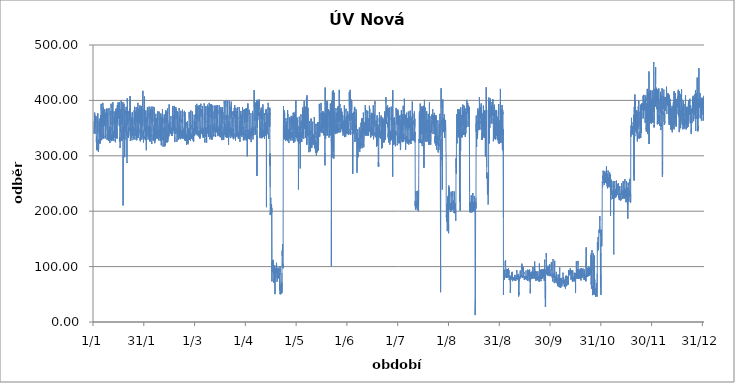
| Category | Series 0 |
|---|---|
| 2012-01-01 01:00:00 | 362.75 |
| 2012-01-01 02:00:00 | 362 |
| 2012-01-01 03:00:00 | 342.5 |
| 2012-01-01 04:00:00 | 340 |
| 2012-01-01 05:00:00 | 340.5 |
| 2012-01-01 06:00:00 | 355.75 |
| 2012-01-01 07:00:00 | 361.25 |
| 2012-01-01 08:00:00 | 362 |
| 2012-01-01 09:00:00 | 364.5 |
| 2012-01-01 10:00:00 | 375 |
| 2012-01-01 11:00:00 | 378 |
| 2012-01-01 12:00:00 | 364.5 |
| 2012-01-01 13:00:00 | 361 |
| 2012-01-01 14:00:00 | 354.25 |
| 2012-01-01 15:00:00 | 352.75 |
| 2012-01-01 16:00:00 | 354 |
| 2012-01-01 17:00:00 | 354.5 |
| 2012-01-01 18:00:00 | 363 |
| 2012-01-01 19:00:00 | 360.25 |
| 2012-01-01 20:00:00 | 368 |
| 2012-01-01 21:00:00 | 372.5 |
| 2012-01-01 22:00:00 | 369.5 |
| 2012-01-01 23:00:00 | 368.75 |
| 2012-01-02 | 368.5 |
| 2012-01-02 01:00:00 | 347.25 |
| 2012-01-02 02:00:00 | 344 |
| 2012-01-02 03:00:00 | 340 |
| 2012-01-02 04:00:00 | 342.25 |
| 2012-01-02 05:00:00 | 345 |
| 2012-01-02 06:00:00 | 359 |
| 2012-01-02 07:00:00 | 361 |
| 2012-01-02 08:00:00 | 371.25 |
| 2012-01-02 09:00:00 | 369 |
| 2012-01-02 10:00:00 | 334.75 |
| 2012-01-02 11:00:00 | 325 |
| 2012-01-02 12:00:00 | 325 |
| 2012-01-02 13:00:00 | 335.5 |
| 2012-01-02 14:00:00 | 318 |
| 2012-01-02 15:00:00 | 310.25 |
| 2012-01-02 16:00:00 | 317.75 |
| 2012-01-02 17:00:00 | 311.25 |
| 2012-01-02 18:00:00 | 315 |
| 2012-01-02 19:00:00 | 312.25 |
| 2012-01-02 20:00:00 | 314.5 |
| 2012-01-02 21:00:00 | 312.5 |
| 2012-01-02 22:00:00 | 314.5 |
| 2012-01-02 23:00:00 | 327.25 |
| 2012-01-03 | 333.5 |
| 2012-01-03 01:00:00 | 365.25 |
| 2012-01-03 02:00:00 | 362.75 |
| 2012-01-03 03:00:00 | 360.75 |
| 2012-01-03 04:00:00 | 343.5 |
| 2012-01-03 05:00:00 | 358.75 |
| 2012-01-03 06:00:00 | 363 |
| 2012-01-03 07:00:00 | 369 |
| 2012-01-03 08:00:00 | 376.75 |
| 2012-01-03 09:00:00 | 351 |
| 2012-01-03 10:00:00 | 314.75 |
| 2012-01-03 11:00:00 | 309.25 |
| 2012-01-03 12:00:00 | 315.5 |
| 2012-01-03 13:00:00 | 329 |
| 2012-01-03 14:00:00 | 322.5 |
| 2012-01-03 15:00:00 | 320.5 |
| 2012-01-03 16:00:00 | 316 |
| 2012-01-03 17:00:00 | 307.25 |
| 2012-01-03 18:00:00 | 311 |
| 2012-01-03 19:00:00 | 312.75 |
| 2012-01-03 20:00:00 | 312 |
| 2012-01-03 21:00:00 | 313 |
| 2012-01-03 22:00:00 | 314 |
| 2012-01-03 23:00:00 | 323.25 |
| 2012-01-04 | 327.25 |
| 2012-01-04 01:00:00 | 361.75 |
| 2012-01-04 02:00:00 | 360.5 |
| 2012-01-04 03:00:00 | 358.75 |
| 2012-01-04 04:00:00 | 343.75 |
| 2012-01-04 05:00:00 | 340.5 |
| 2012-01-04 06:00:00 | 354 |
| 2012-01-04 07:00:00 | 367 |
| 2012-01-04 08:00:00 | 325.75 |
| 2012-01-04 09:00:00 | 335 |
| 2012-01-04 10:00:00 | 340.5 |
| 2012-01-04 11:00:00 | 324.75 |
| 2012-01-04 12:00:00 | 322.25 |
| 2012-01-04 13:00:00 | 324.75 |
| 2012-01-04 14:00:00 | 323.5 |
| 2012-01-04 15:00:00 | 323 |
| 2012-01-04 16:00:00 | 330.75 |
| 2012-01-04 17:00:00 | 331 |
| 2012-01-04 18:00:00 | 322.5 |
| 2012-01-04 19:00:00 | 330.5 |
| 2012-01-04 20:00:00 | 324 |
| 2012-01-04 21:00:00 | 327.25 |
| 2012-01-04 22:00:00 | 332.75 |
| 2012-01-04 23:00:00 | 355 |
| 2012-01-05 | 353.75 |
| 2012-01-05 01:00:00 | 373.5 |
| 2012-01-05 02:00:00 | 373.5 |
| 2012-01-05 03:00:00 | 356.25 |
| 2012-01-05 04:00:00 | 352.25 |
| 2012-01-05 05:00:00 | 364 |
| 2012-01-05 06:00:00 | 371.5 |
| 2012-01-05 07:00:00 | 388.5 |
| 2012-01-05 08:00:00 | 393.75 |
| 2012-01-05 09:00:00 | 380.75 |
| 2012-01-05 10:00:00 | 367.5 |
| 2012-01-05 11:00:00 | 372.5 |
| 2012-01-05 12:00:00 | 373.75 |
| 2012-01-05 13:00:00 | 375 |
| 2012-01-05 14:00:00 | 328.25 |
| 2012-01-05 15:00:00 | 335 |
| 2012-01-05 16:00:00 | 334.25 |
| 2012-01-05 17:00:00 | 335 |
| 2012-01-05 18:00:00 | 333.25 |
| 2012-01-05 19:00:00 | 332.25 |
| 2012-01-05 20:00:00 | 330.25 |
| 2012-01-05 21:00:00 | 330.5 |
| 2012-01-05 22:00:00 | 336.5 |
| 2012-01-05 23:00:00 | 359.5 |
| 2012-01-06 | 376.5 |
| 2012-01-06 01:00:00 | 378.25 |
| 2012-01-06 02:00:00 | 381.5 |
| 2012-01-06 03:00:00 | 356.5 |
| 2012-01-06 04:00:00 | 352 |
| 2012-01-06 05:00:00 | 362 |
| 2012-01-06 06:00:00 | 373.75 |
| 2012-01-06 07:00:00 | 383 |
| 2012-01-06 08:00:00 | 395.5 |
| 2012-01-06 09:00:00 | 390.25 |
| 2012-01-06 10:00:00 | 343.5 |
| 2012-01-06 11:00:00 | 331.25 |
| 2012-01-06 12:00:00 | 342 |
| 2012-01-06 13:00:00 | 369.75 |
| 2012-01-06 14:00:00 | 379.25 |
| 2012-01-06 15:00:00 | 373.5 |
| 2012-01-06 16:00:00 | 379.5 |
| 2012-01-06 17:00:00 | 387.75 |
| 2012-01-06 18:00:00 | 385.25 |
| 2012-01-06 19:00:00 | 359.25 |
| 2012-01-06 20:00:00 | 331.5 |
| 2012-01-06 21:00:00 | 333.5 |
| 2012-01-06 22:00:00 | 339.25 |
| 2012-01-06 23:00:00 | 356.25 |
| 2012-01-07 | 375.75 |
| 2012-01-07 01:00:00 | 378 |
| 2012-01-07 02:00:00 | 376.75 |
| 2012-01-07 03:00:00 | 358.25 |
| 2012-01-07 04:00:00 | 354 |
| 2012-01-07 05:00:00 | 376 |
| 2012-01-07 06:00:00 | 375.75 |
| 2012-01-07 07:00:00 | 378 |
| 2012-01-07 08:00:00 | 374.75 |
| 2012-01-07 09:00:00 | 375.25 |
| 2012-01-07 10:00:00 | 384.5 |
| 2012-01-07 11:00:00 | 381.25 |
| 2012-01-07 12:00:00 | 374 |
| 2012-01-07 13:00:00 | 374 |
| 2012-01-07 14:00:00 | 370.5 |
| 2012-01-07 15:00:00 | 369.5 |
| 2012-01-07 16:00:00 | 377.75 |
| 2012-01-07 17:00:00 | 374.5 |
| 2012-01-07 18:00:00 | 331.25 |
| 2012-01-07 19:00:00 | 336 |
| 2012-01-07 20:00:00 | 333.75 |
| 2012-01-07 21:00:00 | 334 |
| 2012-01-07 22:00:00 | 340.75 |
| 2012-01-07 23:00:00 | 341.75 |
| 2012-01-08 | 363.25 |
| 2012-01-08 01:00:00 | 376 |
| 2012-01-08 02:00:00 | 375.75 |
| 2012-01-08 03:00:00 | 370 |
| 2012-01-08 04:00:00 | 352.25 |
| 2012-01-08 05:00:00 | 370.5 |
| 2012-01-08 06:00:00 | 371.25 |
| 2012-01-08 07:00:00 | 377 |
| 2012-01-08 08:00:00 | 372 |
| 2012-01-08 09:00:00 | 375.5 |
| 2012-01-08 10:00:00 | 382.5 |
| 2012-01-08 11:00:00 | 369 |
| 2012-01-08 12:00:00 | 367.75 |
| 2012-01-08 13:00:00 | 376.5 |
| 2012-01-08 14:00:00 | 373.25 |
| 2012-01-08 15:00:00 | 371 |
| 2012-01-08 16:00:00 | 379.25 |
| 2012-01-08 17:00:00 | 385.5 |
| 2012-01-08 18:00:00 | 375 |
| 2012-01-08 19:00:00 | 384.5 |
| 2012-01-08 20:00:00 | 345.75 |
| 2012-01-08 21:00:00 | 328.75 |
| 2012-01-08 22:00:00 | 340 |
| 2012-01-08 23:00:00 | 348.25 |
| 2012-01-09 | 357.75 |
| 2012-01-09 01:00:00 | 377 |
| 2012-01-09 02:00:00 | 369 |
| 2012-01-09 03:00:00 | 358 |
| 2012-01-09 04:00:00 | 350.25 |
| 2012-01-09 05:00:00 | 366.75 |
| 2012-01-09 06:00:00 | 374 |
| 2012-01-09 07:00:00 | 375.5 |
| 2012-01-09 08:00:00 | 340.75 |
| 2012-01-09 09:00:00 | 334.5 |
| 2012-01-09 10:00:00 | 346.25 |
| 2012-01-09 11:00:00 | 336.75 |
| 2012-01-09 12:00:00 | 331.5 |
| 2012-01-09 13:00:00 | 342.25 |
| 2012-01-09 14:00:00 | 337.25 |
| 2012-01-09 15:00:00 | 329.25 |
| 2012-01-09 16:00:00 | 327.25 |
| 2012-01-09 17:00:00 | 339 |
| 2012-01-09 18:00:00 | 332.75 |
| 2012-01-09 19:00:00 | 334.5 |
| 2012-01-09 20:00:00 | 333.5 |
| 2012-01-09 21:00:00 | 332.5 |
| 2012-01-09 22:00:00 | 346.5 |
| 2012-01-09 23:00:00 | 354.25 |
| 2012-01-10 | 355.25 |
| 2012-01-10 01:00:00 | 386.25 |
| 2012-01-10 02:00:00 | 372.75 |
| 2012-01-10 03:00:00 | 355 |
| 2012-01-10 04:00:00 | 353 |
| 2012-01-10 05:00:00 | 353 |
| 2012-01-10 06:00:00 | 329.25 |
| 2012-01-10 07:00:00 | 343.25 |
| 2012-01-10 08:00:00 | 345.75 |
| 2012-01-10 09:00:00 | 340.5 |
| 2012-01-10 10:00:00 | 353 |
| 2012-01-10 11:00:00 | 348.5 |
| 2012-01-10 12:00:00 | 344.25 |
| 2012-01-10 13:00:00 | 323 |
| 2012-01-10 14:00:00 | 332.25 |
| 2012-01-10 15:00:00 | 336.25 |
| 2012-01-10 16:00:00 | 329 |
| 2012-01-10 17:00:00 | 335 |
| 2012-01-10 18:00:00 | 342.75 |
| 2012-01-10 19:00:00 | 332.75 |
| 2012-01-10 20:00:00 | 336 |
| 2012-01-10 21:00:00 | 332.25 |
| 2012-01-10 22:00:00 | 344.75 |
| 2012-01-10 23:00:00 | 354.5 |
| 2012-01-11 | 363.5 |
| 2012-01-11 01:00:00 | 381 |
| 2012-01-11 02:00:00 | 373.25 |
| 2012-01-11 03:00:00 | 362.5 |
| 2012-01-11 04:00:00 | 355.5 |
| 2012-01-11 05:00:00 | 362.5 |
| 2012-01-11 06:00:00 | 381.25 |
| 2012-01-11 07:00:00 | 394 |
| 2012-01-11 08:00:00 | 385.75 |
| 2012-01-11 09:00:00 | 339 |
| 2012-01-11 10:00:00 | 333 |
| 2012-01-11 11:00:00 | 332.25 |
| 2012-01-11 12:00:00 | 326.5 |
| 2012-01-11 13:00:00 | 337.25 |
| 2012-01-11 14:00:00 | 338.5 |
| 2012-01-11 15:00:00 | 338.75 |
| 2012-01-11 16:00:00 | 329.75 |
| 2012-01-11 17:00:00 | 333 |
| 2012-01-11 18:00:00 | 338 |
| 2012-01-11 19:00:00 | 330 |
| 2012-01-11 20:00:00 | 334.25 |
| 2012-01-11 21:00:00 | 332 |
| 2012-01-11 22:00:00 | 331 |
| 2012-01-11 23:00:00 | 350.75 |
| 2012-01-12 | 345.25 |
| 2012-01-12 01:00:00 | 381.5 |
| 2012-01-12 02:00:00 | 379 |
| 2012-01-12 03:00:00 | 367.25 |
| 2012-01-12 04:00:00 | 356.25 |
| 2012-01-12 05:00:00 | 366 |
| 2012-01-12 06:00:00 | 376 |
| 2012-01-12 07:00:00 | 387 |
| 2012-01-12 08:00:00 | 396.75 |
| 2012-01-12 09:00:00 | 355.25 |
| 2012-01-12 10:00:00 | 331.5 |
| 2012-01-12 11:00:00 | 327 |
| 2012-01-12 12:00:00 | 335 |
| 2012-01-12 13:00:00 | 343 |
| 2012-01-12 14:00:00 | 339.5 |
| 2012-01-12 15:00:00 | 330.5 |
| 2012-01-12 16:00:00 | 344.75 |
| 2012-01-12 17:00:00 | 329.5 |
| 2012-01-12 18:00:00 | 330.5 |
| 2012-01-12 19:00:00 | 331.75 |
| 2012-01-12 20:00:00 | 326.75 |
| 2012-01-12 21:00:00 | 329.25 |
| 2012-01-12 22:00:00 | 332.25 |
| 2012-01-12 23:00:00 | 347.75 |
| 2012-01-13 | 366.75 |
| 2012-01-13 01:00:00 | 380.25 |
| 2012-01-13 02:00:00 | 380.25 |
| 2012-01-13 03:00:00 | 376.75 |
| 2012-01-13 04:00:00 | 357.5 |
| 2012-01-13 05:00:00 | 367.5 |
| 2012-01-13 06:00:00 | 372.25 |
| 2012-01-13 07:00:00 | 361.5 |
| 2012-01-13 08:00:00 | 342 |
| 2012-01-13 09:00:00 | 332.75 |
| 2012-01-13 10:00:00 | 337.5 |
| 2012-01-13 11:00:00 | 340 |
| 2012-01-13 12:00:00 | 334.25 |
| 2012-01-13 13:00:00 | 346 |
| 2012-01-13 14:00:00 | 340 |
| 2012-01-13 15:00:00 | 339 |
| 2012-01-13 16:00:00 | 349 |
| 2012-01-13 17:00:00 | 379.25 |
| 2012-01-13 18:00:00 | 339 |
| 2012-01-13 19:00:00 | 326.5 |
| 2012-01-13 20:00:00 | 324.5 |
| 2012-01-13 21:00:00 | 328.25 |
| 2012-01-13 22:00:00 | 327.75 |
| 2012-01-13 23:00:00 | 345 |
| 2012-01-14 | 362.75 |
| 2012-01-14 01:00:00 | 384.75 |
| 2012-01-14 02:00:00 | 381 |
| 2012-01-14 03:00:00 | 366.5 |
| 2012-01-14 04:00:00 | 356 |
| 2012-01-14 05:00:00 | 363.25 |
| 2012-01-14 06:00:00 | 369.25 |
| 2012-01-14 07:00:00 | 378.75 |
| 2012-01-14 08:00:00 | 379 |
| 2012-01-14 09:00:00 | 373.25 |
| 2012-01-14 10:00:00 | 371.25 |
| 2012-01-14 11:00:00 | 370.25 |
| 2012-01-14 12:00:00 | 362.75 |
| 2012-01-14 13:00:00 | 333.5 |
| 2012-01-14 14:00:00 | 339.5 |
| 2012-01-14 15:00:00 | 376.5 |
| 2012-01-14 16:00:00 | 385.25 |
| 2012-01-14 17:00:00 | 358.25 |
| 2012-01-14 18:00:00 | 332 |
| 2012-01-14 19:00:00 | 332.5 |
| 2012-01-14 20:00:00 | 334 |
| 2012-01-14 21:00:00 | 331.25 |
| 2012-01-14 22:00:00 | 330 |
| 2012-01-14 23:00:00 | 348.25 |
| 2012-01-15 | 391.25 |
| 2012-01-15 01:00:00 | 380.75 |
| 2012-01-15 02:00:00 | 381.75 |
| 2012-01-15 03:00:00 | 366 |
| 2012-01-15 04:00:00 | 357.75 |
| 2012-01-15 05:00:00 | 363 |
| 2012-01-15 06:00:00 | 372 |
| 2012-01-15 07:00:00 | 381.5 |
| 2012-01-15 08:00:00 | 381.5 |
| 2012-01-15 09:00:00 | 372.75 |
| 2012-01-15 10:00:00 | 390.5 |
| 2012-01-15 11:00:00 | 392.25 |
| 2012-01-15 12:00:00 | 396.5 |
| 2012-01-15 13:00:00 | 379.25 |
| 2012-01-15 14:00:00 | 371.25 |
| 2012-01-15 15:00:00 | 366.5 |
| 2012-01-15 16:00:00 | 371 |
| 2012-01-15 17:00:00 | 369 |
| 2012-01-15 18:00:00 | 370 |
| 2012-01-15 19:00:00 | 374 |
| 2012-01-15 20:00:00 | 371.75 |
| 2012-01-15 21:00:00 | 369 |
| 2012-01-15 22:00:00 | 385.5 |
| 2012-01-15 23:00:00 | 395.25 |
| 2012-01-16 | 390.25 |
| 2012-01-16 01:00:00 | 377.25 |
| 2012-01-16 02:00:00 | 370.75 |
| 2012-01-16 03:00:00 | 361.75 |
| 2012-01-16 04:00:00 | 353.75 |
| 2012-01-16 05:00:00 | 365.25 |
| 2012-01-16 06:00:00 | 372.5 |
| 2012-01-16 07:00:00 | 390.75 |
| 2012-01-16 08:00:00 | 396.5 |
| 2012-01-16 09:00:00 | 391 |
| 2012-01-16 10:00:00 | 367.25 |
| 2012-01-16 11:00:00 | 326 |
| 2012-01-16 12:00:00 | 327 |
| 2012-01-16 13:00:00 | 333.5 |
| 2012-01-16 14:00:00 | 324.25 |
| 2012-01-16 15:00:00 | 320 |
| 2012-01-16 16:00:00 | 314.25 |
| 2012-01-16 17:00:00 | 319.25 |
| 2012-01-16 18:00:00 | 318.75 |
| 2012-01-16 19:00:00 | 324.75 |
| 2012-01-16 20:00:00 | 346.25 |
| 2012-01-16 21:00:00 | 345 |
| 2012-01-16 22:00:00 | 354.25 |
| 2012-01-16 23:00:00 | 343.25 |
| 2012-01-17 | 351.5 |
| 2012-01-17 01:00:00 | 381.5 |
| 2012-01-17 02:00:00 | 384.25 |
| 2012-01-17 03:00:00 | 371 |
| 2012-01-17 04:00:00 | 356.25 |
| 2012-01-17 05:00:00 | 376 |
| 2012-01-17 06:00:00 | 377.75 |
| 2012-01-17 07:00:00 | 391.5 |
| 2012-01-17 08:00:00 | 400.75 |
| 2012-01-17 09:00:00 | 381.5 |
| 2012-01-17 10:00:00 | 337.75 |
| 2012-01-17 11:00:00 | 329.5 |
| 2012-01-17 12:00:00 | 326.75 |
| 2012-01-17 13:00:00 | 337 |
| 2012-01-17 14:00:00 | 330 |
| 2012-01-17 15:00:00 | 338.25 |
| 2012-01-17 16:00:00 | 345.5 |
| 2012-01-17 17:00:00 | 327.5 |
| 2012-01-17 18:00:00 | 336 |
| 2012-01-17 19:00:00 | 328.25 |
| 2012-01-17 20:00:00 | 328.75 |
| 2012-01-17 21:00:00 | 330.5 |
| 2012-01-17 22:00:00 | 335 |
| 2012-01-17 23:00:00 | 355 |
| 2012-01-18 | 357.75 |
| 2012-01-18 01:00:00 | 384 |
| 2012-01-18 02:00:00 | 375.75 |
| 2012-01-18 03:00:00 | 362.25 |
| 2012-01-18 04:00:00 | 357 |
| 2012-01-18 05:00:00 | 378.5 |
| 2012-01-18 06:00:00 | 380.75 |
| 2012-01-18 07:00:00 | 384.25 |
| 2012-01-18 08:00:00 | 397 |
| 2012-01-18 09:00:00 | 342.75 |
| 2012-01-18 10:00:00 | 268 |
| 2012-01-18 11:00:00 | 210.25 |
| 2012-01-18 12:00:00 | 300.5 |
| 2012-01-18 13:00:00 | 352.75 |
| 2012-01-18 14:00:00 | 338.75 |
| 2012-01-18 15:00:00 | 336.25 |
| 2012-01-18 16:00:00 | 337 |
| 2012-01-18 17:00:00 | 348.75 |
| 2012-01-18 18:00:00 | 350.5 |
| 2012-01-18 19:00:00 | 343.5 |
| 2012-01-18 20:00:00 | 337 |
| 2012-01-18 21:00:00 | 330.75 |
| 2012-01-18 22:00:00 | 336.75 |
| 2012-01-18 23:00:00 | 359.75 |
| 2012-01-19 | 394 |
| 2012-01-19 01:00:00 | 385.5 |
| 2012-01-19 02:00:00 | 374.5 |
| 2012-01-19 03:00:00 | 360.5 |
| 2012-01-19 04:00:00 | 355 |
| 2012-01-19 05:00:00 | 351.75 |
| 2012-01-19 06:00:00 | 382.25 |
| 2012-01-19 07:00:00 | 384.25 |
| 2012-01-19 08:00:00 | 353.5 |
| 2012-01-19 09:00:00 | 343 |
| 2012-01-19 10:00:00 | 297.5 |
| 2012-01-19 11:00:00 | 340.75 |
| 2012-01-19 12:00:00 | 329.25 |
| 2012-01-19 13:00:00 | 334.25 |
| 2012-01-19 14:00:00 | 354.75 |
| 2012-01-19 15:00:00 | 353.75 |
| 2012-01-19 16:00:00 | 357.25 |
| 2012-01-19 17:00:00 | 358.5 |
| 2012-01-19 18:00:00 | 353.5 |
| 2012-01-19 19:00:00 | 342.25 |
| 2012-01-19 20:00:00 | 343.25 |
| 2012-01-19 21:00:00 | 341.75 |
| 2012-01-19 22:00:00 | 343.75 |
| 2012-01-19 23:00:00 | 342.5 |
| 2012-01-20 | 359.25 |
| 2012-01-20 01:00:00 | 376 |
| 2012-01-20 02:00:00 | 381.75 |
| 2012-01-20 03:00:00 | 380.25 |
| 2012-01-20 04:00:00 | 375.5 |
| 2012-01-20 05:00:00 | 379.25 |
| 2012-01-20 06:00:00 | 383.75 |
| 2012-01-20 07:00:00 | 388.25 |
| 2012-01-20 08:00:00 | 389 |
| 2012-01-20 09:00:00 | 349 |
| 2012-01-20 10:00:00 | 336.25 |
| 2012-01-20 11:00:00 | 335.5 |
| 2012-01-20 12:00:00 | 338 |
| 2012-01-20 13:00:00 | 349.75 |
| 2012-01-20 14:00:00 | 380.25 |
| 2012-01-20 15:00:00 | 368.75 |
| 2012-01-20 16:00:00 | 339 |
| 2012-01-20 17:00:00 | 341.5 |
| 2012-01-20 18:00:00 | 298.5 |
| 2012-01-20 19:00:00 | 287 |
| 2012-01-20 20:00:00 | 289.5 |
| 2012-01-20 21:00:00 | 289.75 |
| 2012-01-20 22:00:00 | 340 |
| 2012-01-20 23:00:00 | 404 |
| 2012-01-21 | 396.5 |
| 2012-01-21 01:00:00 | 392.25 |
| 2012-01-21 02:00:00 | 381.25 |
| 2012-01-21 03:00:00 | 375.25 |
| 2012-01-21 04:00:00 | 356 |
| 2012-01-21 05:00:00 | 361 |
| 2012-01-21 06:00:00 | 378 |
| 2012-01-21 07:00:00 | 381 |
| 2012-01-21 08:00:00 | 380.25 |
| 2012-01-21 09:00:00 | 376.25 |
| 2012-01-21 10:00:00 | 380.5 |
| 2012-01-21 11:00:00 | 358.5 |
| 2012-01-21 12:00:00 | 332 |
| 2012-01-21 13:00:00 | 344 |
| 2012-01-21 14:00:00 | 336.5 |
| 2012-01-21 15:00:00 | 333.75 |
| 2012-01-21 16:00:00 | 338.5 |
| 2012-01-21 17:00:00 | 347.75 |
| 2012-01-21 18:00:00 | 339.75 |
| 2012-01-21 19:00:00 | 339.75 |
| 2012-01-21 20:00:00 | 336.5 |
| 2012-01-21 21:00:00 | 336.75 |
| 2012-01-21 22:00:00 | 337.5 |
| 2012-01-21 23:00:00 | 351 |
| 2012-01-22 | 344 |
| 2012-01-22 01:00:00 | 375.25 |
| 2012-01-22 02:00:00 | 381 |
| 2012-01-22 03:00:00 | 379.5 |
| 2012-01-22 04:00:00 | 375.5 |
| 2012-01-22 05:00:00 | 365.5 |
| 2012-01-22 06:00:00 | 367.75 |
| 2012-01-22 07:00:00 | 375 |
| 2012-01-22 08:00:00 | 374 |
| 2012-01-22 09:00:00 | 385 |
| 2012-01-22 10:00:00 | 375 |
| 2012-01-22 11:00:00 | 363.5 |
| 2012-01-22 12:00:00 | 362.75 |
| 2012-01-22 13:00:00 | 374 |
| 2012-01-22 14:00:00 | 366.75 |
| 2012-01-22 15:00:00 | 363.75 |
| 2012-01-22 16:00:00 | 407.5 |
| 2012-01-22 17:00:00 | 350.75 |
| 2012-01-22 18:00:00 | 332 |
| 2012-01-22 19:00:00 | 326.75 |
| 2012-01-22 20:00:00 | 329 |
| 2012-01-22 21:00:00 | 330.5 |
| 2012-01-22 22:00:00 | 331.75 |
| 2012-01-22 23:00:00 | 355.75 |
| 2012-01-23 | 347 |
| 2012-01-23 01:00:00 | 377.75 |
| 2012-01-23 02:00:00 | 377.75 |
| 2012-01-23 03:00:00 | 359.25 |
| 2012-01-23 04:00:00 | 354.25 |
| 2012-01-23 05:00:00 | 355.75 |
| 2012-01-23 06:00:00 | 368.75 |
| 2012-01-23 07:00:00 | 332.25 |
| 2012-01-23 08:00:00 | 341.25 |
| 2012-01-23 09:00:00 | 339 |
| 2012-01-23 10:00:00 | 337 |
| 2012-01-23 11:00:00 | 338.75 |
| 2012-01-23 12:00:00 | 340 |
| 2012-01-23 13:00:00 | 350.25 |
| 2012-01-23 14:00:00 | 346.75 |
| 2012-01-23 15:00:00 | 343 |
| 2012-01-23 16:00:00 | 346.5 |
| 2012-01-23 17:00:00 | 336 |
| 2012-01-23 18:00:00 | 337.25 |
| 2012-01-23 19:00:00 | 328 |
| 2012-01-23 20:00:00 | 329.5 |
| 2012-01-23 21:00:00 | 330.5 |
| 2012-01-23 22:00:00 | 334.75 |
| 2012-01-23 23:00:00 | 348.75 |
| 2012-01-24 | 360.75 |
| 2012-01-24 01:00:00 | 378.5 |
| 2012-01-24 02:00:00 | 378.25 |
| 2012-01-24 03:00:00 | 371 |
| 2012-01-24 04:00:00 | 352.75 |
| 2012-01-24 05:00:00 | 355.5 |
| 2012-01-24 06:00:00 | 368.5 |
| 2012-01-24 07:00:00 | 347.25 |
| 2012-01-24 08:00:00 | 342.5 |
| 2012-01-24 09:00:00 | 353.75 |
| 2012-01-24 10:00:00 | 344.5 |
| 2012-01-24 11:00:00 | 346.75 |
| 2012-01-24 12:00:00 | 336.75 |
| 2012-01-24 13:00:00 | 348.75 |
| 2012-01-24 14:00:00 | 344.25 |
| 2012-01-24 15:00:00 | 335.75 |
| 2012-01-24 16:00:00 | 346.25 |
| 2012-01-24 17:00:00 | 338 |
| 2012-01-24 18:00:00 | 329.75 |
| 2012-01-24 19:00:00 | 331.75 |
| 2012-01-24 20:00:00 | 334 |
| 2012-01-24 21:00:00 | 332 |
| 2012-01-24 22:00:00 | 333 |
| 2012-01-24 23:00:00 | 349.5 |
| 2012-01-25 | 365.5 |
| 2012-01-25 01:00:00 | 381.75 |
| 2012-01-25 02:00:00 | 379.5 |
| 2012-01-25 03:00:00 | 376 |
| 2012-01-25 04:00:00 | 357.25 |
| 2012-01-25 05:00:00 | 364.25 |
| 2012-01-25 06:00:00 | 373.75 |
| 2012-01-25 07:00:00 | 381.75 |
| 2012-01-25 08:00:00 | 388.5 |
| 2012-01-25 09:00:00 | 363.75 |
| 2012-01-25 10:00:00 | 353.25 |
| 2012-01-25 11:00:00 | 342.25 |
| 2012-01-25 12:00:00 | 336.5 |
| 2012-01-25 13:00:00 | 334 |
| 2012-01-25 14:00:00 | 333.25 |
| 2012-01-25 15:00:00 | 329.25 |
| 2012-01-25 16:00:00 | 331.5 |
| 2012-01-25 17:00:00 | 335.25 |
| 2012-01-25 18:00:00 | 349.75 |
| 2012-01-25 19:00:00 | 335.75 |
| 2012-01-25 20:00:00 | 338 |
| 2012-01-25 21:00:00 | 341 |
| 2012-01-25 22:00:00 | 349.25 |
| 2012-01-25 23:00:00 | 358.25 |
| 2012-01-26 | 346 |
| 2012-01-26 01:00:00 | 379.5 |
| 2012-01-26 02:00:00 | 379.5 |
| 2012-01-26 03:00:00 | 362.75 |
| 2012-01-26 04:00:00 | 360.5 |
| 2012-01-26 05:00:00 | 363.75 |
| 2012-01-26 06:00:00 | 382 |
| 2012-01-26 07:00:00 | 388 |
| 2012-01-26 08:00:00 | 389.25 |
| 2012-01-26 09:00:00 | 360.25 |
| 2012-01-26 10:00:00 | 343 |
| 2012-01-26 11:00:00 | 337.75 |
| 2012-01-26 12:00:00 | 340 |
| 2012-01-26 13:00:00 | 343.75 |
| 2012-01-26 14:00:00 | 330.75 |
| 2012-01-26 15:00:00 | 329 |
| 2012-01-26 16:00:00 | 328 |
| 2012-01-26 17:00:00 | 334 |
| 2012-01-26 18:00:00 | 332.75 |
| 2012-01-26 19:00:00 | 344.75 |
| 2012-01-26 20:00:00 | 347.75 |
| 2012-01-26 21:00:00 | 341 |
| 2012-01-26 22:00:00 | 332.75 |
| 2012-01-26 23:00:00 | 351 |
| 2012-01-27 | 361.5 |
| 2012-01-27 01:00:00 | 384.5 |
| 2012-01-27 02:00:00 | 383.75 |
| 2012-01-27 03:00:00 | 374.25 |
| 2012-01-27 04:00:00 | 358.75 |
| 2012-01-27 05:00:00 | 385.25 |
| 2012-01-27 06:00:00 | 387.75 |
| 2012-01-27 07:00:00 | 388.5 |
| 2012-01-27 08:00:00 | 395.5 |
| 2012-01-27 09:00:00 | 371.25 |
| 2012-01-27 10:00:00 | 348.25 |
| 2012-01-27 11:00:00 | 340.25 |
| 2012-01-27 12:00:00 | 341 |
| 2012-01-27 13:00:00 | 353 |
| 2012-01-27 14:00:00 | 381.75 |
| 2012-01-27 15:00:00 | 384 |
| 2012-01-27 16:00:00 | 339.75 |
| 2012-01-27 17:00:00 | 332.75 |
| 2012-01-27 18:00:00 | 343.5 |
| 2012-01-27 19:00:00 | 339 |
| 2012-01-27 20:00:00 | 336.5 |
| 2012-01-27 21:00:00 | 347 |
| 2012-01-27 22:00:00 | 342 |
| 2012-01-27 23:00:00 | 350.25 |
| 2012-01-28 | 373.75 |
| 2012-01-28 01:00:00 | 365.5 |
| 2012-01-28 02:00:00 | 364.5 |
| 2012-01-28 03:00:00 | 363.75 |
| 2012-01-28 04:00:00 | 358.5 |
| 2012-01-28 05:00:00 | 358.5 |
| 2012-01-28 06:00:00 | 372.25 |
| 2012-01-28 07:00:00 | 379 |
| 2012-01-28 08:00:00 | 387.25 |
| 2012-01-28 09:00:00 | 379.5 |
| 2012-01-28 10:00:00 | 369.5 |
| 2012-01-28 11:00:00 | 367.25 |
| 2012-01-28 12:00:00 | 361.75 |
| 2012-01-28 13:00:00 | 375 |
| 2012-01-28 14:00:00 | 391 |
| 2012-01-28 15:00:00 | 358.5 |
| 2012-01-28 16:00:00 | 328.75 |
| 2012-01-28 17:00:00 | 333 |
| 2012-01-28 18:00:00 | 333.75 |
| 2012-01-28 19:00:00 | 326.25 |
| 2012-01-28 20:00:00 | 326.75 |
| 2012-01-28 21:00:00 | 329.25 |
| 2012-01-28 22:00:00 | 331.25 |
| 2012-01-28 23:00:00 | 382 |
| 2012-01-29 | 369.5 |
| 2012-01-29 01:00:00 | 364.5 |
| 2012-01-29 02:00:00 | 363.25 |
| 2012-01-29 03:00:00 | 360.25 |
| 2012-01-29 04:00:00 | 356.5 |
| 2012-01-29 05:00:00 | 352.5 |
| 2012-01-29 06:00:00 | 371 |
| 2012-01-29 07:00:00 | 379.75 |
| 2012-01-29 08:00:00 | 390 |
| 2012-01-29 09:00:00 | 383.75 |
| 2012-01-29 10:00:00 | 372 |
| 2012-01-29 11:00:00 | 375.5 |
| 2012-01-29 12:00:00 | 367.5 |
| 2012-01-29 13:00:00 | 386 |
| 2012-01-29 14:00:00 | 387 |
| 2012-01-29 15:00:00 | 331.25 |
| 2012-01-29 16:00:00 | 329.25 |
| 2012-01-29 17:00:00 | 330 |
| 2012-01-29 18:00:00 | 328.25 |
| 2012-01-29 19:00:00 | 330.75 |
| 2012-01-29 20:00:00 | 342.75 |
| 2012-01-29 21:00:00 | 347.75 |
| 2012-01-29 22:00:00 | 347.5 |
| 2012-01-29 23:00:00 | 353.75 |
| 2012-01-30 | 376.5 |
| 2012-01-30 01:00:00 | 361.5 |
| 2012-01-30 02:00:00 | 363 |
| 2012-01-30 03:00:00 | 359.25 |
| 2012-01-30 04:00:00 | 354 |
| 2012-01-30 05:00:00 | 368.25 |
| 2012-01-30 06:00:00 | 375.25 |
| 2012-01-30 07:00:00 | 385.75 |
| 2012-01-30 08:00:00 | 417.25 |
| 2012-01-30 09:00:00 | 362 |
| 2012-01-30 10:00:00 | 343.25 |
| 2012-01-30 11:00:00 | 337.75 |
| 2012-01-30 12:00:00 | 332.25 |
| 2012-01-30 13:00:00 | 345.75 |
| 2012-01-30 14:00:00 | 339.25 |
| 2012-01-30 15:00:00 | 338 |
| 2012-01-30 16:00:00 | 340.25 |
| 2012-01-30 17:00:00 | 324 |
| 2012-01-30 18:00:00 | 330.25 |
| 2012-01-30 19:00:00 | 331.75 |
| 2012-01-30 20:00:00 | 333.5 |
| 2012-01-30 21:00:00 | 330.5 |
| 2012-01-30 22:00:00 | 332.25 |
| 2012-01-30 23:00:00 | 345.25 |
| 2012-01-31 | 358.75 |
| 2012-01-31 01:00:00 | 384.75 |
| 2012-01-31 02:00:00 | 383.25 |
| 2012-01-31 03:00:00 | 378.5 |
| 2012-01-31 04:00:00 | 360.75 |
| 2012-01-31 05:00:00 | 354.75 |
| 2012-01-31 06:00:00 | 379 |
| 2012-01-31 07:00:00 | 407 |
| 2012-01-31 08:00:00 | 400 |
| 2012-01-31 09:00:00 | 345.75 |
| 2012-01-31 10:00:00 | 346.75 |
| 2012-01-31 11:00:00 | 344.75 |
| 2012-01-31 12:00:00 | 344.5 |
| 2012-01-31 13:00:00 | 355.5 |
| 2012-01-31 14:00:00 | 343.5 |
| 2012-01-31 15:00:00 | 345 |
| 2012-01-31 16:00:00 | 343 |
| 2012-01-31 17:00:00 | 329.75 |
| 2012-01-31 18:00:00 | 336 |
| 2012-01-31 19:00:00 | 331 |
| 2012-01-31 20:00:00 | 330 |
| 2012-01-31 21:00:00 | 328.25 |
| 2012-01-31 22:00:00 | 330.5 |
| 2012-01-31 23:00:00 | 349.75 |
| 2012-02-01 | 346.75 |
| 2012-02-01 01:00:00 | 381.75 |
| 2012-02-01 02:00:00 | 383.25 |
| 2012-02-01 03:00:00 | 371.25 |
| 2012-02-01 04:00:00 | 360 |
| 2012-02-01 05:00:00 | 357.5 |
| 2012-02-01 06:00:00 | 369.5 |
| 2012-02-01 07:00:00 | 363 |
| 2012-02-01 08:00:00 | 351 |
| 2012-02-01 09:00:00 | 310 |
| 2012-02-01 10:00:00 | 349.5 |
| 2012-02-01 11:00:00 | 355.75 |
| 2012-02-01 12:00:00 | 353 |
| 2012-02-01 13:00:00 | 369.5 |
| 2012-02-01 14:00:00 | 346.5 |
| 2012-02-01 15:00:00 | 352.75 |
| 2012-02-01 16:00:00 | 349.5 |
| 2012-02-01 17:00:00 | 345 |
| 2012-02-01 18:00:00 | 347.25 |
| 2012-02-01 19:00:00 | 340.75 |
| 2012-02-01 20:00:00 | 334.5 |
| 2012-02-01 21:00:00 | 333.5 |
| 2012-02-01 22:00:00 | 336.5 |
| 2012-02-01 23:00:00 | 366.25 |
| 2012-02-02 | 359.25 |
| 2012-02-02 01:00:00 | 387.5 |
| 2012-02-02 02:00:00 | 383.5 |
| 2012-02-02 03:00:00 | 368 |
| 2012-02-02 04:00:00 | 362.25 |
| 2012-02-02 05:00:00 | 375.5 |
| 2012-02-02 06:00:00 | 377 |
| 2012-02-02 07:00:00 | 383.75 |
| 2012-02-02 08:00:00 | 366.75 |
| 2012-02-02 09:00:00 | 365.75 |
| 2012-02-02 10:00:00 | 343 |
| 2012-02-02 11:00:00 | 329.25 |
| 2012-02-02 12:00:00 | 334 |
| 2012-02-02 13:00:00 | 338.5 |
| 2012-02-02 14:00:00 | 337.25 |
| 2012-02-02 15:00:00 | 341.75 |
| 2012-02-02 16:00:00 | 354.75 |
| 2012-02-02 17:00:00 | 350.75 |
| 2012-02-02 18:00:00 | 344.25 |
| 2012-02-02 19:00:00 | 337.75 |
| 2012-02-02 20:00:00 | 336.5 |
| 2012-02-02 21:00:00 | 333.5 |
| 2012-02-02 22:00:00 | 342.5 |
| 2012-02-02 23:00:00 | 364 |
| 2012-02-03 | 367.25 |
| 2012-02-03 01:00:00 | 388.75 |
| 2012-02-03 02:00:00 | 390.25 |
| 2012-02-03 03:00:00 | 368.5 |
| 2012-02-03 04:00:00 | 367.25 |
| 2012-02-03 05:00:00 | 371.75 |
| 2012-02-03 06:00:00 | 378.5 |
| 2012-02-03 07:00:00 | 366.25 |
| 2012-02-03 08:00:00 | 349.25 |
| 2012-02-03 09:00:00 | 351.75 |
| 2012-02-03 10:00:00 | 351.25 |
| 2012-02-03 11:00:00 | 347.25 |
| 2012-02-03 12:00:00 | 329.75 |
| 2012-02-03 13:00:00 | 352.25 |
| 2012-02-03 14:00:00 | 325.75 |
| 2012-02-03 15:00:00 | 335.25 |
| 2012-02-03 16:00:00 | 343 |
| 2012-02-03 17:00:00 | 338.5 |
| 2012-02-03 18:00:00 | 341.75 |
| 2012-02-03 19:00:00 | 343.75 |
| 2012-02-03 20:00:00 | 342 |
| 2012-02-03 21:00:00 | 330.25 |
| 2012-02-03 22:00:00 | 329.5 |
| 2012-02-03 23:00:00 | 353.75 |
| 2012-02-04 | 352.5 |
| 2012-02-04 01:00:00 | 383.5 |
| 2012-02-04 02:00:00 | 383.75 |
| 2012-02-04 03:00:00 | 373.75 |
| 2012-02-04 04:00:00 | 364 |
| 2012-02-04 05:00:00 | 378.75 |
| 2012-02-04 06:00:00 | 384.75 |
| 2012-02-04 07:00:00 | 388.75 |
| 2012-02-04 08:00:00 | 387 |
| 2012-02-04 09:00:00 | 357.5 |
| 2012-02-04 10:00:00 | 344.75 |
| 2012-02-04 11:00:00 | 340.5 |
| 2012-02-04 12:00:00 | 341.5 |
| 2012-02-04 13:00:00 | 332.5 |
| 2012-02-04 14:00:00 | 323.5 |
| 2012-02-04 15:00:00 | 321.25 |
| 2012-02-04 16:00:00 | 320.25 |
| 2012-02-04 17:00:00 | 325.25 |
| 2012-02-04 18:00:00 | 327.75 |
| 2012-02-04 19:00:00 | 333 |
| 2012-02-04 20:00:00 | 335 |
| 2012-02-04 21:00:00 | 342.5 |
| 2012-02-04 22:00:00 | 351 |
| 2012-02-04 23:00:00 | 352.75 |
| 2012-02-05 | 357.25 |
| 2012-02-05 01:00:00 | 384.5 |
| 2012-02-05 02:00:00 | 369.75 |
| 2012-02-05 03:00:00 | 366.25 |
| 2012-02-05 04:00:00 | 361.25 |
| 2012-02-05 05:00:00 | 379.75 |
| 2012-02-05 06:00:00 | 381 |
| 2012-02-05 07:00:00 | 388.75 |
| 2012-02-05 08:00:00 | 386.25 |
| 2012-02-05 09:00:00 | 343 |
| 2012-02-05 10:00:00 | 344 |
| 2012-02-05 11:00:00 | 338.5 |
| 2012-02-05 12:00:00 | 328.75 |
| 2012-02-05 13:00:00 | 338.5 |
| 2012-02-05 14:00:00 | 327.75 |
| 2012-02-05 15:00:00 | 332 |
| 2012-02-05 16:00:00 | 326.75 |
| 2012-02-05 17:00:00 | 329.75 |
| 2012-02-05 18:00:00 | 331.75 |
| 2012-02-05 19:00:00 | 336.75 |
| 2012-02-05 20:00:00 | 354.25 |
| 2012-02-05 21:00:00 | 337.5 |
| 2012-02-05 22:00:00 | 348.25 |
| 2012-02-05 23:00:00 | 354.5 |
| 2012-02-06 | 360.25 |
| 2012-02-06 01:00:00 | 388 |
| 2012-02-06 02:00:00 | 376.5 |
| 2012-02-06 03:00:00 | 368.25 |
| 2012-02-06 04:00:00 | 361.5 |
| 2012-02-06 05:00:00 | 378 |
| 2012-02-06 06:00:00 | 378.25 |
| 2012-02-06 07:00:00 | 373.5 |
| 2012-02-06 08:00:00 | 337.25 |
| 2012-02-06 09:00:00 | 340.5 |
| 2012-02-06 10:00:00 | 328.5 |
| 2012-02-06 11:00:00 | 322.75 |
| 2012-02-06 12:00:00 | 335.75 |
| 2012-02-06 13:00:00 | 351.25 |
| 2012-02-06 14:00:00 | 344.5 |
| 2012-02-06 15:00:00 | 339.25 |
| 2012-02-06 16:00:00 | 341 |
| 2012-02-06 17:00:00 | 342.75 |
| 2012-02-06 18:00:00 | 340.25 |
| 2012-02-06 19:00:00 | 329.75 |
| 2012-02-06 20:00:00 | 331.75 |
| 2012-02-06 21:00:00 | 328 |
| 2012-02-06 22:00:00 | 329.75 |
| 2012-02-06 23:00:00 | 332.5 |
| 2012-02-07 | 340.5 |
| 2012-02-07 01:00:00 | 373 |
| 2012-02-07 02:00:00 | 375.75 |
| 2012-02-07 03:00:00 | 372.75 |
| 2012-02-07 04:00:00 | 368.5 |
| 2012-02-07 05:00:00 | 352.75 |
| 2012-02-07 06:00:00 | 368.25 |
| 2012-02-07 07:00:00 | 331.75 |
| 2012-02-07 08:00:00 | 344.5 |
| 2012-02-07 09:00:00 | 335 |
| 2012-02-07 10:00:00 | 334.25 |
| 2012-02-07 11:00:00 | 335 |
| 2012-02-07 12:00:00 | 340 |
| 2012-02-07 13:00:00 | 350.5 |
| 2012-02-07 14:00:00 | 345 |
| 2012-02-07 15:00:00 | 341.25 |
| 2012-02-07 16:00:00 | 334.75 |
| 2012-02-07 17:00:00 | 338.5 |
| 2012-02-07 18:00:00 | 344 |
| 2012-02-07 19:00:00 | 334.5 |
| 2012-02-07 20:00:00 | 330.5 |
| 2012-02-07 21:00:00 | 330.5 |
| 2012-02-07 22:00:00 | 331.5 |
| 2012-02-07 23:00:00 | 338 |
| 2012-02-08 | 336.25 |
| 2012-02-08 01:00:00 | 368.25 |
| 2012-02-08 02:00:00 | 371 |
| 2012-02-08 03:00:00 | 369.75 |
| 2012-02-08 04:00:00 | 364 |
| 2012-02-08 05:00:00 | 380.25 |
| 2012-02-08 06:00:00 | 342 |
| 2012-02-08 07:00:00 | 335.5 |
| 2012-02-08 08:00:00 | 335 |
| 2012-02-08 09:00:00 | 342.25 |
| 2012-02-08 10:00:00 | 343.5 |
| 2012-02-08 11:00:00 | 337.75 |
| 2012-02-08 12:00:00 | 336.75 |
| 2012-02-08 13:00:00 | 345.75 |
| 2012-02-08 14:00:00 | 337 |
| 2012-02-08 15:00:00 | 333.5 |
| 2012-02-08 16:00:00 | 336.75 |
| 2012-02-08 17:00:00 | 328 |
| 2012-02-08 18:00:00 | 330.5 |
| 2012-02-08 19:00:00 | 332.25 |
| 2012-02-08 20:00:00 | 329.75 |
| 2012-02-08 21:00:00 | 333.75 |
| 2012-02-08 22:00:00 | 331.75 |
| 2012-02-08 23:00:00 | 356 |
| 2012-02-09 | 354.25 |
| 2012-02-09 01:00:00 | 379.75 |
| 2012-02-09 02:00:00 | 378.25 |
| 2012-02-09 03:00:00 | 363.5 |
| 2012-02-09 04:00:00 | 355.75 |
| 2012-02-09 05:00:00 | 353.5 |
| 2012-02-09 06:00:00 | 365.25 |
| 2012-02-09 07:00:00 | 341 |
| 2012-02-09 08:00:00 | 337.75 |
| 2012-02-09 09:00:00 | 335 |
| 2012-02-09 10:00:00 | 344.25 |
| 2012-02-09 11:00:00 | 334.5 |
| 2012-02-09 12:00:00 | 346.75 |
| 2012-02-09 13:00:00 | 350.25 |
| 2012-02-09 14:00:00 | 340 |
| 2012-02-09 15:00:00 | 334.5 |
| 2012-02-09 16:00:00 | 342.5 |
| 2012-02-09 17:00:00 | 327.25 |
| 2012-02-09 18:00:00 | 328.25 |
| 2012-02-09 19:00:00 | 327.5 |
| 2012-02-09 20:00:00 | 328.25 |
| 2012-02-09 21:00:00 | 327.75 |
| 2012-02-09 22:00:00 | 325.5 |
| 2012-02-09 23:00:00 | 352 |
| 2012-02-10 | 346.75 |
| 2012-02-10 01:00:00 | 376.25 |
| 2012-02-10 02:00:00 | 376.75 |
| 2012-02-10 03:00:00 | 363.75 |
| 2012-02-10 04:00:00 | 353.25 |
| 2012-02-10 05:00:00 | 349.25 |
| 2012-02-10 06:00:00 | 360.25 |
| 2012-02-10 07:00:00 | 326.5 |
| 2012-02-10 08:00:00 | 329.5 |
| 2012-02-10 09:00:00 | 319 |
| 2012-02-10 10:00:00 | 328 |
| 2012-02-10 11:00:00 | 334.25 |
| 2012-02-10 12:00:00 | 339.25 |
| 2012-02-10 13:00:00 | 358.75 |
| 2012-02-10 14:00:00 | 370 |
| 2012-02-10 15:00:00 | 364.5 |
| 2012-02-10 16:00:00 | 337.75 |
| 2012-02-10 17:00:00 | 329.75 |
| 2012-02-10 18:00:00 | 330.75 |
| 2012-02-10 19:00:00 | 332 |
| 2012-02-10 20:00:00 | 331.75 |
| 2012-02-10 21:00:00 | 328.75 |
| 2012-02-10 22:00:00 | 334 |
| 2012-02-10 23:00:00 | 347.25 |
| 2012-02-11 | 364.25 |
| 2012-02-11 01:00:00 | 384 |
| 2012-02-11 02:00:00 | 381 |
| 2012-02-11 03:00:00 | 378.5 |
| 2012-02-11 04:00:00 | 358.5 |
| 2012-02-11 05:00:00 | 365.5 |
| 2012-02-11 06:00:00 | 366.5 |
| 2012-02-11 07:00:00 | 368.25 |
| 2012-02-11 08:00:00 | 341 |
| 2012-02-11 09:00:00 | 320 |
| 2012-02-11 10:00:00 | 316.5 |
| 2012-02-11 11:00:00 | 317.5 |
| 2012-02-11 12:00:00 | 323.25 |
| 2012-02-11 13:00:00 | 336.25 |
| 2012-02-11 14:00:00 | 344.75 |
| 2012-02-11 15:00:00 | 350 |
| 2012-02-11 16:00:00 | 348.25 |
| 2012-02-11 17:00:00 | 341.75 |
| 2012-02-11 18:00:00 | 327.75 |
| 2012-02-11 19:00:00 | 326 |
| 2012-02-11 20:00:00 | 326.75 |
| 2012-02-11 21:00:00 | 325.75 |
| 2012-02-11 22:00:00 | 330 |
| 2012-02-11 23:00:00 | 328.75 |
| 2012-02-12 | 360.5 |
| 2012-02-12 01:00:00 | 366.75 |
| 2012-02-12 02:00:00 | 372.5 |
| 2012-02-12 03:00:00 | 374.75 |
| 2012-02-12 04:00:00 | 359.25 |
| 2012-02-12 05:00:00 | 363.75 |
| 2012-02-12 06:00:00 | 370.75 |
| 2012-02-12 07:00:00 | 369 |
| 2012-02-12 08:00:00 | 366 |
| 2012-02-12 09:00:00 | 335.75 |
| 2012-02-12 10:00:00 | 316.75 |
| 2012-02-12 11:00:00 | 318.5 |
| 2012-02-12 12:00:00 | 321 |
| 2012-02-12 13:00:00 | 338.5 |
| 2012-02-12 14:00:00 | 350 |
| 2012-02-12 15:00:00 | 352.75 |
| 2012-02-12 16:00:00 | 347 |
| 2012-02-12 17:00:00 | 323.75 |
| 2012-02-12 18:00:00 | 318.75 |
| 2012-02-12 19:00:00 | 326 |
| 2012-02-12 20:00:00 | 326.25 |
| 2012-02-12 21:00:00 | 329 |
| 2012-02-12 22:00:00 | 332 |
| 2012-02-12 23:00:00 | 346.25 |
| 2012-02-13 | 359.5 |
| 2012-02-13 01:00:00 | 382.25 |
| 2012-02-13 02:00:00 | 381 |
| 2012-02-13 03:00:00 | 373.5 |
| 2012-02-13 04:00:00 | 358.75 |
| 2012-02-13 05:00:00 | 365.75 |
| 2012-02-13 06:00:00 | 361 |
| 2012-02-13 07:00:00 | 379.75 |
| 2012-02-13 08:00:00 | 340 |
| 2012-02-13 09:00:00 | 344.5 |
| 2012-02-13 10:00:00 | 341.5 |
| 2012-02-13 11:00:00 | 330.25 |
| 2012-02-13 12:00:00 | 328.75 |
| 2012-02-13 13:00:00 | 335.75 |
| 2012-02-13 14:00:00 | 333.75 |
| 2012-02-13 15:00:00 | 324 |
| 2012-02-13 16:00:00 | 342.25 |
| 2012-02-13 17:00:00 | 331.5 |
| 2012-02-13 18:00:00 | 334.25 |
| 2012-02-13 19:00:00 | 330.75 |
| 2012-02-13 20:00:00 | 324.25 |
| 2012-02-13 21:00:00 | 329.75 |
| 2012-02-13 22:00:00 | 330.5 |
| 2012-02-13 23:00:00 | 340.75 |
| 2012-02-14 | 357.75 |
| 2012-02-14 01:00:00 | 385.25 |
| 2012-02-14 02:00:00 | 380.25 |
| 2012-02-14 03:00:00 | 377.25 |
| 2012-02-14 04:00:00 | 361 |
| 2012-02-14 05:00:00 | 354.75 |
| 2012-02-14 06:00:00 | 325.5 |
| 2012-02-14 07:00:00 | 332.75 |
| 2012-02-14 08:00:00 | 331 |
| 2012-02-14 09:00:00 | 339.5 |
| 2012-02-14 10:00:00 | 338.25 |
| 2012-02-14 11:00:00 | 331.75 |
| 2012-02-14 12:00:00 | 330.25 |
| 2012-02-14 13:00:00 | 330.25 |
| 2012-02-14 14:00:00 | 333.5 |
| 2012-02-14 15:00:00 | 337.75 |
| 2012-02-14 16:00:00 | 357.75 |
| 2012-02-14 17:00:00 | 357 |
| 2012-02-14 18:00:00 | 354.25 |
| 2012-02-14 19:00:00 | 342 |
| 2012-02-14 20:00:00 | 335 |
| 2012-02-14 21:00:00 | 340.5 |
| 2012-02-14 22:00:00 | 337 |
| 2012-02-14 23:00:00 | 363.75 |
| 2012-02-15 | 376.75 |
| 2012-02-15 01:00:00 | 392.75 |
| 2012-02-15 02:00:00 | 391 |
| 2012-02-15 03:00:00 | 375.25 |
| 2012-02-15 04:00:00 | 367.75 |
| 2012-02-15 05:00:00 | 359.5 |
| 2012-02-15 06:00:00 | 344 |
| 2012-02-15 07:00:00 | 343.5 |
| 2012-02-15 08:00:00 | 344.5 |
| 2012-02-15 09:00:00 | 344.5 |
| 2012-02-15 10:00:00 | 347 |
| 2012-02-15 11:00:00 | 341.25 |
| 2012-02-15 12:00:00 | 342 |
| 2012-02-15 13:00:00 | 348.5 |
| 2012-02-15 14:00:00 | 353 |
| 2012-02-15 15:00:00 | 346.5 |
| 2012-02-15 16:00:00 | 346.25 |
| 2012-02-15 17:00:00 | 340.75 |
| 2012-02-15 18:00:00 | 345.5 |
| 2012-02-15 19:00:00 | 344.5 |
| 2012-02-15 20:00:00 | 345.25 |
| 2012-02-15 21:00:00 | 346 |
| 2012-02-15 22:00:00 | 346.75 |
| 2012-02-15 23:00:00 | 351 |
| 2012-02-16 | 347 |
| 2012-02-16 01:00:00 | 361.75 |
| 2012-02-16 02:00:00 | 371.5 |
| 2012-02-16 03:00:00 | 366.5 |
| 2012-02-16 04:00:00 | 363.75 |
| 2012-02-16 05:00:00 | 343.25 |
| 2012-02-16 06:00:00 | 339.25 |
| 2012-02-16 07:00:00 | 343.25 |
| 2012-02-16 08:00:00 | 345 |
| 2012-02-16 09:00:00 | 347.5 |
| 2012-02-16 10:00:00 | 346.25 |
| 2012-02-16 11:00:00 | 336.75 |
| 2012-02-16 12:00:00 | 343.75 |
| 2012-02-16 13:00:00 | 349.75 |
| 2012-02-16 14:00:00 | 342.25 |
| 2012-02-16 15:00:00 | 344 |
| 2012-02-16 16:00:00 | 349 |
| 2012-02-16 17:00:00 | 342 |
| 2012-02-16 18:00:00 | 347.25 |
| 2012-02-16 19:00:00 | 348 |
| 2012-02-16 20:00:00 | 347.75 |
| 2012-02-16 21:00:00 | 342.5 |
| 2012-02-16 22:00:00 | 351 |
| 2012-02-16 23:00:00 | 344.75 |
| 2012-02-17 | 336.25 |
| 2012-02-17 01:00:00 | 384 |
| 2012-02-17 02:00:00 | 389.5 |
| 2012-02-17 03:00:00 | 389.25 |
| 2012-02-17 04:00:00 | 382.5 |
| 2012-02-17 05:00:00 | 350.75 |
| 2012-02-17 06:00:00 | 340.25 |
| 2012-02-17 07:00:00 | 346.25 |
| 2012-02-17 08:00:00 | 351.25 |
| 2012-02-17 09:00:00 | 351.5 |
| 2012-02-17 10:00:00 | 358 |
| 2012-02-17 11:00:00 | 350 |
| 2012-02-17 12:00:00 | 351 |
| 2012-02-17 13:00:00 | 358.25 |
| 2012-02-17 14:00:00 | 373.5 |
| 2012-02-17 15:00:00 | 375 |
| 2012-02-17 16:00:00 | 349 |
| 2012-02-17 17:00:00 | 345.75 |
| 2012-02-17 18:00:00 | 344.25 |
| 2012-02-17 19:00:00 | 348.5 |
| 2012-02-17 20:00:00 | 346 |
| 2012-02-17 21:00:00 | 347.5 |
| 2012-02-17 22:00:00 | 345.5 |
| 2012-02-17 23:00:00 | 368.25 |
| 2012-02-18 | 359.5 |
| 2012-02-18 01:00:00 | 390 |
| 2012-02-18 02:00:00 | 388.25 |
| 2012-02-18 03:00:00 | 372.75 |
| 2012-02-18 04:00:00 | 363.5 |
| 2012-02-18 05:00:00 | 365 |
| 2012-02-18 06:00:00 | 378.75 |
| 2012-02-18 07:00:00 | 380.25 |
| 2012-02-18 08:00:00 | 379.5 |
| 2012-02-18 09:00:00 | 340.75 |
| 2012-02-18 10:00:00 | 338.5 |
| 2012-02-18 11:00:00 | 324.75 |
| 2012-02-18 12:00:00 | 334.75 |
| 2012-02-18 13:00:00 | 346.75 |
| 2012-02-18 14:00:00 | 348 |
| 2012-02-18 15:00:00 | 348.75 |
| 2012-02-18 16:00:00 | 351.25 |
| 2012-02-18 17:00:00 | 347.5 |
| 2012-02-18 18:00:00 | 339.25 |
| 2012-02-18 19:00:00 | 339.5 |
| 2012-02-18 20:00:00 | 342.5 |
| 2012-02-18 21:00:00 | 341.75 |
| 2012-02-18 22:00:00 | 350.25 |
| 2012-02-18 23:00:00 | 367.5 |
| 2012-02-19 | 374 |
| 2012-02-19 01:00:00 | 384 |
| 2012-02-19 02:00:00 | 388 |
| 2012-02-19 03:00:00 | 372.5 |
| 2012-02-19 04:00:00 | 366.25 |
| 2012-02-19 05:00:00 | 374.25 |
| 2012-02-19 06:00:00 | 374.75 |
| 2012-02-19 07:00:00 | 383.25 |
| 2012-02-19 08:00:00 | 381 |
| 2012-02-19 09:00:00 | 354.25 |
| 2012-02-19 10:00:00 | 350.5 |
| 2012-02-19 11:00:00 | 340.25 |
| 2012-02-19 12:00:00 | 341 |
| 2012-02-19 13:00:00 | 339 |
| 2012-02-19 14:00:00 | 339.25 |
| 2012-02-19 15:00:00 | 336.75 |
| 2012-02-19 16:00:00 | 331.25 |
| 2012-02-19 17:00:00 | 325.25 |
| 2012-02-19 18:00:00 | 329.5 |
| 2012-02-19 19:00:00 | 330.25 |
| 2012-02-19 20:00:00 | 333.75 |
| 2012-02-19 21:00:00 | 334 |
| 2012-02-19 22:00:00 | 340.5 |
| 2012-02-19 23:00:00 | 353.75 |
| 2012-02-20 | 355.25 |
| 2012-02-20 01:00:00 | 380.5 |
| 2012-02-20 02:00:00 | 371 |
| 2012-02-20 03:00:00 | 362 |
| 2012-02-20 04:00:00 | 353.25 |
| 2012-02-20 05:00:00 | 355.5 |
| 2012-02-20 06:00:00 | 379 |
| 2012-02-20 07:00:00 | 337.75 |
| 2012-02-20 08:00:00 | 335 |
| 2012-02-20 09:00:00 | 337.75 |
| 2012-02-20 10:00:00 | 352.75 |
| 2012-02-20 11:00:00 | 354.75 |
| 2012-02-20 12:00:00 | 329.25 |
| 2012-02-20 13:00:00 | 341.75 |
| 2012-02-20 14:00:00 | 340.25 |
| 2012-02-20 15:00:00 | 333.25 |
| 2012-02-20 16:00:00 | 345.5 |
| 2012-02-20 17:00:00 | 329.75 |
| 2012-02-20 18:00:00 | 330 |
| 2012-02-20 19:00:00 | 335.25 |
| 2012-02-20 20:00:00 | 343.5 |
| 2012-02-20 21:00:00 | 341 |
| 2012-02-20 22:00:00 | 332.25 |
| 2012-02-20 23:00:00 | 347 |
| 2012-02-21 | 372.5 |
| 2012-02-21 01:00:00 | 386.25 |
| 2012-02-21 02:00:00 | 382 |
| 2012-02-21 03:00:00 | 362.75 |
| 2012-02-21 04:00:00 | 354.75 |
| 2012-02-21 05:00:00 | 371.5 |
| 2012-02-21 06:00:00 | 365.25 |
| 2012-02-21 07:00:00 | 340 |
| 2012-02-21 08:00:00 | 339.5 |
| 2012-02-21 09:00:00 | 353.5 |
| 2012-02-21 10:00:00 | 344.25 |
| 2012-02-21 11:00:00 | 331.5 |
| 2012-02-21 12:00:00 | 330.75 |
| 2012-02-21 13:00:00 | 346.5 |
| 2012-02-21 14:00:00 | 343 |
| 2012-02-21 15:00:00 | 338 |
| 2012-02-21 16:00:00 | 340.75 |
| 2012-02-21 17:00:00 | 349.25 |
| 2012-02-21 18:00:00 | 341.25 |
| 2012-02-21 19:00:00 | 336.5 |
| 2012-02-21 20:00:00 | 330 |
| 2012-02-21 21:00:00 | 333.25 |
| 2012-02-21 22:00:00 | 331.75 |
| 2012-02-21 23:00:00 | 346.25 |
| 2012-02-22 | 366.5 |
| 2012-02-22 01:00:00 | 381.25 |
| 2012-02-22 02:00:00 | 380 |
| 2012-02-22 03:00:00 | 360.5 |
| 2012-02-22 04:00:00 | 361.75 |
| 2012-02-22 05:00:00 | 365.25 |
| 2012-02-22 06:00:00 | 361.75 |
| 2012-02-22 07:00:00 | 337.5 |
| 2012-02-22 08:00:00 | 341.5 |
| 2012-02-22 09:00:00 | 339.25 |
| 2012-02-22 10:00:00 | 341.25 |
| 2012-02-22 11:00:00 | 339.5 |
| 2012-02-22 12:00:00 | 337.25 |
| 2012-02-22 13:00:00 | 343.25 |
| 2012-02-22 14:00:00 | 338.5 |
| 2012-02-22 15:00:00 | 336 |
| 2012-02-22 16:00:00 | 331.5 |
| 2012-02-22 17:00:00 | 345.5 |
| 2012-02-22 18:00:00 | 344.25 |
| 2012-02-22 19:00:00 | 346 |
| 2012-02-22 20:00:00 | 336.75 |
| 2012-02-22 21:00:00 | 334.25 |
| 2012-02-22 22:00:00 | 337.75 |
| 2012-02-22 23:00:00 | 342.25 |
| 2012-02-23 | 356.75 |
| 2012-02-23 01:00:00 | 383.25 |
| 2012-02-23 02:00:00 | 385 |
| 2012-02-23 03:00:00 | 383.75 |
| 2012-02-23 04:00:00 | 359.75 |
| 2012-02-23 05:00:00 | 344.5 |
| 2012-02-23 06:00:00 | 330.75 |
| 2012-02-23 07:00:00 | 336.25 |
| 2012-02-23 08:00:00 | 334.5 |
| 2012-02-23 09:00:00 | 335 |
| 2012-02-23 10:00:00 | 340.75 |
| 2012-02-23 11:00:00 | 333.5 |
| 2012-02-23 12:00:00 | 331.5 |
| 2012-02-23 13:00:00 | 340 |
| 2012-02-23 14:00:00 | 339.25 |
| 2012-02-23 15:00:00 | 337.75 |
| 2012-02-23 16:00:00 | 345.5 |
| 2012-02-23 17:00:00 | 348.5 |
| 2012-02-23 18:00:00 | 341.75 |
| 2012-02-23 19:00:00 | 335.5 |
| 2012-02-23 20:00:00 | 336.75 |
| 2012-02-23 21:00:00 | 333.25 |
| 2012-02-23 22:00:00 | 331.75 |
| 2012-02-23 23:00:00 | 334.75 |
| 2012-02-24 | 351.75 |
| 2012-02-24 01:00:00 | 365.5 |
| 2012-02-24 02:00:00 | 379.25 |
| 2012-02-24 03:00:00 | 377 |
| 2012-02-24 04:00:00 | 370.25 |
| 2012-02-24 05:00:00 | 381 |
| 2012-02-24 06:00:00 | 331.25 |
| 2012-02-24 07:00:00 | 331.25 |
| 2012-02-24 08:00:00 | 337.75 |
| 2012-02-24 09:00:00 | 329.25 |
| 2012-02-24 10:00:00 | 333.5 |
| 2012-02-24 11:00:00 | 338.5 |
| 2012-02-24 12:00:00 | 329 |
| 2012-02-24 13:00:00 | 349 |
| 2012-02-24 14:00:00 | 378.5 |
| 2012-02-24 15:00:00 | 378.25 |
| 2012-02-24 16:00:00 | 327 |
| 2012-02-24 17:00:00 | 339.25 |
| 2012-02-24 18:00:00 | 338 |
| 2012-02-24 19:00:00 | 337 |
| 2012-02-24 20:00:00 | 334.75 |
| 2012-02-24 21:00:00 | 329.75 |
| 2012-02-24 22:00:00 | 338.25 |
| 2012-02-24 23:00:00 | 334.75 |
| 2012-02-25 | 344.75 |
| 2012-02-25 01:00:00 | 360.25 |
| 2012-02-25 02:00:00 | 355 |
| 2012-02-25 03:00:00 | 360.75 |
| 2012-02-25 04:00:00 | 350 |
| 2012-02-25 05:00:00 | 349.25 |
| 2012-02-25 06:00:00 | 332.5 |
| 2012-02-25 07:00:00 | 326.5 |
| 2012-02-25 08:00:00 | 329.25 |
| 2012-02-25 09:00:00 | 335.25 |
| 2012-02-25 10:00:00 | 327.25 |
| 2012-02-25 11:00:00 | 319.5 |
| 2012-02-25 12:00:00 | 321.25 |
| 2012-02-25 13:00:00 | 335.25 |
| 2012-02-25 14:00:00 | 327.75 |
| 2012-02-25 15:00:00 | 329 |
| 2012-02-25 16:00:00 | 338.5 |
| 2012-02-25 17:00:00 | 330 |
| 2012-02-25 18:00:00 | 334.5 |
| 2012-02-25 19:00:00 | 336.5 |
| 2012-02-25 20:00:00 | 326.75 |
| 2012-02-25 21:00:00 | 322.75 |
| 2012-02-25 22:00:00 | 329 |
| 2012-02-25 23:00:00 | 330.25 |
| 2012-02-26 | 339.25 |
| 2012-02-26 01:00:00 | 362.25 |
| 2012-02-26 02:00:00 | 358.25 |
| 2012-02-26 03:00:00 | 359 |
| 2012-02-26 04:00:00 | 350.5 |
| 2012-02-26 05:00:00 | 349.25 |
| 2012-02-26 06:00:00 | 323.75 |
| 2012-02-26 07:00:00 | 322.5 |
| 2012-02-26 08:00:00 | 320.75 |
| 2012-02-26 09:00:00 | 326.5 |
| 2012-02-26 10:00:00 | 332.75 |
| 2012-02-26 11:00:00 | 331 |
| 2012-02-26 12:00:00 | 330.75 |
| 2012-02-26 13:00:00 | 337 |
| 2012-02-26 14:00:00 | 329.5 |
| 2012-02-26 15:00:00 | 324.5 |
| 2012-02-26 16:00:00 | 328.5 |
| 2012-02-26 17:00:00 | 329 |
| 2012-02-26 18:00:00 | 332.75 |
| 2012-02-26 19:00:00 | 349.5 |
| 2012-02-26 20:00:00 | 328.5 |
| 2012-02-26 21:00:00 | 327 |
| 2012-02-26 22:00:00 | 336.75 |
| 2012-02-26 23:00:00 | 346 |
| 2012-02-27 | 361.25 |
| 2012-02-27 01:00:00 | 379.25 |
| 2012-02-27 02:00:00 | 368 |
| 2012-02-27 03:00:00 | 367 |
| 2012-02-27 04:00:00 | 352.5 |
| 2012-02-27 05:00:00 | 344 |
| 2012-02-27 06:00:00 | 333.25 |
| 2012-02-27 07:00:00 | 329 |
| 2012-02-27 08:00:00 | 331.5 |
| 2012-02-27 09:00:00 | 334 |
| 2012-02-27 10:00:00 | 337 |
| 2012-02-27 11:00:00 | 336.75 |
| 2012-02-27 12:00:00 | 335 |
| 2012-02-27 13:00:00 | 342 |
| 2012-02-27 14:00:00 | 341.5 |
| 2012-02-27 15:00:00 | 335.5 |
| 2012-02-27 16:00:00 | 348 |
| 2012-02-27 17:00:00 | 329 |
| 2012-02-27 18:00:00 | 328 |
| 2012-02-27 19:00:00 | 331 |
| 2012-02-27 20:00:00 | 327.5 |
| 2012-02-27 21:00:00 | 334.75 |
| 2012-02-27 22:00:00 | 333 |
| 2012-02-27 23:00:00 | 355.25 |
| 2012-02-28 | 348 |
| 2012-02-28 01:00:00 | 381.5 |
| 2012-02-28 02:00:00 | 379 |
| 2012-02-28 03:00:00 | 360 |
| 2012-02-28 04:00:00 | 355.25 |
| 2012-02-28 05:00:00 | 354 |
| 2012-02-28 06:00:00 | 341.25 |
| 2012-02-28 07:00:00 | 331 |
| 2012-02-28 08:00:00 | 332 |
| 2012-02-28 09:00:00 | 336.75 |
| 2012-02-28 10:00:00 | 338.5 |
| 2012-02-28 11:00:00 | 332.25 |
| 2012-02-28 12:00:00 | 332.25 |
| 2012-02-28 13:00:00 | 337.75 |
| 2012-02-28 14:00:00 | 339.75 |
| 2012-02-28 15:00:00 | 338 |
| 2012-02-28 16:00:00 | 334.25 |
| 2012-02-28 17:00:00 | 334.25 |
| 2012-02-28 18:00:00 | 330.5 |
| 2012-02-28 19:00:00 | 334.25 |
| 2012-02-28 20:00:00 | 336 |
| 2012-02-28 21:00:00 | 339.25 |
| 2012-02-28 22:00:00 | 338.25 |
| 2012-02-28 23:00:00 | 358 |
| 2012-02-29 | 350 |
| 2012-02-29 01:00:00 | 379.5 |
| 2012-02-29 02:00:00 | 379.25 |
| 2012-02-29 03:00:00 | 360.25 |
| 2012-02-29 04:00:00 | 358.5 |
| 2012-02-29 05:00:00 | 363.25 |
| 2012-02-29 06:00:00 | 339.25 |
| 2012-02-29 07:00:00 | 334.75 |
| 2012-02-29 08:00:00 | 329.5 |
| 2012-02-29 09:00:00 | 327.5 |
| 2012-02-29 10:00:00 | 339.75 |
| 2012-02-29 11:00:00 | 336.5 |
| 2012-02-29 12:00:00 | 330.75 |
| 2012-02-29 13:00:00 | 339.75 |
| 2012-02-29 14:00:00 | 340.75 |
| 2012-02-29 15:00:00 | 349.5 |
| 2012-02-29 16:00:00 | 337.25 |
| 2012-02-29 17:00:00 | 325.5 |
| 2012-02-29 18:00:00 | 323.75 |
| 2012-02-29 19:00:00 | 329.25 |
| 2012-02-29 20:00:00 | 329.25 |
| 2012-02-29 21:00:00 | 332.25 |
| 2012-02-29 22:00:00 | 332.5 |
| 2012-02-29 23:00:00 | 353.25 |
| 2012-03-01 | 364.5 |
| 2012-03-01 01:00:00 | 374 |
| 2012-03-01 02:00:00 | 372 |
| 2012-03-01 03:00:00 | 354.75 |
| 2012-03-01 04:00:00 | 349.5 |
| 2012-03-01 05:00:00 | 360.75 |
| 2012-03-01 06:00:00 | 351.75 |
| 2012-03-01 07:00:00 | 335.75 |
| 2012-03-01 08:00:00 | 349 |
| 2012-03-01 09:00:00 | 351 |
| 2012-03-01 10:00:00 | 357.25 |
| 2012-03-01 11:00:00 | 362 |
| 2012-03-01 12:00:00 | 356.25 |
| 2012-03-01 13:00:00 | 361.25 |
| 2012-03-01 14:00:00 | 348.75 |
| 2012-03-01 15:00:00 | 348 |
| 2012-03-01 16:00:00 | 350.75 |
| 2012-03-01 17:00:00 | 345.5 |
| 2012-03-01 18:00:00 | 339 |
| 2012-03-01 19:00:00 | 339.5 |
| 2012-03-01 20:00:00 | 341.75 |
| 2012-03-01 21:00:00 | 341.5 |
| 2012-03-01 22:00:00 | 345.75 |
| 2012-03-01 23:00:00 | 368.5 |
| 2012-03-02 | 373.75 |
| 2012-03-02 01:00:00 | 391.25 |
| 2012-03-02 02:00:00 | 389 |
| 2012-03-02 03:00:00 | 372.25 |
| 2012-03-02 04:00:00 | 365.5 |
| 2012-03-02 05:00:00 | 375.75 |
| 2012-03-02 06:00:00 | 353.75 |
| 2012-03-02 07:00:00 | 345.75 |
| 2012-03-02 08:00:00 | 347.75 |
| 2012-03-02 09:00:00 | 341.5 |
| 2012-03-02 10:00:00 | 347.75 |
| 2012-03-02 11:00:00 | 341.75 |
| 2012-03-02 12:00:00 | 348.75 |
| 2012-03-02 13:00:00 | 349.5 |
| 2012-03-02 14:00:00 | 393.75 |
| 2012-03-02 15:00:00 | 369.5 |
| 2012-03-02 16:00:00 | 342.5 |
| 2012-03-02 17:00:00 | 345.5 |
| 2012-03-02 18:00:00 | 353.75 |
| 2012-03-02 19:00:00 | 337.25 |
| 2012-03-02 20:00:00 | 342.5 |
| 2012-03-02 21:00:00 | 359.25 |
| 2012-03-02 22:00:00 | 365 |
| 2012-03-02 23:00:00 | 373 |
| 2012-03-03 | 366.5 |
| 2012-03-03 01:00:00 | 380.25 |
| 2012-03-03 02:00:00 | 374 |
| 2012-03-03 03:00:00 | 374.25 |
| 2012-03-03 04:00:00 | 368.75 |
| 2012-03-03 05:00:00 | 386.5 |
| 2012-03-03 06:00:00 | 390 |
| 2012-03-03 07:00:00 | 389.25 |
| 2012-03-03 08:00:00 | 390.75 |
| 2012-03-03 09:00:00 | 384.25 |
| 2012-03-03 10:00:00 | 347.5 |
| 2012-03-03 11:00:00 | 342.25 |
| 2012-03-03 12:00:00 | 336.75 |
| 2012-03-03 13:00:00 | 344.5 |
| 2012-03-03 14:00:00 | 336 |
| 2012-03-03 15:00:00 | 340 |
| 2012-03-03 16:00:00 | 337.25 |
| 2012-03-03 17:00:00 | 334.5 |
| 2012-03-03 18:00:00 | 336.75 |
| 2012-03-03 19:00:00 | 341.25 |
| 2012-03-03 20:00:00 | 343.25 |
| 2012-03-03 21:00:00 | 344 |
| 2012-03-03 22:00:00 | 346.5 |
| 2012-03-03 23:00:00 | 369 |
| 2012-03-04 | 362.25 |
| 2012-03-04 01:00:00 | 391.25 |
| 2012-03-04 02:00:00 | 388.5 |
| 2012-03-04 03:00:00 | 370.75 |
| 2012-03-04 04:00:00 | 366 |
| 2012-03-04 05:00:00 | 372.5 |
| 2012-03-04 06:00:00 | 386.75 |
| 2012-03-04 07:00:00 | 384.5 |
| 2012-03-04 08:00:00 | 366.5 |
| 2012-03-04 09:00:00 | 338.5 |
| 2012-03-04 10:00:00 | 344.75 |
| 2012-03-04 11:00:00 | 346.5 |
| 2012-03-04 12:00:00 | 331 |
| 2012-03-04 13:00:00 | 343 |
| 2012-03-04 14:00:00 | 334.25 |
| 2012-03-04 15:00:00 | 339.25 |
| 2012-03-04 16:00:00 | 333.75 |
| 2012-03-04 17:00:00 | 334.5 |
| 2012-03-04 18:00:00 | 338.25 |
| 2012-03-04 19:00:00 | 341.25 |
| 2012-03-04 20:00:00 | 351.25 |
| 2012-03-04 21:00:00 | 341.75 |
| 2012-03-04 22:00:00 | 350 |
| 2012-03-04 23:00:00 | 362.75 |
| 2012-03-05 | 366 |
| 2012-03-05 01:00:00 | 394 |
| 2012-03-05 02:00:00 | 386.75 |
| 2012-03-05 03:00:00 | 371 |
| 2012-03-05 04:00:00 | 371 |
| 2012-03-05 05:00:00 | 384.5 |
| 2012-03-05 06:00:00 | 378.25 |
| 2012-03-05 07:00:00 | 343 |
| 2012-03-05 08:00:00 | 342.75 |
| 2012-03-05 09:00:00 | 340.5 |
| 2012-03-05 10:00:00 | 341.75 |
| 2012-03-05 11:00:00 | 340.75 |
| 2012-03-05 12:00:00 | 341 |
| 2012-03-05 13:00:00 | 348.75 |
| 2012-03-05 14:00:00 | 340 |
| 2012-03-05 15:00:00 | 340.25 |
| 2012-03-05 16:00:00 | 339.25 |
| 2012-03-05 17:00:00 | 347.5 |
| 2012-03-05 18:00:00 | 339.25 |
| 2012-03-05 19:00:00 | 338 |
| 2012-03-05 20:00:00 | 340.5 |
| 2012-03-05 21:00:00 | 344 |
| 2012-03-05 22:00:00 | 340 |
| 2012-03-05 23:00:00 | 345.75 |
| 2012-03-06 | 356.5 |
| 2012-03-06 01:00:00 | 385.25 |
| 2012-03-06 02:00:00 | 390 |
| 2012-03-06 03:00:00 | 386.5 |
| 2012-03-06 04:00:00 | 384.25 |
| 2012-03-06 05:00:00 | 375.25 |
| 2012-03-06 06:00:00 | 376.75 |
| 2012-03-06 07:00:00 | 355.75 |
| 2012-03-06 08:00:00 | 335 |
| 2012-03-06 09:00:00 | 342.5 |
| 2012-03-06 10:00:00 | 337.5 |
| 2012-03-06 11:00:00 | 332.25 |
| 2012-03-06 12:00:00 | 331.5 |
| 2012-03-06 13:00:00 | 344.25 |
| 2012-03-06 14:00:00 | 341.75 |
| 2012-03-06 15:00:00 | 340 |
| 2012-03-06 16:00:00 | 346 |
| 2012-03-06 17:00:00 | 339.5 |
| 2012-03-06 18:00:00 | 349 |
| 2012-03-06 19:00:00 | 349.25 |
| 2012-03-06 20:00:00 | 344.25 |
| 2012-03-06 21:00:00 | 338.5 |
| 2012-03-06 22:00:00 | 345 |
| 2012-03-06 23:00:00 | 356.5 |
| 2012-03-07 | 357.5 |
| 2012-03-07 01:00:00 | 394.5 |
| 2012-03-07 02:00:00 | 391.25 |
| 2012-03-07 03:00:00 | 369 |
| 2012-03-07 04:00:00 | 364.75 |
| 2012-03-07 05:00:00 | 376.75 |
| 2012-03-07 06:00:00 | 352.25 |
| 2012-03-07 07:00:00 | 340 |
| 2012-03-07 08:00:00 | 336.25 |
| 2012-03-07 09:00:00 | 339.25 |
| 2012-03-07 10:00:00 | 336.25 |
| 2012-03-07 11:00:00 | 324 |
| 2012-03-07 12:00:00 | 330.5 |
| 2012-03-07 13:00:00 | 340.75 |
| 2012-03-07 14:00:00 | 339 |
| 2012-03-07 15:00:00 | 334.25 |
| 2012-03-07 16:00:00 | 342.75 |
| 2012-03-07 17:00:00 | 351 |
| 2012-03-07 18:00:00 | 335.5 |
| 2012-03-07 19:00:00 | 340.25 |
| 2012-03-07 20:00:00 | 342 |
| 2012-03-07 21:00:00 | 342.75 |
| 2012-03-07 22:00:00 | 343.5 |
| 2012-03-07 23:00:00 | 362.5 |
| 2012-03-08 | 360 |
| 2012-03-08 01:00:00 | 389.5 |
| 2012-03-08 02:00:00 | 390.25 |
| 2012-03-08 03:00:00 | 373.5 |
| 2012-03-08 04:00:00 | 366.75 |
| 2012-03-08 05:00:00 | 367.25 |
| 2012-03-08 06:00:00 | 352.5 |
| 2012-03-08 07:00:00 | 337.75 |
| 2012-03-08 08:00:00 | 343 |
| 2012-03-08 09:00:00 | 345.75 |
| 2012-03-08 10:00:00 | 344.75 |
| 2012-03-08 11:00:00 | 326.25 |
| 2012-03-08 12:00:00 | 323.75 |
| 2012-03-08 13:00:00 | 348 |
| 2012-03-08 14:00:00 | 349 |
| 2012-03-08 15:00:00 | 348.5 |
| 2012-03-08 16:00:00 | 347.75 |
| 2012-03-08 17:00:00 | 348.75 |
| 2012-03-08 18:00:00 | 346.75 |
| 2012-03-08 19:00:00 | 351.25 |
| 2012-03-08 20:00:00 | 344.75 |
| 2012-03-08 21:00:00 | 340.75 |
| 2012-03-08 22:00:00 | 340.5 |
| 2012-03-08 23:00:00 | 358.25 |
| 2012-03-09 | 359.75 |
| 2012-03-09 01:00:00 | 392.25 |
| 2012-03-09 02:00:00 | 393.75 |
| 2012-03-09 03:00:00 | 384 |
| 2012-03-09 04:00:00 | 371.25 |
| 2012-03-09 05:00:00 | 367.5 |
| 2012-03-09 06:00:00 | 353.75 |
| 2012-03-09 07:00:00 | 346.5 |
| 2012-03-09 08:00:00 | 340.25 |
| 2012-03-09 09:00:00 | 344.75 |
| 2012-03-09 10:00:00 | 354.75 |
| 2012-03-09 11:00:00 | 361.25 |
| 2012-03-09 12:00:00 | 341.5 |
| 2012-03-09 13:00:00 | 355.25 |
| 2012-03-09 14:00:00 | 334.5 |
| 2012-03-09 15:00:00 | 388.25 |
| 2012-03-09 16:00:00 | 371 |
| 2012-03-09 17:00:00 | 347 |
| 2012-03-09 18:00:00 | 346.75 |
| 2012-03-09 19:00:00 | 347.25 |
| 2012-03-09 20:00:00 | 341.5 |
| 2012-03-09 21:00:00 | 346.75 |
| 2012-03-09 22:00:00 | 343 |
| 2012-03-09 23:00:00 | 370 |
| 2012-03-10 | 375.5 |
| 2012-03-10 01:00:00 | 395.5 |
| 2012-03-10 02:00:00 | 394.75 |
| 2012-03-10 03:00:00 | 380.25 |
| 2012-03-10 04:00:00 | 370.25 |
| 2012-03-10 05:00:00 | 377 |
| 2012-03-10 06:00:00 | 383.75 |
| 2012-03-10 07:00:00 | 388.5 |
| 2012-03-10 08:00:00 | 383 |
| 2012-03-10 09:00:00 | 379.5 |
| 2012-03-10 10:00:00 | 377.25 |
| 2012-03-10 11:00:00 | 356.5 |
| 2012-03-10 12:00:00 | 329.75 |
| 2012-03-10 13:00:00 | 348.25 |
| 2012-03-10 14:00:00 | 355 |
| 2012-03-10 15:00:00 | 351.75 |
| 2012-03-10 16:00:00 | 345.75 |
| 2012-03-10 17:00:00 | 340.5 |
| 2012-03-10 18:00:00 | 334.5 |
| 2012-03-10 19:00:00 | 337 |
| 2012-03-10 20:00:00 | 338.75 |
| 2012-03-10 21:00:00 | 342.5 |
| 2012-03-10 22:00:00 | 358.25 |
| 2012-03-10 23:00:00 | 364.5 |
| 2012-03-11 | 379.25 |
| 2012-03-11 01:00:00 | 393.5 |
| 2012-03-11 02:00:00 | 379.5 |
| 2012-03-11 03:00:00 | 376.25 |
| 2012-03-11 04:00:00 | 368.25 |
| 2012-03-11 05:00:00 | 375.75 |
| 2012-03-11 06:00:00 | 380.75 |
| 2012-03-11 07:00:00 | 379.25 |
| 2012-03-11 08:00:00 | 377.5 |
| 2012-03-11 09:00:00 | 376.5 |
| 2012-03-11 10:00:00 | 393.5 |
| 2012-03-11 11:00:00 | 388.25 |
| 2012-03-11 12:00:00 | 330.5 |
| 2012-03-11 13:00:00 | 340.5 |
| 2012-03-11 14:00:00 | 338 |
| 2012-03-11 15:00:00 | 331.75 |
| 2012-03-11 16:00:00 | 332.75 |
| 2012-03-11 17:00:00 | 333 |
| 2012-03-11 18:00:00 | 329 |
| 2012-03-11 19:00:00 | 333.5 |
| 2012-03-11 20:00:00 | 331.5 |
| 2012-03-11 21:00:00 | 337 |
| 2012-03-11 22:00:00 | 354 |
| 2012-03-11 23:00:00 | 361.25 |
| 2012-03-12 | 371.75 |
| 2012-03-12 01:00:00 | 391 |
| 2012-03-12 02:00:00 | 375.75 |
| 2012-03-12 03:00:00 | 373.25 |
| 2012-03-12 04:00:00 | 367.75 |
| 2012-03-12 05:00:00 | 376 |
| 2012-03-12 06:00:00 | 380.5 |
| 2012-03-12 07:00:00 | 344.25 |
| 2012-03-12 08:00:00 | 344.25 |
| 2012-03-12 09:00:00 | 347.25 |
| 2012-03-12 10:00:00 | 344.75 |
| 2012-03-12 11:00:00 | 340.75 |
| 2012-03-12 12:00:00 | 341.25 |
| 2012-03-12 13:00:00 | 350.25 |
| 2012-03-12 14:00:00 | 345 |
| 2012-03-12 15:00:00 | 347.5 |
| 2012-03-12 16:00:00 | 356.25 |
| 2012-03-12 17:00:00 | 350.25 |
| 2012-03-12 18:00:00 | 335.5 |
| 2012-03-12 19:00:00 | 338.5 |
| 2012-03-12 20:00:00 | 335.25 |
| 2012-03-12 21:00:00 | 337.5 |
| 2012-03-12 22:00:00 | 338.25 |
| 2012-03-12 23:00:00 | 358.5 |
| 2012-03-13 | 362.25 |
| 2012-03-13 01:00:00 | 390.5 |
| 2012-03-13 02:00:00 | 387 |
| 2012-03-13 03:00:00 | 380.5 |
| 2012-03-13 04:00:00 | 363.5 |
| 2012-03-13 05:00:00 | 383.75 |
| 2012-03-13 06:00:00 | 350.25 |
| 2012-03-13 07:00:00 | 348.5 |
| 2012-03-13 08:00:00 | 359.25 |
| 2012-03-13 09:00:00 | 346.25 |
| 2012-03-13 10:00:00 | 350 |
| 2012-03-13 11:00:00 | 346.75 |
| 2012-03-13 12:00:00 | 345.75 |
| 2012-03-13 13:00:00 | 347.5 |
| 2012-03-13 14:00:00 | 342.25 |
| 2012-03-13 15:00:00 | 351.25 |
| 2012-03-13 16:00:00 | 342.25 |
| 2012-03-13 17:00:00 | 341.25 |
| 2012-03-13 18:00:00 | 338.5 |
| 2012-03-13 19:00:00 | 336 |
| 2012-03-13 20:00:00 | 336.75 |
| 2012-03-13 21:00:00 | 334 |
| 2012-03-13 22:00:00 | 340.5 |
| 2012-03-13 23:00:00 | 355.5 |
| 2012-03-14 | 356.75 |
| 2012-03-14 01:00:00 | 390.5 |
| 2012-03-14 02:00:00 | 389 |
| 2012-03-14 03:00:00 | 377 |
| 2012-03-14 04:00:00 | 366.25 |
| 2012-03-14 05:00:00 | 388.25 |
| 2012-03-14 06:00:00 | 390.75 |
| 2012-03-14 07:00:00 | 370 |
| 2012-03-14 08:00:00 | 351 |
| 2012-03-14 09:00:00 | 351.5 |
| 2012-03-14 10:00:00 | 342.75 |
| 2012-03-14 11:00:00 | 341.75 |
| 2012-03-14 12:00:00 | 346.25 |
| 2012-03-14 13:00:00 | 360 |
| 2012-03-14 14:00:00 | 388.5 |
| 2012-03-14 15:00:00 | 375.5 |
| 2012-03-14 16:00:00 | 348.25 |
| 2012-03-14 17:00:00 | 343.75 |
| 2012-03-14 18:00:00 | 343.25 |
| 2012-03-14 19:00:00 | 344.75 |
| 2012-03-14 20:00:00 | 344.75 |
| 2012-03-14 21:00:00 | 341.25 |
| 2012-03-14 22:00:00 | 342 |
| 2012-03-14 23:00:00 | 341.25 |
| 2012-03-15 | 358.75 |
| 2012-03-15 01:00:00 | 391.25 |
| 2012-03-15 02:00:00 | 387.75 |
| 2012-03-15 03:00:00 | 387.25 |
| 2012-03-15 04:00:00 | 375.25 |
| 2012-03-15 05:00:00 | 383 |
| 2012-03-15 06:00:00 | 374.25 |
| 2012-03-15 07:00:00 | 335.5 |
| 2012-03-15 08:00:00 | 345 |
| 2012-03-15 09:00:00 | 343.25 |
| 2012-03-15 10:00:00 | 342 |
| 2012-03-15 11:00:00 | 338 |
| 2012-03-15 12:00:00 | 344 |
| 2012-03-15 13:00:00 | 352.25 |
| 2012-03-15 14:00:00 | 348 |
| 2012-03-15 15:00:00 | 351 |
| 2012-03-15 16:00:00 | 351.25 |
| 2012-03-15 17:00:00 | 343 |
| 2012-03-15 18:00:00 | 340 |
| 2012-03-15 19:00:00 | 346 |
| 2012-03-15 20:00:00 | 341 |
| 2012-03-15 21:00:00 | 338.5 |
| 2012-03-15 22:00:00 | 343.25 |
| 2012-03-15 23:00:00 | 358.5 |
| 2012-03-16 | 364 |
| 2012-03-16 01:00:00 | 389.25 |
| 2012-03-16 02:00:00 | 391.25 |
| 2012-03-16 03:00:00 | 381 |
| 2012-03-16 04:00:00 | 372.25 |
| 2012-03-16 05:00:00 | 344.25 |
| 2012-03-16 06:00:00 | 340 |
| 2012-03-16 07:00:00 | 335 |
| 2012-03-16 08:00:00 | 341.75 |
| 2012-03-16 09:00:00 | 336.25 |
| 2012-03-16 10:00:00 | 337 |
| 2012-03-16 11:00:00 | 346 |
| 2012-03-16 12:00:00 | 343.25 |
| 2012-03-16 13:00:00 | 357.75 |
| 2012-03-16 14:00:00 | 350.25 |
| 2012-03-16 15:00:00 | 346.5 |
| 2012-03-16 16:00:00 | 357.5 |
| 2012-03-16 17:00:00 | 335.5 |
| 2012-03-16 18:00:00 | 333.5 |
| 2012-03-16 19:00:00 | 336.75 |
| 2012-03-16 20:00:00 | 337.5 |
| 2012-03-16 21:00:00 | 343.5 |
| 2012-03-16 22:00:00 | 338.75 |
| 2012-03-16 23:00:00 | 354.25 |
| 2012-03-17 | 349.75 |
| 2012-03-17 01:00:00 | 388 |
| 2012-03-17 02:00:00 | 387 |
| 2012-03-17 03:00:00 | 374.75 |
| 2012-03-17 04:00:00 | 371.25 |
| 2012-03-17 05:00:00 | 368 |
| 2012-03-17 06:00:00 | 376.75 |
| 2012-03-17 07:00:00 | 380.25 |
| 2012-03-17 08:00:00 | 382.75 |
| 2012-03-17 09:00:00 | 359 |
| 2012-03-17 10:00:00 | 339.25 |
| 2012-03-17 11:00:00 | 333.25 |
| 2012-03-17 12:00:00 | 331 |
| 2012-03-17 13:00:00 | 342.25 |
| 2012-03-17 14:00:00 | 343 |
| 2012-03-17 15:00:00 | 342.25 |
| 2012-03-17 16:00:00 | 330.75 |
| 2012-03-17 17:00:00 | 328.25 |
| 2012-03-17 18:00:00 | 335.25 |
| 2012-03-17 19:00:00 | 341.5 |
| 2012-03-17 20:00:00 | 338.25 |
| 2012-03-17 21:00:00 | 340.5 |
| 2012-03-17 22:00:00 | 341.5 |
| 2012-03-17 23:00:00 | 356.75 |
| 2012-03-18 | 372 |
| 2012-03-18 01:00:00 | 388 |
| 2012-03-18 02:00:00 | 384.5 |
| 2012-03-18 03:00:00 | 372.25 |
| 2012-03-18 04:00:00 | 365.75 |
| 2012-03-18 05:00:00 | 371.25 |
| 2012-03-18 06:00:00 | 379.25 |
| 2012-03-18 07:00:00 | 379 |
| 2012-03-18 08:00:00 | 379.25 |
| 2012-03-18 09:00:00 | 357.75 |
| 2012-03-18 10:00:00 | 340 |
| 2012-03-18 11:00:00 | 340 |
| 2012-03-18 12:00:00 | 335.5 |
| 2012-03-18 13:00:00 | 343.25 |
| 2012-03-18 14:00:00 | 337 |
| 2012-03-18 15:00:00 | 347.75 |
| 2012-03-18 16:00:00 | 331.5 |
| 2012-03-18 17:00:00 | 328.5 |
| 2012-03-18 18:00:00 | 329.5 |
| 2012-03-18 19:00:00 | 339.75 |
| 2012-03-18 20:00:00 | 340.75 |
| 2012-03-18 21:00:00 | 337.25 |
| 2012-03-18 22:00:00 | 337.5 |
| 2012-03-18 23:00:00 | 353 |
| 2012-03-19 | 361.75 |
| 2012-03-19 01:00:00 | 398.75 |
| 2012-03-19 02:00:00 | 394 |
| 2012-03-19 03:00:00 | 375 |
| 2012-03-19 04:00:00 | 363.75 |
| 2012-03-19 05:00:00 | 363.25 |
| 2012-03-19 06:00:00 | 362.75 |
| 2012-03-19 07:00:00 | 340.25 |
| 2012-03-19 08:00:00 | 344 |
| 2012-03-19 09:00:00 | 345.75 |
| 2012-03-19 10:00:00 | 342.5 |
| 2012-03-19 11:00:00 | 339.75 |
| 2012-03-19 12:00:00 | 348.5 |
| 2012-03-19 13:00:00 | 357.5 |
| 2012-03-19 14:00:00 | 343.5 |
| 2012-03-19 15:00:00 | 338.25 |
| 2012-03-19 16:00:00 | 351.75 |
| 2012-03-19 17:00:00 | 340 |
| 2012-03-19 18:00:00 | 333.75 |
| 2012-03-19 19:00:00 | 338.5 |
| 2012-03-19 20:00:00 | 344 |
| 2012-03-19 21:00:00 | 336.25 |
| 2012-03-19 22:00:00 | 336 |
| 2012-03-19 23:00:00 | 352.25 |
| 2012-03-20 | 372.25 |
| 2012-03-20 01:00:00 | 400.75 |
| 2012-03-20 02:00:00 | 387.5 |
| 2012-03-20 03:00:00 | 377.25 |
| 2012-03-20 04:00:00 | 365.5 |
| 2012-03-20 05:00:00 | 373.5 |
| 2012-03-20 06:00:00 | 347.5 |
| 2012-03-20 07:00:00 | 336.25 |
| 2012-03-20 08:00:00 | 339.75 |
| 2012-03-20 09:00:00 | 338 |
| 2012-03-20 10:00:00 | 351 |
| 2012-03-20 11:00:00 | 334 |
| 2012-03-20 12:00:00 | 332.75 |
| 2012-03-20 13:00:00 | 341.25 |
| 2012-03-20 14:00:00 | 333.5 |
| 2012-03-20 15:00:00 | 334.75 |
| 2012-03-20 16:00:00 | 341.75 |
| 2012-03-20 17:00:00 | 332.75 |
| 2012-03-20 18:00:00 | 332 |
| 2012-03-20 19:00:00 | 336 |
| 2012-03-20 20:00:00 | 339.5 |
| 2012-03-20 21:00:00 | 340.25 |
| 2012-03-20 22:00:00 | 337.25 |
| 2012-03-20 23:00:00 | 353.75 |
| 2012-03-21 | 377.5 |
| 2012-03-21 01:00:00 | 399.5 |
| 2012-03-21 02:00:00 | 387.5 |
| 2012-03-21 03:00:00 | 377.25 |
| 2012-03-21 04:00:00 | 363 |
| 2012-03-21 05:00:00 | 372.5 |
| 2012-03-21 06:00:00 | 370.25 |
| 2012-03-21 07:00:00 | 339.5 |
| 2012-03-21 08:00:00 | 340.25 |
| 2012-03-21 09:00:00 | 347.5 |
| 2012-03-21 10:00:00 | 348.75 |
| 2012-03-21 11:00:00 | 339.5 |
| 2012-03-21 12:00:00 | 338 |
| 2012-03-21 13:00:00 | 348 |
| 2012-03-21 14:00:00 | 325.75 |
| 2012-03-21 15:00:00 | 319.75 |
| 2012-03-21 16:00:00 | 331.5 |
| 2012-03-21 17:00:00 | 339.75 |
| 2012-03-21 18:00:00 | 347 |
| 2012-03-21 19:00:00 | 355.25 |
| 2012-03-21 20:00:00 | 362.75 |
| 2012-03-21 21:00:00 | 343.5 |
| 2012-03-21 22:00:00 | 336.75 |
| 2012-03-21 23:00:00 | 354.75 |
| 2012-03-22 | 382 |
| 2012-03-22 01:00:00 | 399.5 |
| 2012-03-22 02:00:00 | 394.75 |
| 2012-03-22 03:00:00 | 380 |
| 2012-03-22 04:00:00 | 366 |
| 2012-03-22 05:00:00 | 379.75 |
| 2012-03-22 06:00:00 | 394.25 |
| 2012-03-22 07:00:00 | 388.25 |
| 2012-03-22 08:00:00 | 348.75 |
| 2012-03-22 09:00:00 | 341.25 |
| 2012-03-22 10:00:00 | 345.5 |
| 2012-03-22 11:00:00 | 343.5 |
| 2012-03-22 12:00:00 | 344.5 |
| 2012-03-22 13:00:00 | 352.75 |
| 2012-03-22 14:00:00 | 340.5 |
| 2012-03-22 15:00:00 | 336 |
| 2012-03-22 16:00:00 | 333.5 |
| 2012-03-22 17:00:00 | 338.25 |
| 2012-03-22 18:00:00 | 332 |
| 2012-03-22 19:00:00 | 345.75 |
| 2012-03-22 20:00:00 | 335.75 |
| 2012-03-22 21:00:00 | 334 |
| 2012-03-22 22:00:00 | 343.25 |
| 2012-03-22 23:00:00 | 364 |
| 2012-03-23 | 365 |
| 2012-03-23 01:00:00 | 388.75 |
| 2012-03-23 02:00:00 | 388.5 |
| 2012-03-23 03:00:00 | 372 |
| 2012-03-23 04:00:00 | 368.75 |
| 2012-03-23 05:00:00 | 393.25 |
| 2012-03-23 06:00:00 | 397.75 |
| 2012-03-23 07:00:00 | 392.5 |
| 2012-03-23 08:00:00 | 353.5 |
| 2012-03-23 09:00:00 | 338 |
| 2012-03-23 10:00:00 | 339.5 |
| 2012-03-23 11:00:00 | 341 |
| 2012-03-23 12:00:00 | 338.5 |
| 2012-03-23 13:00:00 | 349.75 |
| 2012-03-23 14:00:00 | 338.5 |
| 2012-03-23 15:00:00 | 344.5 |
| 2012-03-23 16:00:00 | 343.5 |
| 2012-03-23 17:00:00 | 335.5 |
| 2012-03-23 18:00:00 | 333 |
| 2012-03-23 19:00:00 | 341.5 |
| 2012-03-23 20:00:00 | 336.75 |
| 2012-03-23 21:00:00 | 337.75 |
| 2012-03-23 22:00:00 | 344.75 |
| 2012-03-23 23:00:00 | 342.25 |
| 2012-03-24 | 350.75 |
| 2012-03-24 01:00:00 | 370.25 |
| 2012-03-24 02:00:00 | 371.25 |
| 2012-03-24 03:00:00 | 367.25 |
| 2012-03-24 04:00:00 | 362 |
| 2012-03-24 05:00:00 | 364.25 |
| 2012-03-24 06:00:00 | 376 |
| 2012-03-24 07:00:00 | 375.75 |
| 2012-03-24 08:00:00 | 380.25 |
| 2012-03-24 09:00:00 | 372.5 |
| 2012-03-24 10:00:00 | 379.75 |
| 2012-03-24 11:00:00 | 377.5 |
| 2012-03-24 12:00:00 | 330 |
| 2012-03-24 13:00:00 | 347.75 |
| 2012-03-24 14:00:00 | 341 |
| 2012-03-24 15:00:00 | 334.25 |
| 2012-03-24 16:00:00 | 332 |
| 2012-03-24 17:00:00 | 335.75 |
| 2012-03-24 18:00:00 | 335.25 |
| 2012-03-24 19:00:00 | 340.25 |
| 2012-03-24 20:00:00 | 336.5 |
| 2012-03-24 21:00:00 | 333.75 |
| 2012-03-24 22:00:00 | 337.25 |
| 2012-03-24 23:00:00 | 336.5 |
| 2012-03-25 | 364 |
| 2012-03-25 01:00:00 | 386.25 |
| 2012-03-25 03:00:00 | 385.25 |
| 2012-03-25 04:00:00 | 387.25 |
| 2012-03-25 05:00:00 | 369.5 |
| 2012-03-25 06:00:00 | 387 |
| 2012-03-25 07:00:00 | 386 |
| 2012-03-25 08:00:00 | 386 |
| 2012-03-25 09:00:00 | 391.5 |
| 2012-03-25 10:00:00 | 380.5 |
| 2012-03-25 11:00:00 | 382 |
| 2012-03-25 12:00:00 | 381.75 |
| 2012-03-25 13:00:00 | 371.5 |
| 2012-03-25 14:00:00 | 343.5 |
| 2012-03-25 15:00:00 | 341.5 |
| 2012-03-25 16:00:00 | 336 |
| 2012-03-25 17:00:00 | 330.25 |
| 2012-03-25 18:00:00 | 335 |
| 2012-03-25 19:00:00 | 339 |
| 2012-03-25 20:00:00 | 327.75 |
| 2012-03-25 21:00:00 | 330 |
| 2012-03-25 22:00:00 | 336 |
| 2012-03-25 23:00:00 | 353.75 |
| 2012-03-26 | 351.5 |
| 2012-03-26 01:00:00 | 377.75 |
| 2012-03-26 02:00:00 | 386.5 |
| 2012-03-26 03:00:00 | 373.25 |
| 2012-03-26 04:00:00 | 368 |
| 2012-03-26 05:00:00 | 376 |
| 2012-03-26 06:00:00 | 380.5 |
| 2012-03-26 07:00:00 | 381.5 |
| 2012-03-26 08:00:00 | 344.75 |
| 2012-03-26 09:00:00 | 342.5 |
| 2012-03-26 10:00:00 | 341 |
| 2012-03-26 11:00:00 | 334.75 |
| 2012-03-26 12:00:00 | 336 |
| 2012-03-26 13:00:00 | 337.75 |
| 2012-03-26 14:00:00 | 340.25 |
| 2012-03-26 15:00:00 | 344.5 |
| 2012-03-26 16:00:00 | 337.75 |
| 2012-03-26 17:00:00 | 348 |
| 2012-03-26 18:00:00 | 337.75 |
| 2012-03-26 19:00:00 | 337.5 |
| 2012-03-26 20:00:00 | 338.25 |
| 2012-03-26 21:00:00 | 338.25 |
| 2012-03-26 22:00:00 | 335.5 |
| 2012-03-26 23:00:00 | 351.5 |
| 2012-03-27 | 364.25 |
| 2012-03-27 01:00:00 | 383.25 |
| 2012-03-27 02:00:00 | 387.5 |
| 2012-03-27 03:00:00 | 389.25 |
| 2012-03-27 04:00:00 | 367 |
| 2012-03-27 05:00:00 | 369 |
| 2012-03-27 06:00:00 | 370.25 |
| 2012-03-27 07:00:00 | 338.25 |
| 2012-03-27 08:00:00 | 334.5 |
| 2012-03-27 09:00:00 | 336.5 |
| 2012-03-27 10:00:00 | 343.25 |
| 2012-03-27 11:00:00 | 339 |
| 2012-03-27 12:00:00 | 331.25 |
| 2012-03-27 13:00:00 | 340 |
| 2012-03-27 14:00:00 | 342.5 |
| 2012-03-27 15:00:00 | 343 |
| 2012-03-27 16:00:00 | 339.75 |
| 2012-03-27 17:00:00 | 335.75 |
| 2012-03-27 18:00:00 | 331.25 |
| 2012-03-27 19:00:00 | 332.75 |
| 2012-03-27 20:00:00 | 331.75 |
| 2012-03-27 21:00:00 | 335 |
| 2012-03-27 22:00:00 | 337.5 |
| 2012-03-27 23:00:00 | 352 |
| 2012-03-28 | 363.75 |
| 2012-03-28 01:00:00 | 387.75 |
| 2012-03-28 02:00:00 | 384.75 |
| 2012-03-28 03:00:00 | 378.75 |
| 2012-03-28 04:00:00 | 366 |
| 2012-03-28 05:00:00 | 367.5 |
| 2012-03-28 06:00:00 | 363.5 |
| 2012-03-28 07:00:00 | 334 |
| 2012-03-28 08:00:00 | 339 |
| 2012-03-28 09:00:00 | 352.25 |
| 2012-03-28 10:00:00 | 351.5 |
| 2012-03-28 11:00:00 | 336.75 |
| 2012-03-28 12:00:00 | 325.25 |
| 2012-03-28 13:00:00 | 333.75 |
| 2012-03-28 14:00:00 | 344 |
| 2012-03-28 15:00:00 | 363.75 |
| 2012-03-28 16:00:00 | 349.25 |
| 2012-03-28 17:00:00 | 342.25 |
| 2012-03-28 18:00:00 | 341.25 |
| 2012-03-28 19:00:00 | 348 |
| 2012-03-28 20:00:00 | 340.75 |
| 2012-03-28 21:00:00 | 337.25 |
| 2012-03-28 22:00:00 | 340.5 |
| 2012-03-28 23:00:00 | 366.25 |
| 2012-03-29 | 377.25 |
| 2012-03-29 01:00:00 | 381 |
| 2012-03-29 02:00:00 | 379.5 |
| 2012-03-29 03:00:00 | 361.75 |
| 2012-03-29 04:00:00 | 363.5 |
| 2012-03-29 05:00:00 | 371.75 |
| 2012-03-29 06:00:00 | 374.25 |
| 2012-03-29 07:00:00 | 342.25 |
| 2012-03-29 08:00:00 | 336.25 |
| 2012-03-29 09:00:00 | 362.25 |
| 2012-03-29 10:00:00 | 352.25 |
| 2012-03-29 11:00:00 | 339.5 |
| 2012-03-29 12:00:00 | 336.25 |
| 2012-03-29 13:00:00 | 342 |
| 2012-03-29 14:00:00 | 336 |
| 2012-03-29 15:00:00 | 334 |
| 2012-03-29 16:00:00 | 345.5 |
| 2012-03-29 17:00:00 | 344.25 |
| 2012-03-29 18:00:00 | 338.25 |
| 2012-03-29 19:00:00 | 339.75 |
| 2012-03-29 20:00:00 | 338 |
| 2012-03-29 21:00:00 | 342.25 |
| 2012-03-29 22:00:00 | 345 |
| 2012-03-29 23:00:00 | 366.5 |
| 2012-03-30 | 378 |
| 2012-03-30 01:00:00 | 387.5 |
| 2012-03-30 02:00:00 | 383 |
| 2012-03-30 03:00:00 | 364.75 |
| 2012-03-30 04:00:00 | 364.5 |
| 2012-03-30 05:00:00 | 382.5 |
| 2012-03-30 06:00:00 | 380.75 |
| 2012-03-30 07:00:00 | 347.5 |
| 2012-03-30 08:00:00 | 348.75 |
| 2012-03-30 09:00:00 | 352.25 |
| 2012-03-30 10:00:00 | 349.5 |
| 2012-03-30 11:00:00 | 337.5 |
| 2012-03-30 12:00:00 | 330.5 |
| 2012-03-30 13:00:00 | 329.5 |
| 2012-03-30 14:00:00 | 328 |
| 2012-03-30 15:00:00 | 327 |
| 2012-03-30 16:00:00 | 343 |
| 2012-03-30 17:00:00 | 345.5 |
| 2012-03-30 18:00:00 | 332.25 |
| 2012-03-30 19:00:00 | 344.25 |
| 2012-03-30 20:00:00 | 338.5 |
| 2012-03-30 21:00:00 | 340 |
| 2012-03-30 22:00:00 | 352.75 |
| 2012-03-30 23:00:00 | 352.5 |
| 2012-03-31 | 363 |
| 2012-03-31 01:00:00 | 383.5 |
| 2012-03-31 02:00:00 | 369.5 |
| 2012-03-31 03:00:00 | 361.75 |
| 2012-03-31 04:00:00 | 359.25 |
| 2012-03-31 05:00:00 | 384 |
| 2012-03-31 06:00:00 | 384.75 |
| 2012-03-31 07:00:00 | 381.5 |
| 2012-03-31 08:00:00 | 382.25 |
| 2012-03-31 09:00:00 | 377.25 |
| 2012-03-31 10:00:00 | 352 |
| 2012-03-31 11:00:00 | 335.75 |
| 2012-03-31 12:00:00 | 328 |
| 2012-03-31 13:00:00 | 334.75 |
| 2012-03-31 14:00:00 | 333 |
| 2012-03-31 15:00:00 | 340.5 |
| 2012-03-31 16:00:00 | 336.25 |
| 2012-03-31 17:00:00 | 335.75 |
| 2012-03-31 18:00:00 | 334.25 |
| 2012-03-31 19:00:00 | 331.25 |
| 2012-03-31 20:00:00 | 347 |
| 2012-03-31 21:00:00 | 349.75 |
| 2012-03-31 22:00:00 | 355.25 |
| 2012-03-31 23:00:00 | 354.75 |
| 2012-04-01 | 361.75 |
| 2012-04-01 01:00:00 | 384.75 |
| 2012-04-01 02:00:00 | 368.75 |
| 2012-04-01 03:00:00 | 362.25 |
| 2012-04-01 04:00:00 | 360 |
| 2012-04-01 05:00:00 | 374.75 |
| 2012-04-01 06:00:00 | 386 |
| 2012-04-01 07:00:00 | 382.75 |
| 2012-04-01 08:00:00 | 384 |
| 2012-04-01 09:00:00 | 381.75 |
| 2012-04-01 10:00:00 | 342 |
| 2012-04-01 11:00:00 | 327.75 |
| 2012-04-01 12:00:00 | 329 |
| 2012-04-01 13:00:00 | 332.25 |
| 2012-04-01 14:00:00 | 331.5 |
| 2012-04-01 15:00:00 | 334.5 |
| 2012-04-01 16:00:00 | 330.5 |
| 2012-04-01 17:00:00 | 340.75 |
| 2012-04-01 18:00:00 | 333 |
| 2012-04-01 19:00:00 | 340 |
| 2012-04-01 20:00:00 | 332.5 |
| 2012-04-01 21:00:00 | 299 |
| 2012-04-01 22:00:00 | 347.5 |
| 2012-04-01 23:00:00 | 358.25 |
| 2012-04-02 | 360.25 |
| 2012-04-02 01:00:00 | 386.5 |
| 2012-04-02 02:00:00 | 362.25 |
| 2012-04-02 03:00:00 | 361 |
| 2012-04-02 04:00:00 | 362.25 |
| 2012-04-02 05:00:00 | 391.25 |
| 2012-04-02 06:00:00 | 394.5 |
| 2012-04-02 07:00:00 | 373.5 |
| 2012-04-02 08:00:00 | 346.25 |
| 2012-04-02 09:00:00 | 339.75 |
| 2012-04-02 10:00:00 | 346.75 |
| 2012-04-02 11:00:00 | 340.75 |
| 2012-04-02 12:00:00 | 334.5 |
| 2012-04-02 13:00:00 | 338.25 |
| 2012-04-02 14:00:00 | 336.75 |
| 2012-04-02 15:00:00 | 332.25 |
| 2012-04-02 16:00:00 | 331.75 |
| 2012-04-02 17:00:00 | 338.5 |
| 2012-04-02 18:00:00 | 333.5 |
| 2012-04-02 19:00:00 | 331.5 |
| 2012-04-02 20:00:00 | 333.75 |
| 2012-04-02 21:00:00 | 333 |
| 2012-04-02 22:00:00 | 330.75 |
| 2012-04-02 23:00:00 | 341 |
| 2012-04-03 | 365.5 |
| 2012-04-03 01:00:00 | 383 |
| 2012-04-03 02:00:00 | 375.25 |
| 2012-04-03 03:00:00 | 364.75 |
| 2012-04-03 04:00:00 | 356.25 |
| 2012-04-03 05:00:00 | 337.5 |
| 2012-04-03 06:00:00 | 334 |
| 2012-04-03 07:00:00 | 334.25 |
| 2012-04-03 08:00:00 | 334.25 |
| 2012-04-03 09:00:00 | 333 |
| 2012-04-03 10:00:00 | 329.5 |
| 2012-04-03 11:00:00 | 335.5 |
| 2012-04-03 12:00:00 | 344 |
| 2012-04-03 13:00:00 | 335.25 |
| 2012-04-03 14:00:00 | 332.75 |
| 2012-04-03 15:00:00 | 334.25 |
| 2012-04-03 16:00:00 | 335.25 |
| 2012-04-03 17:00:00 | 336 |
| 2012-04-03 18:00:00 | 341 |
| 2012-04-03 19:00:00 | 335.75 |
| 2012-04-03 20:00:00 | 334.75 |
| 2012-04-03 21:00:00 | 342.25 |
| 2012-04-03 22:00:00 | 338.75 |
| 2012-04-03 23:00:00 | 347.75 |
| 2012-04-04 | 351.25 |
| 2012-04-04 01:00:00 | 377 |
| 2012-04-04 02:00:00 | 374.75 |
| 2012-04-04 03:00:00 | 372.75 |
| 2012-04-04 04:00:00 | 372.75 |
| 2012-04-04 05:00:00 | 324.75 |
| 2012-04-04 06:00:00 | 324 |
| 2012-04-04 07:00:00 | 333.25 |
| 2012-04-04 08:00:00 | 334.5 |
| 2012-04-04 09:00:00 | 345.5 |
| 2012-04-04 10:00:00 | 349.25 |
| 2012-04-04 11:00:00 | 339.25 |
| 2012-04-04 12:00:00 | 345.75 |
| 2012-04-04 13:00:00 | 345.75 |
| 2012-04-04 14:00:00 | 338.25 |
| 2012-04-04 15:00:00 | 342.25 |
| 2012-04-04 16:00:00 | 350.75 |
| 2012-04-04 17:00:00 | 341.25 |
| 2012-04-04 18:00:00 | 338.5 |
| 2012-04-04 19:00:00 | 337 |
| 2012-04-04 20:00:00 | 336.25 |
| 2012-04-04 21:00:00 | 340.5 |
| 2012-04-04 22:00:00 | 338.25 |
| 2012-04-04 23:00:00 | 355 |
| 2012-04-05 | 364.5 |
| 2012-04-05 01:00:00 | 374.5 |
| 2012-04-05 02:00:00 | 381 |
| 2012-04-05 03:00:00 | 371.25 |
| 2012-04-05 04:00:00 | 365 |
| 2012-04-05 05:00:00 | 364.5 |
| 2012-04-05 06:00:00 | 360.25 |
| 2012-04-05 07:00:00 | 334.25 |
| 2012-04-05 08:00:00 | 329.75 |
| 2012-04-05 09:00:00 | 338.75 |
| 2012-04-05 10:00:00 | 349 |
| 2012-04-05 11:00:00 | 346.25 |
| 2012-04-05 12:00:00 | 343 |
| 2012-04-05 13:00:00 | 347.25 |
| 2012-04-05 14:00:00 | 345 |
| 2012-04-05 15:00:00 | 340.5 |
| 2012-04-05 16:00:00 | 341 |
| 2012-04-05 17:00:00 | 337.25 |
| 2012-04-05 18:00:00 | 340.25 |
| 2012-04-05 19:00:00 | 346.5 |
| 2012-04-05 20:00:00 | 348.5 |
| 2012-04-05 21:00:00 | 344.5 |
| 2012-04-05 22:00:00 | 376.5 |
| 2012-04-05 23:00:00 | 406.75 |
| 2012-04-06 | 418.75 |
| 2012-04-06 01:00:00 | 388.25 |
| 2012-04-06 02:00:00 | 386 |
| 2012-04-06 03:00:00 | 370.5 |
| 2012-04-06 04:00:00 | 364 |
| 2012-04-06 05:00:00 | 364.5 |
| 2012-04-06 06:00:00 | 373.75 |
| 2012-04-06 07:00:00 | 391 |
| 2012-04-06 08:00:00 | 395.5 |
| 2012-04-06 09:00:00 | 387 |
| 2012-04-06 10:00:00 | 388.75 |
| 2012-04-06 11:00:00 | 378.5 |
| 2012-04-06 12:00:00 | 374.75 |
| 2012-04-06 13:00:00 | 355.75 |
| 2012-04-06 14:00:00 | 337.75 |
| 2012-04-06 15:00:00 | 353.25 |
| 2012-04-06 16:00:00 | 353.5 |
| 2012-04-06 17:00:00 | 353.5 |
| 2012-04-06 18:00:00 | 351.25 |
| 2012-04-06 19:00:00 | 339.5 |
| 2012-04-06 20:00:00 | 338 |
| 2012-04-06 21:00:00 | 339.75 |
| 2012-04-06 22:00:00 | 344.5 |
| 2012-04-06 23:00:00 | 360 |
| 2012-04-07 | 383.5 |
| 2012-04-07 01:00:00 | 396.5 |
| 2012-04-07 02:00:00 | 385.75 |
| 2012-04-07 03:00:00 | 365.75 |
| 2012-04-07 04:00:00 | 362.25 |
| 2012-04-07 05:00:00 | 372.5 |
| 2012-04-07 06:00:00 | 387.5 |
| 2012-04-07 07:00:00 | 380.5 |
| 2012-04-07 08:00:00 | 379 |
| 2012-04-07 09:00:00 | 380.25 |
| 2012-04-07 10:00:00 | 378.5 |
| 2012-04-07 11:00:00 | 399.75 |
| 2012-04-07 12:00:00 | 391.5 |
| 2012-04-07 13:00:00 | 368.75 |
| 2012-04-07 14:00:00 | 336.75 |
| 2012-04-07 15:00:00 | 333.25 |
| 2012-04-07 16:00:00 | 335.25 |
| 2012-04-07 17:00:00 | 263.75 |
| 2012-04-07 18:00:00 | 346.5 |
| 2012-04-07 19:00:00 | 386 |
| 2012-04-07 20:00:00 | 401 |
| 2012-04-07 21:00:00 | 357.75 |
| 2012-04-07 22:00:00 | 350.75 |
| 2012-04-07 23:00:00 | 361.25 |
| 2012-04-08 | 397.25 |
| 2012-04-08 01:00:00 | 384.25 |
| 2012-04-08 02:00:00 | 381.25 |
| 2012-04-08 03:00:00 | 364 |
| 2012-04-08 04:00:00 | 365 |
| 2012-04-08 05:00:00 | 373.75 |
| 2012-04-08 06:00:00 | 382.5 |
| 2012-04-08 07:00:00 | 383.75 |
| 2012-04-08 08:00:00 | 384.75 |
| 2012-04-08 09:00:00 | 388.25 |
| 2012-04-08 10:00:00 | 396.5 |
| 2012-04-08 11:00:00 | 386.75 |
| 2012-04-08 12:00:00 | 380.75 |
| 2012-04-08 13:00:00 | 388.5 |
| 2012-04-08 14:00:00 | 391.25 |
| 2012-04-08 15:00:00 | 382.25 |
| 2012-04-08 16:00:00 | 372.25 |
| 2012-04-08 17:00:00 | 384.25 |
| 2012-04-08 18:00:00 | 384.75 |
| 2012-04-08 19:00:00 | 384 |
| 2012-04-08 20:00:00 | 388.25 |
| 2012-04-08 21:00:00 | 386 |
| 2012-04-08 22:00:00 | 399.25 |
| 2012-04-08 23:00:00 | 401.75 |
| 2012-04-09 | 401.5 |
| 2012-04-09 01:00:00 | 382 |
| 2012-04-09 02:00:00 | 371.25 |
| 2012-04-09 03:00:00 | 364.75 |
| 2012-04-09 04:00:00 | 363.25 |
| 2012-04-09 05:00:00 | 373.75 |
| 2012-04-09 06:00:00 | 378.5 |
| 2012-04-09 07:00:00 | 378 |
| 2012-04-09 08:00:00 | 346.25 |
| 2012-04-09 09:00:00 | 338 |
| 2012-04-09 10:00:00 | 342.25 |
| 2012-04-09 11:00:00 | 334.75 |
| 2012-04-09 12:00:00 | 331.75 |
| 2012-04-09 13:00:00 | 337 |
| 2012-04-09 14:00:00 | 335.25 |
| 2012-04-09 15:00:00 | 335 |
| 2012-04-09 16:00:00 | 344.5 |
| 2012-04-09 17:00:00 | 337.25 |
| 2012-04-09 18:00:00 | 335.5 |
| 2012-04-09 19:00:00 | 337 |
| 2012-04-09 20:00:00 | 338.75 |
| 2012-04-09 21:00:00 | 346.75 |
| 2012-04-09 22:00:00 | 339.75 |
| 2012-04-09 23:00:00 | 362.75 |
| 2012-04-10 | 365 |
| 2012-04-10 01:00:00 | 383 |
| 2012-04-10 02:00:00 | 381.75 |
| 2012-04-10 03:00:00 | 368.25 |
| 2012-04-10 04:00:00 | 366.25 |
| 2012-04-10 05:00:00 | 383.5 |
| 2012-04-10 06:00:00 | 387 |
| 2012-04-10 07:00:00 | 385.25 |
| 2012-04-10 08:00:00 | 364.5 |
| 2012-04-10 09:00:00 | 340.5 |
| 2012-04-10 10:00:00 | 345.75 |
| 2012-04-10 11:00:00 | 344.25 |
| 2012-04-10 12:00:00 | 332.75 |
| 2012-04-10 13:00:00 | 339.5 |
| 2012-04-10 14:00:00 | 331.75 |
| 2012-04-10 15:00:00 | 333.25 |
| 2012-04-10 16:00:00 | 341.25 |
| 2012-04-10 17:00:00 | 348 |
| 2012-04-10 18:00:00 | 333 |
| 2012-04-10 19:00:00 | 335.25 |
| 2012-04-10 20:00:00 | 332.75 |
| 2012-04-10 21:00:00 | 336.25 |
| 2012-04-10 22:00:00 | 350.5 |
| 2012-04-10 23:00:00 | 363.25 |
| 2012-04-11 | 353.75 |
| 2012-04-11 01:00:00 | 380.75 |
| 2012-04-11 02:00:00 | 380.75 |
| 2012-04-11 03:00:00 | 368.5 |
| 2012-04-11 04:00:00 | 364.25 |
| 2012-04-11 05:00:00 | 383.5 |
| 2012-04-11 06:00:00 | 392.75 |
| 2012-04-11 07:00:00 | 338 |
| 2012-04-11 08:00:00 | 338.25 |
| 2012-04-11 09:00:00 | 341.75 |
| 2012-04-11 10:00:00 | 346.5 |
| 2012-04-11 11:00:00 | 338.25 |
| 2012-04-11 12:00:00 | 340.25 |
| 2012-04-11 13:00:00 | 342.5 |
| 2012-04-11 14:00:00 | 334.25 |
| 2012-04-11 15:00:00 | 342.25 |
| 2012-04-11 16:00:00 | 342.25 |
| 2012-04-11 17:00:00 | 342.75 |
| 2012-04-11 18:00:00 | 343.25 |
| 2012-04-11 19:00:00 | 334.75 |
| 2012-04-11 20:00:00 | 338.75 |
| 2012-04-11 21:00:00 | 339.75 |
| 2012-04-11 22:00:00 | 344.75 |
| 2012-04-11 23:00:00 | 339.5 |
| 2012-04-12 | 358.5 |
| 2012-04-12 01:00:00 | 377 |
| 2012-04-12 02:00:00 | 376.75 |
| 2012-04-12 03:00:00 | 378.75 |
| 2012-04-12 04:00:00 | 373 |
| 2012-04-12 05:00:00 | 331 |
| 2012-04-12 06:00:00 | 340 |
| 2012-04-12 07:00:00 | 337 |
| 2012-04-12 08:00:00 | 342.5 |
| 2012-04-12 09:00:00 | 347 |
| 2012-04-12 10:00:00 | 339 |
| 2012-04-12 11:00:00 | 347.5 |
| 2012-04-12 12:00:00 | 343.5 |
| 2012-04-12 13:00:00 | 345.5 |
| 2012-04-12 14:00:00 | 346.75 |
| 2012-04-12 15:00:00 | 361 |
| 2012-04-12 16:00:00 | 345 |
| 2012-04-12 17:00:00 | 336 |
| 2012-04-12 18:00:00 | 336.75 |
| 2012-04-12 19:00:00 | 347.5 |
| 2012-04-12 20:00:00 | 343.25 |
| 2012-04-12 21:00:00 | 346.25 |
| 2012-04-12 22:00:00 | 346.5 |
| 2012-04-12 23:00:00 | 354 |
| 2012-04-13 | 375 |
| 2012-04-13 01:00:00 | 383.75 |
| 2012-04-13 02:00:00 | 382.75 |
| 2012-04-13 03:00:00 | 373.75 |
| 2012-04-13 04:00:00 | 373 |
| 2012-04-13 05:00:00 | 375.25 |
| 2012-04-13 06:00:00 | 381.25 |
| 2012-04-13 07:00:00 | 376 |
| 2012-04-13 08:00:00 | 375.75 |
| 2012-04-13 09:00:00 | 207.25 |
| 2012-04-13 10:00:00 | 362.25 |
| 2012-04-13 11:00:00 | 383.25 |
| 2012-04-13 12:00:00 | 383 |
| 2012-04-13 13:00:00 | 359.75 |
| 2012-04-13 14:00:00 | 338.25 |
| 2012-04-13 15:00:00 | 344.5 |
| 2012-04-13 16:00:00 | 353.25 |
| 2012-04-13 17:00:00 | 341 |
| 2012-04-13 18:00:00 | 342.25 |
| 2012-04-13 19:00:00 | 341 |
| 2012-04-13 20:00:00 | 340 |
| 2012-04-13 21:00:00 | 342.75 |
| 2012-04-13 22:00:00 | 345.25 |
| 2012-04-13 23:00:00 | 365.5 |
| 2012-04-14 | 365.25 |
| 2012-04-14 01:00:00 | 376 |
| 2012-04-14 02:00:00 | 373.75 |
| 2012-04-14 03:00:00 | 355 |
| 2012-04-14 04:00:00 | 358.5 |
| 2012-04-14 05:00:00 | 362.25 |
| 2012-04-14 06:00:00 | 380.5 |
| 2012-04-14 07:00:00 | 385.5 |
| 2012-04-14 08:00:00 | 383 |
| 2012-04-14 09:00:00 | 388 |
| 2012-04-14 10:00:00 | 395.5 |
| 2012-04-14 11:00:00 | 391.5 |
| 2012-04-14 12:00:00 | 346.5 |
| 2012-04-14 13:00:00 | 337.5 |
| 2012-04-14 14:00:00 | 340.25 |
| 2012-04-14 15:00:00 | 336.25 |
| 2012-04-14 16:00:00 | 337 |
| 2012-04-14 17:00:00 | 337.5 |
| 2012-04-14 18:00:00 | 335 |
| 2012-04-14 19:00:00 | 330.5 |
| 2012-04-14 20:00:00 | 337 |
| 2012-04-14 21:00:00 | 344.25 |
| 2012-04-14 22:00:00 | 342.5 |
| 2012-04-14 23:00:00 | 366.5 |
| 2012-04-15 | 379 |
| 2012-04-15 01:00:00 | 377.5 |
| 2012-04-15 02:00:00 | 377 |
| 2012-04-15 03:00:00 | 361.25 |
| 2012-04-15 04:00:00 | 366.5 |
| 2012-04-15 05:00:00 | 377.75 |
| 2012-04-15 06:00:00 | 374.25 |
| 2012-04-15 07:00:00 | 377.75 |
| 2012-04-15 08:00:00 | 352.75 |
| 2012-04-15 09:00:00 | 386.75 |
| 2012-04-15 10:00:00 | 371.75 |
| 2012-04-15 11:00:00 | 315 |
| 2012-04-15 12:00:00 | 282.25 |
| 2012-04-15 13:00:00 | 304 |
| 2012-04-15 14:00:00 | 243 |
| 2012-04-15 15:00:00 | 193 |
| 2012-04-15 16:00:00 | 197.75 |
| 2012-04-15 17:00:00 | 197.5 |
| 2012-04-15 18:00:00 | 199.25 |
| 2012-04-15 19:00:00 | 199 |
| 2012-04-15 20:00:00 | 200.5 |
| 2012-04-15 21:00:00 | 207.25 |
| 2012-04-15 22:00:00 | 213.5 |
| 2012-04-15 23:00:00 | 224.25 |
| 2012-04-16 | 221.75 |
| 2012-04-16 01:00:00 | 217.5 |
| 2012-04-16 02:00:00 | 219 |
| 2012-04-16 03:00:00 | 199.5 |
| 2012-04-16 04:00:00 | 201 |
| 2012-04-16 05:00:00 | 207.25 |
| 2012-04-16 06:00:00 | 197.75 |
| 2012-04-16 07:00:00 | 195.75 |
| 2012-04-16 08:00:00 | 196.25 |
| 2012-04-16 09:00:00 | 196.25 |
| 2012-04-16 10:00:00 | 212.5 |
| 2012-04-16 11:00:00 | 203.5 |
| 2012-04-16 12:00:00 | 196.25 |
| 2012-04-16 13:00:00 | 206 |
| 2012-04-16 14:00:00 | 204.75 |
| 2012-04-16 15:00:00 | 90.5 |
| 2012-04-16 16:00:00 | 73.25 |
| 2012-04-16 17:00:00 | 107.5 |
| 2012-04-16 18:00:00 | 104.75 |
| 2012-04-16 19:00:00 | 104 |
| 2012-04-16 20:00:00 | 103.75 |
| 2012-04-16 21:00:00 | 106.25 |
| 2012-04-16 22:00:00 | 107.75 |
| 2012-04-16 23:00:00 | 110 |
| 2012-04-17 | 110.5 |
| 2012-04-17 01:00:00 | 111.25 |
| 2012-04-17 02:00:00 | 111 |
| 2012-04-17 03:00:00 | 111.75 |
| 2012-04-17 04:00:00 | 112.25 |
| 2012-04-17 05:00:00 | 109.25 |
| 2012-04-17 06:00:00 | 97.75 |
| 2012-04-17 07:00:00 | 90.25 |
| 2012-04-17 08:00:00 | 94.5 |
| 2012-04-17 09:00:00 | 105.5 |
| 2012-04-17 10:00:00 | 109.75 |
| 2012-04-17 11:00:00 | 104.75 |
| 2012-04-17 12:00:00 | 111.5 |
| 2012-04-17 13:00:00 | 113 |
| 2012-04-17 14:00:00 | 102.75 |
| 2012-04-17 15:00:00 | 90.5 |
| 2012-04-17 16:00:00 | 91.75 |
| 2012-04-17 17:00:00 | 90.25 |
| 2012-04-17 18:00:00 | 87.75 |
| 2012-04-17 19:00:00 | 90 |
| 2012-04-17 20:00:00 | 71 |
| 2012-04-17 21:00:00 | 74 |
| 2012-04-17 22:00:00 | 73.5 |
| 2012-04-17 23:00:00 | 74 |
| 2012-04-18 | 78 |
| 2012-04-18 01:00:00 | 74.5 |
| 2012-04-18 02:00:00 | 75.5 |
| 2012-04-18 03:00:00 | 75.25 |
| 2012-04-18 04:00:00 | 75.5 |
| 2012-04-18 05:00:00 | 75.75 |
| 2012-04-18 06:00:00 | 78.5 |
| 2012-04-18 07:00:00 | 76.25 |
| 2012-04-18 08:00:00 | 87 |
| 2012-04-18 09:00:00 | 102.25 |
| 2012-04-18 10:00:00 | 93.25 |
| 2012-04-18 11:00:00 | 85.5 |
| 2012-04-18 12:00:00 | 50.25 |
| 2012-04-18 13:00:00 | 96.75 |
| 2012-04-18 14:00:00 | 91.5 |
| 2012-04-18 15:00:00 | 85.75 |
| 2012-04-18 16:00:00 | 83 |
| 2012-04-18 17:00:00 | 87.5 |
| 2012-04-18 18:00:00 | 80.25 |
| 2012-04-18 19:00:00 | 81.5 |
| 2012-04-18 20:00:00 | 82.25 |
| 2012-04-18 21:00:00 | 86 |
| 2012-04-18 22:00:00 | 89.75 |
| 2012-04-18 23:00:00 | 87 |
| 2012-04-19 | 89 |
| 2012-04-19 01:00:00 | 91.25 |
| 2012-04-19 02:00:00 | 89.5 |
| 2012-04-19 03:00:00 | 90.25 |
| 2012-04-19 04:00:00 | 90 |
| 2012-04-19 05:00:00 | 93.75 |
| 2012-04-19 06:00:00 | 89 |
| 2012-04-19 07:00:00 | 87.5 |
| 2012-04-19 08:00:00 | 95.25 |
| 2012-04-19 09:00:00 | 107 |
| 2012-04-19 10:00:00 | 105.75 |
| 2012-04-19 11:00:00 | 101 |
| 2012-04-19 12:00:00 | 100.75 |
| 2012-04-19 13:00:00 | 92.5 |
| 2012-04-19 14:00:00 | 98.25 |
| 2012-04-19 15:00:00 | 79.25 |
| 2012-04-19 16:00:00 | 74.75 |
| 2012-04-19 17:00:00 | 75.5 |
| 2012-04-19 18:00:00 | 72.5 |
| 2012-04-19 19:00:00 | 72.5 |
| 2012-04-19 20:00:00 | 78.75 |
| 2012-04-19 21:00:00 | 78.25 |
| 2012-04-19 22:00:00 | 79.5 |
| 2012-04-19 23:00:00 | 83.25 |
| 2012-04-20 | 83.75 |
| 2012-04-20 01:00:00 | 87.75 |
| 2012-04-20 02:00:00 | 94.75 |
| 2012-04-20 03:00:00 | 94 |
| 2012-04-20 04:00:00 | 95.5 |
| 2012-04-20 05:00:00 | 80 |
| 2012-04-20 06:00:00 | 82 |
| 2012-04-20 07:00:00 | 78.75 |
| 2012-04-20 08:00:00 | 87.25 |
| 2012-04-20 09:00:00 | 95.5 |
| 2012-04-20 10:00:00 | 98 |
| 2012-04-20 11:00:00 | 91 |
| 2012-04-20 12:00:00 | 92.5 |
| 2012-04-20 13:00:00 | 82.75 |
| 2012-04-20 14:00:00 | 80.5 |
| 2012-04-20 15:00:00 | 84 |
| 2012-04-20 16:00:00 | 80.75 |
| 2012-04-20 17:00:00 | 80.25 |
| 2012-04-20 18:00:00 | 85.75 |
| 2012-04-20 19:00:00 | 79 |
| 2012-04-20 20:00:00 | 81.75 |
| 2012-04-20 21:00:00 | 83.5 |
| 2012-04-20 22:00:00 | 84.25 |
| 2012-04-20 23:00:00 | 88.5 |
| 2012-04-21 | 84.25 |
| 2012-04-21 01:00:00 | 84.5 |
| 2012-04-21 02:00:00 | 84.5 |
| 2012-04-21 03:00:00 | 84 |
| 2012-04-21 04:00:00 | 87 |
| 2012-04-21 05:00:00 | 86.25 |
| 2012-04-21 06:00:00 | 85.25 |
| 2012-04-21 07:00:00 | 57 |
| 2012-04-21 08:00:00 | 75.5 |
| 2012-04-21 09:00:00 | 93 |
| 2012-04-21 10:00:00 | 91 |
| 2012-04-21 11:00:00 | 96.5 |
| 2012-04-21 12:00:00 | 100.25 |
| 2012-04-21 13:00:00 | 84.5 |
| 2012-04-21 14:00:00 | 51 |
| 2012-04-21 15:00:00 | 55.25 |
| 2012-04-21 16:00:00 | 50 |
| 2012-04-21 17:00:00 | 49.5 |
| 2012-04-21 18:00:00 | 49.75 |
| 2012-04-21 19:00:00 | 51.75 |
| 2012-04-21 20:00:00 | 54.25 |
| 2012-04-21 21:00:00 | 61 |
| 2012-04-21 22:00:00 | 66.25 |
| 2012-04-21 23:00:00 | 56.5 |
| 2012-04-22 | 55.75 |
| 2012-04-22 01:00:00 | 56 |
| 2012-04-22 02:00:00 | 58 |
| 2012-04-22 03:00:00 | 57.75 |
| 2012-04-22 04:00:00 | 56.25 |
| 2012-04-22 05:00:00 | 60 |
| 2012-04-22 06:00:00 | 69.5 |
| 2012-04-22 07:00:00 | 70.25 |
| 2012-04-22 08:00:00 | 53.5 |
| 2012-04-22 09:00:00 | 63.5 |
| 2012-04-22 10:00:00 | 65.5 |
| 2012-04-22 11:00:00 | 54.75 |
| 2012-04-22 12:00:00 | 51.25 |
| 2012-04-22 13:00:00 | 71 |
| 2012-04-22 14:00:00 | 63.75 |
| 2012-04-22 15:00:00 | 53.5 |
| 2012-04-22 16:00:00 | 88.5 |
| 2012-04-22 17:00:00 | 113.75 |
| 2012-04-22 18:00:00 | 113.75 |
| 2012-04-22 19:00:00 | 118 |
| 2012-04-22 20:00:00 | 128.75 |
| 2012-04-22 21:00:00 | 119 |
| 2012-04-22 22:00:00 | 118.75 |
| 2012-04-22 23:00:00 | 131.5 |
| 2012-04-23 | 137.5 |
| 2012-04-23 01:00:00 | 140.75 |
| 2012-04-23 02:00:00 | 118.75 |
| 2012-04-23 03:00:00 | 110.5 |
| 2012-04-23 04:00:00 | 100 |
| 2012-04-23 05:00:00 | 105 |
| 2012-04-23 06:00:00 | 98.75 |
| 2012-04-23 07:00:00 | 96.75 |
| 2012-04-23 08:00:00 | 100.25 |
| 2012-04-23 09:00:00 | 155.5 |
| 2012-04-23 10:00:00 | 316.75 |
| 2012-04-23 11:00:00 | 327.75 |
| 2012-04-23 12:00:00 | 327.5 |
| 2012-04-23 13:00:00 | 370.75 |
| 2012-04-23 14:00:00 | 389.5 |
| 2012-04-23 15:00:00 | 370.75 |
| 2012-04-23 16:00:00 | 336 |
| 2012-04-23 17:00:00 | 343 |
| 2012-04-23 18:00:00 | 333.75 |
| 2012-04-23 19:00:00 | 340 |
| 2012-04-23 20:00:00 | 329.5 |
| 2012-04-23 21:00:00 | 331.25 |
| 2012-04-23 22:00:00 | 330.75 |
| 2012-04-23 23:00:00 | 345.75 |
| 2012-04-24 | 348 |
| 2012-04-24 01:00:00 | 379.75 |
| 2012-04-24 02:00:00 | 381.75 |
| 2012-04-24 03:00:00 | 366.5 |
| 2012-04-24 04:00:00 | 361.25 |
| 2012-04-24 05:00:00 | 372.5 |
| 2012-04-24 06:00:00 | 377.5 |
| 2012-04-24 07:00:00 | 357.75 |
| 2012-04-24 08:00:00 | 330.5 |
| 2012-04-24 09:00:00 | 346.5 |
| 2012-04-24 10:00:00 | 354.25 |
| 2012-04-24 11:00:00 | 334.25 |
| 2012-04-24 12:00:00 | 337.75 |
| 2012-04-24 13:00:00 | 347.5 |
| 2012-04-24 14:00:00 | 340.75 |
| 2012-04-24 15:00:00 | 334 |
| 2012-04-24 16:00:00 | 340 |
| 2012-04-24 17:00:00 | 331.75 |
| 2012-04-24 18:00:00 | 326.75 |
| 2012-04-24 19:00:00 | 325 |
| 2012-04-24 20:00:00 | 327 |
| 2012-04-24 21:00:00 | 333.5 |
| 2012-04-24 22:00:00 | 339.75 |
| 2012-04-24 23:00:00 | 353 |
| 2012-04-25 | 359.25 |
| 2012-04-25 01:00:00 | 367.75 |
| 2012-04-25 02:00:00 | 364.25 |
| 2012-04-25 03:00:00 | 348.25 |
| 2012-04-25 04:00:00 | 345.75 |
| 2012-04-25 05:00:00 | 349.75 |
| 2012-04-25 06:00:00 | 361.5 |
| 2012-04-25 07:00:00 | 342.75 |
| 2012-04-25 08:00:00 | 338.25 |
| 2012-04-25 09:00:00 | 335.5 |
| 2012-04-25 10:00:00 | 351.25 |
| 2012-04-25 11:00:00 | 339.75 |
| 2012-04-25 12:00:00 | 338.25 |
| 2012-04-25 13:00:00 | 345.25 |
| 2012-04-25 14:00:00 | 328.75 |
| 2012-04-25 15:00:00 | 331.25 |
| 2012-04-25 16:00:00 | 335.75 |
| 2012-04-25 17:00:00 | 331.25 |
| 2012-04-25 18:00:00 | 329.25 |
| 2012-04-25 19:00:00 | 331 |
| 2012-04-25 20:00:00 | 330.25 |
| 2012-04-25 21:00:00 | 335.75 |
| 2012-04-25 22:00:00 | 326.5 |
| 2012-04-25 23:00:00 | 342 |
| 2012-04-26 | 351.5 |
| 2012-04-26 01:00:00 | 382.5 |
| 2012-04-26 02:00:00 | 369.75 |
| 2012-04-26 03:00:00 | 375.25 |
| 2012-04-26 04:00:00 | 368.5 |
| 2012-04-26 05:00:00 | 364.75 |
| 2012-04-26 06:00:00 | 352.25 |
| 2012-04-26 07:00:00 | 327.75 |
| 2012-04-26 08:00:00 | 330.5 |
| 2012-04-26 09:00:00 | 348.25 |
| 2012-04-26 10:00:00 | 345.75 |
| 2012-04-26 11:00:00 | 334 |
| 2012-04-26 12:00:00 | 331.75 |
| 2012-04-26 13:00:00 | 334.25 |
| 2012-04-26 14:00:00 | 332.25 |
| 2012-04-26 15:00:00 | 331.75 |
| 2012-04-26 16:00:00 | 344.75 |
| 2012-04-26 17:00:00 | 333.25 |
| 2012-04-26 18:00:00 | 323 |
| 2012-04-26 19:00:00 | 322 |
| 2012-04-26 20:00:00 | 322.25 |
| 2012-04-26 21:00:00 | 327.25 |
| 2012-04-26 22:00:00 | 339 |
| 2012-04-26 23:00:00 | 355 |
| 2012-04-27 | 369.75 |
| 2012-04-27 01:00:00 | 371.5 |
| 2012-04-27 02:00:00 | 369.25 |
| 2012-04-27 03:00:00 | 354.75 |
| 2012-04-27 04:00:00 | 350.25 |
| 2012-04-27 05:00:00 | 365.25 |
| 2012-04-27 06:00:00 | 355.75 |
| 2012-04-27 07:00:00 | 330.5 |
| 2012-04-27 08:00:00 | 340 |
| 2012-04-27 09:00:00 | 349.5 |
| 2012-04-27 10:00:00 | 351.25 |
| 2012-04-27 11:00:00 | 340 |
| 2012-04-27 12:00:00 | 338.5 |
| 2012-04-27 13:00:00 | 338 |
| 2012-04-27 14:00:00 | 335 |
| 2012-04-27 15:00:00 | 331 |
| 2012-04-27 16:00:00 | 331.75 |
| 2012-04-27 17:00:00 | 341.5 |
| 2012-04-27 18:00:00 | 336 |
| 2012-04-27 19:00:00 | 330.5 |
| 2012-04-27 20:00:00 | 327.75 |
| 2012-04-27 21:00:00 | 332.5 |
| 2012-04-27 22:00:00 | 333.75 |
| 2012-04-27 23:00:00 | 348 |
| 2012-04-28 | 362.75 |
| 2012-04-28 01:00:00 | 368.5 |
| 2012-04-28 02:00:00 | 367.25 |
| 2012-04-28 03:00:00 | 357.5 |
| 2012-04-28 04:00:00 | 347 |
| 2012-04-28 05:00:00 | 372 |
| 2012-04-28 06:00:00 | 369 |
| 2012-04-28 07:00:00 | 369.25 |
| 2012-04-28 08:00:00 | 368.25 |
| 2012-04-28 09:00:00 | 368.25 |
| 2012-04-28 10:00:00 | 359.75 |
| 2012-04-28 11:00:00 | 347.25 |
| 2012-04-28 12:00:00 | 349.25 |
| 2012-04-28 13:00:00 | 345.75 |
| 2012-04-28 14:00:00 | 336.25 |
| 2012-04-28 15:00:00 | 333.5 |
| 2012-04-28 16:00:00 | 343 |
| 2012-04-28 17:00:00 | 329.75 |
| 2012-04-28 18:00:00 | 327.5 |
| 2012-04-28 19:00:00 | 330 |
| 2012-04-28 20:00:00 | 335 |
| 2012-04-28 21:00:00 | 341.25 |
| 2012-04-28 22:00:00 | 353.75 |
| 2012-04-28 23:00:00 | 362.5 |
| 2012-04-29 | 370.75 |
| 2012-04-29 01:00:00 | 371.75 |
| 2012-04-29 02:00:00 | 354.75 |
| 2012-04-29 03:00:00 | 352.75 |
| 2012-04-29 04:00:00 | 354.75 |
| 2012-04-29 05:00:00 | 361.5 |
| 2012-04-29 06:00:00 | 359.75 |
| 2012-04-29 07:00:00 | 352.75 |
| 2012-04-29 08:00:00 | 367.25 |
| 2012-04-29 09:00:00 | 367 |
| 2012-04-29 10:00:00 | 378 |
| 2012-04-29 11:00:00 | 376.75 |
| 2012-04-29 12:00:00 | 365.5 |
| 2012-04-29 13:00:00 | 370 |
| 2012-04-29 14:00:00 | 350.5 |
| 2012-04-29 15:00:00 | 333.25 |
| 2012-04-29 16:00:00 | 337.5 |
| 2012-04-29 17:00:00 | 323.25 |
| 2012-04-29 18:00:00 | 325.75 |
| 2012-04-29 19:00:00 | 327.5 |
| 2012-04-29 20:00:00 | 333 |
| 2012-04-29 21:00:00 | 364.75 |
| 2012-04-29 22:00:00 | 359 |
| 2012-04-29 23:00:00 | 348.25 |
| 2012-04-30 | 364.25 |
| 2012-04-30 01:00:00 | 363.5 |
| 2012-04-30 02:00:00 | 352.75 |
| 2012-04-30 03:00:00 | 351.5 |
| 2012-04-30 04:00:00 | 350.5 |
| 2012-04-30 05:00:00 | 365 |
| 2012-04-30 06:00:00 | 376 |
| 2012-04-30 07:00:00 | 370 |
| 2012-04-30 08:00:00 | 364 |
| 2012-04-30 09:00:00 | 329 |
| 2012-04-30 10:00:00 | 325.75 |
| 2012-04-30 11:00:00 | 331.75 |
| 2012-04-30 12:00:00 | 339.5 |
| 2012-04-30 13:00:00 | 348.5 |
| 2012-04-30 14:00:00 | 379.5 |
| 2012-04-30 15:00:00 | 373 |
| 2012-04-30 16:00:00 | 349.5 |
| 2012-04-30 17:00:00 | 337.75 |
| 2012-04-30 18:00:00 | 350.5 |
| 2012-04-30 19:00:00 | 339.25 |
| 2012-04-30 20:00:00 | 339.25 |
| 2012-04-30 21:00:00 | 333.5 |
| 2012-04-30 22:00:00 | 337.75 |
| 2012-04-30 23:00:00 | 348.25 |
| 2012-05-01 | 400.75 |
| 2012-05-01 01:00:00 | 369.25 |
| 2012-05-01 02:00:00 | 364 |
| 2012-05-01 03:00:00 | 362.5 |
| 2012-05-01 04:00:00 | 352.75 |
| 2012-05-01 05:00:00 | 353 |
| 2012-05-01 06:00:00 | 369 |
| 2012-05-01 07:00:00 | 366 |
| 2012-05-01 08:00:00 | 367.25 |
| 2012-05-01 09:00:00 | 335.5 |
| 2012-05-01 10:00:00 | 344.75 |
| 2012-05-01 11:00:00 | 340.25 |
| 2012-05-01 12:00:00 | 336.5 |
| 2012-05-01 13:00:00 | 340 |
| 2012-05-01 14:00:00 | 332 |
| 2012-05-01 15:00:00 | 349.25 |
| 2012-05-01 16:00:00 | 367 |
| 2012-05-01 17:00:00 | 368 |
| 2012-05-01 18:00:00 | 369 |
| 2012-05-01 19:00:00 | 343 |
| 2012-05-01 20:00:00 | 327.75 |
| 2012-05-01 21:00:00 | 332 |
| 2012-05-01 22:00:00 | 336.25 |
| 2012-05-01 23:00:00 | 360.5 |
| 2012-05-02 | 359 |
| 2012-05-02 01:00:00 | 365 |
| 2012-05-02 02:00:00 | 362.5 |
| 2012-05-02 03:00:00 | 345.25 |
| 2012-05-02 04:00:00 | 344 |
| 2012-05-02 05:00:00 | 353.75 |
| 2012-05-02 06:00:00 | 342.5 |
| 2012-05-02 07:00:00 | 325.75 |
| 2012-05-02 08:00:00 | 330.25 |
| 2012-05-02 09:00:00 | 342 |
| 2012-05-02 10:00:00 | 338.25 |
| 2012-05-02 11:00:00 | 321 |
| 2012-05-02 12:00:00 | 288.75 |
| 2012-05-02 13:00:00 | 239.25 |
| 2012-05-02 14:00:00 | 258.75 |
| 2012-05-02 15:00:00 | 319.25 |
| 2012-05-02 16:00:00 | 340 |
| 2012-05-02 17:00:00 | 343 |
| 2012-05-02 18:00:00 | 336.25 |
| 2012-05-02 19:00:00 | 331.5 |
| 2012-05-02 20:00:00 | 329.25 |
| 2012-05-02 21:00:00 | 331.75 |
| 2012-05-02 22:00:00 | 334 |
| 2012-05-02 23:00:00 | 347.25 |
| 2012-05-03 | 356.75 |
| 2012-05-03 01:00:00 | 370.5 |
| 2012-05-03 02:00:00 | 365.75 |
| 2012-05-03 03:00:00 | 353.5 |
| 2012-05-03 04:00:00 | 345.25 |
| 2012-05-03 05:00:00 | 351.25 |
| 2012-05-03 06:00:00 | 346.75 |
| 2012-05-03 07:00:00 | 326.75 |
| 2012-05-03 08:00:00 | 322.5 |
| 2012-05-03 09:00:00 | 321.25 |
| 2012-05-03 10:00:00 | 342 |
| 2012-05-03 11:00:00 | 343.25 |
| 2012-05-03 12:00:00 | 339.5 |
| 2012-05-03 13:00:00 | 342.25 |
| 2012-05-03 14:00:00 | 333.25 |
| 2012-05-03 15:00:00 | 277.25 |
| 2012-05-03 16:00:00 | 342.5 |
| 2012-05-03 17:00:00 | 343.25 |
| 2012-05-03 18:00:00 | 337.5 |
| 2012-05-03 19:00:00 | 339.25 |
| 2012-05-03 20:00:00 | 349.75 |
| 2012-05-03 21:00:00 | 347.25 |
| 2012-05-03 22:00:00 | 348 |
| 2012-05-03 23:00:00 | 356.75 |
| 2012-05-04 | 361 |
| 2012-05-04 01:00:00 | 374.75 |
| 2012-05-04 02:00:00 | 370.25 |
| 2012-05-04 03:00:00 | 355.25 |
| 2012-05-04 04:00:00 | 350 |
| 2012-05-04 05:00:00 | 363.25 |
| 2012-05-04 06:00:00 | 358.25 |
| 2012-05-04 07:00:00 | 328.75 |
| 2012-05-04 08:00:00 | 337 |
| 2012-05-04 09:00:00 | 333.75 |
| 2012-05-04 10:00:00 | 338.25 |
| 2012-05-04 11:00:00 | 336.5 |
| 2012-05-04 12:00:00 | 325 |
| 2012-05-04 13:00:00 | 337.75 |
| 2012-05-04 14:00:00 | 332 |
| 2012-05-04 15:00:00 | 335.75 |
| 2012-05-04 16:00:00 | 343.5 |
| 2012-05-04 17:00:00 | 338.5 |
| 2012-05-04 18:00:00 | 332.5 |
| 2012-05-04 19:00:00 | 337 |
| 2012-05-04 20:00:00 | 344.25 |
| 2012-05-04 21:00:00 | 341.5 |
| 2012-05-04 22:00:00 | 343 |
| 2012-05-04 23:00:00 | 349.5 |
| 2012-05-05 | 372.75 |
| 2012-05-05 01:00:00 | 387.25 |
| 2012-05-05 02:00:00 | 373.5 |
| 2012-05-05 03:00:00 | 358.25 |
| 2012-05-05 04:00:00 | 351 |
| 2012-05-05 05:00:00 | 362.25 |
| 2012-05-05 06:00:00 | 366.75 |
| 2012-05-05 07:00:00 | 366.5 |
| 2012-05-05 08:00:00 | 367.5 |
| 2012-05-05 09:00:00 | 365.25 |
| 2012-05-05 10:00:00 | 369.5 |
| 2012-05-05 11:00:00 | 338.75 |
| 2012-05-05 12:00:00 | 336.25 |
| 2012-05-05 13:00:00 | 349.5 |
| 2012-05-05 14:00:00 | 383 |
| 2012-05-05 15:00:00 | 381 |
| 2012-05-05 16:00:00 | 330.5 |
| 2012-05-05 17:00:00 | 332.75 |
| 2012-05-05 18:00:00 | 358.25 |
| 2012-05-05 19:00:00 | 371.5 |
| 2012-05-05 20:00:00 | 367 |
| 2012-05-05 21:00:00 | 378.5 |
| 2012-05-05 22:00:00 | 376 |
| 2012-05-05 23:00:00 | 391.25 |
| 2012-05-06 | 399.25 |
| 2012-05-06 01:00:00 | 367 |
| 2012-05-06 02:00:00 | 366.75 |
| 2012-05-06 03:00:00 | 356 |
| 2012-05-06 04:00:00 | 348.5 |
| 2012-05-06 05:00:00 | 363 |
| 2012-05-06 06:00:00 | 370.25 |
| 2012-05-06 07:00:00 | 374.5 |
| 2012-05-06 08:00:00 | 366.5 |
| 2012-05-06 09:00:00 | 371.25 |
| 2012-05-06 10:00:00 | 388.75 |
| 2012-05-06 11:00:00 | 390.5 |
| 2012-05-06 12:00:00 | 386.5 |
| 2012-05-06 13:00:00 | 369.75 |
| 2012-05-06 14:00:00 | 368.75 |
| 2012-05-06 15:00:00 | 352.5 |
| 2012-05-06 16:00:00 | 357.5 |
| 2012-05-06 17:00:00 | 332.25 |
| 2012-05-06 18:00:00 | 364 |
| 2012-05-06 19:00:00 | 368.75 |
| 2012-05-06 20:00:00 | 337.75 |
| 2012-05-06 21:00:00 | 346 |
| 2012-05-06 22:00:00 | 347.75 |
| 2012-05-06 23:00:00 | 349 |
| 2012-05-07 | 388.25 |
| 2012-05-07 01:00:00 | 357 |
| 2012-05-07 02:00:00 | 353 |
| 2012-05-07 03:00:00 | 350.5 |
| 2012-05-07 04:00:00 | 349.5 |
| 2012-05-07 05:00:00 | 363.5 |
| 2012-05-07 06:00:00 | 357.5 |
| 2012-05-07 07:00:00 | 349.25 |
| 2012-05-07 08:00:00 | 403.25 |
| 2012-05-07 09:00:00 | 362.5 |
| 2012-05-07 10:00:00 | 352.5 |
| 2012-05-07 11:00:00 | 342.5 |
| 2012-05-07 12:00:00 | 349.5 |
| 2012-05-07 13:00:00 | 352.5 |
| 2012-05-07 14:00:00 | 320 |
| 2012-05-07 15:00:00 | 372.25 |
| 2012-05-07 16:00:00 | 409.25 |
| 2012-05-07 17:00:00 | 380.25 |
| 2012-05-07 18:00:00 | 336 |
| 2012-05-07 19:00:00 | 334.75 |
| 2012-05-07 20:00:00 | 336.5 |
| 2012-05-07 21:00:00 | 341 |
| 2012-05-07 22:00:00 | 348.75 |
| 2012-05-07 23:00:00 | 365.25 |
| 2012-05-08 | 366 |
| 2012-05-08 01:00:00 | 378 |
| 2012-05-08 02:00:00 | 376.25 |
| 2012-05-08 03:00:00 | 363.75 |
| 2012-05-08 04:00:00 | 358.5 |
| 2012-05-08 05:00:00 | 386.75 |
| 2012-05-08 06:00:00 | 379.5 |
| 2012-05-08 07:00:00 | 376.5 |
| 2012-05-08 08:00:00 | 376.75 |
| 2012-05-08 09:00:00 | 377.25 |
| 2012-05-08 10:00:00 | 368.75 |
| 2012-05-08 11:00:00 | 347.5 |
| 2012-05-08 12:00:00 | 338 |
| 2012-05-08 13:00:00 | 343.75 |
| 2012-05-08 14:00:00 | 338 |
| 2012-05-08 15:00:00 | 341.75 |
| 2012-05-08 16:00:00 | 341.5 |
| 2012-05-08 17:00:00 | 333 |
| 2012-05-08 18:00:00 | 334 |
| 2012-05-08 19:00:00 | 331.25 |
| 2012-05-08 20:00:00 | 306.5 |
| 2012-05-08 21:00:00 | 306 |
| 2012-05-08 22:00:00 | 317 |
| 2012-05-08 23:00:00 | 354 |
| 2012-05-09 | 347.25 |
| 2012-05-09 01:00:00 | 361.75 |
| 2012-05-09 02:00:00 | 359.25 |
| 2012-05-09 03:00:00 | 342 |
| 2012-05-09 04:00:00 | 341.25 |
| 2012-05-09 05:00:00 | 356 |
| 2012-05-09 06:00:00 | 362.5 |
| 2012-05-09 07:00:00 | 335.75 |
| 2012-05-09 08:00:00 | 318.25 |
| 2012-05-09 09:00:00 | 322.75 |
| 2012-05-09 10:00:00 | 333.75 |
| 2012-05-09 11:00:00 | 318.5 |
| 2012-05-09 12:00:00 | 313 |
| 2012-05-09 13:00:00 | 315.5 |
| 2012-05-09 14:00:00 | 315.5 |
| 2012-05-09 15:00:00 | 310.75 |
| 2012-05-09 16:00:00 | 308 |
| 2012-05-09 17:00:00 | 318.75 |
| 2012-05-09 18:00:00 | 310.75 |
| 2012-05-09 19:00:00 | 317.5 |
| 2012-05-09 20:00:00 | 323.25 |
| 2012-05-09 21:00:00 | 345.5 |
| 2012-05-09 22:00:00 | 340.25 |
| 2012-05-09 23:00:00 | 340.75 |
| 2012-05-10 | 344.25 |
| 2012-05-10 01:00:00 | 366.25 |
| 2012-05-10 02:00:00 | 366 |
| 2012-05-10 03:00:00 | 363.5 |
| 2012-05-10 04:00:00 | 367 |
| 2012-05-10 05:00:00 | 320.5 |
| 2012-05-10 06:00:00 | 317 |
| 2012-05-10 07:00:00 | 314 |
| 2012-05-10 08:00:00 | 325.25 |
| 2012-05-10 09:00:00 | 337.5 |
| 2012-05-10 10:00:00 | 338.75 |
| 2012-05-10 11:00:00 | 333.5 |
| 2012-05-10 12:00:00 | 333 |
| 2012-05-10 13:00:00 | 321.5 |
| 2012-05-10 14:00:00 | 314.75 |
| 2012-05-10 15:00:00 | 330.5 |
| 2012-05-10 16:00:00 | 336 |
| 2012-05-10 17:00:00 | 333.25 |
| 2012-05-10 18:00:00 | 330 |
| 2012-05-10 19:00:00 | 324.75 |
| 2012-05-10 20:00:00 | 322.5 |
| 2012-05-10 21:00:00 | 322.5 |
| 2012-05-10 22:00:00 | 326.75 |
| 2012-05-10 23:00:00 | 327.5 |
| 2012-05-11 | 357 |
| 2012-05-11 01:00:00 | 361.5 |
| 2012-05-11 02:00:00 | 359.75 |
| 2012-05-11 03:00:00 | 357.5 |
| 2012-05-11 04:00:00 | 345.25 |
| 2012-05-11 05:00:00 | 322.5 |
| 2012-05-11 06:00:00 | 319.25 |
| 2012-05-11 07:00:00 | 322.5 |
| 2012-05-11 08:00:00 | 322.75 |
| 2012-05-11 09:00:00 | 333.5 |
| 2012-05-11 10:00:00 | 332.5 |
| 2012-05-11 11:00:00 | 324.75 |
| 2012-05-11 12:00:00 | 324.5 |
| 2012-05-11 13:00:00 | 328.5 |
| 2012-05-11 14:00:00 | 322.5 |
| 2012-05-11 15:00:00 | 327.25 |
| 2012-05-11 16:00:00 | 338.5 |
| 2012-05-11 17:00:00 | 322.5 |
| 2012-05-11 18:00:00 | 323.75 |
| 2012-05-11 19:00:00 | 322.25 |
| 2012-05-11 20:00:00 | 325.25 |
| 2012-05-11 21:00:00 | 324.75 |
| 2012-05-11 22:00:00 | 324 |
| 2012-05-11 23:00:00 | 337.5 |
| 2012-05-12 | 342.75 |
| 2012-05-12 01:00:00 | 370 |
| 2012-05-12 02:00:00 | 357.25 |
| 2012-05-12 03:00:00 | 348.25 |
| 2012-05-12 04:00:00 | 338.25 |
| 2012-05-12 05:00:00 | 349.25 |
| 2012-05-12 06:00:00 | 354.75 |
| 2012-05-12 07:00:00 | 320.25 |
| 2012-05-12 08:00:00 | 313.25 |
| 2012-05-12 09:00:00 | 325.75 |
| 2012-05-12 10:00:00 | 324.25 |
| 2012-05-12 11:00:00 | 318.75 |
| 2012-05-12 12:00:00 | 328.25 |
| 2012-05-12 13:00:00 | 325 |
| 2012-05-12 14:00:00 | 323.5 |
| 2012-05-12 15:00:00 | 321.25 |
| 2012-05-12 16:00:00 | 314 |
| 2012-05-12 17:00:00 | 309.5 |
| 2012-05-12 18:00:00 | 305.75 |
| 2012-05-12 19:00:00 | 306.75 |
| 2012-05-12 20:00:00 | 310.25 |
| 2012-05-12 21:00:00 | 311.25 |
| 2012-05-12 22:00:00 | 316.5 |
| 2012-05-12 23:00:00 | 335.25 |
| 2012-05-13 | 333 |
| 2012-05-13 01:00:00 | 357.75 |
| 2012-05-13 02:00:00 | 353.5 |
| 2012-05-13 03:00:00 | 339.75 |
| 2012-05-13 04:00:00 | 342 |
| 2012-05-13 05:00:00 | 339.75 |
| 2012-05-13 06:00:00 | 320 |
| 2012-05-13 07:00:00 | 300 |
| 2012-05-13 08:00:00 | 311.25 |
| 2012-05-13 09:00:00 | 311.25 |
| 2012-05-13 10:00:00 | 315.25 |
| 2012-05-13 11:00:00 | 304.75 |
| 2012-05-13 12:00:00 | 312.75 |
| 2012-05-13 13:00:00 | 315.5 |
| 2012-05-13 14:00:00 | 324 |
| 2012-05-13 15:00:00 | 322.5 |
| 2012-05-13 16:00:00 | 320.5 |
| 2012-05-13 17:00:00 | 317.25 |
| 2012-05-13 18:00:00 | 311.75 |
| 2012-05-13 19:00:00 | 307.25 |
| 2012-05-13 20:00:00 | 305.75 |
| 2012-05-13 21:00:00 | 313.25 |
| 2012-05-13 22:00:00 | 324 |
| 2012-05-13 23:00:00 | 328.25 |
| 2012-05-14 | 324.5 |
| 2012-05-14 01:00:00 | 356.75 |
| 2012-05-14 02:00:00 | 360.5 |
| 2012-05-14 03:00:00 | 339.5 |
| 2012-05-14 04:00:00 | 339.75 |
| 2012-05-14 05:00:00 | 344.75 |
| 2012-05-14 06:00:00 | 312.5 |
| 2012-05-14 07:00:00 | 309.25 |
| 2012-05-14 08:00:00 | 317.75 |
| 2012-05-14 09:00:00 | 310.5 |
| 2012-05-14 10:00:00 | 320.25 |
| 2012-05-14 11:00:00 | 325.25 |
| 2012-05-14 12:00:00 | 323.25 |
| 2012-05-14 13:00:00 | 327.25 |
| 2012-05-14 14:00:00 | 319 |
| 2012-05-14 15:00:00 | 355.5 |
| 2012-05-14 16:00:00 | 361 |
| 2012-05-14 17:00:00 | 345.5 |
| 2012-05-14 18:00:00 | 343.25 |
| 2012-05-14 19:00:00 | 343 |
| 2012-05-14 20:00:00 | 334.25 |
| 2012-05-14 21:00:00 | 340.75 |
| 2012-05-14 22:00:00 | 339 |
| 2012-05-14 23:00:00 | 354 |
| 2012-05-15 | 375 |
| 2012-05-15 01:00:00 | 393.75 |
| 2012-05-15 02:00:00 | 381.25 |
| 2012-05-15 03:00:00 | 372 |
| 2012-05-15 04:00:00 | 362 |
| 2012-05-15 05:00:00 | 378 |
| 2012-05-15 06:00:00 | 367 |
| 2012-05-15 07:00:00 | 334.75 |
| 2012-05-15 08:00:00 | 333.25 |
| 2012-05-15 09:00:00 | 347.75 |
| 2012-05-15 10:00:00 | 361 |
| 2012-05-15 11:00:00 | 356 |
| 2012-05-15 12:00:00 | 348.5 |
| 2012-05-15 13:00:00 | 350.75 |
| 2012-05-15 14:00:00 | 343 |
| 2012-05-15 15:00:00 | 344.25 |
| 2012-05-15 16:00:00 | 348.25 |
| 2012-05-15 17:00:00 | 350 |
| 2012-05-15 18:00:00 | 348.25 |
| 2012-05-15 19:00:00 | 350.75 |
| 2012-05-15 20:00:00 | 350.75 |
| 2012-05-15 21:00:00 | 344 |
| 2012-05-15 22:00:00 | 349 |
| 2012-05-15 23:00:00 | 363.5 |
| 2012-05-16 | 379.75 |
| 2012-05-16 01:00:00 | 395.5 |
| 2012-05-16 02:00:00 | 381.5 |
| 2012-05-16 03:00:00 | 362 |
| 2012-05-16 04:00:00 | 361.5 |
| 2012-05-16 05:00:00 | 377.5 |
| 2012-05-16 06:00:00 | 366.5 |
| 2012-05-16 07:00:00 | 342.25 |
| 2012-05-16 08:00:00 | 343.5 |
| 2012-05-16 09:00:00 | 352 |
| 2012-05-16 10:00:00 | 347.75 |
| 2012-05-16 11:00:00 | 343.75 |
| 2012-05-16 12:00:00 | 346.25 |
| 2012-05-16 13:00:00 | 358.5 |
| 2012-05-16 14:00:00 | 354 |
| 2012-05-16 15:00:00 | 361.75 |
| 2012-05-16 16:00:00 | 368.25 |
| 2012-05-16 17:00:00 | 350.25 |
| 2012-05-16 18:00:00 | 344.25 |
| 2012-05-16 19:00:00 | 341 |
| 2012-05-16 20:00:00 | 344.25 |
| 2012-05-16 21:00:00 | 342.5 |
| 2012-05-16 22:00:00 | 349 |
| 2012-05-16 23:00:00 | 374.75 |
| 2012-05-17 | 361.25 |
| 2012-05-17 01:00:00 | 377.75 |
| 2012-05-17 02:00:00 | 380.75 |
| 2012-05-17 03:00:00 | 364.25 |
| 2012-05-17 04:00:00 | 364.25 |
| 2012-05-17 05:00:00 | 378 |
| 2012-05-17 06:00:00 | 368.25 |
| 2012-05-17 07:00:00 | 359.75 |
| 2012-05-17 08:00:00 | 379.75 |
| 2012-05-17 09:00:00 | 350 |
| 2012-05-17 10:00:00 | 359 |
| 2012-05-17 11:00:00 | 357.25 |
| 2012-05-17 12:00:00 | 353.75 |
| 2012-05-17 13:00:00 | 353.5 |
| 2012-05-17 14:00:00 | 348.5 |
| 2012-05-17 15:00:00 | 349.25 |
| 2012-05-17 16:00:00 | 341 |
| 2012-05-17 17:00:00 | 343.5 |
| 2012-05-17 18:00:00 | 337 |
| 2012-05-17 19:00:00 | 345.75 |
| 2012-05-17 20:00:00 | 345 |
| 2012-05-17 21:00:00 | 338.5 |
| 2012-05-17 22:00:00 | 347 |
| 2012-05-17 23:00:00 | 359.25 |
| 2012-05-18 | 377.5 |
| 2012-05-18 01:00:00 | 374.25 |
| 2012-05-18 02:00:00 | 368.25 |
| 2012-05-18 03:00:00 | 351.25 |
| 2012-05-18 04:00:00 | 350.75 |
| 2012-05-18 05:00:00 | 372 |
| 2012-05-18 06:00:00 | 359 |
| 2012-05-18 07:00:00 | 328 |
| 2012-05-18 08:00:00 | 327.75 |
| 2012-05-18 09:00:00 | 286 |
| 2012-05-18 10:00:00 | 282.75 |
| 2012-05-18 11:00:00 | 305 |
| 2012-05-18 12:00:00 | 399.75 |
| 2012-05-18 13:00:00 | 423.25 |
| 2012-05-18 14:00:00 | 370.25 |
| 2012-05-18 15:00:00 | 355 |
| 2012-05-18 16:00:00 | 349.25 |
| 2012-05-18 17:00:00 | 349.75 |
| 2012-05-18 18:00:00 | 352.5 |
| 2012-05-18 19:00:00 | 331 |
| 2012-05-18 20:00:00 | 358.5 |
| 2012-05-18 21:00:00 | 370.5 |
| 2012-05-18 22:00:00 | 346.75 |
| 2012-05-18 23:00:00 | 367 |
| 2012-05-19 | 384 |
| 2012-05-19 01:00:00 | 355.25 |
| 2012-05-19 02:00:00 | 354.5 |
| 2012-05-19 03:00:00 | 352.25 |
| 2012-05-19 04:00:00 | 351.5 |
| 2012-05-19 05:00:00 | 373 |
| 2012-05-19 06:00:00 | 375 |
| 2012-05-19 07:00:00 | 377.75 |
| 2012-05-19 08:00:00 | 382.25 |
| 2012-05-19 09:00:00 | 391 |
| 2012-05-19 10:00:00 | 398.25 |
| 2012-05-19 11:00:00 | 389.25 |
| 2012-05-19 12:00:00 | 390.5 |
| 2012-05-19 13:00:00 | 383.25 |
| 2012-05-19 14:00:00 | 356.75 |
| 2012-05-19 15:00:00 | 336.25 |
| 2012-05-19 16:00:00 | 375.75 |
| 2012-05-19 17:00:00 | 364.5 |
| 2012-05-19 18:00:00 | 341.75 |
| 2012-05-19 19:00:00 | 339.5 |
| 2012-05-19 20:00:00 | 337.25 |
| 2012-05-19 21:00:00 | 346.5 |
| 2012-05-19 22:00:00 | 355.75 |
| 2012-05-19 23:00:00 | 398.25 |
| 2012-05-20 | 391.75 |
| 2012-05-20 01:00:00 | 374.5 |
| 2012-05-20 02:00:00 | 367.5 |
| 2012-05-20 03:00:00 | 352.5 |
| 2012-05-20 04:00:00 | 354.75 |
| 2012-05-20 05:00:00 | 365.75 |
| 2012-05-20 06:00:00 | 375.75 |
| 2012-05-20 07:00:00 | 377.25 |
| 2012-05-20 08:00:00 | 378 |
| 2012-05-20 09:00:00 | 373.25 |
| 2012-05-20 10:00:00 | 375.5 |
| 2012-05-20 11:00:00 | 384 |
| 2012-05-20 12:00:00 | 382.75 |
| 2012-05-20 13:00:00 | 384.5 |
| 2012-05-20 14:00:00 | 380.75 |
| 2012-05-20 15:00:00 | 382.75 |
| 2012-05-20 16:00:00 | 379.25 |
| 2012-05-20 17:00:00 | 360.75 |
| 2012-05-20 18:00:00 | 347.5 |
| 2012-05-20 19:00:00 | 340.25 |
| 2012-05-20 20:00:00 | 332.75 |
| 2012-05-20 21:00:00 | 334.25 |
| 2012-05-20 22:00:00 | 353.75 |
| 2012-05-20 23:00:00 | 357.75 |
| 2012-05-21 | 367.5 |
| 2012-05-21 01:00:00 | 372.5 |
| 2012-05-21 02:00:00 | 354.25 |
| 2012-05-21 03:00:00 | 354.25 |
| 2012-05-21 04:00:00 | 354.5 |
| 2012-05-21 05:00:00 | 380.75 |
| 2012-05-21 06:00:00 | 353.25 |
| 2012-05-21 07:00:00 | 336 |
| 2012-05-21 08:00:00 | 346 |
| 2012-05-21 09:00:00 | 349.25 |
| 2012-05-21 10:00:00 | 343 |
| 2012-05-21 11:00:00 | 341 |
| 2012-05-21 12:00:00 | 342.25 |
| 2012-05-21 13:00:00 | 358.75 |
| 2012-05-21 14:00:00 | 375 |
| 2012-05-21 15:00:00 | 388.75 |
| 2012-05-21 16:00:00 | 394.25 |
| 2012-05-21 17:00:00 | 339.5 |
| 2012-05-21 18:00:00 | 337.5 |
| 2012-05-21 19:00:00 | 340.25 |
| 2012-05-21 20:00:00 | 338.25 |
| 2012-05-21 21:00:00 | 337.5 |
| 2012-05-21 22:00:00 | 341.25 |
| 2012-05-21 23:00:00 | 367.25 |
| 2012-05-22 | 358 |
| 2012-05-22 01:00:00 | 371.5 |
| 2012-05-22 02:00:00 | 371.5 |
| 2012-05-22 03:00:00 | 354 |
| 2012-05-22 04:00:00 | 357.25 |
| 2012-05-22 05:00:00 | 324.25 |
| 2012-05-22 06:00:00 | 100.75 |
| 2012-05-22 07:00:00 | 184.25 |
| 2012-05-22 08:00:00 | 400 |
| 2012-05-22 09:00:00 | 361.75 |
| 2012-05-22 10:00:00 | 299 |
| 2012-05-22 11:00:00 | 295.5 |
| 2012-05-22 12:00:00 | 325.75 |
| 2012-05-22 13:00:00 | 352.75 |
| 2012-05-22 14:00:00 | 353.5 |
| 2012-05-22 15:00:00 | 309 |
| 2012-05-22 16:00:00 | 297.25 |
| 2012-05-22 17:00:00 | 304 |
| 2012-05-22 18:00:00 | 342.75 |
| 2012-05-22 19:00:00 | 315 |
| 2012-05-22 20:00:00 | 395.5 |
| 2012-05-22 21:00:00 | 416 |
| 2012-05-22 22:00:00 | 351.75 |
| 2012-05-22 23:00:00 | 365.25 |
| 2012-05-23 | 367 |
| 2012-05-23 01:00:00 | 375.5 |
| 2012-05-23 02:00:00 | 376 |
| 2012-05-23 03:00:00 | 358.75 |
| 2012-05-23 04:00:00 | 355.25 |
| 2012-05-23 05:00:00 | 368 |
| 2012-05-23 06:00:00 | 360.5 |
| 2012-05-23 07:00:00 | 336.5 |
| 2012-05-23 08:00:00 | 342.5 |
| 2012-05-23 09:00:00 | 387.75 |
| 2012-05-23 10:00:00 | 418.5 |
| 2012-05-23 11:00:00 | 361.75 |
| 2012-05-23 12:00:00 | 339.75 |
| 2012-05-23 13:00:00 | 334.25 |
| 2012-05-23 14:00:00 | 306.5 |
| 2012-05-23 15:00:00 | 359 |
| 2012-05-23 16:00:00 | 354.25 |
| 2012-05-23 17:00:00 | 336.75 |
| 2012-05-23 18:00:00 | 295 |
| 2012-05-23 19:00:00 | 303.25 |
| 2012-05-23 20:00:00 | 336.75 |
| 2012-05-23 21:00:00 | 414 |
| 2012-05-23 22:00:00 | 360.75 |
| 2012-05-23 23:00:00 | 379.25 |
| 2012-05-24 | 381.5 |
| 2012-05-24 01:00:00 | 382.5 |
| 2012-05-24 02:00:00 | 379.5 |
| 2012-05-24 03:00:00 | 363.25 |
| 2012-05-24 04:00:00 | 360 |
| 2012-05-24 05:00:00 | 370.5 |
| 2012-05-24 06:00:00 | 360.25 |
| 2012-05-24 07:00:00 | 342.5 |
| 2012-05-24 08:00:00 | 344.25 |
| 2012-05-24 09:00:00 | 354 |
| 2012-05-24 10:00:00 | 365.25 |
| 2012-05-24 11:00:00 | 364.25 |
| 2012-05-24 12:00:00 | 345.25 |
| 2012-05-24 13:00:00 | 350.75 |
| 2012-05-24 14:00:00 | 340.5 |
| 2012-05-24 15:00:00 | 349.75 |
| 2012-05-24 16:00:00 | 351 |
| 2012-05-24 17:00:00 | 351.25 |
| 2012-05-24 18:00:00 | 349.25 |
| 2012-05-24 19:00:00 | 349 |
| 2012-05-24 20:00:00 | 339.25 |
| 2012-05-24 21:00:00 | 344.25 |
| 2012-05-24 22:00:00 | 346.25 |
| 2012-05-24 23:00:00 | 375 |
| 2012-05-25 | 386 |
| 2012-05-25 01:00:00 | 382 |
| 2012-05-25 02:00:00 | 381.75 |
| 2012-05-25 03:00:00 | 365.25 |
| 2012-05-25 04:00:00 | 360.5 |
| 2012-05-25 05:00:00 | 377.5 |
| 2012-05-25 06:00:00 | 369 |
| 2012-05-25 07:00:00 | 342.25 |
| 2012-05-25 08:00:00 | 345 |
| 2012-05-25 09:00:00 | 346.25 |
| 2012-05-25 10:00:00 | 357.25 |
| 2012-05-25 11:00:00 | 349 |
| 2012-05-25 12:00:00 | 345 |
| 2012-05-25 13:00:00 | 348.5 |
| 2012-05-25 14:00:00 | 346.5 |
| 2012-05-25 15:00:00 | 348.5 |
| 2012-05-25 16:00:00 | 357 |
| 2012-05-25 17:00:00 | 343.25 |
| 2012-05-25 18:00:00 | 340.5 |
| 2012-05-25 19:00:00 | 341.25 |
| 2012-05-25 20:00:00 | 344.25 |
| 2012-05-25 21:00:00 | 347.75 |
| 2012-05-25 22:00:00 | 352.75 |
| 2012-05-25 23:00:00 | 373.25 |
| 2012-05-26 | 367 |
| 2012-05-26 01:00:00 | 381.25 |
| 2012-05-26 02:00:00 | 380 |
| 2012-05-26 03:00:00 | 365.5 |
| 2012-05-26 04:00:00 | 360.5 |
| 2012-05-26 05:00:00 | 380 |
| 2012-05-26 06:00:00 | 389.75 |
| 2012-05-26 07:00:00 | 382.75 |
| 2012-05-26 08:00:00 | 386.5 |
| 2012-05-26 09:00:00 | 361.25 |
| 2012-05-26 10:00:00 | 345.5 |
| 2012-05-26 11:00:00 | 351.75 |
| 2012-05-26 12:00:00 | 346 |
| 2012-05-26 13:00:00 | 350 |
| 2012-05-26 14:00:00 | 343.5 |
| 2012-05-26 15:00:00 | 345 |
| 2012-05-26 16:00:00 | 349.25 |
| 2012-05-26 17:00:00 | 347.5 |
| 2012-05-26 18:00:00 | 344.5 |
| 2012-05-26 19:00:00 | 341.75 |
| 2012-05-26 20:00:00 | 343 |
| 2012-05-26 21:00:00 | 364 |
| 2012-05-26 22:00:00 | 377.5 |
| 2012-05-26 23:00:00 | 419 |
| 2012-05-27 | 420.25 |
| 2012-05-27 01:00:00 | 376.5 |
| 2012-05-27 02:00:00 | 365.75 |
| 2012-05-27 03:00:00 | 369.25 |
| 2012-05-27 04:00:00 | 362 |
| 2012-05-27 05:00:00 | 368.25 |
| 2012-05-27 06:00:00 | 377.5 |
| 2012-05-27 07:00:00 | 379 |
| 2012-05-27 08:00:00 | 379.5 |
| 2012-05-27 09:00:00 | 393.5 |
| 2012-05-27 10:00:00 | 389.5 |
| 2012-05-27 11:00:00 | 383 |
| 2012-05-27 12:00:00 | 370 |
| 2012-05-27 13:00:00 | 346.5 |
| 2012-05-27 14:00:00 | 342.5 |
| 2012-05-27 15:00:00 | 342.25 |
| 2012-05-27 16:00:00 | 357.25 |
| 2012-05-27 17:00:00 | 344 |
| 2012-05-27 18:00:00 | 345 |
| 2012-05-27 19:00:00 | 345.75 |
| 2012-05-27 20:00:00 | 347.5 |
| 2012-05-27 21:00:00 | 372.25 |
| 2012-05-27 22:00:00 | 378 |
| 2012-05-27 23:00:00 | 366.25 |
| 2012-05-28 | 382 |
| 2012-05-28 01:00:00 | 384 |
| 2012-05-28 02:00:00 | 366.75 |
| 2012-05-28 03:00:00 | 368.75 |
| 2012-05-28 04:00:00 | 364.5 |
| 2012-05-28 05:00:00 | 381.5 |
| 2012-05-28 06:00:00 | 385.5 |
| 2012-05-28 07:00:00 | 384.25 |
| 2012-05-28 08:00:00 | 370.25 |
| 2012-05-28 09:00:00 | 353.75 |
| 2012-05-28 10:00:00 | 349 |
| 2012-05-28 11:00:00 | 350 |
| 2012-05-28 12:00:00 | 360.5 |
| 2012-05-28 13:00:00 | 358 |
| 2012-05-28 14:00:00 | 364.75 |
| 2012-05-28 15:00:00 | 379.5 |
| 2012-05-28 16:00:00 | 348.5 |
| 2012-05-28 17:00:00 | 354 |
| 2012-05-28 18:00:00 | 348.25 |
| 2012-05-28 19:00:00 | 347.75 |
| 2012-05-28 20:00:00 | 343.5 |
| 2012-05-28 21:00:00 | 349 |
| 2012-05-28 22:00:00 | 356.5 |
| 2012-05-28 23:00:00 | 365 |
| 2012-05-29 | 358.5 |
| 2012-05-29 01:00:00 | 373.25 |
| 2012-05-29 02:00:00 | 375 |
| 2012-05-29 03:00:00 | 357.75 |
| 2012-05-29 04:00:00 | 363.75 |
| 2012-05-29 05:00:00 | 345.5 |
| 2012-05-29 06:00:00 | 336.5 |
| 2012-05-29 07:00:00 | 339.25 |
| 2012-05-29 08:00:00 | 347.75 |
| 2012-05-29 09:00:00 | 341.5 |
| 2012-05-29 10:00:00 | 345.5 |
| 2012-05-29 11:00:00 | 347.25 |
| 2012-05-29 12:00:00 | 352.75 |
| 2012-05-29 13:00:00 | 358 |
| 2012-05-29 14:00:00 | 350 |
| 2012-05-29 15:00:00 | 351 |
| 2012-05-29 16:00:00 | 347.75 |
| 2012-05-29 17:00:00 | 351.25 |
| 2012-05-29 18:00:00 | 349.5 |
| 2012-05-29 19:00:00 | 341.75 |
| 2012-05-29 20:00:00 | 339.5 |
| 2012-05-29 21:00:00 | 342.25 |
| 2012-05-29 22:00:00 | 347.25 |
| 2012-05-29 23:00:00 | 367.5 |
| 2012-05-30 | 380.75 |
| 2012-05-30 01:00:00 | 391 |
| 2012-05-30 02:00:00 | 379 |
| 2012-05-30 03:00:00 | 361.75 |
| 2012-05-30 04:00:00 | 358.25 |
| 2012-05-30 05:00:00 | 333.75 |
| 2012-05-30 06:00:00 | 333 |
| 2012-05-30 07:00:00 | 341 |
| 2012-05-30 08:00:00 | 349.75 |
| 2012-05-30 09:00:00 | 353 |
| 2012-05-30 10:00:00 | 357.5 |
| 2012-05-30 11:00:00 | 364.75 |
| 2012-05-30 12:00:00 | 356 |
| 2012-05-30 13:00:00 | 364.25 |
| 2012-05-30 14:00:00 | 339.75 |
| 2012-05-30 15:00:00 | 342.75 |
| 2012-05-30 16:00:00 | 352.5 |
| 2012-05-30 17:00:00 | 347.5 |
| 2012-05-30 18:00:00 | 343.5 |
| 2012-05-30 19:00:00 | 343.25 |
| 2012-05-30 20:00:00 | 334.5 |
| 2012-05-30 21:00:00 | 341.5 |
| 2012-05-30 22:00:00 | 342 |
| 2012-05-30 23:00:00 | 360.25 |
| 2012-05-31 | 365 |
| 2012-05-31 01:00:00 | 385 |
| 2012-05-31 02:00:00 | 379.5 |
| 2012-05-31 03:00:00 | 370 |
| 2012-05-31 04:00:00 | 359.5 |
| 2012-05-31 05:00:00 | 371.75 |
| 2012-05-31 06:00:00 | 351.75 |
| 2012-05-31 07:00:00 | 341 |
| 2012-05-31 08:00:00 | 346.25 |
| 2012-05-31 09:00:00 | 342.5 |
| 2012-05-31 10:00:00 | 353.25 |
| 2012-05-31 11:00:00 | 347.5 |
| 2012-05-31 12:00:00 | 343.25 |
| 2012-05-31 13:00:00 | 348.5 |
| 2012-05-31 14:00:00 | 355.25 |
| 2012-05-31 15:00:00 | 355.75 |
| 2012-05-31 16:00:00 | 357.5 |
| 2012-05-31 17:00:00 | 346 |
| 2012-05-31 18:00:00 | 339 |
| 2012-05-31 19:00:00 | 341.75 |
| 2012-05-31 20:00:00 | 339.75 |
| 2012-05-31 21:00:00 | 343.75 |
| 2012-05-31 22:00:00 | 343.75 |
| 2012-05-31 23:00:00 | 362.5 |
| 2012-06-01 | 370 |
| 2012-06-01 01:00:00 | 380 |
| 2012-06-01 02:00:00 | 379.5 |
| 2012-06-01 03:00:00 | 369 |
| 2012-06-01 04:00:00 | 359.5 |
| 2012-06-01 05:00:00 | 374 |
| 2012-06-01 06:00:00 | 366.75 |
| 2012-06-01 07:00:00 | 344.5 |
| 2012-06-01 08:00:00 | 352 |
| 2012-06-01 09:00:00 | 357.5 |
| 2012-06-01 10:00:00 | 355 |
| 2012-06-01 11:00:00 | 359.75 |
| 2012-06-01 12:00:00 | 353 |
| 2012-06-01 13:00:00 | 348.5 |
| 2012-06-01 14:00:00 | 341 |
| 2012-06-01 15:00:00 | 337.5 |
| 2012-06-01 16:00:00 | 344.75 |
| 2012-06-01 17:00:00 | 348.5 |
| 2012-06-01 18:00:00 | 339.75 |
| 2012-06-01 19:00:00 | 342.75 |
| 2012-06-01 20:00:00 | 347.25 |
| 2012-06-01 21:00:00 | 351 |
| 2012-06-01 22:00:00 | 351.75 |
| 2012-06-01 23:00:00 | 363.5 |
| 2012-06-02 | 415.25 |
| 2012-06-02 01:00:00 | 391.75 |
| 2012-06-02 02:00:00 | 383 |
| 2012-06-02 03:00:00 | 377.75 |
| 2012-06-02 04:00:00 | 363.5 |
| 2012-06-02 05:00:00 | 373.75 |
| 2012-06-02 06:00:00 | 381.75 |
| 2012-06-02 07:00:00 | 383 |
| 2012-06-02 08:00:00 | 382.25 |
| 2012-06-02 09:00:00 | 382 |
| 2012-06-02 10:00:00 | 383.25 |
| 2012-06-02 11:00:00 | 396 |
| 2012-06-02 12:00:00 | 419 |
| 2012-06-02 13:00:00 | 390.5 |
| 2012-06-02 14:00:00 | 379.25 |
| 2012-06-02 15:00:00 | 345 |
| 2012-06-02 16:00:00 | 340.75 |
| 2012-06-02 17:00:00 | 339.25 |
| 2012-06-02 18:00:00 | 337.5 |
| 2012-06-02 19:00:00 | 342.75 |
| 2012-06-02 20:00:00 | 339 |
| 2012-06-02 21:00:00 | 340.25 |
| 2012-06-02 22:00:00 | 348.75 |
| 2012-06-02 23:00:00 | 385.25 |
| 2012-06-03 | 402 |
| 2012-06-03 01:00:00 | 388 |
| 2012-06-03 02:00:00 | 378.75 |
| 2012-06-03 03:00:00 | 363.75 |
| 2012-06-03 04:00:00 | 363.75 |
| 2012-06-03 05:00:00 | 377.5 |
| 2012-06-03 06:00:00 | 380 |
| 2012-06-03 07:00:00 | 378.75 |
| 2012-06-03 08:00:00 | 380.25 |
| 2012-06-03 09:00:00 | 382 |
| 2012-06-03 10:00:00 | 399.75 |
| 2012-06-03 11:00:00 | 398 |
| 2012-06-03 12:00:00 | 385.5 |
| 2012-06-03 13:00:00 | 372.5 |
| 2012-06-03 14:00:00 | 347.5 |
| 2012-06-03 15:00:00 | 348.25 |
| 2012-06-03 16:00:00 | 350.25 |
| 2012-06-03 17:00:00 | 361 |
| 2012-06-03 18:00:00 | 351.25 |
| 2012-06-03 19:00:00 | 348.25 |
| 2012-06-03 20:00:00 | 343.25 |
| 2012-06-03 21:00:00 | 341 |
| 2012-06-03 22:00:00 | 346.25 |
| 2012-06-03 23:00:00 | 362 |
| 2012-06-04 | 376.5 |
| 2012-06-04 01:00:00 | 267.5 |
| 2012-06-04 02:00:00 | 344.25 |
| 2012-06-04 03:00:00 | 366.5 |
| 2012-06-04 04:00:00 | 364.25 |
| 2012-06-04 05:00:00 | 377 |
| 2012-06-04 06:00:00 | 359.25 |
| 2012-06-04 07:00:00 | 339.25 |
| 2012-06-04 08:00:00 | 342.5 |
| 2012-06-04 09:00:00 | 349.25 |
| 2012-06-04 10:00:00 | 356 |
| 2012-06-04 11:00:00 | 357 |
| 2012-06-04 12:00:00 | 351.25 |
| 2012-06-04 13:00:00 | 355 |
| 2012-06-04 14:00:00 | 363.5 |
| 2012-06-04 15:00:00 | 379.25 |
| 2012-06-04 16:00:00 | 380 |
| 2012-06-04 17:00:00 | 342.25 |
| 2012-06-04 18:00:00 | 343.75 |
| 2012-06-04 19:00:00 | 346 |
| 2012-06-04 20:00:00 | 347.5 |
| 2012-06-04 21:00:00 | 370.5 |
| 2012-06-04 22:00:00 | 347.75 |
| 2012-06-04 23:00:00 | 372.75 |
| 2012-06-05 | 382 |
| 2012-06-05 01:00:00 | 386 |
| 2012-06-05 02:00:00 | 381.75 |
| 2012-06-05 03:00:00 | 366 |
| 2012-06-05 04:00:00 | 361.5 |
| 2012-06-05 05:00:00 | 388.25 |
| 2012-06-05 06:00:00 | 383.75 |
| 2012-06-05 07:00:00 | 363.75 |
| 2012-06-05 08:00:00 | 346.25 |
| 2012-06-05 09:00:00 | 352.75 |
| 2012-06-05 10:00:00 | 325.25 |
| 2012-06-05 11:00:00 | 345.5 |
| 2012-06-05 12:00:00 | 342 |
| 2012-06-05 13:00:00 | 347.25 |
| 2012-06-05 14:00:00 | 345.25 |
| 2012-06-05 15:00:00 | 354.25 |
| 2012-06-05 16:00:00 | 357.25 |
| 2012-06-05 17:00:00 | 343.25 |
| 2012-06-05 18:00:00 | 341.75 |
| 2012-06-05 19:00:00 | 343.75 |
| 2012-06-05 20:00:00 | 344.25 |
| 2012-06-05 21:00:00 | 349.75 |
| 2012-06-05 22:00:00 | 345.25 |
| 2012-06-05 23:00:00 | 367.5 |
| 2012-06-06 | 369 |
| 2012-06-06 01:00:00 | 383.75 |
| 2012-06-06 02:00:00 | 381.25 |
| 2012-06-06 03:00:00 | 365.25 |
| 2012-06-06 04:00:00 | 364.5 |
| 2012-06-06 05:00:00 | 378.25 |
| 2012-06-06 06:00:00 | 372.5 |
| 2012-06-06 07:00:00 | 373.75 |
| 2012-06-06 08:00:00 | 344.25 |
| 2012-06-06 09:00:00 | 328.75 |
| 2012-06-06 10:00:00 | 335.75 |
| 2012-06-06 11:00:00 | 331.5 |
| 2012-06-06 12:00:00 | 341 |
| 2012-06-06 13:00:00 | 334.75 |
| 2012-06-06 14:00:00 | 331 |
| 2012-06-06 15:00:00 | 269.5 |
| 2012-06-06 16:00:00 | 338 |
| 2012-06-06 17:00:00 | 326.75 |
| 2012-06-06 18:00:00 | 319.5 |
| 2012-06-06 19:00:00 | 315.25 |
| 2012-06-06 20:00:00 | 311.5 |
| 2012-06-06 21:00:00 | 309.75 |
| 2012-06-06 22:00:00 | 317.5 |
| 2012-06-06 23:00:00 | 340.5 |
| 2012-06-07 | 335.25 |
| 2012-06-07 01:00:00 | 347.5 |
| 2012-06-07 02:00:00 | 344.75 |
| 2012-06-07 03:00:00 | 327.25 |
| 2012-06-07 04:00:00 | 333 |
| 2012-06-07 05:00:00 | 330.75 |
| 2012-06-07 06:00:00 | 297.25 |
| 2012-06-07 07:00:00 | 303.25 |
| 2012-06-07 08:00:00 | 315.75 |
| 2012-06-07 09:00:00 | 320.25 |
| 2012-06-07 10:00:00 | 330.25 |
| 2012-06-07 11:00:00 | 325 |
| 2012-06-07 12:00:00 | 324.5 |
| 2012-06-07 13:00:00 | 329.5 |
| 2012-06-07 14:00:00 | 329 |
| 2012-06-07 15:00:00 | 331.75 |
| 2012-06-07 16:00:00 | 327.25 |
| 2012-06-07 17:00:00 | 319.75 |
| 2012-06-07 18:00:00 | 320 |
| 2012-06-07 19:00:00 | 316 |
| 2012-06-07 20:00:00 | 317 |
| 2012-06-07 21:00:00 | 312.75 |
| 2012-06-07 22:00:00 | 322 |
| 2012-06-07 23:00:00 | 345.75 |
| 2012-06-08 | 351 |
| 2012-06-08 01:00:00 | 351.75 |
| 2012-06-08 02:00:00 | 347.25 |
| 2012-06-08 03:00:00 | 331.25 |
| 2012-06-08 04:00:00 | 330.5 |
| 2012-06-08 05:00:00 | 317.25 |
| 2012-06-08 06:00:00 | 307 |
| 2012-06-08 07:00:00 | 309.5 |
| 2012-06-08 08:00:00 | 314.25 |
| 2012-06-08 09:00:00 | 326 |
| 2012-06-08 10:00:00 | 324.75 |
| 2012-06-08 11:00:00 | 325 |
| 2012-06-08 12:00:00 | 323.75 |
| 2012-06-08 13:00:00 | 332.25 |
| 2012-06-08 14:00:00 | 334 |
| 2012-06-08 15:00:00 | 336.75 |
| 2012-06-08 16:00:00 | 341.75 |
| 2012-06-08 17:00:00 | 322.75 |
| 2012-06-08 18:00:00 | 313 |
| 2012-06-08 19:00:00 | 313.75 |
| 2012-06-08 20:00:00 | 317.25 |
| 2012-06-08 21:00:00 | 315 |
| 2012-06-08 22:00:00 | 330.25 |
| 2012-06-08 23:00:00 | 343.5 |
| 2012-06-09 | 339.75 |
| 2012-06-09 01:00:00 | 359.5 |
| 2012-06-09 02:00:00 | 357 |
| 2012-06-09 03:00:00 | 338.25 |
| 2012-06-09 04:00:00 | 337.25 |
| 2012-06-09 05:00:00 | 353.75 |
| 2012-06-09 06:00:00 | 358.25 |
| 2012-06-09 07:00:00 | 357 |
| 2012-06-09 08:00:00 | 367.25 |
| 2012-06-09 09:00:00 | 331 |
| 2012-06-09 10:00:00 | 327.75 |
| 2012-06-09 11:00:00 | 317.75 |
| 2012-06-09 12:00:00 | 318.75 |
| 2012-06-09 13:00:00 | 322.75 |
| 2012-06-09 14:00:00 | 319.5 |
| 2012-06-09 15:00:00 | 323 |
| 2012-06-09 16:00:00 | 320.75 |
| 2012-06-09 17:00:00 | 313.75 |
| 2012-06-09 18:00:00 | 316 |
| 2012-06-09 19:00:00 | 316.25 |
| 2012-06-09 20:00:00 | 316.25 |
| 2012-06-09 21:00:00 | 323 |
| 2012-06-09 22:00:00 | 321.25 |
| 2012-06-09 23:00:00 | 350.5 |
| 2012-06-10 | 368.25 |
| 2012-06-10 01:00:00 | 361.25 |
| 2012-06-10 02:00:00 | 360.25 |
| 2012-06-10 03:00:00 | 348.75 |
| 2012-06-10 04:00:00 | 343.75 |
| 2012-06-10 05:00:00 | 342.75 |
| 2012-06-10 06:00:00 | 348.5 |
| 2012-06-10 07:00:00 | 355.25 |
| 2012-06-10 08:00:00 | 355.75 |
| 2012-06-10 09:00:00 | 366.25 |
| 2012-06-10 10:00:00 | 378 |
| 2012-06-10 11:00:00 | 374.5 |
| 2012-06-10 12:00:00 | 365.25 |
| 2012-06-10 13:00:00 | 325 |
| 2012-06-10 14:00:00 | 321 |
| 2012-06-10 15:00:00 | 315.25 |
| 2012-06-10 16:00:00 | 313.5 |
| 2012-06-10 17:00:00 | 315.5 |
| 2012-06-10 18:00:00 | 321.5 |
| 2012-06-10 19:00:00 | 323.5 |
| 2012-06-10 20:00:00 | 323 |
| 2012-06-10 21:00:00 | 325 |
| 2012-06-10 22:00:00 | 329.25 |
| 2012-06-10 23:00:00 | 346.75 |
| 2012-06-11 | 340.25 |
| 2012-06-11 01:00:00 | 360 |
| 2012-06-11 02:00:00 | 357.5 |
| 2012-06-11 03:00:00 | 342 |
| 2012-06-11 04:00:00 | 344.25 |
| 2012-06-11 05:00:00 | 351.25 |
| 2012-06-11 06:00:00 | 354.75 |
| 2012-06-11 07:00:00 | 359.75 |
| 2012-06-11 08:00:00 | 345.5 |
| 2012-06-11 09:00:00 | 339 |
| 2012-06-11 10:00:00 | 337.25 |
| 2012-06-11 11:00:00 | 336.75 |
| 2012-06-11 12:00:00 | 343.25 |
| 2012-06-11 13:00:00 | 359 |
| 2012-06-11 14:00:00 | 391.25 |
| 2012-06-11 15:00:00 | 373 |
| 2012-06-11 16:00:00 | 352.75 |
| 2012-06-11 17:00:00 | 349 |
| 2012-06-11 18:00:00 | 344.75 |
| 2012-06-11 19:00:00 | 344 |
| 2012-06-11 20:00:00 | 342.75 |
| 2012-06-11 21:00:00 | 336 |
| 2012-06-11 22:00:00 | 346.25 |
| 2012-06-11 23:00:00 | 356.25 |
| 2012-06-12 | 362.5 |
| 2012-06-12 01:00:00 | 382.75 |
| 2012-06-12 02:00:00 | 377 |
| 2012-06-12 03:00:00 | 361.5 |
| 2012-06-12 04:00:00 | 362.75 |
| 2012-06-12 05:00:00 | 368 |
| 2012-06-12 06:00:00 | 362.25 |
| 2012-06-12 07:00:00 | 338.25 |
| 2012-06-12 08:00:00 | 346.25 |
| 2012-06-12 09:00:00 | 340.75 |
| 2012-06-12 10:00:00 | 352.5 |
| 2012-06-12 11:00:00 | 368.5 |
| 2012-06-12 12:00:00 | 354 |
| 2012-06-12 13:00:00 | 351.75 |
| 2012-06-12 14:00:00 | 349.25 |
| 2012-06-12 15:00:00 | 353.5 |
| 2012-06-12 16:00:00 | 347 |
| 2012-06-12 17:00:00 | 336 |
| 2012-06-12 18:00:00 | 335.25 |
| 2012-06-12 19:00:00 | 335 |
| 2012-06-12 20:00:00 | 336.25 |
| 2012-06-12 21:00:00 | 338.75 |
| 2012-06-12 22:00:00 | 344.25 |
| 2012-06-12 23:00:00 | 360.5 |
| 2012-06-13 | 381.25 |
| 2012-06-13 01:00:00 | 383 |
| 2012-06-13 02:00:00 | 375.75 |
| 2012-06-13 03:00:00 | 360.5 |
| 2012-06-13 04:00:00 | 358 |
| 2012-06-13 05:00:00 | 368 |
| 2012-06-13 06:00:00 | 360 |
| 2012-06-13 07:00:00 | 343 |
| 2012-06-13 08:00:00 | 353 |
| 2012-06-13 09:00:00 | 358.5 |
| 2012-06-13 10:00:00 | 360 |
| 2012-06-13 11:00:00 | 355 |
| 2012-06-13 12:00:00 | 340.5 |
| 2012-06-13 13:00:00 | 336.25 |
| 2012-06-13 14:00:00 | 335.25 |
| 2012-06-13 15:00:00 | 342.75 |
| 2012-06-13 16:00:00 | 342.5 |
| 2012-06-13 17:00:00 | 345 |
| 2012-06-13 18:00:00 | 346.25 |
| 2012-06-13 19:00:00 | 352 |
| 2012-06-13 20:00:00 | 347.5 |
| 2012-06-13 21:00:00 | 343.75 |
| 2012-06-13 22:00:00 | 344.25 |
| 2012-06-13 23:00:00 | 350 |
| 2012-06-14 | 366 |
| 2012-06-14 01:00:00 | 390.25 |
| 2012-06-14 02:00:00 | 383.75 |
| 2012-06-14 03:00:00 | 381.5 |
| 2012-06-14 04:00:00 | 377.25 |
| 2012-06-14 05:00:00 | 385 |
| 2012-06-14 06:00:00 | 353.5 |
| 2012-06-14 07:00:00 | 345.25 |
| 2012-06-14 08:00:00 | 349.5 |
| 2012-06-14 09:00:00 | 349.75 |
| 2012-06-14 10:00:00 | 353.75 |
| 2012-06-14 11:00:00 | 346 |
| 2012-06-14 12:00:00 | 346.25 |
| 2012-06-14 13:00:00 | 351.5 |
| 2012-06-14 14:00:00 | 344.5 |
| 2012-06-14 15:00:00 | 347.25 |
| 2012-06-14 16:00:00 | 344.75 |
| 2012-06-14 17:00:00 | 340.75 |
| 2012-06-14 18:00:00 | 333.25 |
| 2012-06-14 19:00:00 | 342.25 |
| 2012-06-14 20:00:00 | 336.25 |
| 2012-06-14 21:00:00 | 333.75 |
| 2012-06-14 22:00:00 | 337 |
| 2012-06-14 23:00:00 | 360 |
| 2012-06-15 | 368.25 |
| 2012-06-15 01:00:00 | 374 |
| 2012-06-15 02:00:00 | 370.25 |
| 2012-06-15 03:00:00 | 354.5 |
| 2012-06-15 04:00:00 | 353.5 |
| 2012-06-15 05:00:00 | 377.5 |
| 2012-06-15 06:00:00 | 338 |
| 2012-06-15 07:00:00 | 339 |
| 2012-06-15 08:00:00 | 340.25 |
| 2012-06-15 09:00:00 | 344.25 |
| 2012-06-15 10:00:00 | 350.75 |
| 2012-06-15 11:00:00 | 345.5 |
| 2012-06-15 12:00:00 | 339.25 |
| 2012-06-15 13:00:00 | 345.5 |
| 2012-06-15 14:00:00 | 345.25 |
| 2012-06-15 15:00:00 | 351 |
| 2012-06-15 16:00:00 | 348 |
| 2012-06-15 17:00:00 | 340.75 |
| 2012-06-15 18:00:00 | 337.25 |
| 2012-06-15 19:00:00 | 337.5 |
| 2012-06-15 20:00:00 | 339.75 |
| 2012-06-15 21:00:00 | 337 |
| 2012-06-15 22:00:00 | 340 |
| 2012-06-15 23:00:00 | 364.5 |
| 2012-06-16 | 377 |
| 2012-06-16 01:00:00 | 375.5 |
| 2012-06-16 02:00:00 | 373.75 |
| 2012-06-16 03:00:00 | 357.75 |
| 2012-06-16 04:00:00 | 359.75 |
| 2012-06-16 05:00:00 | 359 |
| 2012-06-16 06:00:00 | 367.5 |
| 2012-06-16 07:00:00 | 375.75 |
| 2012-06-16 08:00:00 | 384.25 |
| 2012-06-16 09:00:00 | 391 |
| 2012-06-16 10:00:00 | 391.75 |
| 2012-06-16 11:00:00 | 371.25 |
| 2012-06-16 12:00:00 | 329.75 |
| 2012-06-16 13:00:00 | 335.25 |
| 2012-06-16 14:00:00 | 335.75 |
| 2012-06-16 15:00:00 | 339 |
| 2012-06-16 16:00:00 | 336.75 |
| 2012-06-16 17:00:00 | 335 |
| 2012-06-16 18:00:00 | 339.75 |
| 2012-06-16 19:00:00 | 340.75 |
| 2012-06-16 20:00:00 | 337 |
| 2012-06-16 21:00:00 | 336.5 |
| 2012-06-16 22:00:00 | 343 |
| 2012-06-16 23:00:00 | 358.25 |
| 2012-06-17 | 375.5 |
| 2012-06-17 01:00:00 | 376.75 |
| 2012-06-17 02:00:00 | 368.5 |
| 2012-06-17 03:00:00 | 353.25 |
| 2012-06-17 04:00:00 | 359.5 |
| 2012-06-17 05:00:00 | 359.75 |
| 2012-06-17 06:00:00 | 371.5 |
| 2012-06-17 07:00:00 | 382 |
| 2012-06-17 08:00:00 | 385.75 |
| 2012-06-17 09:00:00 | 398.5 |
| 2012-06-17 10:00:00 | 393.25 |
| 2012-06-17 11:00:00 | 386.75 |
| 2012-06-17 12:00:00 | 368.25 |
| 2012-06-17 13:00:00 | 336.75 |
| 2012-06-17 14:00:00 | 333.5 |
| 2012-06-17 15:00:00 | 333.75 |
| 2012-06-17 16:00:00 | 335.5 |
| 2012-06-17 17:00:00 | 335 |
| 2012-06-17 18:00:00 | 336.25 |
| 2012-06-17 19:00:00 | 336.5 |
| 2012-06-17 20:00:00 | 338.75 |
| 2012-06-17 21:00:00 | 334.75 |
| 2012-06-17 22:00:00 | 343.25 |
| 2012-06-17 23:00:00 | 343.25 |
| 2012-06-18 | 355.75 |
| 2012-06-18 01:00:00 | 363.75 |
| 2012-06-18 02:00:00 | 362.5 |
| 2012-06-18 03:00:00 | 352.5 |
| 2012-06-18 04:00:00 | 345.75 |
| 2012-06-18 05:00:00 | 342.75 |
| 2012-06-18 06:00:00 | 329 |
| 2012-06-18 07:00:00 | 316.5 |
| 2012-06-18 08:00:00 | 327 |
| 2012-06-18 09:00:00 | 339.5 |
| 2012-06-18 10:00:00 | 349 |
| 2012-06-18 11:00:00 | 342.75 |
| 2012-06-18 12:00:00 | 321.25 |
| 2012-06-18 13:00:00 | 330.25 |
| 2012-06-18 14:00:00 | 370.25 |
| 2012-06-18 15:00:00 | 373 |
| 2012-06-18 16:00:00 | 343.25 |
| 2012-06-18 17:00:00 | 327.75 |
| 2012-06-18 18:00:00 | 318.5 |
| 2012-06-18 19:00:00 | 320 |
| 2012-06-18 20:00:00 | 319.25 |
| 2012-06-18 21:00:00 | 323.75 |
| 2012-06-18 22:00:00 | 328.25 |
| 2012-06-18 23:00:00 | 344.25 |
| 2012-06-19 | 352.75 |
| 2012-06-19 01:00:00 | 340.25 |
| 2012-06-19 02:00:00 | 357 |
| 2012-06-19 03:00:00 | 349.25 |
| 2012-06-19 04:00:00 | 346 |
| 2012-06-19 05:00:00 | 351.5 |
| 2012-06-19 06:00:00 | 327.25 |
| 2012-06-19 07:00:00 | 319.25 |
| 2012-06-19 08:00:00 | 301 |
| 2012-06-19 09:00:00 | 281 |
| 2012-06-19 10:00:00 | 288.5 |
| 2012-06-19 11:00:00 | 289.5 |
| 2012-06-19 12:00:00 | 280.5 |
| 2012-06-19 13:00:00 | 286 |
| 2012-06-19 14:00:00 | 280.5 |
| 2012-06-19 15:00:00 | 286 |
| 2012-06-19 16:00:00 | 318 |
| 2012-06-19 17:00:00 | 343 |
| 2012-06-19 18:00:00 | 341.25 |
| 2012-06-19 19:00:00 | 340.25 |
| 2012-06-19 20:00:00 | 338.5 |
| 2012-06-19 21:00:00 | 333 |
| 2012-06-19 22:00:00 | 336.25 |
| 2012-06-19 23:00:00 | 368.25 |
| 2012-06-20 | 358.75 |
| 2012-06-20 01:00:00 | 379 |
| 2012-06-20 02:00:00 | 376.75 |
| 2012-06-20 03:00:00 | 358.75 |
| 2012-06-20 04:00:00 | 358.75 |
| 2012-06-20 05:00:00 | 366.75 |
| 2012-06-20 06:00:00 | 338.5 |
| 2012-06-20 07:00:00 | 333.75 |
| 2012-06-20 08:00:00 | 335.25 |
| 2012-06-20 09:00:00 | 341.75 |
| 2012-06-20 10:00:00 | 341.25 |
| 2012-06-20 11:00:00 | 345.25 |
| 2012-06-20 12:00:00 | 343.25 |
| 2012-06-20 13:00:00 | 342 |
| 2012-06-20 14:00:00 | 338 |
| 2012-06-20 15:00:00 | 337 |
| 2012-06-20 16:00:00 | 334 |
| 2012-06-20 17:00:00 | 339.5 |
| 2012-06-20 18:00:00 | 331.25 |
| 2012-06-20 19:00:00 | 332.5 |
| 2012-06-20 20:00:00 | 332.75 |
| 2012-06-20 21:00:00 | 334 |
| 2012-06-20 22:00:00 | 343 |
| 2012-06-20 23:00:00 | 365.75 |
| 2012-06-21 | 366.25 |
| 2012-06-21 01:00:00 | 372.75 |
| 2012-06-21 02:00:00 | 366.75 |
| 2012-06-21 03:00:00 | 352.75 |
| 2012-06-21 04:00:00 | 352.25 |
| 2012-06-21 05:00:00 | 369.5 |
| 2012-06-21 06:00:00 | 355.5 |
| 2012-06-21 07:00:00 | 337.75 |
| 2012-06-21 08:00:00 | 313.25 |
| 2012-06-21 09:00:00 | 349.5 |
| 2012-06-21 10:00:00 | 343.75 |
| 2012-06-21 11:00:00 | 338.5 |
| 2012-06-21 12:00:00 | 330 |
| 2012-06-21 13:00:00 | 325 |
| 2012-06-21 14:00:00 | 319.5 |
| 2012-06-21 15:00:00 | 316.25 |
| 2012-06-21 16:00:00 | 325 |
| 2012-06-21 17:00:00 | 314.5 |
| 2012-06-21 18:00:00 | 319.25 |
| 2012-06-21 19:00:00 | 324 |
| 2012-06-21 20:00:00 | 321 |
| 2012-06-21 21:00:00 | 327.5 |
| 2012-06-21 22:00:00 | 337.25 |
| 2012-06-21 23:00:00 | 347 |
| 2012-06-22 | 366 |
| 2012-06-22 01:00:00 | 369 |
| 2012-06-22 02:00:00 | 352.5 |
| 2012-06-22 03:00:00 | 338.5 |
| 2012-06-22 04:00:00 | 339.75 |
| 2012-06-22 05:00:00 | 366.25 |
| 2012-06-22 06:00:00 | 349.5 |
| 2012-06-22 07:00:00 | 330.75 |
| 2012-06-22 08:00:00 | 335.25 |
| 2012-06-22 09:00:00 | 337.25 |
| 2012-06-22 10:00:00 | 343.25 |
| 2012-06-22 11:00:00 | 347 |
| 2012-06-22 12:00:00 | 339.5 |
| 2012-06-22 13:00:00 | 340.5 |
| 2012-06-22 14:00:00 | 333.75 |
| 2012-06-22 15:00:00 | 335 |
| 2012-06-22 16:00:00 | 340.75 |
| 2012-06-22 17:00:00 | 323.75 |
| 2012-06-22 18:00:00 | 329.5 |
| 2012-06-22 19:00:00 | 334.5 |
| 2012-06-22 20:00:00 | 325.75 |
| 2012-06-22 21:00:00 | 338 |
| 2012-06-22 22:00:00 | 345.75 |
| 2012-06-22 23:00:00 | 351.75 |
| 2012-06-23 | 364.75 |
| 2012-06-23 01:00:00 | 367.25 |
| 2012-06-23 02:00:00 | 357.75 |
| 2012-06-23 03:00:00 | 356.25 |
| 2012-06-23 04:00:00 | 354.75 |
| 2012-06-23 05:00:00 | 377.5 |
| 2012-06-23 06:00:00 | 380.25 |
| 2012-06-23 07:00:00 | 343.5 |
| 2012-06-23 08:00:00 | 376 |
| 2012-06-23 09:00:00 | 376 |
| 2012-06-23 10:00:00 | 337.75 |
| 2012-06-23 11:00:00 | 342.75 |
| 2012-06-23 12:00:00 | 341.75 |
| 2012-06-23 13:00:00 | 334.75 |
| 2012-06-23 14:00:00 | 334 |
| 2012-06-23 15:00:00 | 329.25 |
| 2012-06-23 16:00:00 | 327.75 |
| 2012-06-23 17:00:00 | 331.5 |
| 2012-06-23 18:00:00 | 331 |
| 2012-06-23 19:00:00 | 330 |
| 2012-06-23 20:00:00 | 331.5 |
| 2012-06-23 21:00:00 | 361.75 |
| 2012-06-23 22:00:00 | 405.75 |
| 2012-06-23 23:00:00 | 395.25 |
| 2012-06-24 | 391.75 |
| 2012-06-24 01:00:00 | 367.5 |
| 2012-06-24 02:00:00 | 362.75 |
| 2012-06-24 03:00:00 | 363 |
| 2012-06-24 04:00:00 | 358 |
| 2012-06-24 05:00:00 | 367.25 |
| 2012-06-24 06:00:00 | 373.25 |
| 2012-06-24 07:00:00 | 375.25 |
| 2012-06-24 08:00:00 | 377.25 |
| 2012-06-24 09:00:00 | 384.75 |
| 2012-06-24 10:00:00 | 388.5 |
| 2012-06-24 11:00:00 | 377.75 |
| 2012-06-24 12:00:00 | 376 |
| 2012-06-24 13:00:00 | 386 |
| 2012-06-24 14:00:00 | 381.5 |
| 2012-06-24 15:00:00 | 380.25 |
| 2012-06-24 16:00:00 | 386.5 |
| 2012-06-24 17:00:00 | 374 |
| 2012-06-24 18:00:00 | 371.25 |
| 2012-06-24 19:00:00 | 374.25 |
| 2012-06-24 20:00:00 | 375.5 |
| 2012-06-24 21:00:00 | 387.5 |
| 2012-06-24 22:00:00 | 391 |
| 2012-06-24 23:00:00 | 386 |
| 2012-06-25 | 385.25 |
| 2012-06-25 01:00:00 | 365.5 |
| 2012-06-25 02:00:00 | 356.5 |
| 2012-06-25 03:00:00 | 359.5 |
| 2012-06-25 04:00:00 | 353.5 |
| 2012-06-25 05:00:00 | 351.25 |
| 2012-06-25 06:00:00 | 361 |
| 2012-06-25 07:00:00 | 333.5 |
| 2012-06-25 08:00:00 | 340.5 |
| 2012-06-25 09:00:00 | 337.75 |
| 2012-06-25 10:00:00 | 330.25 |
| 2012-06-25 11:00:00 | 334.25 |
| 2012-06-25 12:00:00 | 348.5 |
| 2012-06-25 13:00:00 | 350.25 |
| 2012-06-25 14:00:00 | 380.5 |
| 2012-06-25 15:00:00 | 386.25 |
| 2012-06-25 16:00:00 | 346.75 |
| 2012-06-25 17:00:00 | 327.25 |
| 2012-06-25 18:00:00 | 329.5 |
| 2012-06-25 19:00:00 | 324 |
| 2012-06-25 20:00:00 | 326 |
| 2012-06-25 21:00:00 | 324.25 |
| 2012-06-25 22:00:00 | 332.25 |
| 2012-06-25 23:00:00 | 348.25 |
| 2012-06-26 | 367.5 |
| 2012-06-26 01:00:00 | 387.25 |
| 2012-06-26 02:00:00 | 371.75 |
| 2012-06-26 03:00:00 | 353 |
| 2012-06-26 04:00:00 | 352 |
| 2012-06-26 05:00:00 | 332.75 |
| 2012-06-26 06:00:00 | 320.25 |
| 2012-06-26 07:00:00 | 328.75 |
| 2012-06-26 08:00:00 | 338.75 |
| 2012-06-26 09:00:00 | 345.25 |
| 2012-06-26 10:00:00 | 337 |
| 2012-06-26 11:00:00 | 344.75 |
| 2012-06-26 12:00:00 | 345 |
| 2012-06-26 13:00:00 | 336 |
| 2012-06-26 14:00:00 | 338 |
| 2012-06-26 15:00:00 | 340.25 |
| 2012-06-26 16:00:00 | 339 |
| 2012-06-26 17:00:00 | 335.25 |
| 2012-06-26 18:00:00 | 340.25 |
| 2012-06-26 19:00:00 | 327.5 |
| 2012-06-26 20:00:00 | 326 |
| 2012-06-26 21:00:00 | 328.5 |
| 2012-06-26 22:00:00 | 336.5 |
| 2012-06-26 23:00:00 | 349.5 |
| 2012-06-27 | 357.75 |
| 2012-06-27 01:00:00 | 386.75 |
| 2012-06-27 02:00:00 | 388.75 |
| 2012-06-27 03:00:00 | 365.25 |
| 2012-06-27 04:00:00 | 369 |
| 2012-06-27 05:00:00 | 353.5 |
| 2012-06-27 06:00:00 | 329.75 |
| 2012-06-27 07:00:00 | 334.75 |
| 2012-06-27 08:00:00 | 336 |
| 2012-06-27 09:00:00 | 342.25 |
| 2012-06-27 10:00:00 | 344.5 |
| 2012-06-27 11:00:00 | 340.5 |
| 2012-06-27 12:00:00 | 329 |
| 2012-06-27 13:00:00 | 338.5 |
| 2012-06-27 14:00:00 | 330 |
| 2012-06-27 15:00:00 | 332.75 |
| 2012-06-27 16:00:00 | 344.5 |
| 2012-06-27 17:00:00 | 332.5 |
| 2012-06-27 18:00:00 | 328.25 |
| 2012-06-27 19:00:00 | 329.75 |
| 2012-06-27 20:00:00 | 330.75 |
| 2012-06-27 21:00:00 | 333.25 |
| 2012-06-27 22:00:00 | 334 |
| 2012-06-27 23:00:00 | 262.5 |
| 2012-06-28 | 418.25 |
| 2012-06-28 01:00:00 | 395.75 |
| 2012-06-28 02:00:00 | 379.5 |
| 2012-06-28 03:00:00 | 359 |
| 2012-06-28 04:00:00 | 354.25 |
| 2012-06-28 05:00:00 | 367.75 |
| 2012-06-28 06:00:00 | 359.25 |
| 2012-06-28 07:00:00 | 333.25 |
| 2012-06-28 08:00:00 | 337 |
| 2012-06-28 09:00:00 | 334.25 |
| 2012-06-28 10:00:00 | 351.5 |
| 2012-06-28 11:00:00 | 347 |
| 2012-06-28 12:00:00 | 341 |
| 2012-06-28 13:00:00 | 334 |
| 2012-06-28 14:00:00 | 324 |
| 2012-06-28 15:00:00 | 319.75 |
| 2012-06-28 16:00:00 | 327.5 |
| 2012-06-28 17:00:00 | 333.25 |
| 2012-06-28 18:00:00 | 327.75 |
| 2012-06-28 19:00:00 | 331.5 |
| 2012-06-28 20:00:00 | 326.75 |
| 2012-06-28 21:00:00 | 321.25 |
| 2012-06-28 22:00:00 | 329.75 |
| 2012-06-28 23:00:00 | 346.25 |
| 2012-06-29 | 352.25 |
| 2012-06-29 01:00:00 | 369.5 |
| 2012-06-29 02:00:00 | 367.5 |
| 2012-06-29 03:00:00 | 352.25 |
| 2012-06-29 04:00:00 | 348.25 |
| 2012-06-29 05:00:00 | 358.5 |
| 2012-06-29 06:00:00 | 352.75 |
| 2012-06-29 07:00:00 | 331.25 |
| 2012-06-29 08:00:00 | 337.75 |
| 2012-06-29 09:00:00 | 338 |
| 2012-06-29 10:00:00 | 340 |
| 2012-06-29 11:00:00 | 346.25 |
| 2012-06-29 12:00:00 | 335.25 |
| 2012-06-29 13:00:00 | 328.75 |
| 2012-06-29 14:00:00 | 317.25 |
| 2012-06-29 15:00:00 | 317.5 |
| 2012-06-29 16:00:00 | 317.5 |
| 2012-06-29 17:00:00 | 325.75 |
| 2012-06-29 18:00:00 | 326 |
| 2012-06-29 19:00:00 | 335 |
| 2012-06-29 20:00:00 | 344 |
| 2012-06-29 21:00:00 | 336.75 |
| 2012-06-29 22:00:00 | 344.75 |
| 2012-06-29 23:00:00 | 352 |
| 2012-06-30 | 362.75 |
| 2012-06-30 01:00:00 | 386.5 |
| 2012-06-30 02:00:00 | 374.25 |
| 2012-06-30 03:00:00 | 357.25 |
| 2012-06-30 04:00:00 | 357.75 |
| 2012-06-30 05:00:00 | 363.5 |
| 2012-06-30 06:00:00 | 370 |
| 2012-06-30 07:00:00 | 375 |
| 2012-06-30 08:00:00 | 373.5 |
| 2012-06-30 09:00:00 | 376.5 |
| 2012-06-30 10:00:00 | 372 |
| 2012-06-30 11:00:00 | 368 |
| 2012-06-30 12:00:00 | 367.5 |
| 2012-06-30 13:00:00 | 373.5 |
| 2012-06-30 14:00:00 | 381.25 |
| 2012-06-30 15:00:00 | 371.5 |
| 2012-06-30 16:00:00 | 329 |
| 2012-06-30 17:00:00 | 319 |
| 2012-06-30 18:00:00 | 321.5 |
| 2012-06-30 19:00:00 | 322 |
| 2012-06-30 20:00:00 | 322.25 |
| 2012-06-30 21:00:00 | 321.75 |
| 2012-06-30 22:00:00 | 341.25 |
| 2012-06-30 23:00:00 | 344.25 |
| 2012-07-01 | 365 |
| 2012-07-01 01:00:00 | 383.75 |
| 2012-07-01 02:00:00 | 362.75 |
| 2012-07-01 03:00:00 | 356.5 |
| 2012-07-01 04:00:00 | 358.5 |
| 2012-07-01 05:00:00 | 363 |
| 2012-07-01 06:00:00 | 372 |
| 2012-07-01 07:00:00 | 368.75 |
| 2012-07-01 08:00:00 | 364.5 |
| 2012-07-01 09:00:00 | 367.5 |
| 2012-07-01 10:00:00 | 378 |
| 2012-07-01 11:00:00 | 380.5 |
| 2012-07-01 12:00:00 | 368.5 |
| 2012-07-01 13:00:00 | 327 |
| 2012-07-01 14:00:00 | 323.25 |
| 2012-07-01 15:00:00 | 324.25 |
| 2012-07-01 16:00:00 | 327 |
| 2012-07-01 17:00:00 | 329.75 |
| 2012-07-01 18:00:00 | 324.75 |
| 2012-07-01 19:00:00 | 335.5 |
| 2012-07-01 20:00:00 | 322.5 |
| 2012-07-01 21:00:00 | 320.75 |
| 2012-07-01 22:00:00 | 328.5 |
| 2012-07-01 23:00:00 | 344.5 |
| 2012-07-02 | 355.75 |
| 2012-07-02 01:00:00 | 372.5 |
| 2012-07-02 02:00:00 | 369.25 |
| 2012-07-02 03:00:00 | 357.25 |
| 2012-07-02 04:00:00 | 354.75 |
| 2012-07-02 05:00:00 | 365.75 |
| 2012-07-02 06:00:00 | 353.5 |
| 2012-07-02 07:00:00 | 329.25 |
| 2012-07-02 08:00:00 | 339.75 |
| 2012-07-02 09:00:00 | 343 |
| 2012-07-02 10:00:00 | 330.5 |
| 2012-07-02 11:00:00 | 327.75 |
| 2012-07-02 12:00:00 | 327.25 |
| 2012-07-02 13:00:00 | 327 |
| 2012-07-02 14:00:00 | 315 |
| 2012-07-02 15:00:00 | 310.25 |
| 2012-07-02 16:00:00 | 315 |
| 2012-07-02 17:00:00 | 312.75 |
| 2012-07-02 18:00:00 | 324.5 |
| 2012-07-02 19:00:00 | 329.75 |
| 2012-07-02 20:00:00 | 329.75 |
| 2012-07-02 21:00:00 | 361.75 |
| 2012-07-02 22:00:00 | 342.5 |
| 2012-07-02 23:00:00 | 357.75 |
| 2012-07-03 | 350.25 |
| 2012-07-03 01:00:00 | 374 |
| 2012-07-03 02:00:00 | 369.5 |
| 2012-07-03 03:00:00 | 355.25 |
| 2012-07-03 04:00:00 | 355 |
| 2012-07-03 05:00:00 | 382.25 |
| 2012-07-03 06:00:00 | 332.75 |
| 2012-07-03 07:00:00 | 332.25 |
| 2012-07-03 08:00:00 | 334 |
| 2012-07-03 09:00:00 | 339.25 |
| 2012-07-03 10:00:00 | 336.5 |
| 2012-07-03 11:00:00 | 339.75 |
| 2012-07-03 12:00:00 | 342.75 |
| 2012-07-03 13:00:00 | 330.25 |
| 2012-07-03 14:00:00 | 326 |
| 2012-07-03 15:00:00 | 325 |
| 2012-07-03 16:00:00 | 335.25 |
| 2012-07-03 17:00:00 | 326.75 |
| 2012-07-03 18:00:00 | 324.5 |
| 2012-07-03 19:00:00 | 330.5 |
| 2012-07-03 20:00:00 | 331 |
| 2012-07-03 21:00:00 | 370 |
| 2012-07-03 22:00:00 | 354.25 |
| 2012-07-03 23:00:00 | 356 |
| 2012-07-04 | 346 |
| 2012-07-04 01:00:00 | 375.25 |
| 2012-07-04 02:00:00 | 374.25 |
| 2012-07-04 03:00:00 | 356.75 |
| 2012-07-04 04:00:00 | 361.25 |
| 2012-07-04 05:00:00 | 379.5 |
| 2012-07-04 06:00:00 | 380.25 |
| 2012-07-04 07:00:00 | 390.25 |
| 2012-07-04 08:00:00 | 378.75 |
| 2012-07-04 09:00:00 | 327.5 |
| 2012-07-04 10:00:00 | 326.75 |
| 2012-07-04 11:00:00 | 325.75 |
| 2012-07-04 12:00:00 | 328.25 |
| 2012-07-04 13:00:00 | 325.5 |
| 2012-07-04 14:00:00 | 324.25 |
| 2012-07-04 15:00:00 | 333.5 |
| 2012-07-04 16:00:00 | 339 |
| 2012-07-04 17:00:00 | 329.5 |
| 2012-07-04 18:00:00 | 329 |
| 2012-07-04 19:00:00 | 332 |
| 2012-07-04 20:00:00 | 334.25 |
| 2012-07-04 21:00:00 | 334.25 |
| 2012-07-04 22:00:00 | 341 |
| 2012-07-04 23:00:00 | 403 |
| 2012-07-05 | 397.5 |
| 2012-07-05 01:00:00 | 373.25 |
| 2012-07-05 02:00:00 | 372.25 |
| 2012-07-05 03:00:00 | 354 |
| 2012-07-05 04:00:00 | 355 |
| 2012-07-05 05:00:00 | 354.5 |
| 2012-07-05 06:00:00 | 364.5 |
| 2012-07-05 07:00:00 | 365 |
| 2012-07-05 08:00:00 | 364.75 |
| 2012-07-05 09:00:00 | 362.25 |
| 2012-07-05 10:00:00 | 373.25 |
| 2012-07-05 11:00:00 | 364.75 |
| 2012-07-05 12:00:00 | 373 |
| 2012-07-05 13:00:00 | 346.25 |
| 2012-07-05 14:00:00 | 326 |
| 2012-07-05 15:00:00 | 332.75 |
| 2012-07-05 16:00:00 | 329.75 |
| 2012-07-05 17:00:00 | 310.75 |
| 2012-07-05 18:00:00 | 325 |
| 2012-07-05 19:00:00 | 325.5 |
| 2012-07-05 20:00:00 | 328 |
| 2012-07-05 21:00:00 | 325.5 |
| 2012-07-05 22:00:00 | 330.5 |
| 2012-07-05 23:00:00 | 346.75 |
| 2012-07-06 | 374.75 |
| 2012-07-06 01:00:00 | 371.25 |
| 2012-07-06 02:00:00 | 369.25 |
| 2012-07-06 03:00:00 | 371 |
| 2012-07-06 04:00:00 | 351 |
| 2012-07-06 05:00:00 | 355.25 |
| 2012-07-06 06:00:00 | 364.25 |
| 2012-07-06 07:00:00 | 374 |
| 2012-07-06 08:00:00 | 377.75 |
| 2012-07-06 09:00:00 | 374.25 |
| 2012-07-06 10:00:00 | 363.25 |
| 2012-07-06 11:00:00 | 342 |
| 2012-07-06 12:00:00 | 331.25 |
| 2012-07-06 13:00:00 | 335.25 |
| 2012-07-06 14:00:00 | 334.25 |
| 2012-07-06 15:00:00 | 325.5 |
| 2012-07-06 16:00:00 | 329.75 |
| 2012-07-06 17:00:00 | 322.25 |
| 2012-07-06 18:00:00 | 322.25 |
| 2012-07-06 19:00:00 | 322.75 |
| 2012-07-06 20:00:00 | 323.25 |
| 2012-07-06 21:00:00 | 328 |
| 2012-07-06 22:00:00 | 335 |
| 2012-07-06 23:00:00 | 359.5 |
| 2012-07-07 | 346.5 |
| 2012-07-07 01:00:00 | 368 |
| 2012-07-07 02:00:00 | 366 |
| 2012-07-07 03:00:00 | 350.25 |
| 2012-07-07 04:00:00 | 348.5 |
| 2012-07-07 05:00:00 | 362.25 |
| 2012-07-07 06:00:00 | 363 |
| 2012-07-07 07:00:00 | 360.75 |
| 2012-07-07 08:00:00 | 372.5 |
| 2012-07-07 09:00:00 | 379.75 |
| 2012-07-07 10:00:00 | 379.25 |
| 2012-07-07 11:00:00 | 372.75 |
| 2012-07-07 12:00:00 | 366 |
| 2012-07-07 13:00:00 | 369.75 |
| 2012-07-07 14:00:00 | 365 |
| 2012-07-07 15:00:00 | 320.25 |
| 2012-07-07 16:00:00 | 325.25 |
| 2012-07-07 17:00:00 | 329 |
| 2012-07-07 18:00:00 | 328.75 |
| 2012-07-07 19:00:00 | 327.75 |
| 2012-07-07 20:00:00 | 324.25 |
| 2012-07-07 21:00:00 | 330.5 |
| 2012-07-07 22:00:00 | 343.5 |
| 2012-07-07 23:00:00 | 356.25 |
| 2012-07-08 | 350.5 |
| 2012-07-08 01:00:00 | 370.75 |
| 2012-07-08 02:00:00 | 359.5 |
| 2012-07-08 03:00:00 | 350.75 |
| 2012-07-08 04:00:00 | 352.25 |
| 2012-07-08 05:00:00 | 357.75 |
| 2012-07-08 06:00:00 | 364.75 |
| 2012-07-08 07:00:00 | 371 |
| 2012-07-08 08:00:00 | 373.75 |
| 2012-07-08 09:00:00 | 374.5 |
| 2012-07-08 10:00:00 | 381.5 |
| 2012-07-08 11:00:00 | 382.75 |
| 2012-07-08 12:00:00 | 368.25 |
| 2012-07-08 13:00:00 | 371 |
| 2012-07-08 14:00:00 | 364.5 |
| 2012-07-08 15:00:00 | 364.5 |
| 2012-07-08 16:00:00 | 360.75 |
| 2012-07-08 17:00:00 | 341 |
| 2012-07-08 18:00:00 | 325 |
| 2012-07-08 19:00:00 | 321.5 |
| 2012-07-08 20:00:00 | 323.75 |
| 2012-07-08 21:00:00 | 321.75 |
| 2012-07-08 22:00:00 | 332.25 |
| 2012-07-08 23:00:00 | 355.25 |
| 2012-07-09 | 344.25 |
| 2012-07-09 01:00:00 | 369.25 |
| 2012-07-09 02:00:00 | 365.75 |
| 2012-07-09 03:00:00 | 354.5 |
| 2012-07-09 04:00:00 | 348.25 |
| 2012-07-09 05:00:00 | 357 |
| 2012-07-09 06:00:00 | 337.5 |
| 2012-07-09 07:00:00 | 326.25 |
| 2012-07-09 08:00:00 | 327 |
| 2012-07-09 09:00:00 | 326.5 |
| 2012-07-09 10:00:00 | 325.5 |
| 2012-07-09 11:00:00 | 331 |
| 2012-07-09 12:00:00 | 342 |
| 2012-07-09 13:00:00 | 336 |
| 2012-07-09 14:00:00 | 328.25 |
| 2012-07-09 15:00:00 | 370.75 |
| 2012-07-09 16:00:00 | 375.25 |
| 2012-07-09 17:00:00 | 383.75 |
| 2012-07-09 18:00:00 | 398 |
| 2012-07-09 19:00:00 | 346 |
| 2012-07-09 20:00:00 | 329.25 |
| 2012-07-09 21:00:00 | 330 |
| 2012-07-09 22:00:00 | 340 |
| 2012-07-09 23:00:00 | 350.5 |
| 2012-07-10 | 364.75 |
| 2012-07-10 01:00:00 | 376.25 |
| 2012-07-10 02:00:00 | 375 |
| 2012-07-10 03:00:00 | 368 |
| 2012-07-10 04:00:00 | 357 |
| 2012-07-10 05:00:00 | 363.5 |
| 2012-07-10 06:00:00 | 355.25 |
| 2012-07-10 07:00:00 | 327.75 |
| 2012-07-10 08:00:00 | 330.25 |
| 2012-07-10 09:00:00 | 330.25 |
| 2012-07-10 10:00:00 | 336 |
| 2012-07-10 11:00:00 | 331 |
| 2012-07-10 12:00:00 | 336 |
| 2012-07-10 13:00:00 | 337 |
| 2012-07-10 14:00:00 | 328 |
| 2012-07-10 15:00:00 | 334.75 |
| 2012-07-10 16:00:00 | 338.5 |
| 2012-07-10 17:00:00 | 330.75 |
| 2012-07-10 18:00:00 | 331.5 |
| 2012-07-10 19:00:00 | 332.5 |
| 2012-07-10 20:00:00 | 337 |
| 2012-07-10 21:00:00 | 343 |
| 2012-07-10 22:00:00 | 333.75 |
| 2012-07-10 23:00:00 | 351 |
| 2012-07-11 | 380 |
| 2012-07-11 01:00:00 | 381.5 |
| 2012-07-11 02:00:00 | 371.5 |
| 2012-07-11 03:00:00 | 353.25 |
| 2012-07-11 04:00:00 | 354.5 |
| 2012-07-11 05:00:00 | 366.75 |
| 2012-07-11 06:00:00 | 349.75 |
| 2012-07-11 07:00:00 | 324.5 |
| 2012-07-11 08:00:00 | 329.75 |
| 2012-07-11 09:00:00 | 343.25 |
| 2012-07-11 10:00:00 | 336.5 |
| 2012-07-11 11:00:00 | 284.75 |
| 2012-07-11 12:00:00 | 209.25 |
| 2012-07-11 13:00:00 | 218.5 |
| 2012-07-11 14:00:00 | 205.5 |
| 2012-07-11 15:00:00 | 205 |
| 2012-07-11 16:00:00 | 202.75 |
| 2012-07-11 17:00:00 | 209.25 |
| 2012-07-11 18:00:00 | 211.25 |
| 2012-07-11 19:00:00 | 206.75 |
| 2012-07-11 20:00:00 | 205 |
| 2012-07-11 21:00:00 | 207.75 |
| 2012-07-11 22:00:00 | 211.25 |
| 2012-07-11 23:00:00 | 227.75 |
| 2012-07-12 | 236.25 |
| 2012-07-12 01:00:00 | 226 |
| 2012-07-12 02:00:00 | 225.75 |
| 2012-07-12 03:00:00 | 214.75 |
| 2012-07-12 04:00:00 | 211.5 |
| 2012-07-12 05:00:00 | 210.5 |
| 2012-07-12 06:00:00 | 210.75 |
| 2012-07-12 07:00:00 | 205.75 |
| 2012-07-12 08:00:00 | 206 |
| 2012-07-12 09:00:00 | 218.5 |
| 2012-07-12 10:00:00 | 218 |
| 2012-07-12 11:00:00 | 208 |
| 2012-07-12 12:00:00 | 204.75 |
| 2012-07-12 13:00:00 | 206 |
| 2012-07-12 14:00:00 | 205 |
| 2012-07-12 15:00:00 | 203.5 |
| 2012-07-12 16:00:00 | 205 |
| 2012-07-12 17:00:00 | 204.75 |
| 2012-07-12 18:00:00 | 201.75 |
| 2012-07-12 19:00:00 | 205.5 |
| 2012-07-12 20:00:00 | 205 |
| 2012-07-12 21:00:00 | 218.25 |
| 2012-07-12 22:00:00 | 214 |
| 2012-07-12 23:00:00 | 227 |
| 2012-07-13 | 236.75 |
| 2012-07-13 01:00:00 | 227.5 |
| 2012-07-13 02:00:00 | 226.25 |
| 2012-07-13 03:00:00 | 211.25 |
| 2012-07-13 04:00:00 | 212.25 |
| 2012-07-13 05:00:00 | 209.75 |
| 2012-07-13 06:00:00 | 208.25 |
| 2012-07-13 07:00:00 | 208 |
| 2012-07-13 08:00:00 | 207.75 |
| 2012-07-13 09:00:00 | 211 |
| 2012-07-13 10:00:00 | 207.5 |
| 2012-07-13 11:00:00 | 199.75 |
| 2012-07-13 12:00:00 | 200 |
| 2012-07-13 13:00:00 | 238 |
| 2012-07-13 14:00:00 | 264.5 |
| 2012-07-13 15:00:00 | 293.25 |
| 2012-07-13 16:00:00 | 326.25 |
| 2012-07-13 17:00:00 | 330 |
| 2012-07-13 18:00:00 | 329.75 |
| 2012-07-13 19:00:00 | 328 |
| 2012-07-13 20:00:00 | 328 |
| 2012-07-13 21:00:00 | 329.5 |
| 2012-07-13 22:00:00 | 323 |
| 2012-07-13 23:00:00 | 374.5 |
| 2012-07-14 | 380 |
| 2012-07-14 01:00:00 | 354 |
| 2012-07-14 02:00:00 | 349 |
| 2012-07-14 03:00:00 | 344.25 |
| 2012-07-14 04:00:00 | 341.75 |
| 2012-07-14 05:00:00 | 354.25 |
| 2012-07-14 06:00:00 | 364.5 |
| 2012-07-14 07:00:00 | 360.75 |
| 2012-07-14 08:00:00 | 360.25 |
| 2012-07-14 09:00:00 | 369 |
| 2012-07-14 10:00:00 | 369.5 |
| 2012-07-14 11:00:00 | 373.75 |
| 2012-07-14 12:00:00 | 394.25 |
| 2012-07-14 13:00:00 | 355.75 |
| 2012-07-14 14:00:00 | 337.5 |
| 2012-07-14 15:00:00 | 353.5 |
| 2012-07-14 16:00:00 | 323.75 |
| 2012-07-14 17:00:00 | 324.75 |
| 2012-07-14 18:00:00 | 325.5 |
| 2012-07-14 19:00:00 | 359 |
| 2012-07-14 20:00:00 | 370 |
| 2012-07-14 21:00:00 | 366 |
| 2012-07-14 22:00:00 | 373.5 |
| 2012-07-14 23:00:00 | 377.25 |
| 2012-07-15 | 360.75 |
| 2012-07-15 01:00:00 | 341 |
| 2012-07-15 02:00:00 | 338.75 |
| 2012-07-15 03:00:00 | 339 |
| 2012-07-15 04:00:00 | 346 |
| 2012-07-15 05:00:00 | 355.25 |
| 2012-07-15 06:00:00 | 359.75 |
| 2012-07-15 07:00:00 | 361.25 |
| 2012-07-15 08:00:00 | 363.25 |
| 2012-07-15 09:00:00 | 381 |
| 2012-07-15 10:00:00 | 389.25 |
| 2012-07-15 11:00:00 | 372 |
| 2012-07-15 12:00:00 | 322 |
| 2012-07-15 13:00:00 | 329 |
| 2012-07-15 14:00:00 | 322.25 |
| 2012-07-15 15:00:00 | 321.25 |
| 2012-07-15 16:00:00 | 317.5 |
| 2012-07-15 17:00:00 | 319.5 |
| 2012-07-15 18:00:00 | 322.75 |
| 2012-07-15 19:00:00 | 388.25 |
| 2012-07-15 20:00:00 | 386.25 |
| 2012-07-15 21:00:00 | 363.5 |
| 2012-07-15 22:00:00 | 370.5 |
| 2012-07-15 23:00:00 | 369.75 |
| 2012-07-16 | 360 |
| 2012-07-16 01:00:00 | 342.25 |
| 2012-07-16 02:00:00 | 340 |
| 2012-07-16 03:00:00 | 341.5 |
| 2012-07-16 04:00:00 | 342 |
| 2012-07-16 05:00:00 | 353.75 |
| 2012-07-16 06:00:00 | 365.75 |
| 2012-07-16 07:00:00 | 372.75 |
| 2012-07-16 08:00:00 | 380 |
| 2012-07-16 09:00:00 | 390.25 |
| 2012-07-16 10:00:00 | 375.25 |
| 2012-07-16 11:00:00 | 333.75 |
| 2012-07-16 12:00:00 | 330 |
| 2012-07-16 13:00:00 | 334.5 |
| 2012-07-16 14:00:00 | 358.25 |
| 2012-07-16 15:00:00 | 362.75 |
| 2012-07-16 16:00:00 | 375.5 |
| 2012-07-16 17:00:00 | 278.5 |
| 2012-07-16 18:00:00 | 384.5 |
| 2012-07-16 19:00:00 | 389 |
| 2012-07-16 20:00:00 | 353.5 |
| 2012-07-16 21:00:00 | 333.75 |
| 2012-07-16 22:00:00 | 331.75 |
| 2012-07-16 23:00:00 | 353.5 |
| 2012-07-17 | 401 |
| 2012-07-17 01:00:00 | 369.75 |
| 2012-07-17 02:00:00 | 364 |
| 2012-07-17 03:00:00 | 351 |
| 2012-07-17 04:00:00 | 341.25 |
| 2012-07-17 05:00:00 | 361 |
| 2012-07-17 06:00:00 | 366.5 |
| 2012-07-17 07:00:00 | 372.25 |
| 2012-07-17 08:00:00 | 377.75 |
| 2012-07-17 09:00:00 | 380.75 |
| 2012-07-17 10:00:00 | 387.25 |
| 2012-07-17 11:00:00 | 343.75 |
| 2012-07-17 12:00:00 | 341.5 |
| 2012-07-17 13:00:00 | 341.75 |
| 2012-07-17 14:00:00 | 339.75 |
| 2012-07-17 15:00:00 | 341 |
| 2012-07-17 16:00:00 | 342.25 |
| 2012-07-17 17:00:00 | 325.75 |
| 2012-07-17 18:00:00 | 325 |
| 2012-07-17 19:00:00 | 328 |
| 2012-07-17 20:00:00 | 329 |
| 2012-07-17 21:00:00 | 332 |
| 2012-07-17 22:00:00 | 335.25 |
| 2012-07-17 23:00:00 | 354.75 |
| 2012-07-18 | 352.25 |
| 2012-07-18 01:00:00 | 362.25 |
| 2012-07-18 02:00:00 | 363.5 |
| 2012-07-18 03:00:00 | 341.25 |
| 2012-07-18 04:00:00 | 338.5 |
| 2012-07-18 05:00:00 | 358 |
| 2012-07-18 06:00:00 | 360.75 |
| 2012-07-18 07:00:00 | 367 |
| 2012-07-18 08:00:00 | 380.5 |
| 2012-07-18 09:00:00 | 358.25 |
| 2012-07-18 10:00:00 | 336.25 |
| 2012-07-18 11:00:00 | 329 |
| 2012-07-18 12:00:00 | 325.25 |
| 2012-07-18 13:00:00 | 329.25 |
| 2012-07-18 14:00:00 | 328.25 |
| 2012-07-18 15:00:00 | 333.5 |
| 2012-07-18 16:00:00 | 339 |
| 2012-07-18 17:00:00 | 334.25 |
| 2012-07-18 18:00:00 | 329.75 |
| 2012-07-18 19:00:00 | 335 |
| 2012-07-18 20:00:00 | 333.75 |
| 2012-07-18 21:00:00 | 326.75 |
| 2012-07-18 22:00:00 | 331 |
| 2012-07-18 23:00:00 | 357.75 |
| 2012-07-19 | 365 |
| 2012-07-19 01:00:00 | 366.25 |
| 2012-07-19 02:00:00 | 362 |
| 2012-07-19 03:00:00 | 345.5 |
| 2012-07-19 04:00:00 | 340.75 |
| 2012-07-19 05:00:00 | 355.25 |
| 2012-07-19 06:00:00 | 370.5 |
| 2012-07-19 07:00:00 | 375.75 |
| 2012-07-19 08:00:00 | 356.5 |
| 2012-07-19 09:00:00 | 345.75 |
| 2012-07-19 10:00:00 | 335.75 |
| 2012-07-19 11:00:00 | 326 |
| 2012-07-19 12:00:00 | 327.5 |
| 2012-07-19 13:00:00 | 328.75 |
| 2012-07-19 14:00:00 | 319.5 |
| 2012-07-19 15:00:00 | 326.75 |
| 2012-07-19 16:00:00 | 328.75 |
| 2012-07-19 17:00:00 | 320.5 |
| 2012-07-19 18:00:00 | 319.5 |
| 2012-07-19 19:00:00 | 324.25 |
| 2012-07-19 20:00:00 | 322 |
| 2012-07-19 21:00:00 | 323.75 |
| 2012-07-19 22:00:00 | 325.5 |
| 2012-07-19 23:00:00 | 376.75 |
| 2012-07-20 | 396.25 |
| 2012-07-20 01:00:00 | 363.5 |
| 2012-07-20 02:00:00 | 359.25 |
| 2012-07-20 03:00:00 | 342.75 |
| 2012-07-20 04:00:00 | 341.75 |
| 2012-07-20 05:00:00 | 355 |
| 2012-07-20 06:00:00 | 362.5 |
| 2012-07-20 07:00:00 | 371.75 |
| 2012-07-20 08:00:00 | 336.25 |
| 2012-07-20 09:00:00 | 331.5 |
| 2012-07-20 10:00:00 | 329.25 |
| 2012-07-20 11:00:00 | 324.25 |
| 2012-07-20 12:00:00 | 328.25 |
| 2012-07-20 13:00:00 | 341 |
| 2012-07-20 14:00:00 | 326.75 |
| 2012-07-20 15:00:00 | 333.5 |
| 2012-07-20 16:00:00 | 343.25 |
| 2012-07-20 17:00:00 | 323.75 |
| 2012-07-20 18:00:00 | 320 |
| 2012-07-20 19:00:00 | 322.75 |
| 2012-07-20 20:00:00 | 322.5 |
| 2012-07-20 21:00:00 | 324 |
| 2012-07-20 22:00:00 | 330 |
| 2012-07-20 23:00:00 | 352.5 |
| 2012-07-21 | 353.25 |
| 2012-07-21 01:00:00 | 363.75 |
| 2012-07-21 02:00:00 | 361 |
| 2012-07-21 03:00:00 | 343.75 |
| 2012-07-21 04:00:00 | 341.25 |
| 2012-07-21 05:00:00 | 358.25 |
| 2012-07-21 06:00:00 | 355.5 |
| 2012-07-21 07:00:00 | 355.25 |
| 2012-07-21 08:00:00 | 358 |
| 2012-07-21 09:00:00 | 364 |
| 2012-07-21 10:00:00 | 374.75 |
| 2012-07-21 11:00:00 | 376.25 |
| 2012-07-21 12:00:00 | 366.25 |
| 2012-07-21 13:00:00 | 370.5 |
| 2012-07-21 14:00:00 | 368.75 |
| 2012-07-21 15:00:00 | 367.25 |
| 2012-07-21 16:00:00 | 365 |
| 2012-07-21 17:00:00 | 358.25 |
| 2012-07-21 18:00:00 | 359.75 |
| 2012-07-21 19:00:00 | 358 |
| 2012-07-21 20:00:00 | 369.75 |
| 2012-07-21 21:00:00 | 376.25 |
| 2012-07-21 22:00:00 | 378 |
| 2012-07-21 23:00:00 | 384.25 |
| 2012-07-22 | 380.25 |
| 2012-07-22 01:00:00 | 344 |
| 2012-07-22 02:00:00 | 343.25 |
| 2012-07-22 03:00:00 | 342.25 |
| 2012-07-22 04:00:00 | 339.25 |
| 2012-07-22 05:00:00 | 361 |
| 2012-07-22 06:00:00 | 359 |
| 2012-07-22 07:00:00 | 357 |
| 2012-07-22 08:00:00 | 361 |
| 2012-07-22 09:00:00 | 365 |
| 2012-07-22 10:00:00 | 369.75 |
| 2012-07-22 11:00:00 | 369.25 |
| 2012-07-22 12:00:00 | 373.75 |
| 2012-07-22 13:00:00 | 372.25 |
| 2012-07-22 14:00:00 | 368 |
| 2012-07-22 15:00:00 | 362.5 |
| 2012-07-22 16:00:00 | 359.75 |
| 2012-07-22 17:00:00 | 356.25 |
| 2012-07-22 18:00:00 | 353 |
| 2012-07-22 19:00:00 | 366.25 |
| 2012-07-22 20:00:00 | 356.5 |
| 2012-07-22 21:00:00 | 355 |
| 2012-07-22 22:00:00 | 377.5 |
| 2012-07-22 23:00:00 | 377.75 |
| 2012-07-23 | 379.25 |
| 2012-07-23 01:00:00 | 362 |
| 2012-07-23 02:00:00 | 345.75 |
| 2012-07-23 03:00:00 | 343.5 |
| 2012-07-23 04:00:00 | 339 |
| 2012-07-23 05:00:00 | 362 |
| 2012-07-23 06:00:00 | 358.75 |
| 2012-07-23 07:00:00 | 364.5 |
| 2012-07-23 08:00:00 | 347.5 |
| 2012-07-23 09:00:00 | 322.5 |
| 2012-07-23 10:00:00 | 335.5 |
| 2012-07-23 11:00:00 | 330 |
| 2012-07-23 12:00:00 | 323.5 |
| 2012-07-23 13:00:00 | 332 |
| 2012-07-23 14:00:00 | 360.25 |
| 2012-07-23 15:00:00 | 360.5 |
| 2012-07-23 16:00:00 | 362.75 |
| 2012-07-23 17:00:00 | 373.25 |
| 2012-07-23 18:00:00 | 361.25 |
| 2012-07-23 19:00:00 | 324.25 |
| 2012-07-23 20:00:00 | 320.25 |
| 2012-07-23 21:00:00 | 318 |
| 2012-07-23 22:00:00 | 329 |
| 2012-07-23 23:00:00 | 344.75 |
| 2012-07-24 | 370.75 |
| 2012-07-24 01:00:00 | 372.75 |
| 2012-07-24 02:00:00 | 357.5 |
| 2012-07-24 03:00:00 | 338.5 |
| 2012-07-24 04:00:00 | 336.75 |
| 2012-07-24 05:00:00 | 351.75 |
| 2012-07-24 06:00:00 | 344.25 |
| 2012-07-24 07:00:00 | 311 |
| 2012-07-24 08:00:00 | 317 |
| 2012-07-24 09:00:00 | 326.75 |
| 2012-07-24 10:00:00 | 325 |
| 2012-07-24 11:00:00 | 326.5 |
| 2012-07-24 12:00:00 | 329 |
| 2012-07-24 13:00:00 | 333 |
| 2012-07-24 14:00:00 | 327.5 |
| 2012-07-24 15:00:00 | 334.75 |
| 2012-07-24 16:00:00 | 332.5 |
| 2012-07-24 17:00:00 | 337.5 |
| 2012-07-24 18:00:00 | 335.25 |
| 2012-07-24 19:00:00 | 326.25 |
| 2012-07-24 20:00:00 | 324.25 |
| 2012-07-24 21:00:00 | 320.25 |
| 2012-07-24 22:00:00 | 327 |
| 2012-07-24 23:00:00 | 348.75 |
| 2012-07-25 | 347 |
| 2012-07-25 01:00:00 | 364 |
| 2012-07-25 02:00:00 | 359.5 |
| 2012-07-25 03:00:00 | 343.5 |
| 2012-07-25 04:00:00 | 342 |
| 2012-07-25 05:00:00 | 345.25 |
| 2012-07-25 06:00:00 | 306 |
| 2012-07-25 07:00:00 | 316 |
| 2012-07-25 08:00:00 | 321.5 |
| 2012-07-25 09:00:00 | 325.25 |
| 2012-07-25 10:00:00 | 314.5 |
| 2012-07-25 11:00:00 | 315.5 |
| 2012-07-25 12:00:00 | 314.25 |
| 2012-07-25 13:00:00 | 320.5 |
| 2012-07-25 14:00:00 | 310.75 |
| 2012-07-25 15:00:00 | 314.25 |
| 2012-07-25 16:00:00 | 316.25 |
| 2012-07-25 17:00:00 | 335 |
| 2012-07-25 18:00:00 | 327.25 |
| 2012-07-25 19:00:00 | 330.75 |
| 2012-07-25 20:00:00 | 329.5 |
| 2012-07-25 21:00:00 | 358 |
| 2012-07-25 22:00:00 | 333.25 |
| 2012-07-25 23:00:00 | 345.5 |
| 2012-07-26 | 346 |
| 2012-07-26 01:00:00 | 358.25 |
| 2012-07-26 02:00:00 | 357.5 |
| 2012-07-26 03:00:00 | 341.25 |
| 2012-07-26 04:00:00 | 337 |
| 2012-07-26 05:00:00 | 353.75 |
| 2012-07-26 06:00:00 | 361.5 |
| 2012-07-26 07:00:00 | 375.75 |
| 2012-07-26 08:00:00 | 335.5 |
| 2012-07-26 09:00:00 | 317 |
| 2012-07-26 10:00:00 | 323.25 |
| 2012-07-26 11:00:00 | 325.25 |
| 2012-07-26 12:00:00 | 325.25 |
| 2012-07-26 13:00:00 | 328.5 |
| 2012-07-26 14:00:00 | 327.75 |
| 2012-07-26 15:00:00 | 142 |
| 2012-07-26 16:00:00 | 53.75 |
| 2012-07-26 17:00:00 | 100.25 |
| 2012-07-26 18:00:00 | 140.25 |
| 2012-07-26 19:00:00 | 332 |
| 2012-07-26 20:00:00 | 377.5 |
| 2012-07-26 21:00:00 | 388.75 |
| 2012-07-26 22:00:00 | 405 |
| 2012-07-26 23:00:00 | 417.75 |
| 2012-07-27 | 422 |
| 2012-07-27 01:00:00 | 386 |
| 2012-07-27 02:00:00 | 371.25 |
| 2012-07-27 03:00:00 | 355.75 |
| 2012-07-27 04:00:00 | 352.75 |
| 2012-07-27 05:00:00 | 356 |
| 2012-07-27 06:00:00 | 364 |
| 2012-07-27 07:00:00 | 350.75 |
| 2012-07-27 08:00:00 | 333 |
| 2012-07-27 09:00:00 | 320 |
| 2012-07-27 10:00:00 | 305.5 |
| 2012-07-27 11:00:00 | 303.25 |
| 2012-07-27 12:00:00 | 292 |
| 2012-07-27 13:00:00 | 297.75 |
| 2012-07-27 14:00:00 | 330.25 |
| 2012-07-27 15:00:00 | 330.5 |
| 2012-07-27 16:00:00 | 328 |
| 2012-07-27 17:00:00 | 239 |
| 2012-07-27 18:00:00 | 292 |
| 2012-07-27 19:00:00 | 281.75 |
| 2012-07-27 20:00:00 | 301.75 |
| 2012-07-27 21:00:00 | 373 |
| 2012-07-27 22:00:00 | 385.75 |
| 2012-07-27 23:00:00 | 393 |
| 2012-07-28 | 401.75 |
| 2012-07-28 01:00:00 | 358 |
| 2012-07-28 02:00:00 | 359.25 |
| 2012-07-28 03:00:00 | 348 |
| 2012-07-28 04:00:00 | 345.5 |
| 2012-07-28 05:00:00 | 348.75 |
| 2012-07-28 06:00:00 | 350.25 |
| 2012-07-28 07:00:00 | 345.25 |
| 2012-07-28 08:00:00 | 347.25 |
| 2012-07-28 09:00:00 | 342.75 |
| 2012-07-28 10:00:00 | 342.5 |
| 2012-07-28 11:00:00 | 355.25 |
| 2012-07-28 12:00:00 | 367.75 |
| 2012-07-28 13:00:00 | 365.25 |
| 2012-07-28 14:00:00 | 357.5 |
| 2012-07-28 15:00:00 | 356.75 |
| 2012-07-28 16:00:00 | 364 |
| 2012-07-28 17:00:00 | 362 |
| 2012-07-28 18:00:00 | 351.5 |
| 2012-07-28 19:00:00 | 348.25 |
| 2012-07-28 20:00:00 | 351.5 |
| 2012-07-28 21:00:00 | 358.25 |
| 2012-07-28 22:00:00 | 374.75 |
| 2012-07-28 23:00:00 | 369.75 |
| 2012-07-29 | 366.5 |
| 2012-07-29 01:00:00 | 350 |
| 2012-07-29 02:00:00 | 336.5 |
| 2012-07-29 03:00:00 | 332.25 |
| 2012-07-29 04:00:00 | 333.25 |
| 2012-07-29 05:00:00 | 347 |
| 2012-07-29 06:00:00 | 349 |
| 2012-07-29 07:00:00 | 349.5 |
| 2012-07-29 08:00:00 | 347.5 |
| 2012-07-29 09:00:00 | 358 |
| 2012-07-29 10:00:00 | 354.5 |
| 2012-07-29 11:00:00 | 361 |
| 2012-07-29 12:00:00 | 345.5 |
| 2012-07-29 13:00:00 | 352 |
| 2012-07-29 14:00:00 | 360.25 |
| 2012-07-29 15:00:00 | 364.75 |
| 2012-07-29 16:00:00 | 362 |
| 2012-07-29 17:00:00 | 355.25 |
| 2012-07-29 18:00:00 | 357 |
| 2012-07-29 19:00:00 | 355.5 |
| 2012-07-29 20:00:00 | 347 |
| 2012-07-29 21:00:00 | 310.75 |
| 2012-07-29 22:00:00 | 310.25 |
| 2012-07-29 23:00:00 | 305.5 |
| 2012-07-30 | 292 |
| 2012-07-30 01:00:00 | 216.5 |
| 2012-07-30 02:00:00 | 207 |
| 2012-07-30 03:00:00 | 189.5 |
| 2012-07-30 04:00:00 | 192.5 |
| 2012-07-30 05:00:00 | 188.75 |
| 2012-07-30 06:00:00 | 185 |
| 2012-07-30 07:00:00 | 181.5 |
| 2012-07-30 08:00:00 | 189 |
| 2012-07-30 09:00:00 | 195 |
| 2012-07-30 10:00:00 | 213.25 |
| 2012-07-30 11:00:00 | 195.75 |
| 2012-07-30 12:00:00 | 200.25 |
| 2012-07-30 13:00:00 | 198.25 |
| 2012-07-30 14:00:00 | 196 |
| 2012-07-30 15:00:00 | 184.5 |
| 2012-07-30 16:00:00 | 181.5 |
| 2012-07-30 17:00:00 | 164 |
| 2012-07-30 18:00:00 | 184.75 |
| 2012-07-30 19:00:00 | 216.5 |
| 2012-07-30 20:00:00 | 217 |
| 2012-07-30 21:00:00 | 224 |
| 2012-07-30 22:00:00 | 184.75 |
| 2012-07-30 23:00:00 | 179 |
| 2012-07-31 | 180 |
| 2012-07-31 01:00:00 | 179 |
| 2012-07-31 02:00:00 | 179.75 |
| 2012-07-31 03:00:00 | 197.5 |
| 2012-07-31 04:00:00 | 227.75 |
| 2012-07-31 05:00:00 | 224.75 |
| 2012-07-31 06:00:00 | 223.5 |
| 2012-07-31 07:00:00 | 222.25 |
| 2012-07-31 08:00:00 | 226 |
| 2012-07-31 09:00:00 | 225 |
| 2012-07-31 10:00:00 | 164 |
| 2012-07-31 11:00:00 | 160.25 |
| 2012-07-31 12:00:00 | 159.5 |
| 2012-07-31 13:00:00 | 175.25 |
| 2012-07-31 14:00:00 | 246.25 |
| 2012-07-31 15:00:00 | 205.5 |
| 2012-07-31 16:00:00 | 217.75 |
| 2012-07-31 17:00:00 | 213.25 |
| 2012-07-31 18:00:00 | 203.75 |
| 2012-07-31 19:00:00 | 203.25 |
| 2012-07-31 20:00:00 | 202.75 |
| 2012-07-31 21:00:00 | 206 |
| 2012-07-31 22:00:00 | 212 |
| 2012-07-31 23:00:00 | 236.75 |
| 2012-08-01 | 242.25 |
| 2012-08-01 01:00:00 | 228.75 |
| 2012-08-01 02:00:00 | 230 |
| 2012-08-01 03:00:00 | 213.75 |
| 2012-08-01 04:00:00 | 214 |
| 2012-08-01 05:00:00 | 214.25 |
| 2012-08-01 06:00:00 | 214 |
| 2012-08-01 07:00:00 | 209.25 |
| 2012-08-01 08:00:00 | 210.5 |
| 2012-08-01 09:00:00 | 206.75 |
| 2012-08-01 10:00:00 | 209.25 |
| 2012-08-01 11:00:00 | 201.75 |
| 2012-08-01 12:00:00 | 210.75 |
| 2012-08-01 13:00:00 | 208.75 |
| 2012-08-01 14:00:00 | 206 |
| 2012-08-01 15:00:00 | 202 |
| 2012-08-01 16:00:00 | 214 |
| 2012-08-01 17:00:00 | 204.5 |
| 2012-08-01 18:00:00 | 199.25 |
| 2012-08-01 19:00:00 | 200.5 |
| 2012-08-01 20:00:00 | 202.25 |
| 2012-08-01 21:00:00 | 201.75 |
| 2012-08-01 22:00:00 | 211 |
| 2012-08-01 23:00:00 | 226 |
| 2012-08-02 | 235.25 |
| 2012-08-02 01:00:00 | 225 |
| 2012-08-02 02:00:00 | 225.5 |
| 2012-08-02 03:00:00 | 213 |
| 2012-08-02 04:00:00 | 210 |
| 2012-08-02 05:00:00 | 213.25 |
| 2012-08-02 06:00:00 | 205 |
| 2012-08-02 07:00:00 | 200.75 |
| 2012-08-02 08:00:00 | 206.75 |
| 2012-08-02 09:00:00 | 206.75 |
| 2012-08-02 10:00:00 | 217.25 |
| 2012-08-02 11:00:00 | 207.75 |
| 2012-08-02 12:00:00 | 207 |
| 2012-08-02 13:00:00 | 211 |
| 2012-08-02 14:00:00 | 205.25 |
| 2012-08-02 15:00:00 | 207.25 |
| 2012-08-02 16:00:00 | 209 |
| 2012-08-02 17:00:00 | 202.25 |
| 2012-08-02 18:00:00 | 201 |
| 2012-08-02 19:00:00 | 202 |
| 2012-08-02 20:00:00 | 205.5 |
| 2012-08-02 21:00:00 | 204 |
| 2012-08-02 22:00:00 | 208.5 |
| 2012-08-02 23:00:00 | 228 |
| 2012-08-03 | 236.25 |
| 2012-08-03 01:00:00 | 226.5 |
| 2012-08-03 02:00:00 | 227 |
| 2012-08-03 03:00:00 | 212.25 |
| 2012-08-03 04:00:00 | 211.25 |
| 2012-08-03 05:00:00 | 215.25 |
| 2012-08-03 06:00:00 | 206.25 |
| 2012-08-03 07:00:00 | 203.75 |
| 2012-08-03 08:00:00 | 206.75 |
| 2012-08-03 09:00:00 | 215 |
| 2012-08-03 10:00:00 | 219.25 |
| 2012-08-03 11:00:00 | 207 |
| 2012-08-03 12:00:00 | 204.5 |
| 2012-08-03 13:00:00 | 209 |
| 2012-08-03 14:00:00 | 206.5 |
| 2012-08-03 15:00:00 | 205.75 |
| 2012-08-03 16:00:00 | 209.75 |
| 2012-08-03 17:00:00 | 196.75 |
| 2012-08-03 18:00:00 | 201.5 |
| 2012-08-03 19:00:00 | 204 |
| 2012-08-03 20:00:00 | 204 |
| 2012-08-03 21:00:00 | 205.25 |
| 2012-08-03 22:00:00 | 210.25 |
| 2012-08-03 23:00:00 | 218.5 |
| 2012-08-04 | 235.25 |
| 2012-08-04 01:00:00 | 224.75 |
| 2012-08-04 02:00:00 | 224.5 |
| 2012-08-04 03:00:00 | 219 |
| 2012-08-04 04:00:00 | 209 |
| 2012-08-04 05:00:00 | 212.5 |
| 2012-08-04 06:00:00 | 205.5 |
| 2012-08-04 07:00:00 | 203.25 |
| 2012-08-04 08:00:00 | 196 |
| 2012-08-04 09:00:00 | 199 |
| 2012-08-04 10:00:00 | 203.5 |
| 2012-08-04 11:00:00 | 214 |
| 2012-08-04 12:00:00 | 209.25 |
| 2012-08-04 13:00:00 | 200.25 |
| 2012-08-04 14:00:00 | 201 |
| 2012-08-04 15:00:00 | 204.75 |
| 2012-08-04 16:00:00 | 205.25 |
| 2012-08-04 17:00:00 | 196.75 |
| 2012-08-04 18:00:00 | 182.75 |
| 2012-08-04 19:00:00 | 185.25 |
| 2012-08-04 20:00:00 | 196.5 |
| 2012-08-04 21:00:00 | 228 |
| 2012-08-04 22:00:00 | 290.25 |
| 2012-08-04 23:00:00 | 295.75 |
| 2012-08-05 | 294.75 |
| 2012-08-05 01:00:00 | 278.5 |
| 2012-08-05 02:00:00 | 267.75 |
| 2012-08-05 03:00:00 | 291 |
| 2012-08-05 04:00:00 | 326.5 |
| 2012-08-05 05:00:00 | 341.25 |
| 2012-08-05 06:00:00 | 342.25 |
| 2012-08-05 07:00:00 | 341.5 |
| 2012-08-05 08:00:00 | 343.5 |
| 2012-08-05 09:00:00 | 362.5 |
| 2012-08-05 10:00:00 | 375.25 |
| 2012-08-05 11:00:00 | 339.75 |
| 2012-08-05 12:00:00 | 332.75 |
| 2012-08-05 13:00:00 | 332.5 |
| 2012-08-05 14:00:00 | 326.5 |
| 2012-08-05 15:00:00 | 322.5 |
| 2012-08-05 16:00:00 | 327.25 |
| 2012-08-05 17:00:00 | 331 |
| 2012-08-05 18:00:00 | 346.5 |
| 2012-08-05 19:00:00 | 375.75 |
| 2012-08-05 20:00:00 | 378 |
| 2012-08-05 21:00:00 | 384 |
| 2012-08-05 22:00:00 | 377 |
| 2012-08-05 23:00:00 | 378.75 |
| 2012-08-06 | 379.5 |
| 2012-08-06 01:00:00 | 358.25 |
| 2012-08-06 02:00:00 | 359 |
| 2012-08-06 03:00:00 | 353.75 |
| 2012-08-06 04:00:00 | 352.75 |
| 2012-08-06 05:00:00 | 368.75 |
| 2012-08-06 06:00:00 | 380.25 |
| 2012-08-06 07:00:00 | 371 |
| 2012-08-06 08:00:00 | 334.5 |
| 2012-08-06 09:00:00 | 335.75 |
| 2012-08-06 10:00:00 | 343.5 |
| 2012-08-06 11:00:00 | 339 |
| 2012-08-06 12:00:00 | 339.25 |
| 2012-08-06 13:00:00 | 344.75 |
| 2012-08-06 14:00:00 | 381 |
| 2012-08-06 15:00:00 | 373 |
| 2012-08-06 16:00:00 | 384 |
| 2012-08-06 17:00:00 | 380.25 |
| 2012-08-06 18:00:00 | 380.25 |
| 2012-08-06 19:00:00 | 332.5 |
| 2012-08-06 20:00:00 | 333 |
| 2012-08-06 21:00:00 | 336 |
| 2012-08-06 22:00:00 | 345.75 |
| 2012-08-06 23:00:00 | 356.5 |
| 2012-08-07 | 216.5 |
| 2012-08-07 01:00:00 | 371.75 |
| 2012-08-07 02:00:00 | 378.5 |
| 2012-08-07 03:00:00 | 357.75 |
| 2012-08-07 04:00:00 | 357.75 |
| 2012-08-07 05:00:00 | 378.5 |
| 2012-08-07 06:00:00 | 378 |
| 2012-08-07 07:00:00 | 377.25 |
| 2012-08-07 08:00:00 | 310 |
| 2012-08-07 09:00:00 | 200.75 |
| 2012-08-07 10:00:00 | 202.25 |
| 2012-08-07 11:00:00 | 230.75 |
| 2012-08-07 12:00:00 | 340.25 |
| 2012-08-07 13:00:00 | 345.25 |
| 2012-08-07 14:00:00 | 349.75 |
| 2012-08-07 15:00:00 | 338.5 |
| 2012-08-07 16:00:00 | 309 |
| 2012-08-07 17:00:00 | 387.25 |
| 2012-08-07 18:00:00 | 388.75 |
| 2012-08-07 19:00:00 | 336.25 |
| 2012-08-07 20:00:00 | 336 |
| 2012-08-07 21:00:00 | 340.25 |
| 2012-08-07 22:00:00 | 343 |
| 2012-08-07 23:00:00 | 353.75 |
| 2012-08-08 | 356.5 |
| 2012-08-08 01:00:00 | 373.5 |
| 2012-08-08 02:00:00 | 373 |
| 2012-08-08 03:00:00 | 356.5 |
| 2012-08-08 04:00:00 | 349.75 |
| 2012-08-08 05:00:00 | 361.25 |
| 2012-08-08 06:00:00 | 373 |
| 2012-08-08 07:00:00 | 374 |
| 2012-08-08 08:00:00 | 354 |
| 2012-08-08 09:00:00 | 334 |
| 2012-08-08 10:00:00 | 341.25 |
| 2012-08-08 11:00:00 | 336.25 |
| 2012-08-08 12:00:00 | 333 |
| 2012-08-08 13:00:00 | 341.25 |
| 2012-08-08 14:00:00 | 338.5 |
| 2012-08-08 15:00:00 | 342.25 |
| 2012-08-08 16:00:00 | 338.75 |
| 2012-08-08 17:00:00 | 343.75 |
| 2012-08-08 18:00:00 | 336 |
| 2012-08-08 19:00:00 | 348.25 |
| 2012-08-08 20:00:00 | 341.5 |
| 2012-08-08 21:00:00 | 344 |
| 2012-08-08 22:00:00 | 376 |
| 2012-08-08 23:00:00 | 365 |
| 2012-08-09 | 392.25 |
| 2012-08-09 01:00:00 | 378 |
| 2012-08-09 02:00:00 | 376.5 |
| 2012-08-09 03:00:00 | 358.75 |
| 2012-08-09 04:00:00 | 355.25 |
| 2012-08-09 05:00:00 | 377.75 |
| 2012-08-09 06:00:00 | 377.75 |
| 2012-08-09 07:00:00 | 380.75 |
| 2012-08-09 08:00:00 | 371.75 |
| 2012-08-09 09:00:00 | 338.25 |
| 2012-08-09 10:00:00 | 342.25 |
| 2012-08-09 11:00:00 | 339 |
| 2012-08-09 12:00:00 | 340.25 |
| 2012-08-09 13:00:00 | 344.5 |
| 2012-08-09 14:00:00 | 340 |
| 2012-08-09 15:00:00 | 342.5 |
| 2012-08-09 16:00:00 | 339.5 |
| 2012-08-09 17:00:00 | 342.5 |
| 2012-08-09 18:00:00 | 337.75 |
| 2012-08-09 19:00:00 | 351.75 |
| 2012-08-09 20:00:00 | 390.25 |
| 2012-08-09 21:00:00 | 386 |
| 2012-08-09 22:00:00 | 347.5 |
| 2012-08-09 23:00:00 | 360 |
| 2012-08-10 | 381.75 |
| 2012-08-10 01:00:00 | 379.5 |
| 2012-08-10 02:00:00 | 374.75 |
| 2012-08-10 03:00:00 | 357.75 |
| 2012-08-10 04:00:00 | 356.5 |
| 2012-08-10 05:00:00 | 375.5 |
| 2012-08-10 06:00:00 | 372.75 |
| 2012-08-10 07:00:00 | 379.5 |
| 2012-08-10 08:00:00 | 385.5 |
| 2012-08-10 09:00:00 | 386.5 |
| 2012-08-10 10:00:00 | 350 |
| 2012-08-10 11:00:00 | 334.25 |
| 2012-08-10 12:00:00 | 332.75 |
| 2012-08-10 13:00:00 | 342.25 |
| 2012-08-10 14:00:00 | 343.5 |
| 2012-08-10 15:00:00 | 342.75 |
| 2012-08-10 16:00:00 | 354.5 |
| 2012-08-10 17:00:00 | 343.5 |
| 2012-08-10 18:00:00 | 339.75 |
| 2012-08-10 19:00:00 | 338 |
| 2012-08-10 20:00:00 | 340.25 |
| 2012-08-10 21:00:00 | 345.75 |
| 2012-08-10 22:00:00 | 346.25 |
| 2012-08-10 23:00:00 | 358.25 |
| 2012-08-11 | 379.5 |
| 2012-08-11 01:00:00 | 375.25 |
| 2012-08-11 02:00:00 | 372 |
| 2012-08-11 03:00:00 | 356.5 |
| 2012-08-11 04:00:00 | 351.5 |
| 2012-08-11 05:00:00 | 357.5 |
| 2012-08-11 06:00:00 | 370.75 |
| 2012-08-11 07:00:00 | 369.5 |
| 2012-08-11 08:00:00 | 371.5 |
| 2012-08-11 09:00:00 | 387.5 |
| 2012-08-11 10:00:00 | 401 |
| 2012-08-11 11:00:00 | 391.25 |
| 2012-08-11 12:00:00 | 385.5 |
| 2012-08-11 13:00:00 | 381.5 |
| 2012-08-11 14:00:00 | 388.75 |
| 2012-08-11 15:00:00 | 384.5 |
| 2012-08-11 16:00:00 | 381 |
| 2012-08-11 17:00:00 | 380.75 |
| 2012-08-11 18:00:00 | 377 |
| 2012-08-11 19:00:00 | 383 |
| 2012-08-11 20:00:00 | 378 |
| 2012-08-11 21:00:00 | 383.5 |
| 2012-08-11 22:00:00 | 395.25 |
| 2012-08-11 23:00:00 | 396.5 |
| 2012-08-12 | 393 |
| 2012-08-12 01:00:00 | 367.25 |
| 2012-08-12 02:00:00 | 355.25 |
| 2012-08-12 03:00:00 | 352.25 |
| 2012-08-12 04:00:00 | 350.5 |
| 2012-08-12 05:00:00 | 363.75 |
| 2012-08-12 06:00:00 | 370.75 |
| 2012-08-12 07:00:00 | 371.5 |
| 2012-08-12 08:00:00 | 370.5 |
| 2012-08-12 09:00:00 | 371 |
| 2012-08-12 10:00:00 | 384 |
| 2012-08-12 11:00:00 | 390.75 |
| 2012-08-12 12:00:00 | 380.25 |
| 2012-08-12 13:00:00 | 376.25 |
| 2012-08-12 14:00:00 | 372.75 |
| 2012-08-12 15:00:00 | 375 |
| 2012-08-12 16:00:00 | 370.5 |
| 2012-08-12 17:00:00 | 370.5 |
| 2012-08-12 18:00:00 | 371.75 |
| 2012-08-12 19:00:00 | 380.5 |
| 2012-08-12 20:00:00 | 365.5 |
| 2012-08-12 21:00:00 | 381.5 |
| 2012-08-12 22:00:00 | 387.5 |
| 2012-08-12 23:00:00 | 386.25 |
| 2012-08-13 | 388.25 |
| 2012-08-13 01:00:00 | 234 |
| 2012-08-13 02:00:00 | 199.5 |
| 2012-08-13 03:00:00 | 199.75 |
| 2012-08-13 04:00:00 | 201.5 |
| 2012-08-13 05:00:00 | 202.5 |
| 2012-08-13 06:00:00 | 204.25 |
| 2012-08-13 07:00:00 | 198.25 |
| 2012-08-13 08:00:00 | 201 |
| 2012-08-13 09:00:00 | 216.75 |
| 2012-08-13 10:00:00 | 206.5 |
| 2012-08-13 11:00:00 | 206 |
| 2012-08-13 12:00:00 | 206.75 |
| 2012-08-13 13:00:00 | 211.25 |
| 2012-08-13 14:00:00 | 210 |
| 2012-08-13 15:00:00 | 214.75 |
| 2012-08-13 16:00:00 | 206.5 |
| 2012-08-13 17:00:00 | 197.75 |
| 2012-08-13 18:00:00 | 199.5 |
| 2012-08-13 19:00:00 | 202 |
| 2012-08-13 20:00:00 | 201.25 |
| 2012-08-13 21:00:00 | 207.25 |
| 2012-08-13 22:00:00 | 206 |
| 2012-08-13 23:00:00 | 220.5 |
| 2012-08-14 | 220.25 |
| 2012-08-14 01:00:00 | 220.25 |
| 2012-08-14 02:00:00 | 228.75 |
| 2012-08-14 03:00:00 | 212 |
| 2012-08-14 04:00:00 | 203.5 |
| 2012-08-14 05:00:00 | 202.25 |
| 2012-08-14 06:00:00 | 201.5 |
| 2012-08-14 07:00:00 | 198 |
| 2012-08-14 08:00:00 | 202.25 |
| 2012-08-14 09:00:00 | 206.75 |
| 2012-08-14 10:00:00 | 210.75 |
| 2012-08-14 11:00:00 | 219.25 |
| 2012-08-14 12:00:00 | 207.5 |
| 2012-08-14 13:00:00 | 203.5 |
| 2012-08-14 14:00:00 | 207.25 |
| 2012-08-14 15:00:00 | 203.25 |
| 2012-08-14 16:00:00 | 211.5 |
| 2012-08-14 17:00:00 | 206.75 |
| 2012-08-14 18:00:00 | 198.25 |
| 2012-08-14 19:00:00 | 199 |
| 2012-08-14 20:00:00 | 202 |
| 2012-08-14 21:00:00 | 209.25 |
| 2012-08-14 22:00:00 | 206.5 |
| 2012-08-14 23:00:00 | 226.75 |
| 2012-08-15 | 232.75 |
| 2012-08-15 01:00:00 | 222.5 |
| 2012-08-15 02:00:00 | 222.25 |
| 2012-08-15 03:00:00 | 208 |
| 2012-08-15 04:00:00 | 206.75 |
| 2012-08-15 05:00:00 | 208.25 |
| 2012-08-15 06:00:00 | 206 |
| 2012-08-15 07:00:00 | 200.75 |
| 2012-08-15 08:00:00 | 205.75 |
| 2012-08-15 09:00:00 | 208.5 |
| 2012-08-15 10:00:00 | 216.75 |
| 2012-08-15 11:00:00 | 203.5 |
| 2012-08-15 12:00:00 | 200.75 |
| 2012-08-15 13:00:00 | 203.25 |
| 2012-08-15 14:00:00 | 203.25 |
| 2012-08-15 15:00:00 | 201.25 |
| 2012-08-15 16:00:00 | 213.25 |
| 2012-08-15 17:00:00 | 201.75 |
| 2012-08-15 18:00:00 | 198.75 |
| 2012-08-15 19:00:00 | 199 |
| 2012-08-15 20:00:00 | 197 |
| 2012-08-15 21:00:00 | 205.5 |
| 2012-08-15 22:00:00 | 209.75 |
| 2012-08-15 23:00:00 | 227 |
| 2012-08-16 | 228.75 |
| 2012-08-16 01:00:00 | 221.25 |
| 2012-08-16 02:00:00 | 221.25 |
| 2012-08-16 03:00:00 | 207.25 |
| 2012-08-16 04:00:00 | 208.5 |
| 2012-08-16 05:00:00 | 204.5 |
| 2012-08-16 06:00:00 | 202.25 |
| 2012-08-16 07:00:00 | 182.25 |
| 2012-08-16 08:00:00 | 72.25 |
| 2012-08-16 09:00:00 | 12.5 |
| 2012-08-16 10:00:00 | 12.25 |
| 2012-08-16 11:00:00 | 12 |
| 2012-08-16 12:00:00 | 12.25 |
| 2012-08-16 13:00:00 | 44 |
| 2012-08-16 14:00:00 | 111 |
| 2012-08-16 15:00:00 | 167.75 |
| 2012-08-16 16:00:00 | 213.25 |
| 2012-08-16 17:00:00 | 216.75 |
| 2012-08-16 18:00:00 | 215.5 |
| 2012-08-16 19:00:00 | 217 |
| 2012-08-16 20:00:00 | 204.75 |
| 2012-08-16 21:00:00 | 224.25 |
| 2012-08-16 22:00:00 | 273.75 |
| 2012-08-16 23:00:00 | 357.75 |
| 2012-08-17 | 354.25 |
| 2012-08-17 01:00:00 | 342.75 |
| 2012-08-17 02:00:00 | 372.5 |
| 2012-08-17 03:00:00 | 355 |
| 2012-08-17 04:00:00 | 355.25 |
| 2012-08-17 05:00:00 | 323.25 |
| 2012-08-17 06:00:00 | 316.25 |
| 2012-08-17 07:00:00 | 319.75 |
| 2012-08-17 08:00:00 | 318.75 |
| 2012-08-17 09:00:00 | 334 |
| 2012-08-17 10:00:00 | 344 |
| 2012-08-17 11:00:00 | 334 |
| 2012-08-17 12:00:00 | 332.5 |
| 2012-08-17 13:00:00 | 335.5 |
| 2012-08-17 14:00:00 | 333.5 |
| 2012-08-17 15:00:00 | 338.75 |
| 2012-08-17 16:00:00 | 348 |
| 2012-08-17 17:00:00 | 331 |
| 2012-08-17 18:00:00 | 330.5 |
| 2012-08-17 19:00:00 | 330 |
| 2012-08-17 20:00:00 | 330.75 |
| 2012-08-17 21:00:00 | 341 |
| 2012-08-17 22:00:00 | 354 |
| 2012-08-17 23:00:00 | 354.5 |
| 2012-08-18 | 385.5 |
| 2012-08-18 01:00:00 | 370.25 |
| 2012-08-18 02:00:00 | 357.75 |
| 2012-08-18 03:00:00 | 352.25 |
| 2012-08-18 04:00:00 | 346 |
| 2012-08-18 05:00:00 | 362.5 |
| 2012-08-18 06:00:00 | 357.75 |
| 2012-08-18 07:00:00 | 357.25 |
| 2012-08-18 08:00:00 | 366.5 |
| 2012-08-18 09:00:00 | 370.75 |
| 2012-08-18 10:00:00 | 367.25 |
| 2012-08-18 11:00:00 | 376.75 |
| 2012-08-18 12:00:00 | 381.25 |
| 2012-08-18 13:00:00 | 380.5 |
| 2012-08-18 14:00:00 | 373.25 |
| 2012-08-18 15:00:00 | 372.5 |
| 2012-08-18 16:00:00 | 370.25 |
| 2012-08-18 17:00:00 | 369 |
| 2012-08-18 18:00:00 | 371.75 |
| 2012-08-18 19:00:00 | 371 |
| 2012-08-18 20:00:00 | 371 |
| 2012-08-18 21:00:00 | 382.25 |
| 2012-08-18 22:00:00 | 405.75 |
| 2012-08-18 23:00:00 | 401.75 |
| 2012-08-19 | 393.5 |
| 2012-08-19 01:00:00 | 364.5 |
| 2012-08-19 02:00:00 | 351 |
| 2012-08-19 03:00:00 | 352.25 |
| 2012-08-19 04:00:00 | 347 |
| 2012-08-19 05:00:00 | 363 |
| 2012-08-19 06:00:00 | 363.25 |
| 2012-08-19 07:00:00 | 358.25 |
| 2012-08-19 08:00:00 | 360.75 |
| 2012-08-19 09:00:00 | 371.25 |
| 2012-08-19 10:00:00 | 377.75 |
| 2012-08-19 11:00:00 | 371 |
| 2012-08-19 12:00:00 | 371.5 |
| 2012-08-19 13:00:00 | 376.75 |
| 2012-08-19 14:00:00 | 373 |
| 2012-08-19 15:00:00 | 380.75 |
| 2012-08-19 16:00:00 | 388.25 |
| 2012-08-19 17:00:00 | 374.5 |
| 2012-08-19 18:00:00 | 367.25 |
| 2012-08-19 19:00:00 | 376.75 |
| 2012-08-19 20:00:00 | 371.75 |
| 2012-08-19 21:00:00 | 383.5 |
| 2012-08-19 22:00:00 | 389.25 |
| 2012-08-19 23:00:00 | 388.75 |
| 2012-08-20 | 394.5 |
| 2012-08-20 01:00:00 | 362.25 |
| 2012-08-20 02:00:00 | 347.75 |
| 2012-08-20 03:00:00 | 346.75 |
| 2012-08-20 04:00:00 | 346 |
| 2012-08-20 05:00:00 | 366 |
| 2012-08-20 06:00:00 | 378 |
| 2012-08-20 07:00:00 | 368 |
| 2012-08-20 08:00:00 | 358.5 |
| 2012-08-20 09:00:00 | 328.5 |
| 2012-08-20 10:00:00 | 327.5 |
| 2012-08-20 11:00:00 | 330 |
| 2012-08-20 12:00:00 | 341 |
| 2012-08-20 13:00:00 | 347.25 |
| 2012-08-20 14:00:00 | 361.5 |
| 2012-08-20 15:00:00 | 366.25 |
| 2012-08-20 16:00:00 | 358.5 |
| 2012-08-20 17:00:00 | 329.5 |
| 2012-08-20 18:00:00 | 336.25 |
| 2012-08-20 19:00:00 | 340.5 |
| 2012-08-20 20:00:00 | 335.5 |
| 2012-08-20 21:00:00 | 338.25 |
| 2012-08-20 22:00:00 | 339 |
| 2012-08-20 23:00:00 | 356 |
| 2012-08-21 | 369.75 |
| 2012-08-21 01:00:00 | 376.5 |
| 2012-08-21 02:00:00 | 363.75 |
| 2012-08-21 03:00:00 | 346.25 |
| 2012-08-21 04:00:00 | 345.5 |
| 2012-08-21 05:00:00 | 358.25 |
| 2012-08-21 06:00:00 | 368.25 |
| 2012-08-21 07:00:00 | 364 |
| 2012-08-21 08:00:00 | 390.5 |
| 2012-08-21 09:00:00 | 343.25 |
| 2012-08-21 10:00:00 | 349 |
| 2012-08-21 11:00:00 | 348.75 |
| 2012-08-21 12:00:00 | 335.75 |
| 2012-08-21 13:00:00 | 335.75 |
| 2012-08-21 14:00:00 | 339.5 |
| 2012-08-21 15:00:00 | 335.75 |
| 2012-08-21 16:00:00 | 338.25 |
| 2012-08-21 17:00:00 | 333.5 |
| 2012-08-21 18:00:00 | 335 |
| 2012-08-21 19:00:00 | 336.5 |
| 2012-08-21 20:00:00 | 332.75 |
| 2012-08-21 21:00:00 | 336.25 |
| 2012-08-21 22:00:00 | 337.25 |
| 2012-08-21 23:00:00 | 350 |
| 2012-08-22 | 368 |
| 2012-08-22 01:00:00 | 381.5 |
| 2012-08-22 02:00:00 | 364.25 |
| 2012-08-22 03:00:00 | 346.25 |
| 2012-08-22 04:00:00 | 348.25 |
| 2012-08-22 05:00:00 | 364 |
| 2012-08-22 06:00:00 | 366 |
| 2012-08-22 07:00:00 | 376.5 |
| 2012-08-22 08:00:00 | 381.75 |
| 2012-08-22 09:00:00 | 338.5 |
| 2012-08-22 10:00:00 | 342.25 |
| 2012-08-22 11:00:00 | 337.25 |
| 2012-08-22 12:00:00 | 298.75 |
| 2012-08-22 13:00:00 | 339.5 |
| 2012-08-22 14:00:00 | 361.5 |
| 2012-08-22 15:00:00 | 341.5 |
| 2012-08-22 16:00:00 | 349.75 |
| 2012-08-22 17:00:00 | 336.75 |
| 2012-08-22 18:00:00 | 337.25 |
| 2012-08-22 19:00:00 | 338.25 |
| 2012-08-22 20:00:00 | 344.75 |
| 2012-08-22 21:00:00 | 346.5 |
| 2012-08-22 22:00:00 | 351 |
| 2012-08-22 23:00:00 | 385.5 |
| 2012-08-23 | 423.75 |
| 2012-08-23 01:00:00 | 373.75 |
| 2012-08-23 02:00:00 | 368.5 |
| 2012-08-23 03:00:00 | 353 |
| 2012-08-23 04:00:00 | 353 |
| 2012-08-23 05:00:00 | 370.25 |
| 2012-08-23 06:00:00 | 375 |
| 2012-08-23 07:00:00 | 382.75 |
| 2012-08-23 08:00:00 | 279 |
| 2012-08-23 09:00:00 | 260.75 |
| 2012-08-23 10:00:00 | 269.75 |
| 2012-08-23 11:00:00 | 259.25 |
| 2012-08-23 12:00:00 | 261.75 |
| 2012-08-23 13:00:00 | 259.75 |
| 2012-08-23 14:00:00 | 263.75 |
| 2012-08-23 15:00:00 | 261.75 |
| 2012-08-23 16:00:00 | 251 |
| 2012-08-23 17:00:00 | 251.75 |
| 2012-08-23 18:00:00 | 230.5 |
| 2012-08-23 19:00:00 | 228.75 |
| 2012-08-23 20:00:00 | 230.25 |
| 2012-08-23 21:00:00 | 238.5 |
| 2012-08-23 22:00:00 | 237.75 |
| 2012-08-23 23:00:00 | 257.25 |
| 2012-08-24 | 257.25 |
| 2012-08-24 01:00:00 | 229.25 |
| 2012-08-24 02:00:00 | 227.25 |
| 2012-08-24 03:00:00 | 212.25 |
| 2012-08-24 04:00:00 | 210.75 |
| 2012-08-24 05:00:00 | 214.25 |
| 2012-08-24 06:00:00 | 230.75 |
| 2012-08-24 07:00:00 | 234.25 |
| 2012-08-24 08:00:00 | 242.5 |
| 2012-08-24 09:00:00 | 234.5 |
| 2012-08-24 10:00:00 | 272 |
| 2012-08-24 11:00:00 | 336 |
| 2012-08-24 12:00:00 | 322.25 |
| 2012-08-24 13:00:00 | 376.5 |
| 2012-08-24 14:00:00 | 405.25 |
| 2012-08-24 15:00:00 | 322.5 |
| 2012-08-24 16:00:00 | 339 |
| 2012-08-24 17:00:00 | 373 |
| 2012-08-24 18:00:00 | 399.25 |
| 2012-08-24 19:00:00 | 340.75 |
| 2012-08-24 20:00:00 | 331.75 |
| 2012-08-24 21:00:00 | 335.25 |
| 2012-08-24 22:00:00 | 342.75 |
| 2012-08-24 23:00:00 | 343.25 |
| 2012-08-25 | 384 |
| 2012-08-25 01:00:00 | 371 |
| 2012-08-25 02:00:00 | 373.75 |
| 2012-08-25 03:00:00 | 367.75 |
| 2012-08-25 04:00:00 | 350.5 |
| 2012-08-25 05:00:00 | 362.75 |
| 2012-08-25 06:00:00 | 369.25 |
| 2012-08-25 07:00:00 | 375.75 |
| 2012-08-25 08:00:00 | 382.5 |
| 2012-08-25 09:00:00 | 392.25 |
| 2012-08-25 10:00:00 | 403.5 |
| 2012-08-25 11:00:00 | 395.25 |
| 2012-08-25 12:00:00 | 386.75 |
| 2012-08-25 13:00:00 | 389.5 |
| 2012-08-25 14:00:00 | 382.75 |
| 2012-08-25 15:00:00 | 369.5 |
| 2012-08-25 16:00:00 | 372.5 |
| 2012-08-25 17:00:00 | 370.5 |
| 2012-08-25 18:00:00 | 372 |
| 2012-08-25 19:00:00 | 375.25 |
| 2012-08-25 20:00:00 | 374.75 |
| 2012-08-25 21:00:00 | 382.25 |
| 2012-08-25 22:00:00 | 384 |
| 2012-08-25 23:00:00 | 387.5 |
| 2012-08-26 | 386.5 |
| 2012-08-26 01:00:00 | 358.5 |
| 2012-08-26 02:00:00 | 357.75 |
| 2012-08-26 03:00:00 | 375 |
| 2012-08-26 04:00:00 | 373.75 |
| 2012-08-26 05:00:00 | 382 |
| 2012-08-26 06:00:00 | 390 |
| 2012-08-26 07:00:00 | 372.5 |
| 2012-08-26 08:00:00 | 365.25 |
| 2012-08-26 09:00:00 | 369.25 |
| 2012-08-26 10:00:00 | 377.5 |
| 2012-08-26 11:00:00 | 397 |
| 2012-08-26 12:00:00 | 398.5 |
| 2012-08-26 13:00:00 | 398 |
| 2012-08-26 14:00:00 | 372.25 |
| 2012-08-26 15:00:00 | 379.75 |
| 2012-08-26 16:00:00 | 377.5 |
| 2012-08-26 17:00:00 | 380.75 |
| 2012-08-26 18:00:00 | 375 |
| 2012-08-26 19:00:00 | 372 |
| 2012-08-26 20:00:00 | 373.75 |
| 2012-08-26 21:00:00 | 377.25 |
| 2012-08-26 22:00:00 | 383.5 |
| 2012-08-26 23:00:00 | 397.5 |
| 2012-08-27 | 402.25 |
| 2012-08-27 01:00:00 | 377.25 |
| 2012-08-27 02:00:00 | 373 |
| 2012-08-27 03:00:00 | 367 |
| 2012-08-27 04:00:00 | 357.5 |
| 2012-08-27 05:00:00 | 367 |
| 2012-08-27 06:00:00 | 360.25 |
| 2012-08-27 07:00:00 | 326.25 |
| 2012-08-27 08:00:00 | 331.5 |
| 2012-08-27 09:00:00 | 345 |
| 2012-08-27 10:00:00 | 349 |
| 2012-08-27 11:00:00 | 341 |
| 2012-08-27 12:00:00 | 338.5 |
| 2012-08-27 13:00:00 | 340.5 |
| 2012-08-27 14:00:00 | 368 |
| 2012-08-27 15:00:00 | 371 |
| 2012-08-27 16:00:00 | 376 |
| 2012-08-27 17:00:00 | 371 |
| 2012-08-27 18:00:00 | 388 |
| 2012-08-27 19:00:00 | 392.25 |
| 2012-08-27 20:00:00 | 330.75 |
| 2012-08-27 21:00:00 | 335.25 |
| 2012-08-27 22:00:00 | 347 |
| 2012-08-27 23:00:00 | 369 |
| 2012-08-28 | 387 |
| 2012-08-28 01:00:00 | 369.75 |
| 2012-08-28 02:00:00 | 368.75 |
| 2012-08-28 03:00:00 | 353.25 |
| 2012-08-28 04:00:00 | 354.25 |
| 2012-08-28 05:00:00 | 379.75 |
| 2012-08-28 06:00:00 | 382.5 |
| 2012-08-28 07:00:00 | 383.25 |
| 2012-08-28 08:00:00 | 345.25 |
| 2012-08-28 09:00:00 | 349.25 |
| 2012-08-28 10:00:00 | 359.5 |
| 2012-08-28 11:00:00 | 343.25 |
| 2012-08-28 12:00:00 | 329.5 |
| 2012-08-28 13:00:00 | 352.75 |
| 2012-08-28 14:00:00 | 348.75 |
| 2012-08-28 15:00:00 | 352 |
| 2012-08-28 16:00:00 | 343.75 |
| 2012-08-28 17:00:00 | 330.25 |
| 2012-08-28 18:00:00 | 330.25 |
| 2012-08-28 19:00:00 | 336 |
| 2012-08-28 20:00:00 | 334.75 |
| 2012-08-28 21:00:00 | 335.5 |
| 2012-08-28 22:00:00 | 343 |
| 2012-08-28 23:00:00 | 370 |
| 2012-08-29 | 382.75 |
| 2012-08-29 01:00:00 | 372.25 |
| 2012-08-29 02:00:00 | 367.25 |
| 2012-08-29 03:00:00 | 350.75 |
| 2012-08-29 04:00:00 | 354.25 |
| 2012-08-29 05:00:00 | 369.75 |
| 2012-08-29 06:00:00 | 381.5 |
| 2012-08-29 07:00:00 | 351.5 |
| 2012-08-29 08:00:00 | 335.75 |
| 2012-08-29 09:00:00 | 349.25 |
| 2012-08-29 10:00:00 | 342 |
| 2012-08-29 11:00:00 | 337.25 |
| 2012-08-29 12:00:00 | 341.25 |
| 2012-08-29 13:00:00 | 341.5 |
| 2012-08-29 14:00:00 | 337.75 |
| 2012-08-29 15:00:00 | 337.25 |
| 2012-08-29 16:00:00 | 335.75 |
| 2012-08-29 17:00:00 | 328.25 |
| 2012-08-29 18:00:00 | 329 |
| 2012-08-29 19:00:00 | 330.5 |
| 2012-08-29 20:00:00 | 332.75 |
| 2012-08-29 21:00:00 | 337.25 |
| 2012-08-29 22:00:00 | 338.75 |
| 2012-08-29 23:00:00 | 360.75 |
| 2012-08-30 | 370.5 |
| 2012-08-30 01:00:00 | 368.75 |
| 2012-08-30 02:00:00 | 370.5 |
| 2012-08-30 03:00:00 | 348.25 |
| 2012-08-30 04:00:00 | 345.5 |
| 2012-08-30 05:00:00 | 362.25 |
| 2012-08-30 06:00:00 | 337.75 |
| 2012-08-30 07:00:00 | 323 |
| 2012-08-30 08:00:00 | 343.5 |
| 2012-08-30 09:00:00 | 340.25 |
| 2012-08-30 10:00:00 | 361.25 |
| 2012-08-30 11:00:00 | 393.25 |
| 2012-08-30 12:00:00 | 374.75 |
| 2012-08-30 13:00:00 | 351.5 |
| 2012-08-30 14:00:00 | 332.25 |
| 2012-08-30 15:00:00 | 326.5 |
| 2012-08-30 16:00:00 | 333 |
| 2012-08-30 17:00:00 | 324.25 |
| 2012-08-30 18:00:00 | 322.75 |
| 2012-08-30 19:00:00 | 321.25 |
| 2012-08-30 20:00:00 | 331.5 |
| 2012-08-30 21:00:00 | 326.5 |
| 2012-08-30 22:00:00 | 329.75 |
| 2012-08-30 23:00:00 | 349.75 |
| 2012-08-31 | 359.25 |
| 2012-08-31 01:00:00 | 358 |
| 2012-08-31 02:00:00 | 355 |
| 2012-08-31 03:00:00 | 336.5 |
| 2012-08-31 04:00:00 | 337.25 |
| 2012-08-31 05:00:00 | 346.25 |
| 2012-08-31 06:00:00 | 364.5 |
| 2012-08-31 07:00:00 | 362.75 |
| 2012-08-31 08:00:00 | 364.75 |
| 2012-08-31 09:00:00 | 359.25 |
| 2012-08-31 10:00:00 | 360.75 |
| 2012-08-31 11:00:00 | 397.5 |
| 2012-08-31 12:00:00 | 420.75 |
| 2012-08-31 13:00:00 | 398.5 |
| 2012-08-31 14:00:00 | 351 |
| 2012-08-31 15:00:00 | 325 |
| 2012-08-31 16:00:00 | 331.75 |
| 2012-08-31 17:00:00 | 342.5 |
| 2012-08-31 18:00:00 | 326.25 |
| 2012-08-31 19:00:00 | 327.5 |
| 2012-08-31 20:00:00 | 323.25 |
| 2012-08-31 21:00:00 | 325 |
| 2012-08-31 22:00:00 | 323 |
| 2012-08-31 23:00:00 | 384.5 |
| 2012-09-01 | 379 |
| 2012-09-01 01:00:00 | 358.5 |
| 2012-09-01 02:00:00 | 356.25 |
| 2012-09-01 03:00:00 | 343.75 |
| 2012-09-01 04:00:00 | 337.5 |
| 2012-09-01 05:00:00 | 344 |
| 2012-09-01 06:00:00 | 353 |
| 2012-09-01 07:00:00 | 354.25 |
| 2012-09-01 08:00:00 | 341.25 |
| 2012-09-01 09:00:00 | 363.75 |
| 2012-09-01 10:00:00 | 365.75 |
| 2012-09-01 11:00:00 | 373.25 |
| 2012-09-01 12:00:00 | 391.75 |
| 2012-09-01 13:00:00 | 346.5 |
| 2012-09-01 14:00:00 | 321.25 |
| 2012-09-01 15:00:00 | 312.25 |
| 2012-09-01 16:00:00 | 314 |
| 2012-09-01 17:00:00 | 310.75 |
| 2012-09-01 18:00:00 | 310 |
| 2012-09-01 19:00:00 | 312 |
| 2012-09-01 20:00:00 | 365.5 |
| 2012-09-01 21:00:00 | 383 |
| 2012-09-01 22:00:00 | 375.25 |
| 2012-09-01 23:00:00 | 378.25 |
| 2012-09-02 | 375 |
| 2012-09-02 01:00:00 | 355 |
| 2012-09-02 02:00:00 | 353.5 |
| 2012-09-02 03:00:00 | 344.25 |
| 2012-09-02 04:00:00 | 337.25 |
| 2012-09-02 05:00:00 | 347.5 |
| 2012-09-02 06:00:00 | 349.25 |
| 2012-09-02 07:00:00 | 187 |
| 2012-09-02 08:00:00 | 49 |
| 2012-09-02 09:00:00 | 82.25 |
| 2012-09-02 10:00:00 | 84.25 |
| 2012-09-02 11:00:00 | 84 |
| 2012-09-02 12:00:00 | 85.5 |
| 2012-09-02 13:00:00 | 84 |
| 2012-09-02 14:00:00 | 87.75 |
| 2012-09-02 15:00:00 | 92 |
| 2012-09-02 16:00:00 | 93.5 |
| 2012-09-02 17:00:00 | 94.5 |
| 2012-09-02 18:00:00 | 89 |
| 2012-09-02 19:00:00 | 79.25 |
| 2012-09-02 20:00:00 | 76 |
| 2012-09-02 21:00:00 | 81 |
| 2012-09-02 22:00:00 | 93.75 |
| 2012-09-02 23:00:00 | 89.25 |
| 2012-09-03 | 84.25 |
| 2012-09-03 01:00:00 | 88.25 |
| 2012-09-03 02:00:00 | 80 |
| 2012-09-03 03:00:00 | 79.75 |
| 2012-09-03 04:00:00 | 79.75 |
| 2012-09-03 05:00:00 | 79.25 |
| 2012-09-03 06:00:00 | 80.25 |
| 2012-09-03 07:00:00 | 94.75 |
| 2012-09-03 08:00:00 | 98.25 |
| 2012-09-03 09:00:00 | 109.5 |
| 2012-09-03 10:00:00 | 107.25 |
| 2012-09-03 11:00:00 | 102.25 |
| 2012-09-03 12:00:00 | 105.5 |
| 2012-09-03 13:00:00 | 108.25 |
| 2012-09-03 14:00:00 | 111.25 |
| 2012-09-03 15:00:00 | 108 |
| 2012-09-03 16:00:00 | 101 |
| 2012-09-03 17:00:00 | 99.5 |
| 2012-09-03 18:00:00 | 98 |
| 2012-09-03 19:00:00 | 96.25 |
| 2012-09-03 20:00:00 | 96 |
| 2012-09-03 21:00:00 | 87.5 |
| 2012-09-03 22:00:00 | 79.5 |
| 2012-09-03 23:00:00 | 80 |
| 2012-09-04 | 80.25 |
| 2012-09-04 01:00:00 | 79.5 |
| 2012-09-04 02:00:00 | 84.75 |
| 2012-09-04 03:00:00 | 80.75 |
| 2012-09-04 04:00:00 | 79.75 |
| 2012-09-04 05:00:00 | 79.75 |
| 2012-09-04 06:00:00 | 81.5 |
| 2012-09-04 07:00:00 | 82.5 |
| 2012-09-04 08:00:00 | 94.5 |
| 2012-09-04 09:00:00 | 94.75 |
| 2012-09-04 10:00:00 | 89.75 |
| 2012-09-04 11:00:00 | 91.75 |
| 2012-09-04 12:00:00 | 88.25 |
| 2012-09-04 13:00:00 | 95.25 |
| 2012-09-04 14:00:00 | 95 |
| 2012-09-04 15:00:00 | 84 |
| 2012-09-04 16:00:00 | 81.75 |
| 2012-09-04 17:00:00 | 80.25 |
| 2012-09-04 18:00:00 | 80.25 |
| 2012-09-04 19:00:00 | 81 |
| 2012-09-04 20:00:00 | 79.75 |
| 2012-09-04 21:00:00 | 81.5 |
| 2012-09-04 22:00:00 | 81.75 |
| 2012-09-04 23:00:00 | 81.25 |
| 2012-09-05 | 81.5 |
| 2012-09-05 01:00:00 | 84.5 |
| 2012-09-05 02:00:00 | 81 |
| 2012-09-05 03:00:00 | 81.25 |
| 2012-09-05 04:00:00 | 81.25 |
| 2012-09-05 05:00:00 | 81.5 |
| 2012-09-05 06:00:00 | 84.5 |
| 2012-09-05 07:00:00 | 87.75 |
| 2012-09-05 08:00:00 | 97 |
| 2012-09-05 09:00:00 | 98.75 |
| 2012-09-05 10:00:00 | 97.25 |
| 2012-09-05 11:00:00 | 86.5 |
| 2012-09-05 12:00:00 | 89.5 |
| 2012-09-05 13:00:00 | 88.75 |
| 2012-09-05 14:00:00 | 93.5 |
| 2012-09-05 15:00:00 | 82 |
| 2012-09-05 16:00:00 | 79 |
| 2012-09-05 17:00:00 | 78 |
| 2012-09-05 18:00:00 | 76 |
| 2012-09-05 19:00:00 | 77.5 |
| 2012-09-05 20:00:00 | 75.75 |
| 2012-09-05 21:00:00 | 78.5 |
| 2012-09-05 22:00:00 | 78 |
| 2012-09-05 23:00:00 | 78.25 |
| 2012-09-06 | 78.75 |
| 2012-09-06 01:00:00 | 81.75 |
| 2012-09-06 02:00:00 | 79 |
| 2012-09-06 03:00:00 | 81.25 |
| 2012-09-06 04:00:00 | 79 |
| 2012-09-06 05:00:00 | 79.25 |
| 2012-09-06 06:00:00 | 83.75 |
| 2012-09-06 07:00:00 | 84.25 |
| 2012-09-06 08:00:00 | 73.5 |
| 2012-09-06 09:00:00 | 65.75 |
| 2012-09-06 10:00:00 | 57.5 |
| 2012-09-06 11:00:00 | 52.5 |
| 2012-09-06 12:00:00 | 59 |
| 2012-09-06 13:00:00 | 55.75 |
| 2012-09-06 14:00:00 | 65.75 |
| 2012-09-06 15:00:00 | 80.5 |
| 2012-09-06 16:00:00 | 79 |
| 2012-09-06 17:00:00 | 78.5 |
| 2012-09-06 18:00:00 | 81 |
| 2012-09-06 19:00:00 | 75.75 |
| 2012-09-06 20:00:00 | 78 |
| 2012-09-06 21:00:00 | 79.75 |
| 2012-09-06 22:00:00 | 79.5 |
| 2012-09-06 23:00:00 | 79.75 |
| 2012-09-07 | 83 |
| 2012-09-07 01:00:00 | 79.5 |
| 2012-09-07 02:00:00 | 80 |
| 2012-09-07 03:00:00 | 79.75 |
| 2012-09-07 04:00:00 | 80.25 |
| 2012-09-07 05:00:00 | 81 |
| 2012-09-07 06:00:00 | 83.5 |
| 2012-09-07 07:00:00 | 79 |
| 2012-09-07 08:00:00 | 88 |
| 2012-09-07 09:00:00 | 86 |
| 2012-09-07 10:00:00 | 85.25 |
| 2012-09-07 11:00:00 | 84.25 |
| 2012-09-07 12:00:00 | 90.5 |
| 2012-09-07 13:00:00 | 90.5 |
| 2012-09-07 14:00:00 | 90.5 |
| 2012-09-07 15:00:00 | 81.5 |
| 2012-09-07 16:00:00 | 78.5 |
| 2012-09-07 17:00:00 | 82 |
| 2012-09-07 18:00:00 | 76 |
| 2012-09-07 19:00:00 | 73.75 |
| 2012-09-07 20:00:00 | 76.75 |
| 2012-09-07 21:00:00 | 77.75 |
| 2012-09-07 22:00:00 | 78 |
| 2012-09-07 23:00:00 | 81 |
| 2012-09-08 | 78 |
| 2012-09-08 01:00:00 | 78.25 |
| 2012-09-08 02:00:00 | 77.75 |
| 2012-09-08 03:00:00 | 77.5 |
| 2012-09-08 04:00:00 | 79.5 |
| 2012-09-08 05:00:00 | 80.25 |
| 2012-09-08 06:00:00 | 77.75 |
| 2012-09-08 07:00:00 | 76.25 |
| 2012-09-08 08:00:00 | 75.75 |
| 2012-09-08 09:00:00 | 76.5 |
| 2012-09-08 10:00:00 | 79.5 |
| 2012-09-08 11:00:00 | 76.5 |
| 2012-09-08 12:00:00 | 76.25 |
| 2012-09-08 13:00:00 | 77.5 |
| 2012-09-08 14:00:00 | 77.5 |
| 2012-09-08 15:00:00 | 77 |
| 2012-09-08 16:00:00 | 76.5 |
| 2012-09-08 17:00:00 | 79.75 |
| 2012-09-08 18:00:00 | 75.5 |
| 2012-09-08 19:00:00 | 76.75 |
| 2012-09-08 20:00:00 | 79.75 |
| 2012-09-08 21:00:00 | 81 |
| 2012-09-08 22:00:00 | 81.25 |
| 2012-09-08 23:00:00 | 84.75 |
| 2012-09-09 | 81 |
| 2012-09-09 01:00:00 | 82 |
| 2012-09-09 02:00:00 | 81.5 |
| 2012-09-09 03:00:00 | 81 |
| 2012-09-09 04:00:00 | 82 |
| 2012-09-09 05:00:00 | 85 |
| 2012-09-09 06:00:00 | 79.25 |
| 2012-09-09 07:00:00 | 74.25 |
| 2012-09-09 08:00:00 | 74 |
| 2012-09-09 09:00:00 | 77.25 |
| 2012-09-09 10:00:00 | 79.75 |
| 2012-09-09 11:00:00 | 76.75 |
| 2012-09-09 12:00:00 | 77 |
| 2012-09-09 13:00:00 | 76.25 |
| 2012-09-09 14:00:00 | 74.75 |
| 2012-09-09 15:00:00 | 74.25 |
| 2012-09-09 16:00:00 | 79.25 |
| 2012-09-09 17:00:00 | 74.5 |
| 2012-09-09 18:00:00 | 75 |
| 2012-09-09 19:00:00 | 74.25 |
| 2012-09-09 20:00:00 | 75.75 |
| 2012-09-09 21:00:00 | 76.5 |
| 2012-09-09 22:00:00 | 77.25 |
| 2012-09-09 23:00:00 | 81.25 |
| 2012-09-10 | 77.75 |
| 2012-09-10 01:00:00 | 78 |
| 2012-09-10 02:00:00 | 78.25 |
| 2012-09-10 03:00:00 | 77.75 |
| 2012-09-10 04:00:00 | 78.25 |
| 2012-09-10 05:00:00 | 83 |
| 2012-09-10 06:00:00 | 80.5 |
| 2012-09-10 07:00:00 | 82.5 |
| 2012-09-10 08:00:00 | 93.5 |
| 2012-09-10 09:00:00 | 91 |
| 2012-09-10 10:00:00 | 92.25 |
| 2012-09-10 11:00:00 | 92.25 |
| 2012-09-10 12:00:00 | 89.5 |
| 2012-09-10 13:00:00 | 87.75 |
| 2012-09-10 14:00:00 | 84.5 |
| 2012-09-10 15:00:00 | 81.5 |
| 2012-09-10 16:00:00 | 84.5 |
| 2012-09-10 17:00:00 | 80.25 |
| 2012-09-10 18:00:00 | 79.5 |
| 2012-09-10 19:00:00 | 76.75 |
| 2012-09-10 20:00:00 | 78.5 |
| 2012-09-10 21:00:00 | 81 |
| 2012-09-10 22:00:00 | 81 |
| 2012-09-10 23:00:00 | 85 |
| 2012-09-11 | 81.25 |
| 2012-09-11 01:00:00 | 81 |
| 2012-09-11 02:00:00 | 81 |
| 2012-09-11 03:00:00 | 81 |
| 2012-09-11 04:00:00 | 81.5 |
| 2012-09-11 05:00:00 | 85.75 |
| 2012-09-11 06:00:00 | 81.5 |
| 2012-09-11 07:00:00 | 77.5 |
| 2012-09-11 08:00:00 | 86.75 |
| 2012-09-11 09:00:00 | 58.75 |
| 2012-09-11 10:00:00 | 46 |
| 2012-09-11 11:00:00 | 54 |
| 2012-09-11 12:00:00 | 51.75 |
| 2012-09-11 13:00:00 | 52.75 |
| 2012-09-11 14:00:00 | 48.75 |
| 2012-09-11 15:00:00 | 82.25 |
| 2012-09-11 16:00:00 | 82.5 |
| 2012-09-11 17:00:00 | 77 |
| 2012-09-11 18:00:00 | 75.25 |
| 2012-09-11 19:00:00 | 73.5 |
| 2012-09-11 20:00:00 | 75.75 |
| 2012-09-11 21:00:00 | 77.5 |
| 2012-09-11 22:00:00 | 81.25 |
| 2012-09-11 23:00:00 | 76.75 |
| 2012-09-12 | 77 |
| 2012-09-12 01:00:00 | 77 |
| 2012-09-12 02:00:00 | 78 |
| 2012-09-12 03:00:00 | 77.25 |
| 2012-09-12 04:00:00 | 77.25 |
| 2012-09-12 05:00:00 | 81.25 |
| 2012-09-12 06:00:00 | 78.75 |
| 2012-09-12 07:00:00 | 78.5 |
| 2012-09-12 08:00:00 | 89.25 |
| 2012-09-12 09:00:00 | 89.75 |
| 2012-09-12 10:00:00 | 93 |
| 2012-09-12 11:00:00 | 89 |
| 2012-09-12 12:00:00 | 90.5 |
| 2012-09-12 13:00:00 | 91.75 |
| 2012-09-12 14:00:00 | 91.5 |
| 2012-09-12 15:00:00 | 89.5 |
| 2012-09-12 16:00:00 | 85 |
| 2012-09-12 17:00:00 | 80.25 |
| 2012-09-12 18:00:00 | 79.25 |
| 2012-09-12 19:00:00 | 78.75 |
| 2012-09-12 20:00:00 | 79.75 |
| 2012-09-12 21:00:00 | 84.5 |
| 2012-09-12 22:00:00 | 81 |
| 2012-09-12 23:00:00 | 81 |
| 2012-09-13 | 81 |
| 2012-09-13 01:00:00 | 80.5 |
| 2012-09-13 02:00:00 | 81.5 |
| 2012-09-13 03:00:00 | 80.5 |
| 2012-09-13 04:00:00 | 81.5 |
| 2012-09-13 05:00:00 | 85 |
| 2012-09-13 06:00:00 | 83.5 |
| 2012-09-13 07:00:00 | 85.25 |
| 2012-09-13 08:00:00 | 95.25 |
| 2012-09-13 09:00:00 | 105.25 |
| 2012-09-13 10:00:00 | 97 |
| 2012-09-13 11:00:00 | 96 |
| 2012-09-13 12:00:00 | 101.75 |
| 2012-09-13 13:00:00 | 94.5 |
| 2012-09-13 14:00:00 | 97.5 |
| 2012-09-13 15:00:00 | 90 |
| 2012-09-13 16:00:00 | 85.75 |
| 2012-09-13 17:00:00 | 85.5 |
| 2012-09-13 18:00:00 | 82.5 |
| 2012-09-13 19:00:00 | 79.75 |
| 2012-09-13 20:00:00 | 84.5 |
| 2012-09-13 21:00:00 | 80 |
| 2012-09-13 22:00:00 | 81.5 |
| 2012-09-13 23:00:00 | 81.25 |
| 2012-09-14 | 82.25 |
| 2012-09-14 01:00:00 | 85 |
| 2012-09-14 02:00:00 | 81.25 |
| 2012-09-14 03:00:00 | 82 |
| 2012-09-14 04:00:00 | 81.5 |
| 2012-09-14 05:00:00 | 82.75 |
| 2012-09-14 06:00:00 | 82.5 |
| 2012-09-14 07:00:00 | 85 |
| 2012-09-14 08:00:00 | 98.75 |
| 2012-09-14 09:00:00 | 93.75 |
| 2012-09-14 10:00:00 | 88.75 |
| 2012-09-14 11:00:00 | 87 |
| 2012-09-14 12:00:00 | 86.5 |
| 2012-09-14 13:00:00 | 90 |
| 2012-09-14 14:00:00 | 86.75 |
| 2012-09-14 15:00:00 | 86.5 |
| 2012-09-14 16:00:00 | 82.25 |
| 2012-09-14 17:00:00 | 79.5 |
| 2012-09-14 18:00:00 | 81.25 |
| 2012-09-14 19:00:00 | 76.25 |
| 2012-09-14 20:00:00 | 78.75 |
| 2012-09-14 21:00:00 | 79.75 |
| 2012-09-14 22:00:00 | 78.75 |
| 2012-09-14 23:00:00 | 78.75 |
| 2012-09-15 | 82.25 |
| 2012-09-15 01:00:00 | 78.25 |
| 2012-09-15 02:00:00 | 78.75 |
| 2012-09-15 03:00:00 | 79.25 |
| 2012-09-15 04:00:00 | 79 |
| 2012-09-15 05:00:00 | 83 |
| 2012-09-15 06:00:00 | 79 |
| 2012-09-15 07:00:00 | 77 |
| 2012-09-15 08:00:00 | 80.5 |
| 2012-09-15 09:00:00 | 80.75 |
| 2012-09-15 10:00:00 | 80.25 |
| 2012-09-15 11:00:00 | 80.25 |
| 2012-09-15 12:00:00 | 82.75 |
| 2012-09-15 13:00:00 | 78 |
| 2012-09-15 14:00:00 | 77.5 |
| 2012-09-15 15:00:00 | 79.25 |
| 2012-09-15 16:00:00 | 78 |
| 2012-09-15 17:00:00 | 78.75 |
| 2012-09-15 18:00:00 | 78.75 |
| 2012-09-15 19:00:00 | 83.5 |
| 2012-09-15 20:00:00 | 92.75 |
| 2012-09-15 21:00:00 | 90.75 |
| 2012-09-15 22:00:00 | 79 |
| 2012-09-15 23:00:00 | 79.25 |
| 2012-09-16 | 79.25 |
| 2012-09-16 01:00:00 | 78.75 |
| 2012-09-16 02:00:00 | 79.5 |
| 2012-09-16 03:00:00 | 82.5 |
| 2012-09-16 04:00:00 | 79 |
| 2012-09-16 05:00:00 | 80.25 |
| 2012-09-16 06:00:00 | 79 |
| 2012-09-16 07:00:00 | 76.5 |
| 2012-09-16 08:00:00 | 76.75 |
| 2012-09-16 09:00:00 | 79.5 |
| 2012-09-16 10:00:00 | 82.75 |
| 2012-09-16 11:00:00 | 81.5 |
| 2012-09-16 12:00:00 | 80.75 |
| 2012-09-16 13:00:00 | 82 |
| 2012-09-16 14:00:00 | 77 |
| 2012-09-16 15:00:00 | 80 |
| 2012-09-16 16:00:00 | 76.25 |
| 2012-09-16 17:00:00 | 74.25 |
| 2012-09-16 18:00:00 | 75.75 |
| 2012-09-16 19:00:00 | 85.25 |
| 2012-09-16 20:00:00 | 94.5 |
| 2012-09-16 21:00:00 | 92 |
| 2012-09-16 22:00:00 | 81 |
| 2012-09-16 23:00:00 | 81.5 |
| 2012-09-17 | 81.5 |
| 2012-09-17 01:00:00 | 82 |
| 2012-09-17 02:00:00 | 82.75 |
| 2012-09-17 03:00:00 | 85.75 |
| 2012-09-17 04:00:00 | 82.25 |
| 2012-09-17 05:00:00 | 83 |
| 2012-09-17 06:00:00 | 83.75 |
| 2012-09-17 07:00:00 | 81.75 |
| 2012-09-17 08:00:00 | 84.5 |
| 2012-09-17 09:00:00 | 93.25 |
| 2012-09-17 10:00:00 | 89 |
| 2012-09-17 11:00:00 | 86.5 |
| 2012-09-17 12:00:00 | 83.25 |
| 2012-09-17 13:00:00 | 82.25 |
| 2012-09-17 14:00:00 | 82 |
| 2012-09-17 15:00:00 | 79.5 |
| 2012-09-17 16:00:00 | 76.25 |
| 2012-09-17 17:00:00 | 76.75 |
| 2012-09-17 18:00:00 | 80.5 |
| 2012-09-17 19:00:00 | 73.5 |
| 2012-09-17 20:00:00 | 79 |
| 2012-09-17 21:00:00 | 80.75 |
| 2012-09-17 22:00:00 | 80.5 |
| 2012-09-17 23:00:00 | 86.25 |
| 2012-09-18 | 94.75 |
| 2012-09-18 01:00:00 | 87.5 |
| 2012-09-18 02:00:00 | 81 |
| 2012-09-18 03:00:00 | 80.75 |
| 2012-09-18 04:00:00 | 81 |
| 2012-09-18 05:00:00 | 89.5 |
| 2012-09-18 06:00:00 | 86.5 |
| 2012-09-18 07:00:00 | 83 |
| 2012-09-18 08:00:00 | 69 |
| 2012-09-18 09:00:00 | 51.75 |
| 2012-09-18 10:00:00 | 51 |
| 2012-09-18 11:00:00 | 62.25 |
| 2012-09-18 12:00:00 | 81.5 |
| 2012-09-18 13:00:00 | 80.25 |
| 2012-09-18 14:00:00 | 85.5 |
| 2012-09-18 15:00:00 | 79 |
| 2012-09-18 16:00:00 | 78.25 |
| 2012-09-18 17:00:00 | 77 |
| 2012-09-18 18:00:00 | 76.25 |
| 2012-09-18 19:00:00 | 75.75 |
| 2012-09-18 20:00:00 | 79.25 |
| 2012-09-18 21:00:00 | 80 |
| 2012-09-18 22:00:00 | 78 |
| 2012-09-18 23:00:00 | 87.75 |
| 2012-09-19 | 89.75 |
| 2012-09-19 01:00:00 | 78.5 |
| 2012-09-19 02:00:00 | 78.75 |
| 2012-09-19 03:00:00 | 78.75 |
| 2012-09-19 04:00:00 | 80.75 |
| 2012-09-19 05:00:00 | 84.75 |
| 2012-09-19 06:00:00 | 84.25 |
| 2012-09-19 07:00:00 | 79.75 |
| 2012-09-19 08:00:00 | 83.25 |
| 2012-09-19 09:00:00 | 82.5 |
| 2012-09-19 10:00:00 | 82.75 |
| 2012-09-19 11:00:00 | 82.25 |
| 2012-09-19 12:00:00 | 81.75 |
| 2012-09-19 13:00:00 | 92.25 |
| 2012-09-19 14:00:00 | 91.75 |
| 2012-09-19 15:00:00 | 87.75 |
| 2012-09-19 16:00:00 | 81.25 |
| 2012-09-19 17:00:00 | 80 |
| 2012-09-19 18:00:00 | 81 |
| 2012-09-19 19:00:00 | 78.5 |
| 2012-09-19 20:00:00 | 81.5 |
| 2012-09-19 21:00:00 | 82 |
| 2012-09-19 22:00:00 | 79.5 |
| 2012-09-19 23:00:00 | 87.5 |
| 2012-09-20 | 99.25 |
| 2012-09-20 01:00:00 | 99 |
| 2012-09-20 02:00:00 | 99.25 |
| 2012-09-20 03:00:00 | 98.25 |
| 2012-09-20 04:00:00 | 82 |
| 2012-09-20 05:00:00 | 81.25 |
| 2012-09-20 06:00:00 | 82 |
| 2012-09-20 07:00:00 | 85.25 |
| 2012-09-20 08:00:00 | 89.25 |
| 2012-09-20 09:00:00 | 90.75 |
| 2012-09-20 10:00:00 | 86.75 |
| 2012-09-20 11:00:00 | 89.5 |
| 2012-09-20 12:00:00 | 87.5 |
| 2012-09-20 13:00:00 | 87.5 |
| 2012-09-20 14:00:00 | 89 |
| 2012-09-20 15:00:00 | 84.5 |
| 2012-09-20 16:00:00 | 80.5 |
| 2012-09-20 17:00:00 | 83 |
| 2012-09-20 18:00:00 | 78.25 |
| 2012-09-20 19:00:00 | 77.25 |
| 2012-09-20 20:00:00 | 83.25 |
| 2012-09-20 21:00:00 | 80.75 |
| 2012-09-20 22:00:00 | 80.25 |
| 2012-09-20 23:00:00 | 94.75 |
| 2012-09-21 | 109.25 |
| 2012-09-21 01:00:00 | 108.75 |
| 2012-09-21 02:00:00 | 108.25 |
| 2012-09-21 03:00:00 | 89 |
| 2012-09-21 04:00:00 | 82.5 |
| 2012-09-21 05:00:00 | 81.5 |
| 2012-09-21 06:00:00 | 82.5 |
| 2012-09-21 07:00:00 | 86.5 |
| 2012-09-21 08:00:00 | 87.5 |
| 2012-09-21 09:00:00 | 89.25 |
| 2012-09-21 10:00:00 | 92.25 |
| 2012-09-21 11:00:00 | 88 |
| 2012-09-21 12:00:00 | 90.75 |
| 2012-09-21 13:00:00 | 88 |
| 2012-09-21 14:00:00 | 83.5 |
| 2012-09-21 15:00:00 | 82.75 |
| 2012-09-21 16:00:00 | 78.25 |
| 2012-09-21 17:00:00 | 77.75 |
| 2012-09-21 18:00:00 | 80.5 |
| 2012-09-21 19:00:00 | 74.5 |
| 2012-09-21 20:00:00 | 79.25 |
| 2012-09-21 21:00:00 | 79.5 |
| 2012-09-21 22:00:00 | 79.75 |
| 2012-09-21 23:00:00 | 91.25 |
| 2012-09-22 | 92 |
| 2012-09-22 01:00:00 | 88.5 |
| 2012-09-22 02:00:00 | 89.25 |
| 2012-09-22 03:00:00 | 82 |
| 2012-09-22 04:00:00 | 79.25 |
| 2012-09-22 05:00:00 | 79.5 |
| 2012-09-22 06:00:00 | 80.5 |
| 2012-09-22 07:00:00 | 79.5 |
| 2012-09-22 08:00:00 | 81.5 |
| 2012-09-22 09:00:00 | 83.25 |
| 2012-09-22 10:00:00 | 80.5 |
| 2012-09-22 11:00:00 | 77.75 |
| 2012-09-22 12:00:00 | 78 |
| 2012-09-22 13:00:00 | 75.25 |
| 2012-09-22 14:00:00 | 76.5 |
| 2012-09-22 15:00:00 | 80.75 |
| 2012-09-22 16:00:00 | 78.5 |
| 2012-09-22 17:00:00 | 79 |
| 2012-09-22 18:00:00 | 77.25 |
| 2012-09-22 19:00:00 | 76.25 |
| 2012-09-22 20:00:00 | 78.25 |
| 2012-09-22 21:00:00 | 87.5 |
| 2012-09-22 22:00:00 | 91.5 |
| 2012-09-22 23:00:00 | 90.75 |
| 2012-09-23 | 79.5 |
| 2012-09-23 01:00:00 | 77.75 |
| 2012-09-23 02:00:00 | 78 |
| 2012-09-23 03:00:00 | 77.75 |
| 2012-09-23 04:00:00 | 78 |
| 2012-09-23 05:00:00 | 82 |
| 2012-09-23 06:00:00 | 79.25 |
| 2012-09-23 07:00:00 | 78.5 |
| 2012-09-23 08:00:00 | 75.25 |
| 2012-09-23 09:00:00 | 74.75 |
| 2012-09-23 10:00:00 | 83 |
| 2012-09-23 11:00:00 | 79.25 |
| 2012-09-23 12:00:00 | 74.5 |
| 2012-09-23 13:00:00 | 74.5 |
| 2012-09-23 14:00:00 | 75.75 |
| 2012-09-23 15:00:00 | 79.75 |
| 2012-09-23 16:00:00 | 79.5 |
| 2012-09-23 17:00:00 | 76.5 |
| 2012-09-23 18:00:00 | 72.25 |
| 2012-09-23 19:00:00 | 84.25 |
| 2012-09-23 20:00:00 | 105.5 |
| 2012-09-23 21:00:00 | 106.25 |
| 2012-09-23 22:00:00 | 99.5 |
| 2012-09-23 23:00:00 | 87.75 |
| 2012-09-24 | 78.25 |
| 2012-09-24 01:00:00 | 78 |
| 2012-09-24 02:00:00 | 78.25 |
| 2012-09-24 03:00:00 | 81 |
| 2012-09-24 04:00:00 | 77.75 |
| 2012-09-24 05:00:00 | 79.25 |
| 2012-09-24 06:00:00 | 81.25 |
| 2012-09-24 07:00:00 | 80.25 |
| 2012-09-24 08:00:00 | 86.75 |
| 2012-09-24 09:00:00 | 94 |
| 2012-09-24 10:00:00 | 89 |
| 2012-09-24 11:00:00 | 84.75 |
| 2012-09-24 12:00:00 | 82 |
| 2012-09-24 13:00:00 | 85.5 |
| 2012-09-24 14:00:00 | 86.5 |
| 2012-09-24 15:00:00 | 86 |
| 2012-09-24 16:00:00 | 79.5 |
| 2012-09-24 17:00:00 | 77.25 |
| 2012-09-24 18:00:00 | 76.25 |
| 2012-09-24 19:00:00 | 73.75 |
| 2012-09-24 20:00:00 | 76.75 |
| 2012-09-24 21:00:00 | 82 |
| 2012-09-24 22:00:00 | 78.5 |
| 2012-09-24 23:00:00 | 85.75 |
| 2012-09-25 | 95.5 |
| 2012-09-25 01:00:00 | 84 |
| 2012-09-25 02:00:00 | 78.5 |
| 2012-09-25 03:00:00 | 79 |
| 2012-09-25 04:00:00 | 78.5 |
| 2012-09-25 05:00:00 | 79.25 |
| 2012-09-25 06:00:00 | 85 |
| 2012-09-25 07:00:00 | 83.25 |
| 2012-09-25 08:00:00 | 87.75 |
| 2012-09-25 09:00:00 | 87.5 |
| 2012-09-25 10:00:00 | 85.75 |
| 2012-09-25 11:00:00 | 87.25 |
| 2012-09-25 12:00:00 | 86 |
| 2012-09-25 13:00:00 | 80.75 |
| 2012-09-25 14:00:00 | 84 |
| 2012-09-25 15:00:00 | 84 |
| 2012-09-25 16:00:00 | 83.75 |
| 2012-09-25 17:00:00 | 94.75 |
| 2012-09-25 18:00:00 | 92.75 |
| 2012-09-25 19:00:00 | 78.25 |
| 2012-09-25 20:00:00 | 79 |
| 2012-09-25 21:00:00 | 80.75 |
| 2012-09-25 22:00:00 | 80.75 |
| 2012-09-25 23:00:00 | 80.5 |
| 2012-09-26 | 85 |
| 2012-09-26 01:00:00 | 81 |
| 2012-09-26 02:00:00 | 81.25 |
| 2012-09-26 03:00:00 | 81.25 |
| 2012-09-26 04:00:00 | 81.25 |
| 2012-09-26 05:00:00 | 81.25 |
| 2012-09-26 06:00:00 | 86.5 |
| 2012-09-26 07:00:00 | 81.75 |
| 2012-09-26 08:00:00 | 88.75 |
| 2012-09-26 09:00:00 | 95.75 |
| 2012-09-26 10:00:00 | 88 |
| 2012-09-26 11:00:00 | 86.25 |
| 2012-09-26 12:00:00 | 83.25 |
| 2012-09-26 13:00:00 | 86 |
| 2012-09-26 14:00:00 | 91.75 |
| 2012-09-26 15:00:00 | 86 |
| 2012-09-26 16:00:00 | 80.5 |
| 2012-09-26 17:00:00 | 76.25 |
| 2012-09-26 18:00:00 | 74.25 |
| 2012-09-26 19:00:00 | 80.25 |
| 2012-09-26 20:00:00 | 78.75 |
| 2012-09-26 21:00:00 | 78.75 |
| 2012-09-26 22:00:00 | 79.25 |
| 2012-09-26 23:00:00 | 97.5 |
| 2012-09-27 | 104 |
| 2012-09-27 01:00:00 | 112.5 |
| 2012-09-27 02:00:00 | 108.75 |
| 2012-09-27 03:00:00 | 83.75 |
| 2012-09-27 04:00:00 | 80.25 |
| 2012-09-27 05:00:00 | 80.25 |
| 2012-09-27 06:00:00 | 82.75 |
| 2012-09-27 07:00:00 | 86.75 |
| 2012-09-27 08:00:00 | 42.5 |
| 2012-09-27 09:00:00 | 30 |
| 2012-09-27 10:00:00 | 29.5 |
| 2012-09-27 11:00:00 | 27.25 |
| 2012-09-27 12:00:00 | 32.75 |
| 2012-09-27 13:00:00 | 27.5 |
| 2012-09-27 14:00:00 | 66.5 |
| 2012-09-27 15:00:00 | 94.75 |
| 2012-09-27 16:00:00 | 93.75 |
| 2012-09-27 17:00:00 | 91.25 |
| 2012-09-27 18:00:00 | 88.25 |
| 2012-09-27 19:00:00 | 88.25 |
| 2012-09-27 20:00:00 | 89.5 |
| 2012-09-27 21:00:00 | 89.5 |
| 2012-09-27 22:00:00 | 95.25 |
| 2012-09-27 23:00:00 | 124.25 |
| 2012-09-28 | 124 |
| 2012-09-28 01:00:00 | 115 |
| 2012-09-28 02:00:00 | 108.25 |
| 2012-09-28 03:00:00 | 89.75 |
| 2012-09-28 04:00:00 | 90.25 |
| 2012-09-28 05:00:00 | 90.5 |
| 2012-09-28 06:00:00 | 89.75 |
| 2012-09-28 07:00:00 | 92.25 |
| 2012-09-28 08:00:00 | 87.75 |
| 2012-09-28 09:00:00 | 90.5 |
| 2012-09-28 10:00:00 | 91.5 |
| 2012-09-28 11:00:00 | 85.5 |
| 2012-09-28 12:00:00 | 84.75 |
| 2012-09-28 13:00:00 | 84.5 |
| 2012-09-28 14:00:00 | 83.75 |
| 2012-09-28 15:00:00 | 86 |
| 2012-09-28 16:00:00 | 89.25 |
| 2012-09-28 17:00:00 | 84 |
| 2012-09-28 18:00:00 | 82.25 |
| 2012-09-28 19:00:00 | 84.5 |
| 2012-09-28 20:00:00 | 88.25 |
| 2012-09-28 21:00:00 | 90 |
| 2012-09-28 22:00:00 | 94 |
| 2012-09-28 23:00:00 | 92 |
| 2012-09-29 | 101.5 |
| 2012-09-29 01:00:00 | 101.25 |
| 2012-09-29 02:00:00 | 92 |
| 2012-09-29 03:00:00 | 100.75 |
| 2012-09-29 04:00:00 | 96.75 |
| 2012-09-29 05:00:00 | 91.75 |
| 2012-09-29 06:00:00 | 90.5 |
| 2012-09-29 07:00:00 | 89 |
| 2012-09-29 08:00:00 | 92.25 |
| 2012-09-29 09:00:00 | 89.25 |
| 2012-09-29 10:00:00 | 86 |
| 2012-09-29 11:00:00 | 85 |
| 2012-09-29 12:00:00 | 85 |
| 2012-09-29 13:00:00 | 88.5 |
| 2012-09-29 14:00:00 | 85.5 |
| 2012-09-29 15:00:00 | 87 |
| 2012-09-29 16:00:00 | 85 |
| 2012-09-29 17:00:00 | 82.75 |
| 2012-09-29 18:00:00 | 82.5 |
| 2012-09-29 19:00:00 | 91.75 |
| 2012-09-29 20:00:00 | 90 |
| 2012-09-29 21:00:00 | 91.25 |
| 2012-09-29 22:00:00 | 95.5 |
| 2012-09-29 23:00:00 | 97.25 |
| 2012-09-30 | 91 |
| 2012-09-30 01:00:00 | 104 |
| 2012-09-30 02:00:00 | 100.25 |
| 2012-09-30 03:00:00 | 90.5 |
| 2012-09-30 04:00:00 | 91 |
| 2012-09-30 05:00:00 | 92.5 |
| 2012-09-30 06:00:00 | 89.5 |
| 2012-09-30 07:00:00 | 88.25 |
| 2012-09-30 08:00:00 | 91.25 |
| 2012-09-30 09:00:00 | 87 |
| 2012-09-30 10:00:00 | 86.5 |
| 2012-09-30 11:00:00 | 87 |
| 2012-09-30 12:00:00 | 84 |
| 2012-09-30 13:00:00 | 84 |
| 2012-09-30 14:00:00 | 87.5 |
| 2012-09-30 15:00:00 | 84.75 |
| 2012-09-30 16:00:00 | 86.25 |
| 2012-09-30 17:00:00 | 82.75 |
| 2012-09-30 18:00:00 | 82.75 |
| 2012-09-30 19:00:00 | 90.5 |
| 2012-09-30 20:00:00 | 92 |
| 2012-09-30 21:00:00 | 90.75 |
| 2012-09-30 22:00:00 | 91 |
| 2012-09-30 23:00:00 | 94.75 |
| 2012-10-01 | 108 |
| 2012-10-01 01:00:00 | 105.75 |
| 2012-10-01 02:00:00 | 92.75 |
| 2012-10-01 03:00:00 | 91.25 |
| 2012-10-01 04:00:00 | 91.5 |
| 2012-10-01 05:00:00 | 91 |
| 2012-10-01 06:00:00 | 92 |
| 2012-10-01 07:00:00 | 95.5 |
| 2012-10-01 08:00:00 | 107.75 |
| 2012-10-01 09:00:00 | 104.75 |
| 2012-10-01 10:00:00 | 86 |
| 2012-10-01 11:00:00 | 86.25 |
| 2012-10-01 12:00:00 | 80.5 |
| 2012-10-01 13:00:00 | 85.25 |
| 2012-10-01 14:00:00 | 84.25 |
| 2012-10-01 15:00:00 | 81.75 |
| 2012-10-01 16:00:00 | 77.25 |
| 2012-10-01 17:00:00 | 75.25 |
| 2012-10-01 18:00:00 | 73.25 |
| 2012-10-01 19:00:00 | 78.75 |
| 2012-10-01 20:00:00 | 77.75 |
| 2012-10-01 21:00:00 | 78 |
| 2012-10-01 22:00:00 | 80.5 |
| 2012-10-01 23:00:00 | 103 |
| 2012-10-02 | 113.5 |
| 2012-10-02 01:00:00 | 111 |
| 2012-10-02 02:00:00 | 105.25 |
| 2012-10-02 03:00:00 | 80.25 |
| 2012-10-02 04:00:00 | 78.5 |
| 2012-10-02 05:00:00 | 78.75 |
| 2012-10-02 06:00:00 | 81 |
| 2012-10-02 07:00:00 | 85.5 |
| 2012-10-02 08:00:00 | 87.75 |
| 2012-10-02 09:00:00 | 88.75 |
| 2012-10-02 10:00:00 | 80.5 |
| 2012-10-02 11:00:00 | 82 |
| 2012-10-02 12:00:00 | 84.25 |
| 2012-10-02 13:00:00 | 86.25 |
| 2012-10-02 14:00:00 | 86.5 |
| 2012-10-02 15:00:00 | 80.75 |
| 2012-10-02 16:00:00 | 73.5 |
| 2012-10-02 17:00:00 | 73.25 |
| 2012-10-02 18:00:00 | 70.25 |
| 2012-10-02 19:00:00 | 77.75 |
| 2012-10-02 20:00:00 | 74.75 |
| 2012-10-02 21:00:00 | 75 |
| 2012-10-02 22:00:00 | 79.5 |
| 2012-10-02 23:00:00 | 106.5 |
| 2012-10-03 | 110.5 |
| 2012-10-03 01:00:00 | 100 |
| 2012-10-03 02:00:00 | 94 |
| 2012-10-03 03:00:00 | 75.75 |
| 2012-10-03 04:00:00 | 76.5 |
| 2012-10-03 05:00:00 | 76 |
| 2012-10-03 06:00:00 | 78.75 |
| 2012-10-03 07:00:00 | 83.25 |
| 2012-10-03 08:00:00 | 84 |
| 2012-10-03 09:00:00 | 80 |
| 2012-10-03 10:00:00 | 79.75 |
| 2012-10-03 11:00:00 | 81 |
| 2012-10-03 12:00:00 | 83.25 |
| 2012-10-03 13:00:00 | 82.25 |
| 2012-10-03 14:00:00 | 83.75 |
| 2012-10-03 15:00:00 | 79 |
| 2012-10-03 16:00:00 | 74.25 |
| 2012-10-03 17:00:00 | 73.25 |
| 2012-10-03 18:00:00 | 71 |
| 2012-10-03 19:00:00 | 77.25 |
| 2012-10-03 20:00:00 | 75 |
| 2012-10-03 21:00:00 | 75.5 |
| 2012-10-03 22:00:00 | 77 |
| 2012-10-03 23:00:00 | 85.75 |
| 2012-10-04 | 90.5 |
| 2012-10-04 01:00:00 | 82.25 |
| 2012-10-04 02:00:00 | 78.25 |
| 2012-10-04 03:00:00 | 78.25 |
| 2012-10-04 04:00:00 | 78.75 |
| 2012-10-04 05:00:00 | 78.25 |
| 2012-10-04 06:00:00 | 79.5 |
| 2012-10-04 07:00:00 | 85.5 |
| 2012-10-04 08:00:00 | 86.75 |
| 2012-10-04 09:00:00 | 84.25 |
| 2012-10-04 10:00:00 | 73.25 |
| 2012-10-04 11:00:00 | 72.5 |
| 2012-10-04 12:00:00 | 69.75 |
| 2012-10-04 13:00:00 | 71.25 |
| 2012-10-04 14:00:00 | 72.25 |
| 2012-10-04 15:00:00 | 69 |
| 2012-10-04 16:00:00 | 64.75 |
| 2012-10-04 17:00:00 | 65.25 |
| 2012-10-04 18:00:00 | 64.25 |
| 2012-10-04 19:00:00 | 67 |
| 2012-10-04 20:00:00 | 70.5 |
| 2012-10-04 21:00:00 | 67 |
| 2012-10-04 22:00:00 | 67.5 |
| 2012-10-04 23:00:00 | 79.75 |
| 2012-10-05 | 77.75 |
| 2012-10-05 01:00:00 | 67 |
| 2012-10-05 02:00:00 | 67.5 |
| 2012-10-05 03:00:00 | 67 |
| 2012-10-05 04:00:00 | 68.25 |
| 2012-10-05 05:00:00 | 71 |
| 2012-10-05 06:00:00 | 68.75 |
| 2012-10-05 07:00:00 | 74 |
| 2012-10-05 08:00:00 | 78.25 |
| 2012-10-05 09:00:00 | 85.75 |
| 2012-10-05 10:00:00 | 81.75 |
| 2012-10-05 11:00:00 | 75.75 |
| 2012-10-05 12:00:00 | 77.75 |
| 2012-10-05 13:00:00 | 69.5 |
| 2012-10-05 14:00:00 | 71 |
| 2012-10-05 15:00:00 | 68 |
| 2012-10-05 16:00:00 | 63.25 |
| 2012-10-05 17:00:00 | 66.5 |
| 2012-10-05 18:00:00 | 63 |
| 2012-10-05 19:00:00 | 64.75 |
| 2012-10-05 20:00:00 | 65 |
| 2012-10-05 21:00:00 | 64.5 |
| 2012-10-05 22:00:00 | 64.25 |
| 2012-10-05 23:00:00 | 87.25 |
| 2012-10-06 | 98.25 |
| 2012-10-06 01:00:00 | 94.5 |
| 2012-10-06 02:00:00 | 88.75 |
| 2012-10-06 03:00:00 | 73 |
| 2012-10-06 04:00:00 | 64.25 |
| 2012-10-06 05:00:00 | 64.5 |
| 2012-10-06 06:00:00 | 64.5 |
| 2012-10-06 07:00:00 | 66.75 |
| 2012-10-06 08:00:00 | 66.25 |
| 2012-10-06 09:00:00 | 62.25 |
| 2012-10-06 10:00:00 | 62.25 |
| 2012-10-06 11:00:00 | 60.5 |
| 2012-10-06 12:00:00 | 60.5 |
| 2012-10-06 13:00:00 | 65 |
| 2012-10-06 14:00:00 | 61.75 |
| 2012-10-06 15:00:00 | 61.5 |
| 2012-10-06 16:00:00 | 60.75 |
| 2012-10-06 17:00:00 | 62.5 |
| 2012-10-06 18:00:00 | 63.25 |
| 2012-10-06 19:00:00 | 79.5 |
| 2012-10-06 20:00:00 | 71 |
| 2012-10-06 21:00:00 | 65.25 |
| 2012-10-06 22:00:00 | 73.5 |
| 2012-10-06 23:00:00 | 79 |
| 2012-10-07 | 64.75 |
| 2012-10-07 01:00:00 | 63.25 |
| 2012-10-07 02:00:00 | 64.25 |
| 2012-10-07 03:00:00 | 64.25 |
| 2012-10-07 04:00:00 | 64 |
| 2012-10-07 05:00:00 | 68.25 |
| 2012-10-07 06:00:00 | 64.5 |
| 2012-10-07 07:00:00 | 64.25 |
| 2012-10-07 08:00:00 | 66.25 |
| 2012-10-07 09:00:00 | 65.25 |
| 2012-10-07 10:00:00 | 64.25 |
| 2012-10-07 11:00:00 | 67.25 |
| 2012-10-07 12:00:00 | 66.25 |
| 2012-10-07 13:00:00 | 65.75 |
| 2012-10-07 14:00:00 | 65.75 |
| 2012-10-07 15:00:00 | 66.5 |
| 2012-10-07 16:00:00 | 68.25 |
| 2012-10-07 17:00:00 | 66.5 |
| 2012-10-07 18:00:00 | 66.5 |
| 2012-10-07 19:00:00 | 76.75 |
| 2012-10-07 20:00:00 | 77.5 |
| 2012-10-07 21:00:00 | 81.75 |
| 2012-10-07 22:00:00 | 86.5 |
| 2012-10-07 23:00:00 | 89 |
| 2012-10-08 | 89.75 |
| 2012-10-08 01:00:00 | 86.75 |
| 2012-10-08 02:00:00 | 68.25 |
| 2012-10-08 03:00:00 | 69.5 |
| 2012-10-08 04:00:00 | 67.25 |
| 2012-10-08 05:00:00 | 67.75 |
| 2012-10-08 06:00:00 | 69.5 |
| 2012-10-08 07:00:00 | 73.75 |
| 2012-10-08 08:00:00 | 81.25 |
| 2012-10-08 09:00:00 | 76 |
| 2012-10-08 10:00:00 | 71.5 |
| 2012-10-08 11:00:00 | 70.25 |
| 2012-10-08 12:00:00 | 69 |
| 2012-10-08 13:00:00 | 68 |
| 2012-10-08 14:00:00 | 76.25 |
| 2012-10-08 15:00:00 | 69.25 |
| 2012-10-08 16:00:00 | 66 |
| 2012-10-08 17:00:00 | 65.75 |
| 2012-10-08 18:00:00 | 63.75 |
| 2012-10-08 19:00:00 | 66 |
| 2012-10-08 20:00:00 | 67.75 |
| 2012-10-08 21:00:00 | 64.5 |
| 2012-10-08 22:00:00 | 64.5 |
| 2012-10-08 23:00:00 | 64.75 |
| 2012-10-09 | 64.75 |
| 2012-10-09 01:00:00 | 64.5 |
| 2012-10-09 02:00:00 | 69 |
| 2012-10-09 03:00:00 | 64.25 |
| 2012-10-09 04:00:00 | 64 |
| 2012-10-09 05:00:00 | 65.5 |
| 2012-10-09 06:00:00 | 68.5 |
| 2012-10-09 07:00:00 | 70.75 |
| 2012-10-09 08:00:00 | 76 |
| 2012-10-09 09:00:00 | 78 |
| 2012-10-09 10:00:00 | 72.5 |
| 2012-10-09 11:00:00 | 60.25 |
| 2012-10-09 12:00:00 | 70.75 |
| 2012-10-09 13:00:00 | 75.75 |
| 2012-10-09 14:00:00 | 77.5 |
| 2012-10-09 15:00:00 | 78.75 |
| 2012-10-09 16:00:00 | 79.25 |
| 2012-10-09 17:00:00 | 82.5 |
| 2012-10-09 18:00:00 | 78.75 |
| 2012-10-09 19:00:00 | 83.5 |
| 2012-10-09 20:00:00 | 83 |
| 2012-10-09 21:00:00 | 67.75 |
| 2012-10-09 22:00:00 | 65.75 |
| 2012-10-09 23:00:00 | 65 |
| 2012-10-10 | 64.5 |
| 2012-10-10 01:00:00 | 65.25 |
| 2012-10-10 02:00:00 | 68.75 |
| 2012-10-10 03:00:00 | 64.75 |
| 2012-10-10 04:00:00 | 65.25 |
| 2012-10-10 05:00:00 | 65.75 |
| 2012-10-10 06:00:00 | 66.75 |
| 2012-10-10 07:00:00 | 70.5 |
| 2012-10-10 08:00:00 | 78 |
| 2012-10-10 09:00:00 | 83.25 |
| 2012-10-10 10:00:00 | 76.75 |
| 2012-10-10 11:00:00 | 77.5 |
| 2012-10-10 12:00:00 | 81 |
| 2012-10-10 13:00:00 | 77.75 |
| 2012-10-10 14:00:00 | 75 |
| 2012-10-10 15:00:00 | 71.25 |
| 2012-10-10 16:00:00 | 74.25 |
| 2012-10-10 17:00:00 | 70.5 |
| 2012-10-10 18:00:00 | 70 |
| 2012-10-10 19:00:00 | 74.25 |
| 2012-10-10 20:00:00 | 68.25 |
| 2012-10-10 21:00:00 | 69 |
| 2012-10-10 22:00:00 | 72.5 |
| 2012-10-10 23:00:00 | 67.5 |
| 2012-10-11 | 68.25 |
| 2012-10-11 01:00:00 | 67.75 |
| 2012-10-11 02:00:00 | 68 |
| 2012-10-11 03:00:00 | 68.75 |
| 2012-10-11 04:00:00 | 71.25 |
| 2012-10-11 05:00:00 | 69 |
| 2012-10-11 06:00:00 | 69 |
| 2012-10-11 07:00:00 | 71 |
| 2012-10-11 08:00:00 | 88 |
| 2012-10-11 09:00:00 | 93 |
| 2012-10-11 10:00:00 | 91.75 |
| 2012-10-11 11:00:00 | 90.25 |
| 2012-10-11 12:00:00 | 84.5 |
| 2012-10-11 13:00:00 | 93.25 |
| 2012-10-11 14:00:00 | 93.5 |
| 2012-10-11 15:00:00 | 91.75 |
| 2012-10-11 16:00:00 | 90 |
| 2012-10-11 17:00:00 | 86.5 |
| 2012-10-11 18:00:00 | 84.5 |
| 2012-10-11 19:00:00 | 86.5 |
| 2012-10-11 20:00:00 | 85.25 |
| 2012-10-11 21:00:00 | 85 |
| 2012-10-11 22:00:00 | 85 |
| 2012-10-11 23:00:00 | 88 |
| 2012-10-12 | 85 |
| 2012-10-12 01:00:00 | 84.75 |
| 2012-10-12 02:00:00 | 85 |
| 2012-10-12 03:00:00 | 85 |
| 2012-10-12 04:00:00 | 84.75 |
| 2012-10-12 05:00:00 | 88.5 |
| 2012-10-12 06:00:00 | 86.75 |
| 2012-10-12 07:00:00 | 90.25 |
| 2012-10-12 08:00:00 | 96.75 |
| 2012-10-12 09:00:00 | 95 |
| 2012-10-12 10:00:00 | 88.75 |
| 2012-10-12 11:00:00 | 90.75 |
| 2012-10-12 12:00:00 | 86.25 |
| 2012-10-12 13:00:00 | 84.75 |
| 2012-10-12 14:00:00 | 85 |
| 2012-10-12 15:00:00 | 84 |
| 2012-10-12 16:00:00 | 81.25 |
| 2012-10-12 17:00:00 | 76.5 |
| 2012-10-12 18:00:00 | 76.25 |
| 2012-10-12 19:00:00 | 77.75 |
| 2012-10-12 20:00:00 | 78 |
| 2012-10-12 21:00:00 | 79.5 |
| 2012-10-12 22:00:00 | 88.75 |
| 2012-10-12 23:00:00 | 93.75 |
| 2012-10-13 | 81 |
| 2012-10-13 01:00:00 | 78.75 |
| 2012-10-13 02:00:00 | 77.5 |
| 2012-10-13 03:00:00 | 78.25 |
| 2012-10-13 04:00:00 | 77.5 |
| 2012-10-13 05:00:00 | 79.75 |
| 2012-10-13 06:00:00 | 80 |
| 2012-10-13 07:00:00 | 78.5 |
| 2012-10-13 08:00:00 | 82 |
| 2012-10-13 09:00:00 | 80.25 |
| 2012-10-13 10:00:00 | 77.25 |
| 2012-10-13 11:00:00 | 79 |
| 2012-10-13 12:00:00 | 75.25 |
| 2012-10-13 13:00:00 | 74.25 |
| 2012-10-13 14:00:00 | 75 |
| 2012-10-13 15:00:00 | 73.75 |
| 2012-10-13 16:00:00 | 72.75 |
| 2012-10-13 17:00:00 | 73.25 |
| 2012-10-13 18:00:00 | 77.75 |
| 2012-10-13 19:00:00 | 93.25 |
| 2012-10-13 20:00:00 | 87.25 |
| 2012-10-13 21:00:00 | 80.25 |
| 2012-10-13 22:00:00 | 78.25 |
| 2012-10-13 23:00:00 | 77.75 |
| 2012-10-14 | 78.25 |
| 2012-10-14 01:00:00 | 81.5 |
| 2012-10-14 02:00:00 | 77.75 |
| 2012-10-14 03:00:00 | 78.25 |
| 2012-10-14 04:00:00 | 78.75 |
| 2012-10-14 05:00:00 | 78 |
| 2012-10-14 06:00:00 | 78.25 |
| 2012-10-14 07:00:00 | 77.25 |
| 2012-10-14 08:00:00 | 81 |
| 2012-10-14 09:00:00 | 76.75 |
| 2012-10-14 10:00:00 | 75.5 |
| 2012-10-14 11:00:00 | 76 |
| 2012-10-14 12:00:00 | 73.75 |
| 2012-10-14 13:00:00 | 73.75 |
| 2012-10-14 14:00:00 | 78.25 |
| 2012-10-14 15:00:00 | 73.5 |
| 2012-10-14 16:00:00 | 73.25 |
| 2012-10-14 17:00:00 | 74.25 |
| 2012-10-14 18:00:00 | 74.5 |
| 2012-10-14 19:00:00 | 88.75 |
| 2012-10-14 20:00:00 | 89.75 |
| 2012-10-14 21:00:00 | 77.25 |
| 2012-10-14 22:00:00 | 78 |
| 2012-10-14 23:00:00 | 77.25 |
| 2012-10-15 | 77.25 |
| 2012-10-15 01:00:00 | 81 |
| 2012-10-15 02:00:00 | 77.25 |
| 2012-10-15 03:00:00 | 77.5 |
| 2012-10-15 04:00:00 | 77.75 |
| 2012-10-15 05:00:00 | 77.5 |
| 2012-10-15 06:00:00 | 79 |
| 2012-10-15 07:00:00 | 85.25 |
| 2012-10-15 08:00:00 | 88.5 |
| 2012-10-15 09:00:00 | 85.5 |
| 2012-10-15 10:00:00 | 84.75 |
| 2012-10-15 11:00:00 | 70.25 |
| 2012-10-15 12:00:00 | 52.25 |
| 2012-10-15 13:00:00 | 66.5 |
| 2012-10-15 14:00:00 | 76.25 |
| 2012-10-15 15:00:00 | 79.75 |
| 2012-10-15 16:00:00 | 77.75 |
| 2012-10-15 17:00:00 | 78.75 |
| 2012-10-15 18:00:00 | 83.75 |
| 2012-10-15 19:00:00 | 80.25 |
| 2012-10-15 20:00:00 | 78.75 |
| 2012-10-15 21:00:00 | 79.25 |
| 2012-10-15 22:00:00 | 89.25 |
| 2012-10-15 23:00:00 | 103 |
| 2012-10-16 | 109.5 |
| 2012-10-16 01:00:00 | 102 |
| 2012-10-16 02:00:00 | 89.5 |
| 2012-10-16 03:00:00 | 79 |
| 2012-10-16 04:00:00 | 79.75 |
| 2012-10-16 05:00:00 | 85.25 |
| 2012-10-16 06:00:00 | 90.5 |
| 2012-10-16 07:00:00 | 86.25 |
| 2012-10-16 08:00:00 | 95.75 |
| 2012-10-16 09:00:00 | 95 |
| 2012-10-16 10:00:00 | 88.5 |
| 2012-10-16 11:00:00 | 84 |
| 2012-10-16 12:00:00 | 86 |
| 2012-10-16 13:00:00 | 87.75 |
| 2012-10-16 14:00:00 | 87 |
| 2012-10-16 15:00:00 | 86.75 |
| 2012-10-16 16:00:00 | 78.5 |
| 2012-10-16 17:00:00 | 78 |
| 2012-10-16 18:00:00 | 80.5 |
| 2012-10-16 19:00:00 | 77.75 |
| 2012-10-16 20:00:00 | 81 |
| 2012-10-16 21:00:00 | 79.5 |
| 2012-10-16 22:00:00 | 87 |
| 2012-10-16 23:00:00 | 110.25 |
| 2012-10-17 | 111 |
| 2012-10-17 01:00:00 | 103.5 |
| 2012-10-17 02:00:00 | 92 |
| 2012-10-17 03:00:00 | 78.75 |
| 2012-10-17 04:00:00 | 78.75 |
| 2012-10-17 05:00:00 | 79 |
| 2012-10-17 06:00:00 | 80.75 |
| 2012-10-17 07:00:00 | 87 |
| 2012-10-17 08:00:00 | 88.75 |
| 2012-10-17 09:00:00 | 87.75 |
| 2012-10-17 10:00:00 | 89.25 |
| 2012-10-17 11:00:00 | 94.75 |
| 2012-10-17 12:00:00 | 84 |
| 2012-10-17 13:00:00 | 87.75 |
| 2012-10-17 14:00:00 | 82.25 |
| 2012-10-17 15:00:00 | 82 |
| 2012-10-17 16:00:00 | 77.75 |
| 2012-10-17 17:00:00 | 77.5 |
| 2012-10-17 18:00:00 | 79.5 |
| 2012-10-17 19:00:00 | 82.25 |
| 2012-10-17 20:00:00 | 78.75 |
| 2012-10-17 21:00:00 | 79.75 |
| 2012-10-17 22:00:00 | 78.75 |
| 2012-10-17 23:00:00 | 82 |
| 2012-10-18 | 94.25 |
| 2012-10-18 01:00:00 | 95.5 |
| 2012-10-18 02:00:00 | 87.25 |
| 2012-10-18 03:00:00 | 80 |
| 2012-10-18 04:00:00 | 80.75 |
| 2012-10-18 05:00:00 | 80 |
| 2012-10-18 06:00:00 | 82 |
| 2012-10-18 07:00:00 | 83.75 |
| 2012-10-18 08:00:00 | 96.25 |
| 2012-10-18 09:00:00 | 94 |
| 2012-10-18 10:00:00 | 83.25 |
| 2012-10-18 11:00:00 | 82.75 |
| 2012-10-18 12:00:00 | 87 |
| 2012-10-18 13:00:00 | 92.5 |
| 2012-10-18 14:00:00 | 84.5 |
| 2012-10-18 15:00:00 | 77.75 |
| 2012-10-18 16:00:00 | 76.25 |
| 2012-10-18 17:00:00 | 76.75 |
| 2012-10-18 18:00:00 | 75 |
| 2012-10-18 19:00:00 | 83.25 |
| 2012-10-18 20:00:00 | 80.25 |
| 2012-10-18 21:00:00 | 80.5 |
| 2012-10-18 22:00:00 | 81.5 |
| 2012-10-18 23:00:00 | 93 |
| 2012-10-19 | 97.25 |
| 2012-10-19 01:00:00 | 95.25 |
| 2012-10-19 02:00:00 | 82.5 |
| 2012-10-19 03:00:00 | 81.5 |
| 2012-10-19 04:00:00 | 82.25 |
| 2012-10-19 05:00:00 | 82 |
| 2012-10-19 06:00:00 | 83.25 |
| 2012-10-19 07:00:00 | 91 |
| 2012-10-19 08:00:00 | 91.5 |
| 2012-10-19 09:00:00 | 91.75 |
| 2012-10-19 10:00:00 | 88.5 |
| 2012-10-19 11:00:00 | 95.5 |
| 2012-10-19 12:00:00 | 87 |
| 2012-10-19 13:00:00 | 85.5 |
| 2012-10-19 14:00:00 | 86 |
| 2012-10-19 15:00:00 | 82.25 |
| 2012-10-19 16:00:00 | 80 |
| 2012-10-19 17:00:00 | 79.25 |
| 2012-10-19 18:00:00 | 78.75 |
| 2012-10-19 19:00:00 | 82.5 |
| 2012-10-19 20:00:00 | 82.25 |
| 2012-10-19 21:00:00 | 82.25 |
| 2012-10-19 22:00:00 | 87 |
| 2012-10-19 23:00:00 | 91.5 |
| 2012-10-20 | 96.5 |
| 2012-10-20 01:00:00 | 88.25 |
| 2012-10-20 02:00:00 | 83.25 |
| 2012-10-20 03:00:00 | 83.5 |
| 2012-10-20 04:00:00 | 84 |
| 2012-10-20 05:00:00 | 88 |
| 2012-10-20 06:00:00 | 87.25 |
| 2012-10-20 07:00:00 | 85.75 |
| 2012-10-20 08:00:00 | 84.75 |
| 2012-10-20 09:00:00 | 84.25 |
| 2012-10-20 10:00:00 | 84.75 |
| 2012-10-20 11:00:00 | 79.5 |
| 2012-10-20 12:00:00 | 77.75 |
| 2012-10-20 13:00:00 | 78.25 |
| 2012-10-20 14:00:00 | 77.75 |
| 2012-10-20 15:00:00 | 77 |
| 2012-10-20 16:00:00 | 79.25 |
| 2012-10-20 17:00:00 | 76.75 |
| 2012-10-20 18:00:00 | 77.5 |
| 2012-10-20 19:00:00 | 90.5 |
| 2012-10-20 20:00:00 | 94.5 |
| 2012-10-20 21:00:00 | 95.5 |
| 2012-10-20 22:00:00 | 82.25 |
| 2012-10-20 23:00:00 | 83.75 |
| 2012-10-21 | 83 |
| 2012-10-21 01:00:00 | 82.25 |
| 2012-10-21 02:00:00 | 85.5 |
| 2012-10-21 03:00:00 | 81.25 |
| 2012-10-21 04:00:00 | 81.5 |
| 2012-10-21 05:00:00 | 81.75 |
| 2012-10-21 06:00:00 | 80.5 |
| 2012-10-21 07:00:00 | 81.25 |
| 2012-10-21 08:00:00 | 81.75 |
| 2012-10-21 09:00:00 | 75.25 |
| 2012-10-21 10:00:00 | 75 |
| 2012-10-21 11:00:00 | 75.5 |
| 2012-10-21 12:00:00 | 75.25 |
| 2012-10-21 13:00:00 | 76.75 |
| 2012-10-21 14:00:00 | 82.5 |
| 2012-10-21 15:00:00 | 75.25 |
| 2012-10-21 16:00:00 | 75.5 |
| 2012-10-21 17:00:00 | 75.5 |
| 2012-10-21 18:00:00 | 73.25 |
| 2012-10-21 19:00:00 | 96.5 |
| 2012-10-21 20:00:00 | 121.25 |
| 2012-10-21 21:00:00 | 134.75 |
| 2012-10-21 22:00:00 | 96.5 |
| 2012-10-21 23:00:00 | 108.5 |
| 2012-10-22 | 110.5 |
| 2012-10-22 01:00:00 | 98.25 |
| 2012-10-22 02:00:00 | 92.75 |
| 2012-10-22 03:00:00 | 82.25 |
| 2012-10-22 04:00:00 | 83 |
| 2012-10-22 05:00:00 | 83.5 |
| 2012-10-22 06:00:00 | 86.5 |
| 2012-10-22 07:00:00 | 88 |
| 2012-10-22 08:00:00 | 95.5 |
| 2012-10-22 09:00:00 | 91 |
| 2012-10-22 10:00:00 | 85.75 |
| 2012-10-22 11:00:00 | 89.5 |
| 2012-10-22 12:00:00 | 87.5 |
| 2012-10-22 13:00:00 | 83.25 |
| 2012-10-22 14:00:00 | 83 |
| 2012-10-22 15:00:00 | 90.25 |
| 2012-10-22 16:00:00 | 88.5 |
| 2012-10-22 17:00:00 | 91.5 |
| 2012-10-22 18:00:00 | 81.25 |
| 2012-10-22 19:00:00 | 80.75 |
| 2012-10-22 20:00:00 | 81.5 |
| 2012-10-22 21:00:00 | 82.25 |
| 2012-10-22 22:00:00 | 82.75 |
| 2012-10-22 23:00:00 | 98 |
| 2012-10-23 | 92.25 |
| 2012-10-23 01:00:00 | 83.25 |
| 2012-10-23 02:00:00 | 83.5 |
| 2012-10-23 03:00:00 | 83.25 |
| 2012-10-23 04:00:00 | 83.25 |
| 2012-10-23 05:00:00 | 87.5 |
| 2012-10-23 06:00:00 | 84 |
| 2012-10-23 07:00:00 | 91 |
| 2012-10-23 08:00:00 | 100.25 |
| 2012-10-23 09:00:00 | 100.25 |
| 2012-10-23 10:00:00 | 95.75 |
| 2012-10-23 11:00:00 | 91.5 |
| 2012-10-23 12:00:00 | 95.25 |
| 2012-10-23 13:00:00 | 93 |
| 2012-10-23 14:00:00 | 89.75 |
| 2012-10-23 15:00:00 | 86.25 |
| 2012-10-23 16:00:00 | 84 |
| 2012-10-23 17:00:00 | 86.5 |
| 2012-10-23 18:00:00 | 84 |
| 2012-10-23 19:00:00 | 82.75 |
| 2012-10-23 20:00:00 | 83.5 |
| 2012-10-23 21:00:00 | 84.25 |
| 2012-10-23 22:00:00 | 85.5 |
| 2012-10-23 23:00:00 | 97.5 |
| 2012-10-24 | 92.75 |
| 2012-10-24 01:00:00 | 84.25 |
| 2012-10-24 02:00:00 | 84.5 |
| 2012-10-24 03:00:00 | 84.75 |
| 2012-10-24 04:00:00 | 84.25 |
| 2012-10-24 05:00:00 | 84.5 |
| 2012-10-24 06:00:00 | 89.5 |
| 2012-10-24 07:00:00 | 87.75 |
| 2012-10-24 08:00:00 | 99.5 |
| 2012-10-24 09:00:00 | 100 |
| 2012-10-24 10:00:00 | 90 |
| 2012-10-24 11:00:00 | 92.75 |
| 2012-10-24 12:00:00 | 96 |
| 2012-10-24 13:00:00 | 95.75 |
| 2012-10-24 14:00:00 | 92.25 |
| 2012-10-24 15:00:00 | 90.75 |
| 2012-10-24 16:00:00 | 86.25 |
| 2012-10-24 17:00:00 | 94.25 |
| 2012-10-24 18:00:00 | 120.75 |
| 2012-10-24 19:00:00 | 99 |
| 2012-10-24 20:00:00 | 67.75 |
| 2012-10-24 21:00:00 | 72.5 |
| 2012-10-24 22:00:00 | 79.75 |
| 2012-10-24 23:00:00 | 124.75 |
| 2012-10-25 | 119 |
| 2012-10-25 01:00:00 | 60.25 |
| 2012-10-25 02:00:00 | 73.5 |
| 2012-10-25 03:00:00 | 78.75 |
| 2012-10-25 04:00:00 | 92.5 |
| 2012-10-25 05:00:00 | 113.5 |
| 2012-10-25 06:00:00 | 94.75 |
| 2012-10-25 07:00:00 | 98.5 |
| 2012-10-25 08:00:00 | 129.75 |
| 2012-10-25 09:00:00 | 128.25 |
| 2012-10-25 10:00:00 | 126.25 |
| 2012-10-25 11:00:00 | 125.75 |
| 2012-10-25 12:00:00 | 121.75 |
| 2012-10-25 13:00:00 | 98.25 |
| 2012-10-25 14:00:00 | 67.5 |
| 2012-10-25 15:00:00 | 62.75 |
| 2012-10-25 16:00:00 | 48.5 |
| 2012-10-25 17:00:00 | 49 |
| 2012-10-25 18:00:00 | 51.75 |
| 2012-10-25 19:00:00 | 51.75 |
| 2012-10-25 20:00:00 | 51.75 |
| 2012-10-25 21:00:00 | 55.25 |
| 2012-10-25 22:00:00 | 52.25 |
| 2012-10-25 23:00:00 | 54.25 |
| 2012-10-26 | 64 |
| 2012-10-26 01:00:00 | 56.25 |
| 2012-10-26 02:00:00 | 51.5 |
| 2012-10-26 03:00:00 | 51.75 |
| 2012-10-26 04:00:00 | 70.25 |
| 2012-10-26 05:00:00 | 124 |
| 2012-10-26 06:00:00 | 123.5 |
| 2012-10-26 07:00:00 | 116.5 |
| 2012-10-26 08:00:00 | 103.75 |
| 2012-10-26 09:00:00 | 61 |
| 2012-10-26 10:00:00 | 58 |
| 2012-10-26 11:00:00 | 56.75 |
| 2012-10-26 12:00:00 | 51.25 |
| 2012-10-26 13:00:00 | 54.75 |
| 2012-10-26 14:00:00 | 53 |
| 2012-10-26 15:00:00 | 51.25 |
| 2012-10-26 16:00:00 | 49 |
| 2012-10-26 17:00:00 | 53.25 |
| 2012-10-26 18:00:00 | 52.25 |
| 2012-10-26 19:00:00 | 92 |
| 2012-10-26 20:00:00 | 119.75 |
| 2012-10-26 21:00:00 | 85.5 |
| 2012-10-26 22:00:00 | 51.75 |
| 2012-10-26 23:00:00 | 73.75 |
| 2012-10-27 | 76.75 |
| 2012-10-27 01:00:00 | 73.5 |
| 2012-10-27 02:00:00 | 66 |
| 2012-10-27 03:00:00 | 54.75 |
| 2012-10-27 04:00:00 | 49.5 |
| 2012-10-27 05:00:00 | 50.75 |
| 2012-10-27 06:00:00 | 50 |
| 2012-10-27 07:00:00 | 53.5 |
| 2012-10-27 08:00:00 | 53.25 |
| 2012-10-27 09:00:00 | 51 |
| 2012-10-27 10:00:00 | 48.5 |
| 2012-10-27 11:00:00 | 46.5 |
| 2012-10-27 12:00:00 | 49.75 |
| 2012-10-27 13:00:00 | 45.75 |
| 2012-10-27 14:00:00 | 44.25 |
| 2012-10-27 15:00:00 | 44.5 |
| 2012-10-27 16:00:00 | 46.5 |
| 2012-10-27 17:00:00 | 48.75 |
| 2012-10-27 18:00:00 | 51 |
| 2012-10-27 19:00:00 | 61 |
| 2012-10-27 20:00:00 | 61.5 |
| 2012-10-27 21:00:00 | 60.75 |
| 2012-10-27 22:00:00 | 53.5 |
| 2012-10-27 23:00:00 | 61.75 |
| 2012-10-28 | 70.25 |
| 2012-10-28 01:00:00 | 68.75 |
| 2012-10-28 02:00:00 | 68.25 |
| 2012-10-28 02:00:00 | 63.5 |
| 2012-10-28 03:00:00 | 50.25 |
| 2012-10-28 04:00:00 | 50.75 |
| 2012-10-28 05:00:00 | 51.25 |
| 2012-10-28 06:00:00 | 49.25 |
| 2012-10-28 07:00:00 | 50 |
| 2012-10-28 08:00:00 | 50.5 |
| 2012-10-28 09:00:00 | 45.75 |
| 2012-10-28 10:00:00 | 44.75 |
| 2012-10-28 11:00:00 | 87.75 |
| 2012-10-28 12:00:00 | 128.5 |
| 2012-10-28 13:00:00 | 143.5 |
| 2012-10-28 14:00:00 | 140.5 |
| 2012-10-28 15:00:00 | 127.75 |
| 2012-10-28 16:00:00 | 127.5 |
| 2012-10-28 17:00:00 | 130.5 |
| 2012-10-28 18:00:00 | 134.25 |
| 2012-10-28 19:00:00 | 138 |
| 2012-10-28 20:00:00 | 144.25 |
| 2012-10-28 21:00:00 | 143.5 |
| 2012-10-28 22:00:00 | 145 |
| 2012-10-28 23:00:00 | 153.25 |
| 2012-10-29 | 150.75 |
| 2012-10-29 01:00:00 | 146.5 |
| 2012-10-29 02:00:00 | 143.5 |
| 2012-10-29 03:00:00 | 132.25 |
| 2012-10-29 04:00:00 | 129.75 |
| 2012-10-29 05:00:00 | 131.25 |
| 2012-10-29 06:00:00 | 134 |
| 2012-10-29 07:00:00 | 137 |
| 2012-10-29 08:00:00 | 143.25 |
| 2012-10-29 09:00:00 | 157.75 |
| 2012-10-29 10:00:00 | 163.75 |
| 2012-10-29 11:00:00 | 162 |
| 2012-10-29 12:00:00 | 164.25 |
| 2012-10-29 13:00:00 | 164 |
| 2012-10-29 14:00:00 | 166.75 |
| 2012-10-29 15:00:00 | 166.5 |
| 2012-10-29 16:00:00 | 161.25 |
| 2012-10-29 17:00:00 | 160 |
| 2012-10-29 18:00:00 | 164.5 |
| 2012-10-29 19:00:00 | 164.75 |
| 2012-10-29 20:00:00 | 162.75 |
| 2012-10-29 21:00:00 | 162.5 |
| 2012-10-29 22:00:00 | 171.5 |
| 2012-10-29 23:00:00 | 188.25 |
| 2012-10-30 | 191.25 |
| 2012-10-30 01:00:00 | 182.75 |
| 2012-10-30 02:00:00 | 175.25 |
| 2012-10-30 03:00:00 | 173.75 |
| 2012-10-30 04:00:00 | 165.25 |
| 2012-10-30 05:00:00 | 164.25 |
| 2012-10-30 06:00:00 | 162.75 |
| 2012-10-30 07:00:00 | 166 |
| 2012-10-30 08:00:00 | 155 |
| 2012-10-30 09:00:00 | 85 |
| 2012-10-30 10:00:00 | 61.5 |
| 2012-10-30 11:00:00 | 103 |
| 2012-10-30 12:00:00 | 119.75 |
| 2012-10-30 13:00:00 | 124 |
| 2012-10-30 14:00:00 | 121.5 |
| 2012-10-30 15:00:00 | 59 |
| 2012-10-30 16:00:00 | 49 |
| 2012-10-30 17:00:00 | 85 |
| 2012-10-30 18:00:00 | 142 |
| 2012-10-30 19:00:00 | 140.25 |
| 2012-10-30 20:00:00 | 137.25 |
| 2012-10-30 21:00:00 | 137.25 |
| 2012-10-30 22:00:00 | 145.75 |
| 2012-10-30 23:00:00 | 159.75 |
| 2012-10-31 | 166.5 |
| 2012-10-31 01:00:00 | 158.5 |
| 2012-10-31 02:00:00 | 152.25 |
| 2012-10-31 03:00:00 | 136.75 |
| 2012-10-31 04:00:00 | 137 |
| 2012-10-31 05:00:00 | 137 |
| 2012-10-31 06:00:00 | 140.5 |
| 2012-10-31 07:00:00 | 140.5 |
| 2012-10-31 08:00:00 | 142.75 |
| 2012-10-31 09:00:00 | 181 |
| 2012-10-31 10:00:00 | 226.75 |
| 2012-10-31 11:00:00 | 239 |
| 2012-10-31 12:00:00 | 253.5 |
| 2012-10-31 13:00:00 | 252.25 |
| 2012-10-31 14:00:00 | 250.75 |
| 2012-10-31 15:00:00 | 252 |
| 2012-10-31 16:00:00 | 244 |
| 2012-10-31 17:00:00 | 248.5 |
| 2012-10-31 18:00:00 | 253.5 |
| 2012-10-31 19:00:00 | 262.5 |
| 2012-10-31 20:00:00 | 262.25 |
| 2012-10-31 21:00:00 | 263.25 |
| 2012-10-31 22:00:00 | 257 |
| 2012-10-31 23:00:00 | 264.5 |
| 2012-11-01 | 259.25 |
| 2012-11-01 01:00:00 | 273 |
| 2012-11-01 02:00:00 | 270.75 |
| 2012-11-01 03:00:00 | 269.75 |
| 2012-11-01 04:00:00 | 272 |
| 2012-11-01 05:00:00 | 259.5 |
| 2012-11-01 06:00:00 | 254.75 |
| 2012-11-01 07:00:00 | 258.75 |
| 2012-11-01 08:00:00 | 258 |
| 2012-11-01 09:00:00 | 257.25 |
| 2012-11-01 10:00:00 | 257.25 |
| 2012-11-01 11:00:00 | 251.75 |
| 2012-11-01 12:00:00 | 253.25 |
| 2012-11-01 13:00:00 | 254.5 |
| 2012-11-01 14:00:00 | 257 |
| 2012-11-01 15:00:00 | 251.25 |
| 2012-11-01 16:00:00 | 247.75 |
| 2012-11-01 17:00:00 | 256.25 |
| 2012-11-01 18:00:00 | 251.75 |
| 2012-11-01 19:00:00 | 250.25 |
| 2012-11-01 20:00:00 | 251 |
| 2012-11-01 21:00:00 | 250.75 |
| 2012-11-01 22:00:00 | 257.5 |
| 2012-11-01 23:00:00 | 268.5 |
| 2012-11-02 | 272.25 |
| 2012-11-02 01:00:00 | 271 |
| 2012-11-02 02:00:00 | 271.5 |
| 2012-11-02 03:00:00 | 255.5 |
| 2012-11-02 04:00:00 | 254 |
| 2012-11-02 05:00:00 | 258.5 |
| 2012-11-02 06:00:00 | 253.5 |
| 2012-11-02 07:00:00 | 255.75 |
| 2012-11-02 08:00:00 | 255.75 |
| 2012-11-02 09:00:00 | 251.5 |
| 2012-11-02 10:00:00 | 250.75 |
| 2012-11-02 11:00:00 | 255.25 |
| 2012-11-02 12:00:00 | 269 |
| 2012-11-02 13:00:00 | 256.75 |
| 2012-11-02 14:00:00 | 257 |
| 2012-11-02 15:00:00 | 256.25 |
| 2012-11-02 16:00:00 | 254 |
| 2012-11-02 17:00:00 | 265.5 |
| 2012-11-02 18:00:00 | 263.5 |
| 2012-11-02 19:00:00 | 254 |
| 2012-11-02 20:00:00 | 255.25 |
| 2012-11-02 21:00:00 | 258.5 |
| 2012-11-02 22:00:00 | 253.5 |
| 2012-11-02 23:00:00 | 278 |
| 2012-11-03 | 280.75 |
| 2012-11-03 01:00:00 | 272.5 |
| 2012-11-03 02:00:00 | 269 |
| 2012-11-03 03:00:00 | 254.5 |
| 2012-11-03 04:00:00 | 251.75 |
| 2012-11-03 05:00:00 | 254.25 |
| 2012-11-03 06:00:00 | 252.75 |
| 2012-11-03 07:00:00 | 249 |
| 2012-11-03 08:00:00 | 259.5 |
| 2012-11-03 09:00:00 | 267.5 |
| 2012-11-03 10:00:00 | 245.75 |
| 2012-11-03 11:00:00 | 247.75 |
| 2012-11-03 12:00:00 | 244.25 |
| 2012-11-03 13:00:00 | 244.5 |
| 2012-11-03 14:00:00 | 244.75 |
| 2012-11-03 15:00:00 | 243.5 |
| 2012-11-03 16:00:00 | 241.25 |
| 2012-11-03 17:00:00 | 252.75 |
| 2012-11-03 18:00:00 | 251.25 |
| 2012-11-03 19:00:00 | 252.5 |
| 2012-11-03 20:00:00 | 252.25 |
| 2012-11-03 21:00:00 | 252.25 |
| 2012-11-03 22:00:00 | 255.75 |
| 2012-11-03 23:00:00 | 273.25 |
| 2012-11-04 | 269.75 |
| 2012-11-04 01:00:00 | 270 |
| 2012-11-04 02:00:00 | 268.5 |
| 2012-11-04 03:00:00 | 251.5 |
| 2012-11-04 04:00:00 | 254.5 |
| 2012-11-04 05:00:00 | 257.25 |
| 2012-11-04 06:00:00 | 260.5 |
| 2012-11-04 07:00:00 | 251 |
| 2012-11-04 08:00:00 | 248.5 |
| 2012-11-04 09:00:00 | 244.5 |
| 2012-11-04 10:00:00 | 243.25 |
| 2012-11-04 11:00:00 | 251.5 |
| 2012-11-04 12:00:00 | 258 |
| 2012-11-04 13:00:00 | 253.5 |
| 2012-11-04 14:00:00 | 245.5 |
| 2012-11-04 15:00:00 | 243.25 |
| 2012-11-04 16:00:00 | 243.25 |
| 2012-11-04 17:00:00 | 247.5 |
| 2012-11-04 18:00:00 | 253.25 |
| 2012-11-04 19:00:00 | 250.75 |
| 2012-11-04 20:00:00 | 263.75 |
| 2012-11-04 21:00:00 | 270 |
| 2012-11-04 22:00:00 | 267.5 |
| 2012-11-04 23:00:00 | 268 |
| 2012-11-05 | 267 |
| 2012-11-05 01:00:00 | 255.25 |
| 2012-11-05 02:00:00 | 259.75 |
| 2012-11-05 03:00:00 | 250 |
| 2012-11-05 04:00:00 | 251.75 |
| 2012-11-05 05:00:00 | 250 |
| 2012-11-05 06:00:00 | 250.75 |
| 2012-11-05 07:00:00 | 260.25 |
| 2012-11-05 08:00:00 | 266.25 |
| 2012-11-05 09:00:00 | 234 |
| 2012-11-05 10:00:00 | 191.5 |
| 2012-11-05 11:00:00 | 200.75 |
| 2012-11-05 12:00:00 | 224.75 |
| 2012-11-05 13:00:00 | 220.5 |
| 2012-11-05 14:00:00 | 229 |
| 2012-11-05 15:00:00 | 232.5 |
| 2012-11-05 16:00:00 | 238.25 |
| 2012-11-05 17:00:00 | 244 |
| 2012-11-05 18:00:00 | 235.25 |
| 2012-11-05 19:00:00 | 234.5 |
| 2012-11-05 20:00:00 | 232 |
| 2012-11-05 21:00:00 | 233 |
| 2012-11-05 22:00:00 | 234.25 |
| 2012-11-05 23:00:00 | 243.5 |
| 2012-11-06 | 256.75 |
| 2012-11-06 01:00:00 | 247.75 |
| 2012-11-06 02:00:00 | 247.75 |
| 2012-11-06 03:00:00 | 239 |
| 2012-11-06 04:00:00 | 230.75 |
| 2012-11-06 05:00:00 | 230.75 |
| 2012-11-06 06:00:00 | 233.75 |
| 2012-11-06 07:00:00 | 230.75 |
| 2012-11-06 08:00:00 | 228.5 |
| 2012-11-06 09:00:00 | 237.25 |
| 2012-11-06 10:00:00 | 233.5 |
| 2012-11-06 11:00:00 | 223 |
| 2012-11-06 12:00:00 | 226 |
| 2012-11-06 13:00:00 | 226 |
| 2012-11-06 14:00:00 | 222 |
| 2012-11-06 15:00:00 | 222.75 |
| 2012-11-06 16:00:00 | 222.5 |
| 2012-11-06 17:00:00 | 236.5 |
| 2012-11-06 18:00:00 | 225 |
| 2012-11-06 19:00:00 | 225.75 |
| 2012-11-06 20:00:00 | 226 |
| 2012-11-06 21:00:00 | 227.5 |
| 2012-11-06 22:00:00 | 231 |
| 2012-11-06 23:00:00 | 247.25 |
| 2012-11-07 | 254.25 |
| 2012-11-07 01:00:00 | 244 |
| 2012-11-07 02:00:00 | 246.25 |
| 2012-11-07 03:00:00 | 233 |
| 2012-11-07 04:00:00 | 229.75 |
| 2012-11-07 05:00:00 | 230.75 |
| 2012-11-07 06:00:00 | 248.75 |
| 2012-11-07 07:00:00 | 193.25 |
| 2012-11-07 08:00:00 | 122 |
| 2012-11-07 09:00:00 | 126.25 |
| 2012-11-07 10:00:00 | 152.25 |
| 2012-11-07 11:00:00 | 220.25 |
| 2012-11-07 12:00:00 | 225 |
| 2012-11-07 13:00:00 | 229.25 |
| 2012-11-07 14:00:00 | 226.75 |
| 2012-11-07 15:00:00 | 223 |
| 2012-11-07 16:00:00 | 234 |
| 2012-11-07 17:00:00 | 228 |
| 2012-11-07 18:00:00 | 226.25 |
| 2012-11-07 19:00:00 | 227 |
| 2012-11-07 20:00:00 | 225.75 |
| 2012-11-07 21:00:00 | 226.75 |
| 2012-11-07 22:00:00 | 234.75 |
| 2012-11-07 23:00:00 | 254.5 |
| 2012-11-08 | 252.5 |
| 2012-11-08 01:00:00 | 247 |
| 2012-11-08 02:00:00 | 246.5 |
| 2012-11-08 03:00:00 | 230.75 |
| 2012-11-08 04:00:00 | 235.25 |
| 2012-11-08 05:00:00 | 232 |
| 2012-11-08 06:00:00 | 232.25 |
| 2012-11-08 07:00:00 | 233 |
| 2012-11-08 08:00:00 | 230.75 |
| 2012-11-08 09:00:00 | 239.75 |
| 2012-11-08 10:00:00 | 234.25 |
| 2012-11-08 11:00:00 | 224.5 |
| 2012-11-08 12:00:00 | 226.5 |
| 2012-11-08 13:00:00 | 231.25 |
| 2012-11-08 14:00:00 | 227.75 |
| 2012-11-08 15:00:00 | 227.5 |
| 2012-11-08 16:00:00 | 239.5 |
| 2012-11-08 17:00:00 | 232 |
| 2012-11-08 18:00:00 | 228.25 |
| 2012-11-08 19:00:00 | 227.75 |
| 2012-11-08 20:00:00 | 226.25 |
| 2012-11-08 21:00:00 | 227.75 |
| 2012-11-08 22:00:00 | 235.75 |
| 2012-11-08 23:00:00 | 255.25 |
| 2012-11-09 | 256 |
| 2012-11-09 01:00:00 | 246.5 |
| 2012-11-09 02:00:00 | 247.25 |
| 2012-11-09 03:00:00 | 235.5 |
| 2012-11-09 04:00:00 | 243 |
| 2012-11-09 05:00:00 | 237.5 |
| 2012-11-09 06:00:00 | 232.25 |
| 2012-11-09 07:00:00 | 234.5 |
| 2012-11-09 08:00:00 | 247 |
| 2012-11-09 09:00:00 | 240.75 |
| 2012-11-09 10:00:00 | 229.5 |
| 2012-11-09 11:00:00 | 228.5 |
| 2012-11-09 12:00:00 | 235.25 |
| 2012-11-09 13:00:00 | 234 |
| 2012-11-09 14:00:00 | 232.25 |
| 2012-11-09 15:00:00 | 234.75 |
| 2012-11-09 16:00:00 | 234.75 |
| 2012-11-09 17:00:00 | 232.5 |
| 2012-11-09 18:00:00 | 229 |
| 2012-11-09 19:00:00 | 228.25 |
| 2012-11-09 20:00:00 | 228 |
| 2012-11-09 21:00:00 | 229.25 |
| 2012-11-09 22:00:00 | 237.75 |
| 2012-11-09 23:00:00 | 249 |
| 2012-11-10 | 245.25 |
| 2012-11-10 01:00:00 | 248.75 |
| 2012-11-10 02:00:00 | 250.75 |
| 2012-11-10 03:00:00 | 240.5 |
| 2012-11-10 04:00:00 | 236 |
| 2012-11-10 05:00:00 | 234 |
| 2012-11-10 06:00:00 | 232 |
| 2012-11-10 07:00:00 | 228.5 |
| 2012-11-10 08:00:00 | 223.75 |
| 2012-11-10 09:00:00 | 228.5 |
| 2012-11-10 10:00:00 | 230.25 |
| 2012-11-10 11:00:00 | 226.25 |
| 2012-11-10 12:00:00 | 222.25 |
| 2012-11-10 13:00:00 | 221.75 |
| 2012-11-10 14:00:00 | 221 |
| 2012-11-10 15:00:00 | 220.75 |
| 2012-11-10 16:00:00 | 220 |
| 2012-11-10 17:00:00 | 224 |
| 2012-11-10 18:00:00 | 231.25 |
| 2012-11-10 19:00:00 | 233.5 |
| 2012-11-10 20:00:00 | 237 |
| 2012-11-10 21:00:00 | 238 |
| 2012-11-10 22:00:00 | 245.25 |
| 2012-11-10 23:00:00 | 245 |
| 2012-11-11 | 246 |
| 2012-11-11 01:00:00 | 246 |
| 2012-11-11 02:00:00 | 233.25 |
| 2012-11-11 03:00:00 | 230.75 |
| 2012-11-11 04:00:00 | 232.75 |
| 2012-11-11 05:00:00 | 232.5 |
| 2012-11-11 06:00:00 | 232.5 |
| 2012-11-11 07:00:00 | 234 |
| 2012-11-11 08:00:00 | 227.75 |
| 2012-11-11 09:00:00 | 227.75 |
| 2012-11-11 10:00:00 | 231.75 |
| 2012-11-11 11:00:00 | 221.75 |
| 2012-11-11 12:00:00 | 219.25 |
| 2012-11-11 13:00:00 | 224.5 |
| 2012-11-11 14:00:00 | 224.25 |
| 2012-11-11 15:00:00 | 220.75 |
| 2012-11-11 16:00:00 | 221.25 |
| 2012-11-11 17:00:00 | 224.75 |
| 2012-11-11 18:00:00 | 228 |
| 2012-11-11 19:00:00 | 233.75 |
| 2012-11-11 20:00:00 | 234 |
| 2012-11-11 21:00:00 | 236 |
| 2012-11-11 22:00:00 | 244 |
| 2012-11-11 23:00:00 | 244.5 |
| 2012-11-12 | 250.5 |
| 2012-11-12 01:00:00 | 241 |
| 2012-11-12 02:00:00 | 229.75 |
| 2012-11-12 03:00:00 | 230.75 |
| 2012-11-12 04:00:00 | 232.25 |
| 2012-11-12 05:00:00 | 237.25 |
| 2012-11-12 06:00:00 | 230.75 |
| 2012-11-12 07:00:00 | 233 |
| 2012-11-12 08:00:00 | 235.25 |
| 2012-11-12 09:00:00 | 230.75 |
| 2012-11-12 10:00:00 | 231.25 |
| 2012-11-12 11:00:00 | 237 |
| 2012-11-12 12:00:00 | 222.75 |
| 2012-11-12 13:00:00 | 230.5 |
| 2012-11-12 14:00:00 | 229.75 |
| 2012-11-12 15:00:00 | 227.5 |
| 2012-11-12 16:00:00 | 224.5 |
| 2012-11-12 17:00:00 | 228 |
| 2012-11-12 18:00:00 | 237.75 |
| 2012-11-12 19:00:00 | 227.75 |
| 2012-11-12 20:00:00 | 223.75 |
| 2012-11-12 21:00:00 | 224 |
| 2012-11-12 22:00:00 | 225.5 |
| 2012-11-12 23:00:00 | 246 |
| 2012-11-13 | 254.5 |
| 2012-11-13 01:00:00 | 244 |
| 2012-11-13 02:00:00 | 244 |
| 2012-11-13 03:00:00 | 229 |
| 2012-11-13 04:00:00 | 227.5 |
| 2012-11-13 05:00:00 | 227.25 |
| 2012-11-13 06:00:00 | 230 |
| 2012-11-13 07:00:00 | 225.75 |
| 2012-11-13 08:00:00 | 233 |
| 2012-11-13 09:00:00 | 232 |
| 2012-11-13 10:00:00 | 229.75 |
| 2012-11-13 11:00:00 | 235.5 |
| 2012-11-13 12:00:00 | 225 |
| 2012-11-13 13:00:00 | 222.25 |
| 2012-11-13 14:00:00 | 227.25 |
| 2012-11-13 15:00:00 | 227.5 |
| 2012-11-13 16:00:00 | 226.75 |
| 2012-11-13 17:00:00 | 237 |
| 2012-11-13 18:00:00 | 242.25 |
| 2012-11-13 19:00:00 | 228.5 |
| 2012-11-13 20:00:00 | 225 |
| 2012-11-13 21:00:00 | 225.75 |
| 2012-11-13 22:00:00 | 226.25 |
| 2012-11-13 23:00:00 | 239.25 |
| 2012-11-14 | 258 |
| 2012-11-14 01:00:00 | 249.75 |
| 2012-11-14 02:00:00 | 246.25 |
| 2012-11-14 03:00:00 | 236 |
| 2012-11-14 04:00:00 | 232.5 |
| 2012-11-14 05:00:00 | 231.75 |
| 2012-11-14 06:00:00 | 235.25 |
| 2012-11-14 07:00:00 | 231.25 |
| 2012-11-14 08:00:00 | 230 |
| 2012-11-14 09:00:00 | 230.25 |
| 2012-11-14 10:00:00 | 239 |
| 2012-11-14 11:00:00 | 235.25 |
| 2012-11-14 12:00:00 | 225.75 |
| 2012-11-14 13:00:00 | 229.75 |
| 2012-11-14 14:00:00 | 227 |
| 2012-11-14 15:00:00 | 225.25 |
| 2012-11-14 16:00:00 | 233.25 |
| 2012-11-14 17:00:00 | 216.25 |
| 2012-11-14 18:00:00 | 228.5 |
| 2012-11-14 19:00:00 | 227 |
| 2012-11-14 20:00:00 | 226.5 |
| 2012-11-14 21:00:00 | 230 |
| 2012-11-14 22:00:00 | 229.5 |
| 2012-11-14 23:00:00 | 252 |
| 2012-11-15 | 254 |
| 2012-11-15 01:00:00 | 246.25 |
| 2012-11-15 02:00:00 | 247.25 |
| 2012-11-15 03:00:00 | 236.5 |
| 2012-11-15 04:00:00 | 231.5 |
| 2012-11-15 05:00:00 | 234.75 |
| 2012-11-15 06:00:00 | 234.25 |
| 2012-11-15 07:00:00 | 239.5 |
| 2012-11-15 08:00:00 | 235.75 |
| 2012-11-15 09:00:00 | 242.75 |
| 2012-11-15 10:00:00 | 228.25 |
| 2012-11-15 11:00:00 | 229.75 |
| 2012-11-15 12:00:00 | 230.75 |
| 2012-11-15 13:00:00 | 229 |
| 2012-11-15 14:00:00 | 203.5 |
| 2012-11-15 15:00:00 | 203.25 |
| 2012-11-15 16:00:00 | 218.5 |
| 2012-11-15 17:00:00 | 203.25 |
| 2012-11-15 18:00:00 | 186.5 |
| 2012-11-15 19:00:00 | 223.75 |
| 2012-11-15 20:00:00 | 227 |
| 2012-11-15 21:00:00 | 227 |
| 2012-11-15 22:00:00 | 232 |
| 2012-11-15 23:00:00 | 251.5 |
| 2012-11-16 | 250.5 |
| 2012-11-16 01:00:00 | 251 |
| 2012-11-16 02:00:00 | 245.25 |
| 2012-11-16 03:00:00 | 232 |
| 2012-11-16 04:00:00 | 233.25 |
| 2012-11-16 05:00:00 | 229.25 |
| 2012-11-16 06:00:00 | 228.25 |
| 2012-11-16 07:00:00 | 231.75 |
| 2012-11-16 08:00:00 | 232.25 |
| 2012-11-16 09:00:00 | 217 |
| 2012-11-16 10:00:00 | 231 |
| 2012-11-16 11:00:00 | 226.75 |
| 2012-11-16 12:00:00 | 235.25 |
| 2012-11-16 13:00:00 | 237.25 |
| 2012-11-16 14:00:00 | 227.5 |
| 2012-11-16 15:00:00 | 225.75 |
| 2012-11-16 16:00:00 | 232.25 |
| 2012-11-16 17:00:00 | 229 |
| 2012-11-16 18:00:00 | 231.5 |
| 2012-11-16 19:00:00 | 230.5 |
| 2012-11-16 20:00:00 | 232.25 |
| 2012-11-16 21:00:00 | 228 |
| 2012-11-16 22:00:00 | 235.5 |
| 2012-11-16 23:00:00 | 245.75 |
| 2012-11-17 | 258.5 |
| 2012-11-17 01:00:00 | 248.75 |
| 2012-11-17 02:00:00 | 244 |
| 2012-11-17 03:00:00 | 231.5 |
| 2012-11-17 04:00:00 | 234.75 |
| 2012-11-17 05:00:00 | 234.5 |
| 2012-11-17 06:00:00 | 232 |
| 2012-11-17 07:00:00 | 231.5 |
| 2012-11-17 08:00:00 | 227.5 |
| 2012-11-17 09:00:00 | 235.25 |
| 2012-11-17 10:00:00 | 217.75 |
| 2012-11-17 11:00:00 | 215.5 |
| 2012-11-17 12:00:00 | 231.75 |
| 2012-11-17 13:00:00 | 336.75 |
| 2012-11-17 14:00:00 | 345.25 |
| 2012-11-17 15:00:00 | 343 |
| 2012-11-17 16:00:00 | 334.5 |
| 2012-11-17 17:00:00 | 343 |
| 2012-11-17 18:00:00 | 354.5 |
| 2012-11-17 19:00:00 | 347.5 |
| 2012-11-17 20:00:00 | 342.5 |
| 2012-11-17 21:00:00 | 345.25 |
| 2012-11-17 22:00:00 | 354.25 |
| 2012-11-17 23:00:00 | 368.5 |
| 2012-11-18 | 364.5 |
| 2012-11-18 01:00:00 | 363.25 |
| 2012-11-18 02:00:00 | 362.75 |
| 2012-11-18 03:00:00 | 348.25 |
| 2012-11-18 04:00:00 | 350.75 |
| 2012-11-18 05:00:00 | 349.5 |
| 2012-11-18 06:00:00 | 345.75 |
| 2012-11-18 07:00:00 | 346.25 |
| 2012-11-18 08:00:00 | 346 |
| 2012-11-18 09:00:00 | 340 |
| 2012-11-18 10:00:00 | 342.25 |
| 2012-11-18 11:00:00 | 338.5 |
| 2012-11-18 12:00:00 | 348.25 |
| 2012-11-18 13:00:00 | 353.5 |
| 2012-11-18 14:00:00 | 349.75 |
| 2012-11-18 15:00:00 | 345.5 |
| 2012-11-18 16:00:00 | 340.75 |
| 2012-11-18 17:00:00 | 342.75 |
| 2012-11-18 18:00:00 | 345.5 |
| 2012-11-18 19:00:00 | 347 |
| 2012-11-18 20:00:00 | 346.75 |
| 2012-11-18 21:00:00 | 345.25 |
| 2012-11-18 22:00:00 | 354.5 |
| 2012-11-18 23:00:00 | 360.25 |
| 2012-11-19 | 359 |
| 2012-11-19 01:00:00 | 359.25 |
| 2012-11-19 02:00:00 | 355.75 |
| 2012-11-19 03:00:00 | 343.75 |
| 2012-11-19 04:00:00 | 345.5 |
| 2012-11-19 05:00:00 | 347.75 |
| 2012-11-19 06:00:00 | 346.25 |
| 2012-11-19 07:00:00 | 349 |
| 2012-11-19 08:00:00 | 360.5 |
| 2012-11-19 09:00:00 | 374 |
| 2012-11-19 10:00:00 | 265.25 |
| 2012-11-19 11:00:00 | 272.25 |
| 2012-11-19 12:00:00 | 273.25 |
| 2012-11-19 13:00:00 | 255.5 |
| 2012-11-19 14:00:00 | 369 |
| 2012-11-19 15:00:00 | 388.25 |
| 2012-11-19 16:00:00 | 376.75 |
| 2012-11-19 17:00:00 | 333.25 |
| 2012-11-19 18:00:00 | 337.5 |
| 2012-11-19 19:00:00 | 337.5 |
| 2012-11-19 20:00:00 | 334.75 |
| 2012-11-19 21:00:00 | 338.5 |
| 2012-11-19 22:00:00 | 335.75 |
| 2012-11-19 23:00:00 | 410.5 |
| 2012-11-20 | 362.25 |
| 2012-11-20 01:00:00 | 381.5 |
| 2012-11-20 02:00:00 | 386.5 |
| 2012-11-20 03:00:00 | 381 |
| 2012-11-20 04:00:00 | 359 |
| 2012-11-20 05:00:00 | 384.5 |
| 2012-11-20 06:00:00 | 387.75 |
| 2012-11-20 07:00:00 | 392.75 |
| 2012-11-20 08:00:00 | 400 |
| 2012-11-20 09:00:00 | 399.5 |
| 2012-11-20 10:00:00 | 365.25 |
| 2012-11-20 11:00:00 | 345 |
| 2012-11-20 12:00:00 | 345 |
| 2012-11-20 13:00:00 | 348.5 |
| 2012-11-20 14:00:00 | 349.25 |
| 2012-11-20 15:00:00 | 353.25 |
| 2012-11-20 16:00:00 | 358.25 |
| 2012-11-20 17:00:00 | 351.5 |
| 2012-11-20 18:00:00 | 354 |
| 2012-11-20 19:00:00 | 343 |
| 2012-11-20 20:00:00 | 340.75 |
| 2012-11-20 21:00:00 | 342.75 |
| 2012-11-20 22:00:00 | 353.5 |
| 2012-11-20 23:00:00 | 377.25 |
| 2012-11-21 | 373 |
| 2012-11-21 01:00:00 | 382.25 |
| 2012-11-21 02:00:00 | 370.5 |
| 2012-11-21 03:00:00 | 354 |
| 2012-11-21 04:00:00 | 351 |
| 2012-11-21 05:00:00 | 377 |
| 2012-11-21 06:00:00 | 376 |
| 2012-11-21 07:00:00 | 377 |
| 2012-11-21 08:00:00 | 379.75 |
| 2012-11-21 09:00:00 | 336 |
| 2012-11-21 10:00:00 | 334.75 |
| 2012-11-21 11:00:00 | 337.25 |
| 2012-11-21 12:00:00 | 326 |
| 2012-11-21 13:00:00 | 341.75 |
| 2012-11-21 14:00:00 | 342 |
| 2012-11-21 15:00:00 | 347.5 |
| 2012-11-21 16:00:00 | 355.25 |
| 2012-11-21 17:00:00 | 353 |
| 2012-11-21 18:00:00 | 364 |
| 2012-11-21 19:00:00 | 359.25 |
| 2012-11-21 20:00:00 | 350.75 |
| 2012-11-21 21:00:00 | 350.5 |
| 2012-11-21 22:00:00 | 348.75 |
| 2012-11-21 23:00:00 | 380.75 |
| 2012-11-22 | 389 |
| 2012-11-22 01:00:00 | 386 |
| 2012-11-22 02:00:00 | 377.75 |
| 2012-11-22 03:00:00 | 365.25 |
| 2012-11-22 04:00:00 | 367.75 |
| 2012-11-22 05:00:00 | 380.75 |
| 2012-11-22 06:00:00 | 383.75 |
| 2012-11-22 07:00:00 | 385.25 |
| 2012-11-22 08:00:00 | 399.25 |
| 2012-11-22 09:00:00 | 371.75 |
| 2012-11-22 10:00:00 | 339.25 |
| 2012-11-22 11:00:00 | 331.75 |
| 2012-11-22 12:00:00 | 333.75 |
| 2012-11-22 13:00:00 | 338.75 |
| 2012-11-22 14:00:00 | 331.25 |
| 2012-11-22 15:00:00 | 342 |
| 2012-11-22 16:00:00 | 343.5 |
| 2012-11-22 17:00:00 | 339.75 |
| 2012-11-22 18:00:00 | 341.25 |
| 2012-11-22 19:00:00 | 339.25 |
| 2012-11-22 20:00:00 | 342.25 |
| 2012-11-22 21:00:00 | 345.25 |
| 2012-11-22 22:00:00 | 348 |
| 2012-11-22 23:00:00 | 374.25 |
| 2012-11-23 | 379.5 |
| 2012-11-23 01:00:00 | 376.5 |
| 2012-11-23 02:00:00 | 374.25 |
| 2012-11-23 03:00:00 | 358 |
| 2012-11-23 04:00:00 | 354 |
| 2012-11-23 05:00:00 | 369 |
| 2012-11-23 06:00:00 | 374.25 |
| 2012-11-23 07:00:00 | 381.75 |
| 2012-11-23 08:00:00 | 388.5 |
| 2012-11-23 09:00:00 | 392.25 |
| 2012-11-23 10:00:00 | 360.5 |
| 2012-11-23 11:00:00 | 345.75 |
| 2012-11-23 12:00:00 | 332 |
| 2012-11-23 13:00:00 | 346 |
| 2012-11-23 14:00:00 | 353.5 |
| 2012-11-23 15:00:00 | 358 |
| 2012-11-23 16:00:00 | 356.25 |
| 2012-11-23 17:00:00 | 348.75 |
| 2012-11-23 18:00:00 | 350.5 |
| 2012-11-23 19:00:00 | 351.5 |
| 2012-11-23 20:00:00 | 351.75 |
| 2012-11-23 21:00:00 | 353 |
| 2012-11-23 22:00:00 | 341.75 |
| 2012-11-23 23:00:00 | 370.75 |
| 2012-11-24 | 365.5 |
| 2012-11-24 01:00:00 | 388.75 |
| 2012-11-24 02:00:00 | 394 |
| 2012-11-24 03:00:00 | 371.75 |
| 2012-11-24 04:00:00 | 367 |
| 2012-11-24 05:00:00 | 376.75 |
| 2012-11-24 06:00:00 | 389.25 |
| 2012-11-24 07:00:00 | 389.25 |
| 2012-11-24 08:00:00 | 386.75 |
| 2012-11-24 09:00:00 | 388 |
| 2012-11-24 10:00:00 | 395.25 |
| 2012-11-24 11:00:00 | 395 |
| 2012-11-24 12:00:00 | 382.75 |
| 2012-11-24 13:00:00 | 391 |
| 2012-11-24 14:00:00 | 386.75 |
| 2012-11-24 15:00:00 | 386 |
| 2012-11-24 16:00:00 | 387.75 |
| 2012-11-24 17:00:00 | 386.25 |
| 2012-11-24 18:00:00 | 386.25 |
| 2012-11-24 19:00:00 | 383 |
| 2012-11-24 20:00:00 | 383.25 |
| 2012-11-24 21:00:00 | 392 |
| 2012-11-24 22:00:00 | 408.5 |
| 2012-11-24 23:00:00 | 402.75 |
| 2012-11-25 | 399.5 |
| 2012-11-25 01:00:00 | 388.5 |
| 2012-11-25 02:00:00 | 380 |
| 2012-11-25 03:00:00 | 370.25 |
| 2012-11-25 04:00:00 | 367.75 |
| 2012-11-25 05:00:00 | 369.5 |
| 2012-11-25 06:00:00 | 383.5 |
| 2012-11-25 07:00:00 | 393 |
| 2012-11-25 08:00:00 | 391 |
| 2012-11-25 09:00:00 | 393.25 |
| 2012-11-25 10:00:00 | 410 |
| 2012-11-25 11:00:00 | 399 |
| 2012-11-25 12:00:00 | 389.25 |
| 2012-11-25 13:00:00 | 401 |
| 2012-11-25 14:00:00 | 387.25 |
| 2012-11-25 15:00:00 | 385.25 |
| 2012-11-25 16:00:00 | 381.75 |
| 2012-11-25 17:00:00 | 386 |
| 2012-11-25 18:00:00 | 388.5 |
| 2012-11-25 19:00:00 | 389.75 |
| 2012-11-25 20:00:00 | 385.75 |
| 2012-11-25 21:00:00 | 391.75 |
| 2012-11-25 22:00:00 | 394 |
| 2012-11-25 23:00:00 | 400.5 |
| 2012-11-26 | 398.75 |
| 2012-11-26 01:00:00 | 387.25 |
| 2012-11-26 02:00:00 | 385.5 |
| 2012-11-26 03:00:00 | 372.25 |
| 2012-11-26 04:00:00 | 359.25 |
| 2012-11-26 05:00:00 | 370.75 |
| 2012-11-26 06:00:00 | 380.5 |
| 2012-11-26 07:00:00 | 386.25 |
| 2012-11-26 08:00:00 | 399.25 |
| 2012-11-26 09:00:00 | 392 |
| 2012-11-26 10:00:00 | 391.75 |
| 2012-11-26 11:00:00 | 408.75 |
| 2012-11-26 12:00:00 | 400.75 |
| 2012-11-26 13:00:00 | 389.5 |
| 2012-11-26 14:00:00 | 387.75 |
| 2012-11-26 15:00:00 | 384.5 |
| 2012-11-26 16:00:00 | 350.5 |
| 2012-11-26 17:00:00 | 349 |
| 2012-11-26 18:00:00 | 349 |
| 2012-11-26 19:00:00 | 348 |
| 2012-11-26 20:00:00 | 350 |
| 2012-11-26 21:00:00 | 344 |
| 2012-11-26 22:00:00 | 357 |
| 2012-11-26 23:00:00 | 360.25 |
| 2012-11-27 | 379 |
| 2012-11-27 01:00:00 | 394.5 |
| 2012-11-27 02:00:00 | 382.75 |
| 2012-11-27 03:00:00 | 369.25 |
| 2012-11-27 04:00:00 | 362.5 |
| 2012-11-27 05:00:00 | 372.5 |
| 2012-11-27 06:00:00 | 385.5 |
| 2012-11-27 07:00:00 | 389.75 |
| 2012-11-27 08:00:00 | 404 |
| 2012-11-27 09:00:00 | 401.25 |
| 2012-11-27 10:00:00 | 401.5 |
| 2012-11-27 11:00:00 | 420.75 |
| 2012-11-27 12:00:00 | 373.25 |
| 2012-11-27 13:00:00 | 393.25 |
| 2012-11-27 14:00:00 | 352.75 |
| 2012-11-27 15:00:00 | 339.25 |
| 2012-11-27 16:00:00 | 346.25 |
| 2012-11-27 17:00:00 | 352.75 |
| 2012-11-27 18:00:00 | 348 |
| 2012-11-27 19:00:00 | 345.75 |
| 2012-11-27 20:00:00 | 346.5 |
| 2012-11-27 21:00:00 | 348.25 |
| 2012-11-27 22:00:00 | 343.5 |
| 2012-11-27 23:00:00 | 358 |
| 2012-11-28 | 384 |
| 2012-11-28 01:00:00 | 394.75 |
| 2012-11-28 02:00:00 | 393.75 |
| 2012-11-28 03:00:00 | 373.75 |
| 2012-11-28 04:00:00 | 362.75 |
| 2012-11-28 05:00:00 | 373.25 |
| 2012-11-28 06:00:00 | 385.75 |
| 2012-11-28 07:00:00 | 389.75 |
| 2012-11-28 08:00:00 | 391.5 |
| 2012-11-28 09:00:00 | 394.5 |
| 2012-11-28 10:00:00 | 396.75 |
| 2012-11-28 11:00:00 | 452.25 |
| 2012-11-28 12:00:00 | 321.5 |
| 2012-11-28 13:00:00 | 415.5 |
| 2012-11-28 14:00:00 | 381.25 |
| 2012-11-28 15:00:00 | 380.25 |
| 2012-11-28 16:00:00 | 374.25 |
| 2012-11-28 17:00:00 | 369.25 |
| 2012-11-28 18:00:00 | 374.75 |
| 2012-11-28 19:00:00 | 363.25 |
| 2012-11-28 20:00:00 | 359 |
| 2012-11-28 21:00:00 | 361 |
| 2012-11-28 22:00:00 | 359.25 |
| 2012-11-28 23:00:00 | 378.5 |
| 2012-11-29 | 383.75 |
| 2012-11-29 01:00:00 | 393.5 |
| 2012-11-29 02:00:00 | 398 |
| 2012-11-29 03:00:00 | 383.25 |
| 2012-11-29 04:00:00 | 371.25 |
| 2012-11-29 05:00:00 | 392.25 |
| 2012-11-29 06:00:00 | 397.75 |
| 2012-11-29 07:00:00 | 418.5 |
| 2012-11-29 08:00:00 | 419.25 |
| 2012-11-29 09:00:00 | 413.75 |
| 2012-11-29 10:00:00 | 416.25 |
| 2012-11-29 11:00:00 | 390.75 |
| 2012-11-29 12:00:00 | 359 |
| 2012-11-29 13:00:00 | 375.75 |
| 2012-11-29 14:00:00 | 390.25 |
| 2012-11-29 15:00:00 | 372.75 |
| 2012-11-29 16:00:00 | 365.75 |
| 2012-11-29 17:00:00 | 361 |
| 2012-11-29 18:00:00 | 359.25 |
| 2012-11-29 19:00:00 | 360 |
| 2012-11-29 20:00:00 | 358 |
| 2012-11-29 21:00:00 | 359 |
| 2012-11-29 22:00:00 | 368 |
| 2012-11-29 23:00:00 | 378.25 |
| 2012-11-30 | 372.75 |
| 2012-11-30 01:00:00 | 388.75 |
| 2012-11-30 02:00:00 | 401 |
| 2012-11-30 03:00:00 | 394.5 |
| 2012-11-30 04:00:00 | 380.75 |
| 2012-11-30 05:00:00 | 397.25 |
| 2012-11-30 06:00:00 | 399.25 |
| 2012-11-30 07:00:00 | 407.5 |
| 2012-11-30 08:00:00 | 418 |
| 2012-11-30 09:00:00 | 390.5 |
| 2012-11-30 10:00:00 | 363 |
| 2012-11-30 11:00:00 | 372.5 |
| 2012-11-30 12:00:00 | 379 |
| 2012-11-30 13:00:00 | 404.25 |
| 2012-11-30 14:00:00 | 397.75 |
| 2012-11-30 15:00:00 | 361.25 |
| 2012-11-30 16:00:00 | 360.75 |
| 2012-11-30 17:00:00 | 373.25 |
| 2012-11-30 18:00:00 | 364.25 |
| 2012-11-30 19:00:00 | 363.5 |
| 2012-11-30 20:00:00 | 359.5 |
| 2012-11-30 21:00:00 | 358.25 |
| 2012-11-30 22:00:00 | 364.25 |
| 2012-11-30 23:00:00 | 388.25 |
| 2012-12-01 | 397.5 |
| 2012-12-01 01:00:00 | 405.75 |
| 2012-12-01 02:00:00 | 401.5 |
| 2012-12-01 03:00:00 | 383.75 |
| 2012-12-01 04:00:00 | 379.5 |
| 2012-12-01 05:00:00 | 385 |
| 2012-12-01 06:00:00 | 404 |
| 2012-12-01 07:00:00 | 469.25 |
| 2012-12-01 08:00:00 | 465.5 |
| 2012-12-01 09:00:00 | 465.5 |
| 2012-12-01 10:00:00 | 371.75 |
| 2012-12-01 11:00:00 | 356.75 |
| 2012-12-01 12:00:00 | 351 |
| 2012-12-01 13:00:00 | 355.5 |
| 2012-12-01 14:00:00 | 356 |
| 2012-12-01 15:00:00 | 352.75 |
| 2012-12-01 16:00:00 | 355.75 |
| 2012-12-01 17:00:00 | 363.25 |
| 2012-12-01 18:00:00 | 372.5 |
| 2012-12-01 19:00:00 | 420.5 |
| 2012-12-01 20:00:00 | 416.5 |
| 2012-12-01 21:00:00 | 407.5 |
| 2012-12-01 22:00:00 | 409.25 |
| 2012-12-01 23:00:00 | 408.5 |
| 2012-12-02 | 413 |
| 2012-12-02 01:00:00 | 411 |
| 2012-12-02 02:00:00 | 408.5 |
| 2012-12-02 03:00:00 | 407 |
| 2012-12-02 04:00:00 | 400 |
| 2012-12-02 05:00:00 | 388.75 |
| 2012-12-02 06:00:00 | 423 |
| 2012-12-02 07:00:00 | 451.75 |
| 2012-12-02 08:00:00 | 446.5 |
| 2012-12-02 09:00:00 | 443.5 |
| 2012-12-02 10:00:00 | 460 |
| 2012-12-02 11:00:00 | 429.75 |
| 2012-12-02 12:00:00 | 391 |
| 2012-12-02 13:00:00 | 412 |
| 2012-12-02 14:00:00 | 409 |
| 2012-12-02 15:00:00 | 398.25 |
| 2012-12-02 16:00:00 | 397.75 |
| 2012-12-02 17:00:00 | 401 |
| 2012-12-02 18:00:00 | 401.25 |
| 2012-12-02 19:00:00 | 408.5 |
| 2012-12-02 20:00:00 | 404 |
| 2012-12-02 21:00:00 | 400.25 |
| 2012-12-02 22:00:00 | 410.75 |
| 2012-12-02 23:00:00 | 422.75 |
| 2012-12-03 | 421.25 |
| 2012-12-03 01:00:00 | 407 |
| 2012-12-03 02:00:00 | 406 |
| 2012-12-03 03:00:00 | 390.75 |
| 2012-12-03 04:00:00 | 384.25 |
| 2012-12-03 05:00:00 | 390.25 |
| 2012-12-03 06:00:00 | 398.75 |
| 2012-12-03 07:00:00 | 409.25 |
| 2012-12-03 08:00:00 | 398.75 |
| 2012-12-03 09:00:00 | 372.5 |
| 2012-12-03 10:00:00 | 369.75 |
| 2012-12-03 11:00:00 | 356.75 |
| 2012-12-03 12:00:00 | 362.5 |
| 2012-12-03 13:00:00 | 376.75 |
| 2012-12-03 14:00:00 | 410 |
| 2012-12-03 15:00:00 | 419.75 |
| 2012-12-03 16:00:00 | 394.25 |
| 2012-12-03 17:00:00 | 364.5 |
| 2012-12-03 18:00:00 | 362 |
| 2012-12-03 19:00:00 | 363 |
| 2012-12-03 20:00:00 | 361.5 |
| 2012-12-03 21:00:00 | 364.5 |
| 2012-12-03 22:00:00 | 363.25 |
| 2012-12-03 23:00:00 | 384 |
| 2012-12-04 | 392 |
| 2012-12-04 01:00:00 | 408 |
| 2012-12-04 02:00:00 | 407.75 |
| 2012-12-04 03:00:00 | 391.25 |
| 2012-12-04 04:00:00 | 380.75 |
| 2012-12-04 05:00:00 | 388.5 |
| 2012-12-04 06:00:00 | 395.25 |
| 2012-12-04 07:00:00 | 414.25 |
| 2012-12-04 08:00:00 | 421.75 |
| 2012-12-04 09:00:00 | 403.75 |
| 2012-12-04 10:00:00 | 357.75 |
| 2012-12-04 11:00:00 | 363.25 |
| 2012-12-04 12:00:00 | 367.25 |
| 2012-12-04 13:00:00 | 372.75 |
| 2012-12-04 14:00:00 | 358.75 |
| 2012-12-04 15:00:00 | 358.5 |
| 2012-12-04 16:00:00 | 373.75 |
| 2012-12-04 17:00:00 | 362.75 |
| 2012-12-04 18:00:00 | 362.75 |
| 2012-12-04 19:00:00 | 356.5 |
| 2012-12-04 20:00:00 | 354 |
| 2012-12-04 21:00:00 | 357.25 |
| 2012-12-04 22:00:00 | 358 |
| 2012-12-04 23:00:00 | 385.5 |
| 2012-12-05 | 390 |
| 2012-12-05 01:00:00 | 403 |
| 2012-12-05 02:00:00 | 404.25 |
| 2012-12-05 03:00:00 | 385.25 |
| 2012-12-05 04:00:00 | 377.5 |
| 2012-12-05 05:00:00 | 386.5 |
| 2012-12-05 06:00:00 | 392.25 |
| 2012-12-05 07:00:00 | 407.5 |
| 2012-12-05 08:00:00 | 413.5 |
| 2012-12-05 09:00:00 | 415.5 |
| 2012-12-05 10:00:00 | 389.25 |
| 2012-12-05 11:00:00 | 363.25 |
| 2012-12-05 12:00:00 | 357.75 |
| 2012-12-05 13:00:00 | 354.25 |
| 2012-12-05 14:00:00 | 346.5 |
| 2012-12-05 15:00:00 | 350 |
| 2012-12-05 16:00:00 | 359 |
| 2012-12-05 17:00:00 | 353.5 |
| 2012-12-05 18:00:00 | 356 |
| 2012-12-05 19:00:00 | 352.5 |
| 2012-12-05 20:00:00 | 356.25 |
| 2012-12-05 21:00:00 | 355.75 |
| 2012-12-05 22:00:00 | 372 |
| 2012-12-05 23:00:00 | 391.5 |
| 2012-12-06 | 397.75 |
| 2012-12-06 01:00:00 | 408.5 |
| 2012-12-06 02:00:00 | 402 |
| 2012-12-06 03:00:00 | 388.5 |
| 2012-12-06 04:00:00 | 382 |
| 2012-12-06 05:00:00 | 388.25 |
| 2012-12-06 06:00:00 | 398.5 |
| 2012-12-06 07:00:00 | 422 |
| 2012-12-06 08:00:00 | 384.5 |
| 2012-12-06 09:00:00 | 271.25 |
| 2012-12-06 10:00:00 | 269 |
| 2012-12-06 11:00:00 | 270 |
| 2012-12-06 12:00:00 | 261.75 |
| 2012-12-06 13:00:00 | 278.25 |
| 2012-12-06 14:00:00 | 266.75 |
| 2012-12-06 15:00:00 | 290.5 |
| 2012-12-06 16:00:00 | 296.25 |
| 2012-12-06 17:00:00 | 330.5 |
| 2012-12-06 18:00:00 | 380.5 |
| 2012-12-06 19:00:00 | 374.75 |
| 2012-12-06 20:00:00 | 376.25 |
| 2012-12-06 21:00:00 | 380.25 |
| 2012-12-06 22:00:00 | 381.75 |
| 2012-12-06 23:00:00 | 392.5 |
| 2012-12-07 | 394.25 |
| 2012-12-07 01:00:00 | 407.75 |
| 2012-12-07 02:00:00 | 404.5 |
| 2012-12-07 03:00:00 | 388.75 |
| 2012-12-07 04:00:00 | 384.5 |
| 2012-12-07 05:00:00 | 394.25 |
| 2012-12-07 06:00:00 | 400.25 |
| 2012-12-07 07:00:00 | 409.5 |
| 2012-12-07 08:00:00 | 419.5 |
| 2012-12-07 09:00:00 | 417.5 |
| 2012-12-07 10:00:00 | 408.5 |
| 2012-12-07 11:00:00 | 403 |
| 2012-12-07 12:00:00 | 362 |
| 2012-12-07 13:00:00 | 376.5 |
| 2012-12-07 14:00:00 | 365.25 |
| 2012-12-07 15:00:00 | 356 |
| 2012-12-07 16:00:00 | 360 |
| 2012-12-07 17:00:00 | 368.75 |
| 2012-12-07 18:00:00 | 359 |
| 2012-12-07 19:00:00 | 359.5 |
| 2012-12-07 20:00:00 | 361.75 |
| 2012-12-07 21:00:00 | 358.25 |
| 2012-12-07 22:00:00 | 376.5 |
| 2012-12-07 23:00:00 | 386.25 |
| 2012-12-08 | 380.75 |
| 2012-12-08 01:00:00 | 406.25 |
| 2012-12-08 02:00:00 | 400.25 |
| 2012-12-08 03:00:00 | 388 |
| 2012-12-08 04:00:00 | 383.5 |
| 2012-12-08 05:00:00 | 395.5 |
| 2012-12-08 06:00:00 | 400.75 |
| 2012-12-08 07:00:00 | 405 |
| 2012-12-08 08:00:00 | 403.75 |
| 2012-12-08 09:00:00 | 399.75 |
| 2012-12-08 10:00:00 | 404 |
| 2012-12-08 11:00:00 | 405.5 |
| 2012-12-08 12:00:00 | 393.5 |
| 2012-12-08 13:00:00 | 404.5 |
| 2012-12-08 14:00:00 | 400.5 |
| 2012-12-08 15:00:00 | 396 |
| 2012-12-08 16:00:00 | 396.5 |
| 2012-12-08 17:00:00 | 394.75 |
| 2012-12-08 18:00:00 | 394.25 |
| 2012-12-08 19:00:00 | 396 |
| 2012-12-08 20:00:00 | 397.75 |
| 2012-12-08 21:00:00 | 405.75 |
| 2012-12-08 22:00:00 | 420.25 |
| 2012-12-08 23:00:00 | 424.75 |
| 2012-12-09 | 413 |
| 2012-12-09 01:00:00 | 393.75 |
| 2012-12-09 02:00:00 | 383.25 |
| 2012-12-09 03:00:00 | 382.75 |
| 2012-12-09 04:00:00 | 375.75 |
| 2012-12-09 05:00:00 | 378 |
| 2012-12-09 06:00:00 | 396.75 |
| 2012-12-09 07:00:00 | 400.25 |
| 2012-12-09 08:00:00 | 395 |
| 2012-12-09 09:00:00 | 402 |
| 2012-12-09 10:00:00 | 401.25 |
| 2012-12-09 11:00:00 | 390.75 |
| 2012-12-09 12:00:00 | 390 |
| 2012-12-09 13:00:00 | 403.5 |
| 2012-12-09 14:00:00 | 406.75 |
| 2012-12-09 15:00:00 | 394.25 |
| 2012-12-09 16:00:00 | 396.25 |
| 2012-12-09 17:00:00 | 398 |
| 2012-12-09 18:00:00 | 398.5 |
| 2012-12-09 19:00:00 | 413.25 |
| 2012-12-09 20:00:00 | 394.75 |
| 2012-12-09 21:00:00 | 401.5 |
| 2012-12-09 22:00:00 | 410.75 |
| 2012-12-09 23:00:00 | 410.5 |
| 2012-12-10 | 410.5 |
| 2012-12-10 01:00:00 | 395 |
| 2012-12-10 02:00:00 | 381.75 |
| 2012-12-10 03:00:00 | 382 |
| 2012-12-10 04:00:00 | 375 |
| 2012-12-10 05:00:00 | 385.5 |
| 2012-12-10 06:00:00 | 394.25 |
| 2012-12-10 07:00:00 | 410.75 |
| 2012-12-10 08:00:00 | 386.25 |
| 2012-12-10 09:00:00 | 374.5 |
| 2012-12-10 10:00:00 | 378 |
| 2012-12-10 11:00:00 | 363.75 |
| 2012-12-10 12:00:00 | 356.25 |
| 2012-12-10 13:00:00 | 377.25 |
| 2012-12-10 14:00:00 | 408.5 |
| 2012-12-10 15:00:00 | 403.75 |
| 2012-12-10 16:00:00 | 398.25 |
| 2012-12-10 17:00:00 | 405.5 |
| 2012-12-10 18:00:00 | 408.5 |
| 2012-12-10 19:00:00 | 359.75 |
| 2012-12-10 20:00:00 | 355.5 |
| 2012-12-10 21:00:00 | 353.75 |
| 2012-12-10 22:00:00 | 357.25 |
| 2012-12-10 23:00:00 | 374.25 |
| 2012-12-11 | 388 |
| 2012-12-11 01:00:00 | 402.75 |
| 2012-12-11 02:00:00 | 399.25 |
| 2012-12-11 03:00:00 | 383 |
| 2012-12-11 04:00:00 | 377.75 |
| 2012-12-11 05:00:00 | 386 |
| 2012-12-11 06:00:00 | 395.75 |
| 2012-12-11 07:00:00 | 378.5 |
| 2012-12-11 08:00:00 | 371.5 |
| 2012-12-11 09:00:00 | 370 |
| 2012-12-11 10:00:00 | 369.25 |
| 2012-12-11 11:00:00 | 363.25 |
| 2012-12-11 12:00:00 | 356.75 |
| 2012-12-11 13:00:00 | 369.5 |
| 2012-12-11 14:00:00 | 363 |
| 2012-12-11 15:00:00 | 365.25 |
| 2012-12-11 16:00:00 | 347.5 |
| 2012-12-11 17:00:00 | 361.25 |
| 2012-12-11 18:00:00 | 354.5 |
| 2012-12-11 19:00:00 | 346.75 |
| 2012-12-11 20:00:00 | 347.5 |
| 2012-12-11 21:00:00 | 351.5 |
| 2012-12-11 22:00:00 | 347.5 |
| 2012-12-11 23:00:00 | 360 |
| 2012-12-12 | 374.75 |
| 2012-12-12 01:00:00 | 386.25 |
| 2012-12-12 02:00:00 | 385.5 |
| 2012-12-12 03:00:00 | 367.25 |
| 2012-12-12 04:00:00 | 360.75 |
| 2012-12-12 05:00:00 | 371.5 |
| 2012-12-12 06:00:00 | 383.25 |
| 2012-12-12 07:00:00 | 390.25 |
| 2012-12-12 08:00:00 | 370.5 |
| 2012-12-12 09:00:00 | 366.5 |
| 2012-12-12 10:00:00 | 342.5 |
| 2012-12-12 11:00:00 | 347.25 |
| 2012-12-12 12:00:00 | 343.25 |
| 2012-12-12 13:00:00 | 359 |
| 2012-12-12 14:00:00 | 351.5 |
| 2012-12-12 15:00:00 | 359.25 |
| 2012-12-12 16:00:00 | 363 |
| 2012-12-12 17:00:00 | 362.25 |
| 2012-12-12 18:00:00 | 359.75 |
| 2012-12-12 19:00:00 | 350.25 |
| 2012-12-12 20:00:00 | 349.75 |
| 2012-12-12 21:00:00 | 351.75 |
| 2012-12-12 22:00:00 | 349 |
| 2012-12-12 23:00:00 | 374.25 |
| 2012-12-13 | 366.5 |
| 2012-12-13 01:00:00 | 394.75 |
| 2012-12-13 02:00:00 | 396.75 |
| 2012-12-13 03:00:00 | 383.25 |
| 2012-12-13 04:00:00 | 370.5 |
| 2012-12-13 05:00:00 | 377 |
| 2012-12-13 06:00:00 | 391.25 |
| 2012-12-13 07:00:00 | 398.25 |
| 2012-12-13 08:00:00 | 401 |
| 2012-12-13 09:00:00 | 363.25 |
| 2012-12-13 10:00:00 | 352.5 |
| 2012-12-13 11:00:00 | 347.75 |
| 2012-12-13 12:00:00 | 416.5 |
| 2012-12-13 13:00:00 | 378.5 |
| 2012-12-13 14:00:00 | 366.75 |
| 2012-12-13 15:00:00 | 364.75 |
| 2012-12-13 16:00:00 | 359.75 |
| 2012-12-13 17:00:00 | 362 |
| 2012-12-13 18:00:00 | 363 |
| 2012-12-13 19:00:00 | 355.5 |
| 2012-12-13 20:00:00 | 358.25 |
| 2012-12-13 21:00:00 | 357.5 |
| 2012-12-13 22:00:00 | 356.25 |
| 2012-12-13 23:00:00 | 383.75 |
| 2012-12-14 | 376.25 |
| 2012-12-14 01:00:00 | 398.5 |
| 2012-12-14 02:00:00 | 400.5 |
| 2012-12-14 03:00:00 | 387.5 |
| 2012-12-14 04:00:00 | 375.25 |
| 2012-12-14 05:00:00 | 377.5 |
| 2012-12-14 06:00:00 | 393 |
| 2012-12-14 07:00:00 | 405.25 |
| 2012-12-14 08:00:00 | 413 |
| 2012-12-14 09:00:00 | 374.5 |
| 2012-12-14 10:00:00 | 360 |
| 2012-12-14 11:00:00 | 355 |
| 2012-12-14 12:00:00 | 354.5 |
| 2012-12-14 13:00:00 | 373.25 |
| 2012-12-14 14:00:00 | 367.5 |
| 2012-12-14 15:00:00 | 364.25 |
| 2012-12-14 16:00:00 | 362.25 |
| 2012-12-14 17:00:00 | 358.75 |
| 2012-12-14 18:00:00 | 352.25 |
| 2012-12-14 19:00:00 | 352.25 |
| 2012-12-14 20:00:00 | 352 |
| 2012-12-14 21:00:00 | 361.25 |
| 2012-12-14 22:00:00 | 371.5 |
| 2012-12-14 23:00:00 | 372.5 |
| 2012-12-15 | 402.75 |
| 2012-12-15 01:00:00 | 392.25 |
| 2012-12-15 02:00:00 | 382.25 |
| 2012-12-15 03:00:00 | 381 |
| 2012-12-15 04:00:00 | 374.75 |
| 2012-12-15 05:00:00 | 376.5 |
| 2012-12-15 06:00:00 | 385 |
| 2012-12-15 07:00:00 | 389 |
| 2012-12-15 08:00:00 | 390 |
| 2012-12-15 09:00:00 | 387 |
| 2012-12-15 10:00:00 | 387.25 |
| 2012-12-15 11:00:00 | 392.75 |
| 2012-12-15 12:00:00 | 395.25 |
| 2012-12-15 13:00:00 | 398.75 |
| 2012-12-15 14:00:00 | 402.75 |
| 2012-12-15 15:00:00 | 407.25 |
| 2012-12-15 16:00:00 | 405.5 |
| 2012-12-15 17:00:00 | 401 |
| 2012-12-15 18:00:00 | 396.25 |
| 2012-12-15 19:00:00 | 391 |
| 2012-12-15 20:00:00 | 390.5 |
| 2012-12-15 21:00:00 | 391.25 |
| 2012-12-15 22:00:00 | 389.75 |
| 2012-12-15 23:00:00 | 416.5 |
| 2012-12-16 | 419.25 |
| 2012-12-16 01:00:00 | 397.5 |
| 2012-12-16 02:00:00 | 395.5 |
| 2012-12-16 03:00:00 | 381.75 |
| 2012-12-16 04:00:00 | 371.25 |
| 2012-12-16 05:00:00 | 382 |
| 2012-12-16 06:00:00 | 383.75 |
| 2012-12-16 07:00:00 | 390.75 |
| 2012-12-16 08:00:00 | 390.25 |
| 2012-12-16 09:00:00 | 386.75 |
| 2012-12-16 10:00:00 | 390.5 |
| 2012-12-16 11:00:00 | 388.5 |
| 2012-12-16 12:00:00 | 358.25 |
| 2012-12-16 13:00:00 | 347 |
| 2012-12-16 14:00:00 | 342.75 |
| 2012-12-16 15:00:00 | 343.75 |
| 2012-12-16 16:00:00 | 372 |
| 2012-12-16 17:00:00 | 416.5 |
| 2012-12-16 18:00:00 | 359 |
| 2012-12-16 19:00:00 | 352.75 |
| 2012-12-16 20:00:00 | 352 |
| 2012-12-16 21:00:00 | 347.75 |
| 2012-12-16 22:00:00 | 361.75 |
| 2012-12-16 23:00:00 | 366.5 |
| 2012-12-17 | 409.75 |
| 2012-12-17 01:00:00 | 399.25 |
| 2012-12-17 02:00:00 | 400.5 |
| 2012-12-17 03:00:00 | 384 |
| 2012-12-17 04:00:00 | 373.75 |
| 2012-12-17 05:00:00 | 381.75 |
| 2012-12-17 06:00:00 | 366 |
| 2012-12-17 07:00:00 | 357 |
| 2012-12-17 08:00:00 | 372.75 |
| 2012-12-17 09:00:00 | 350.25 |
| 2012-12-17 10:00:00 | 350.25 |
| 2012-12-17 11:00:00 | 352.75 |
| 2012-12-17 12:00:00 | 363.25 |
| 2012-12-17 13:00:00 | 370 |
| 2012-12-17 14:00:00 | 394.5 |
| 2012-12-17 15:00:00 | 411.75 |
| 2012-12-17 16:00:00 | 406.5 |
| 2012-12-17 17:00:00 | 397.75 |
| 2012-12-17 18:00:00 | 400 |
| 2012-12-17 19:00:00 | 397.25 |
| 2012-12-17 20:00:00 | 396.25 |
| 2012-12-17 21:00:00 | 395.75 |
| 2012-12-17 22:00:00 | 396.25 |
| 2012-12-17 23:00:00 | 419.75 |
| 2012-12-18 | 378 |
| 2012-12-18 01:00:00 | 399.5 |
| 2012-12-18 02:00:00 | 401.75 |
| 2012-12-18 03:00:00 | 381.5 |
| 2012-12-18 04:00:00 | 374.25 |
| 2012-12-18 05:00:00 | 390 |
| 2012-12-18 06:00:00 | 363.5 |
| 2012-12-18 07:00:00 | 357 |
| 2012-12-18 08:00:00 | 373 |
| 2012-12-18 09:00:00 | 372.75 |
| 2012-12-18 10:00:00 | 362.5 |
| 2012-12-18 11:00:00 | 368.25 |
| 2012-12-18 12:00:00 | 377.5 |
| 2012-12-18 13:00:00 | 370 |
| 2012-12-18 14:00:00 | 368.25 |
| 2012-12-18 15:00:00 | 361 |
| 2012-12-18 16:00:00 | 355.5 |
| 2012-12-18 17:00:00 | 359 |
| 2012-12-18 18:00:00 | 352.75 |
| 2012-12-18 19:00:00 | 347.75 |
| 2012-12-18 20:00:00 | 349.5 |
| 2012-12-18 21:00:00 | 347.5 |
| 2012-12-18 22:00:00 | 351.75 |
| 2012-12-18 23:00:00 | 373 |
| 2012-12-19 | 367.25 |
| 2012-12-19 01:00:00 | 398.25 |
| 2012-12-19 02:00:00 | 388.25 |
| 2012-12-19 03:00:00 | 372.75 |
| 2012-12-19 04:00:00 | 364.25 |
| 2012-12-19 05:00:00 | 386.5 |
| 2012-12-19 06:00:00 | 389.5 |
| 2012-12-19 07:00:00 | 382.5 |
| 2012-12-19 08:00:00 | 366.75 |
| 2012-12-19 09:00:00 | 361.75 |
| 2012-12-19 10:00:00 | 352 |
| 2012-12-19 11:00:00 | 349.25 |
| 2012-12-19 12:00:00 | 349.75 |
| 2012-12-19 13:00:00 | 368.25 |
| 2012-12-19 14:00:00 | 365 |
| 2012-12-19 15:00:00 | 356.5 |
| 2012-12-19 16:00:00 | 356.5 |
| 2012-12-19 17:00:00 | 353.5 |
| 2012-12-19 18:00:00 | 355 |
| 2012-12-19 19:00:00 | 353 |
| 2012-12-19 20:00:00 | 352.5 |
| 2012-12-19 21:00:00 | 349.75 |
| 2012-12-19 22:00:00 | 348.5 |
| 2012-12-19 23:00:00 | 375.25 |
| 2012-12-20 | 381.25 |
| 2012-12-20 01:00:00 | 393.5 |
| 2012-12-20 02:00:00 | 390 |
| 2012-12-20 03:00:00 | 373 |
| 2012-12-20 04:00:00 | 372 |
| 2012-12-20 05:00:00 | 370.25 |
| 2012-12-20 06:00:00 | 394.25 |
| 2012-12-20 07:00:00 | 395.75 |
| 2012-12-20 08:00:00 | 409.5 |
| 2012-12-20 09:00:00 | 404.25 |
| 2012-12-20 10:00:00 | 381 |
| 2012-12-20 11:00:00 | 357.5 |
| 2012-12-20 12:00:00 | 355.5 |
| 2012-12-20 13:00:00 | 365.5 |
| 2012-12-20 14:00:00 | 358.5 |
| 2012-12-20 15:00:00 | 362.75 |
| 2012-12-20 16:00:00 | 365.25 |
| 2012-12-20 17:00:00 | 347.75 |
| 2012-12-20 18:00:00 | 350.5 |
| 2012-12-20 19:00:00 | 349.5 |
| 2012-12-20 20:00:00 | 350 |
| 2012-12-20 21:00:00 | 352.25 |
| 2012-12-20 22:00:00 | 359.25 |
| 2012-12-20 23:00:00 | 377.5 |
| 2012-12-21 | 365.75 |
| 2012-12-21 01:00:00 | 387 |
| 2012-12-21 02:00:00 | 379.75 |
| 2012-12-21 03:00:00 | 366 |
| 2012-12-21 04:00:00 | 363.25 |
| 2012-12-21 05:00:00 | 382 |
| 2012-12-21 06:00:00 | 388.5 |
| 2012-12-21 07:00:00 | 376.5 |
| 2012-12-21 08:00:00 | 359.5 |
| 2012-12-21 09:00:00 | 350.75 |
| 2012-12-21 10:00:00 | 355.5 |
| 2012-12-21 11:00:00 | 364.5 |
| 2012-12-21 12:00:00 | 366 |
| 2012-12-21 13:00:00 | 362.5 |
| 2012-12-21 14:00:00 | 356.25 |
| 2012-12-21 15:00:00 | 359 |
| 2012-12-21 16:00:00 | 361.25 |
| 2012-12-21 17:00:00 | 368.25 |
| 2012-12-21 18:00:00 | 359.25 |
| 2012-12-21 19:00:00 | 354.75 |
| 2012-12-21 20:00:00 | 355.5 |
| 2012-12-21 21:00:00 | 353 |
| 2012-12-21 22:00:00 | 352 |
| 2012-12-21 23:00:00 | 373.75 |
| 2012-12-22 | 363.25 |
| 2012-12-22 01:00:00 | 390.75 |
| 2012-12-22 02:00:00 | 395.25 |
| 2012-12-22 03:00:00 | 374.75 |
| 2012-12-22 04:00:00 | 364.5 |
| 2012-12-22 05:00:00 | 370 |
| 2012-12-22 06:00:00 | 381.25 |
| 2012-12-22 07:00:00 | 395.75 |
| 2012-12-22 08:00:00 | 398.5 |
| 2012-12-22 09:00:00 | 392.5 |
| 2012-12-22 10:00:00 | 400.25 |
| 2012-12-22 11:00:00 | 396.25 |
| 2012-12-22 12:00:00 | 387.5 |
| 2012-12-22 13:00:00 | 397.5 |
| 2012-12-22 14:00:00 | 390.25 |
| 2012-12-22 15:00:00 | 392.25 |
| 2012-12-22 16:00:00 | 386.75 |
| 2012-12-22 17:00:00 | 383.75 |
| 2012-12-22 18:00:00 | 384.75 |
| 2012-12-22 19:00:00 | 386.75 |
| 2012-12-22 20:00:00 | 374.25 |
| 2012-12-22 21:00:00 | 379.25 |
| 2012-12-22 22:00:00 | 403 |
| 2012-12-22 23:00:00 | 403 |
| 2012-12-23 | 398.5 |
| 2012-12-23 01:00:00 | 382.25 |
| 2012-12-23 02:00:00 | 379.75 |
| 2012-12-23 03:00:00 | 362 |
| 2012-12-23 04:00:00 | 358.5 |
| 2012-12-23 05:00:00 | 373.25 |
| 2012-12-23 06:00:00 | 377.75 |
| 2012-12-23 07:00:00 | 383.5 |
| 2012-12-23 08:00:00 | 391.5 |
| 2012-12-23 09:00:00 | 390.5 |
| 2012-12-23 10:00:00 | 392.5 |
| 2012-12-23 11:00:00 | 383.75 |
| 2012-12-23 12:00:00 | 377.5 |
| 2012-12-23 13:00:00 | 363.75 |
| 2012-12-23 14:00:00 | 346.5 |
| 2012-12-23 15:00:00 | 348 |
| 2012-12-23 16:00:00 | 346.5 |
| 2012-12-23 17:00:00 | 343.25 |
| 2012-12-23 18:00:00 | 339.25 |
| 2012-12-23 19:00:00 | 346.5 |
| 2012-12-23 20:00:00 | 343.25 |
| 2012-12-23 21:00:00 | 345.25 |
| 2012-12-23 22:00:00 | 355.75 |
| 2012-12-23 23:00:00 | 356 |
| 2012-12-24 | 359.25 |
| 2012-12-24 01:00:00 | 384.75 |
| 2012-12-24 02:00:00 | 378.75 |
| 2012-12-24 03:00:00 | 363.75 |
| 2012-12-24 04:00:00 | 359.25 |
| 2012-12-24 05:00:00 | 371.25 |
| 2012-12-24 06:00:00 | 380.5 |
| 2012-12-24 07:00:00 | 385.25 |
| 2012-12-24 08:00:00 | 387 |
| 2012-12-24 09:00:00 | 381.25 |
| 2012-12-24 10:00:00 | 376.75 |
| 2012-12-24 11:00:00 | 390.75 |
| 2012-12-24 12:00:00 | 388.75 |
| 2012-12-24 13:00:00 | 405.75 |
| 2012-12-24 14:00:00 | 396.25 |
| 2012-12-24 15:00:00 | 388.75 |
| 2012-12-24 16:00:00 | 386.5 |
| 2012-12-24 17:00:00 | 385.75 |
| 2012-12-24 18:00:00 | 385.25 |
| 2012-12-24 19:00:00 | 387.25 |
| 2012-12-24 20:00:00 | 390 |
| 2012-12-24 21:00:00 | 382.75 |
| 2012-12-24 22:00:00 | 383.75 |
| 2012-12-24 23:00:00 | 408.25 |
| 2012-12-25 | 397 |
| 2012-12-25 01:00:00 | 382.75 |
| 2012-12-25 02:00:00 | 382.5 |
| 2012-12-25 03:00:00 | 365 |
| 2012-12-25 04:00:00 | 362.5 |
| 2012-12-25 05:00:00 | 367.75 |
| 2012-12-25 06:00:00 | 370.5 |
| 2012-12-25 07:00:00 | 382 |
| 2012-12-25 08:00:00 | 382.25 |
| 2012-12-25 09:00:00 | 378.25 |
| 2012-12-25 10:00:00 | 376.5 |
| 2012-12-25 11:00:00 | 373.5 |
| 2012-12-25 12:00:00 | 390.25 |
| 2012-12-25 13:00:00 | 404.25 |
| 2012-12-25 14:00:00 | 403.5 |
| 2012-12-25 15:00:00 | 399.5 |
| 2012-12-25 16:00:00 | 396.75 |
| 2012-12-25 17:00:00 | 395.5 |
| 2012-12-25 18:00:00 | 386.25 |
| 2012-12-25 19:00:00 | 383.5 |
| 2012-12-25 20:00:00 | 387.25 |
| 2012-12-25 21:00:00 | 385 |
| 2012-12-25 22:00:00 | 399.25 |
| 2012-12-25 23:00:00 | 402 |
| 2012-12-26 | 411 |
| 2012-12-26 01:00:00 | 392.5 |
| 2012-12-26 02:00:00 | 373 |
| 2012-12-26 03:00:00 | 366.75 |
| 2012-12-26 04:00:00 | 365.25 |
| 2012-12-26 05:00:00 | 406.25 |
| 2012-12-26 06:00:00 | 415.5 |
| 2012-12-26 07:00:00 | 417 |
| 2012-12-26 08:00:00 | 418.5 |
| 2012-12-26 09:00:00 | 404 |
| 2012-12-26 10:00:00 | 367.5 |
| 2012-12-26 11:00:00 | 345 |
| 2012-12-26 12:00:00 | 348.25 |
| 2012-12-26 13:00:00 | 364.75 |
| 2012-12-26 14:00:00 | 389 |
| 2012-12-26 15:00:00 | 383.75 |
| 2012-12-26 16:00:00 | 386.25 |
| 2012-12-26 17:00:00 | 391.25 |
| 2012-12-26 18:00:00 | 393.25 |
| 2012-12-26 19:00:00 | 386.75 |
| 2012-12-26 20:00:00 | 390.75 |
| 2012-12-26 21:00:00 | 383.5 |
| 2012-12-26 22:00:00 | 382.75 |
| 2012-12-26 23:00:00 | 413.25 |
| 2012-12-27 | 404.5 |
| 2012-12-27 01:00:00 | 386.75 |
| 2012-12-27 02:00:00 | 387.25 |
| 2012-12-27 03:00:00 | 375 |
| 2012-12-27 04:00:00 | 366.75 |
| 2012-12-27 05:00:00 | 373.25 |
| 2012-12-27 06:00:00 | 416.75 |
| 2012-12-27 07:00:00 | 431.25 |
| 2012-12-27 08:00:00 | 441.25 |
| 2012-12-27 09:00:00 | 406.25 |
| 2012-12-27 10:00:00 | 404 |
| 2012-12-27 11:00:00 | 395.75 |
| 2012-12-27 12:00:00 | 395.75 |
| 2012-12-27 13:00:00 | 404 |
| 2012-12-27 14:00:00 | 351.75 |
| 2012-12-27 15:00:00 | 346.25 |
| 2012-12-27 16:00:00 | 352.5 |
| 2012-12-27 17:00:00 | 350 |
| 2012-12-27 18:00:00 | 344 |
| 2012-12-27 19:00:00 | 346.5 |
| 2012-12-27 20:00:00 | 353.5 |
| 2012-12-27 21:00:00 | 347.75 |
| 2012-12-27 22:00:00 | 354.75 |
| 2012-12-27 23:00:00 | 372.25 |
| 2012-12-28 | 367.5 |
| 2012-12-28 01:00:00 | 392.75 |
| 2012-12-28 02:00:00 | 387.75 |
| 2012-12-28 03:00:00 | 372.75 |
| 2012-12-28 04:00:00 | 369.5 |
| 2012-12-28 05:00:00 | 384.25 |
| 2012-12-28 06:00:00 | 388.25 |
| 2012-12-28 07:00:00 | 406.25 |
| 2012-12-28 08:00:00 | 458.25 |
| 2012-12-28 09:00:00 | 413.25 |
| 2012-12-28 10:00:00 | 404.75 |
| 2012-12-28 11:00:00 | 395.25 |
| 2012-12-28 12:00:00 | 392 |
| 2012-12-28 13:00:00 | 404.25 |
| 2012-12-28 14:00:00 | 390.5 |
| 2012-12-28 15:00:00 | 389.25 |
| 2012-12-28 16:00:00 | 386.75 |
| 2012-12-28 17:00:00 | 398 |
| 2012-12-28 18:00:00 | 401.5 |
| 2012-12-28 19:00:00 | 390.5 |
| 2012-12-28 20:00:00 | 390.5 |
| 2012-12-28 21:00:00 | 393 |
| 2012-12-28 22:00:00 | 390.5 |
| 2012-12-28 23:00:00 | 413.25 |
| 2012-12-29 | 414 |
| 2012-12-29 01:00:00 | 392 |
| 2012-12-29 02:00:00 | 390 |
| 2012-12-29 03:00:00 | 376.25 |
| 2012-12-29 04:00:00 | 367.75 |
| 2012-12-29 05:00:00 | 374 |
| 2012-12-29 06:00:00 | 387.75 |
| 2012-12-29 07:00:00 | 390.25 |
| 2012-12-29 08:00:00 | 392 |
| 2012-12-29 09:00:00 | 395.5 |
| 2012-12-29 10:00:00 | 393 |
| 2012-12-29 11:00:00 | 380.25 |
| 2012-12-29 12:00:00 | 383 |
| 2012-12-29 13:00:00 | 391.75 |
| 2012-12-29 14:00:00 | 393.25 |
| 2012-12-29 15:00:00 | 392.5 |
| 2012-12-29 16:00:00 | 391.5 |
| 2012-12-29 17:00:00 | 395.25 |
| 2012-12-29 18:00:00 | 389 |
| 2012-12-29 19:00:00 | 402.75 |
| 2012-12-29 20:00:00 | 403 |
| 2012-12-29 21:00:00 | 363.5 |
| 2012-12-29 22:00:00 | 370.25 |
| 2012-12-29 23:00:00 | 404.75 |
| 2012-12-30 | 382.75 |
| 2012-12-30 01:00:00 | 379.25 |
| 2012-12-30 02:00:00 | 376.5 |
| 2012-12-30 03:00:00 | 374 |
| 2012-12-30 04:00:00 | 373.75 |
| 2012-12-30 05:00:00 | 387.25 |
| 2012-12-30 06:00:00 | 389.75 |
| 2012-12-30 07:00:00 | 396.25 |
| 2012-12-30 08:00:00 | 403.5 |
| 2012-12-30 09:00:00 | 402.25 |
| 2012-12-30 10:00:00 | 398 |
| 2012-12-30 11:00:00 | 389 |
| 2012-12-30 12:00:00 | 390 |
| 2012-12-30 13:00:00 | 398.5 |
| 2012-12-30 14:00:00 | 390 |
| 2012-12-30 15:00:00 | 391 |
| 2012-12-30 16:00:00 | 386.5 |
| 2012-12-30 17:00:00 | 387.5 |
| 2012-12-30 18:00:00 | 391.75 |
| 2012-12-30 19:00:00 | 395 |
| 2012-12-30 20:00:00 | 404.75 |
| 2012-12-30 21:00:00 | 374.25 |
| 2012-12-30 22:00:00 | 363.5 |
| 2012-12-30 23:00:00 | 369 |
| 2012-12-31 | 387.25 |
| 2012-12-31 | 376.75 |
| 2012-12-31 | 376.5 |
| 2012-12-31 | 376 |
| 2012-12-31 | 366.75 |
| 2012-12-31 | 372.75 |
| 2012-12-31 | 386 |
| 2012-12-31 | 392.25 |
| 2012-12-31 | 407.5 |
| 2012-12-31 | 390.5 |
| 2012-12-31 | 381 |
| 2012-12-31 | 379.5 |
| 2012-12-31 | 387.75 |
| 2012-12-31 | 408.5 |
| 2012-12-31 | 390.25 |
| 2012-12-31 | 395.25 |
| 2012-12-31 | 403.75 |
| 2012-12-31 | 402 |
| 2012-12-31 | 393.5 |
| 2012-12-31 | 389.75 |
| 2012-12-31 | 390 |
| 2012-12-31 | 391.25 |
| 2012-12-31 | 388.25 |
| 2012-12-31 | 413.5 |
| 2013-01-01 | 413 |